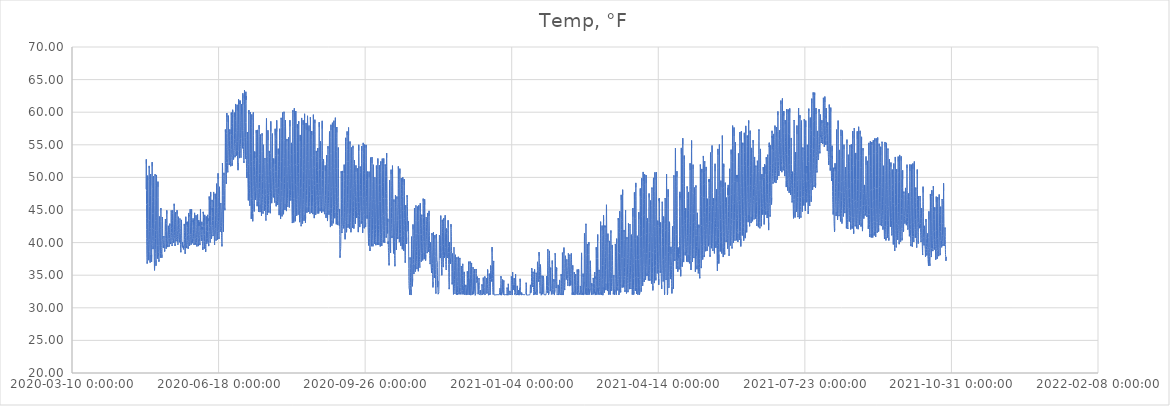
| Category | Temp, °F |
|---|---|
| 43950.56079861111 | 48.192 |
| 43950.602465277785 | 50.663 |
| 43950.64413194445 | 52.227 |
| 43950.68579861111 | 52.767 |
| 43950.727465277785 | 52.072 |
| 43950.76913194445 | 50.354 |
| 43950.81079861111 | 48.038 |
| 43950.852465277785 | 45.837 |
| 43950.89413194445 | 43.752 |
| 43950.93579861111 | 41.995 |
| 43950.977465277785 | 40.644 |
| 43951.01913194445 | 39.601 |
| 43951.06079861111 | 38.848 |
| 43951.102465277785 | 38.231 |
| 43951.14413194445 | 37.69 |
| 43951.18579861111 | 37.343 |
| 43951.227465277785 | 37.034 |
| 43951.26913194445 | 36.783 |
| 43951.31079861111 | 36.841 |
| 43951.352465277785 | 37.13 |
| 43951.39413194445 | 38.385 |
| 43951.43579861111 | 40.2 |
| 43951.477465277785 | 42.96 |
| 43951.51913194445 | 46.03 |
| 43951.56079861111 | 48.984 |
| 43951.602465277785 | 50.277 |
| 43951.64413194445 | 50.316 |
| 43951.68579861111 | 50.258 |
| 43951.727465277785 | 49.601 |
| 43951.76913194445 | 48.115 |
| 43951.81079861111 | 46.513 |
| 43951.852465277785 | 45.007 |
| 43951.89413194445 | 43.578 |
| 43951.93579861111 | 42.285 |
| 43951.977465277785 | 41.204 |
| 43952.01913194445 | 40.373 |
| 43952.06079861111 | 39.736 |
| 43952.102465277785 | 39.177 |
| 43952.14413194445 | 38.578 |
| 43952.18579861111 | 38.192 |
| 43952.227465277785 | 37.864 |
| 43952.26913194445 | 37.478 |
| 43952.31079861111 | 37.304 |
| 43952.352465277785 | 37.439 |
| 43952.39413194445 | 38.501 |
| 43952.43579861111 | 40.528 |
| 43952.477465277785 | 43.52 |
| 43952.51913194445 | 46.011 |
| 43952.56079861111 | 49.37 |
| 43952.602465277785 | 50.682 |
| 43952.64413194445 | 51.764 |
| 43952.68579861111 | 51.416 |
| 43952.727465277785 | 51.165 |
| 43952.76913194445 | 49.679 |
| 43952.81079861111 | 47.767 |
| 43952.852465277785 | 45.528 |
| 43952.89413194445 | 43.424 |
| 43952.93579861111 | 41.744 |
| 43952.977465277785 | 40.528 |
| 43953.01913194445 | 39.64 |
| 43953.06079861111 | 39.022 |
| 43953.102465277785 | 38.597 |
| 43953.14413194445 | 38.057 |
| 43953.18579861111 | 37.671 |
| 43953.227465277785 | 37.304 |
| 43953.26913194445 | 37.092 |
| 43953.31079861111 | 36.937 |
| 43953.352465277785 | 37.014 |
| 43953.39413194445 | 38.134 |
| 43953.43579861111 | 39.968 |
| 43953.477465277785 | 42.13 |
| 43953.51913194445 | 44.833 |
| 43953.56079861111 | 47.265 |
| 43953.602465277785 | 49.119 |
| 43953.64413194445 | 50.335 |
| 43953.68579861111 | 50.509 |
| 43953.727465277785 | 48.752 |
| 43953.76913194445 | 47.285 |
| 43953.81079861111 | 45.644 |
| 43953.852465277785 | 44.061 |
| 43953.89413194445 | 42.864 |
| 43953.93579861111 | 41.725 |
| 43953.977465277785 | 41.03 |
| 43954.01913194445 | 40.393 |
| 43954.06079861111 | 39.717 |
| 43954.102465277785 | 39.292 |
| 43954.14413194445 | 38.52 |
| 43954.18579861111 | 37.941 |
| 43954.227465277785 | 37.458 |
| 43954.26913194445 | 37.343 |
| 43954.31079861111 | 37.053 |
| 43954.352465277785 | 37.169 |
| 43954.39413194445 | 38.153 |
| 43954.43579861111 | 39.891 |
| 43954.477465277785 | 42.574 |
| 43954.51913194445 | 45.451 |
| 43954.56079861111 | 48.173 |
| 43954.602465277785 | 50.258 |
| 43954.64413194445 | 51.879 |
| 43954.68579861111 | 52.343 |
| 43954.727465277785 | 51.667 |
| 43954.76913194445 | 50.142 |
| 43954.81079861111 | 48.25 |
| 43954.852465277785 | 46.281 |
| 43954.89413194445 | 44.505 |
| 43954.93579861111 | 42.999 |
| 43954.977465277785 | 42.111 |
| 43955.01913194445 | 40.991 |
| 43955.06079861111 | 40.354 |
| 43955.102465277785 | 39.852 |
| 43955.14413194445 | 39.505 |
| 43955.18579861111 | 39.273 |
| 43955.227465277785 | 39.177 |
| 43955.26913194445 | 39.003 |
| 43955.31079861111 | 38.868 |
| 43955.352465277785 | 39.003 |
| 43955.39413194445 | 39.428 |
| 43955.43579861111 | 40.18 |
| 43955.477465277785 | 40.895 |
| 43955.51913194445 | 41.995 |
| 43955.56079861111 | 44.447 |
| 43955.602465277785 | 46.899 |
| 43955.64413194445 | 49.177 |
| 43955.68579861111 | 50.2 |
| 43955.727465277785 | 49.852 |
| 43955.76913194445 | 48.655 |
| 43955.81079861111 | 46.648 |
| 43955.852465277785 | 44.621 |
| 43955.89413194445 | 42.787 |
| 43955.93579861111 | 41.57 |
| 43955.977465277785 | 40.238 |
| 43956.01913194445 | 39.273 |
| 43956.06079861111 | 38.424 |
| 43956.102465277785 | 37.748 |
| 43956.14413194445 | 37.227 |
| 43956.18579861111 | 36.783 |
| 43956.227465277785 | 36.397 |
| 43956.26913194445 | 36.01 |
| 43956.31079861111 | 35.74 |
| 43956.352465277785 | 35.76 |
| 43956.39413194445 | 36.532 |
| 43956.43579861111 | 37.922 |
| 43956.477465277785 | 40.2 |
| 43956.51913194445 | 42.941 |
| 43956.56079861111 | 45.682 |
| 43956.602465277785 | 48.231 |
| 43956.64413194445 | 49.949 |
| 43956.68579861111 | 50.489 |
| 43956.727465277785 | 50.2 |
| 43956.76913194445 | 48.81 |
| 43956.81079861111 | 46.821 |
| 43956.852465277785 | 44.987 |
| 43956.89413194445 | 43.385 |
| 43956.93579861111 | 41.841 |
| 43956.977465277785 | 40.624 |
| 43957.01913194445 | 39.64 |
| 43957.06079861111 | 38.983 |
| 43957.102465277785 | 38.346 |
| 43957.14413194445 | 37.806 |
| 43957.18579861111 | 37.323 |
| 43957.227465277785 | 36.995 |
| 43957.26913194445 | 36.686 |
| 43957.31079861111 | 36.455 |
| 43957.352465277785 | 36.551 |
| 43957.39413194445 | 37.304 |
| 43957.43579861111 | 39.022 |
| 43957.477465277785 | 41.261 |
| 43957.51913194445 | 43.81 |
| 43957.56079861111 | 46.493 |
| 43957.602465277785 | 49.022 |
| 43957.64413194445 | 50.374 |
| 43957.68579861111 | 50.123 |
| 43957.727465277785 | 49.254 |
| 43957.76913194445 | 48.096 |
| 43957.81079861111 | 46.609 |
| 43957.852465277785 | 44.929 |
| 43957.89413194445 | 43.385 |
| 43957.93579861111 | 42.111 |
| 43957.977465277785 | 41.146 |
| 43958.01913194445 | 40.258 |
| 43958.06079861111 | 39.563 |
| 43958.102465277785 | 38.983 |
| 43958.14413194445 | 38.539 |
| 43958.18579861111 | 38.211 |
| 43958.227465277785 | 37.902 |
| 43958.26913194445 | 37.729 |
| 43958.31079861111 | 37.613 |
| 43958.352465277785 | 37.555 |
| 43958.39413194445 | 38.173 |
| 43958.43579861111 | 39.563 |
| 43958.477465277785 | 41.821 |
| 43958.51913194445 | 44.389 |
| 43958.56079861111 | 46.976 |
| 43958.602465277785 | 48.675 |
| 43958.64413194445 | 49.35 |
| 43958.68579861111 | 48.54 |
| 43958.727465277785 | 46.937 |
| 43958.76913194445 | 44.563 |
| 43958.81079861111 | 42.536 |
| 43958.852465277785 | 40.837 |
| 43958.89413194445 | 39.485 |
| 43958.93579861111 | 38.868 |
| 43958.977465277785 | 38.694 |
| 43959.01913194445 | 38.462 |
| 43959.06079861111 | 37.922 |
| 43959.102465277785 | 37.671 |
| 43959.14413194445 | 37.709 |
| 43959.18579861111 | 37.555 |
| 43959.227465277785 | 37.381 |
| 43959.26913194445 | 37.227 |
| 43959.31079861111 | 37.072 |
| 43959.352465277785 | 37.072 |
| 43959.39413194445 | 37.381 |
| 43959.43579861111 | 38.269 |
| 43959.477465277785 | 39.582 |
| 43959.51913194445 | 40.991 |
| 43959.56079861111 | 42.381 |
| 43959.602465277785 | 43.501 |
| 43959.64413194445 | 44.003 |
| 43959.68579861111 | 44.041 |
| 43959.727465277785 | 43.848 |
| 43959.76913194445 | 43.211 |
| 43959.81079861111 | 42.343 |
| 43959.852465277785 | 41.397 |
| 43959.89413194445 | 40.663 |
| 43959.93579861111 | 40.161 |
| 43959.977465277785 | 39.273 |
| 43960.01913194445 | 39.292 |
| 43960.06079861111 | 38.81 |
| 43960.102465277785 | 38.636 |
| 43960.14413194445 | 38.308 |
| 43960.18579861111 | 38.404 |
| 43960.227465277785 | 38.192 |
| 43960.26913194445 | 37.96 |
| 43960.31079861111 | 37.69 |
| 43960.352465277785 | 37.883 |
| 43960.39413194445 | 38.288 |
| 43960.43579861111 | 39.312 |
| 43960.477465277785 | 40.856 |
| 43960.51913194445 | 42.053 |
| 43960.56079861111 | 43.308 |
| 43960.602465277785 | 44.428 |
| 43960.64413194445 | 45.296 |
| 43960.68579861111 | 44.949 |
| 43960.727465277785 | 44.292 |
| 43960.76913194445 | 43.231 |
| 43960.81079861111 | 41.3 |
| 43960.852465277785 | 40.335 |
| 43960.89413194445 | 39.582 |
| 43960.93579861111 | 39.234 |
| 43960.977465277785 | 38.926 |
| 43961.01913194445 | 38.578 |
| 43961.06079861111 | 38.366 |
| 43961.102465277785 | 38.366 |
| 43961.14413194445 | 38.211 |
| 43961.18579861111 | 38.153 |
| 43961.227465277785 | 38.038 |
| 43961.26913194445 | 37.844 |
| 43961.31079861111 | 37.671 |
| 43961.352465277785 | 37.748 |
| 43961.39413194445 | 38.173 |
| 43961.43579861111 | 39.099 |
| 43961.477465277785 | 40.238 |
| 43961.51913194445 | 41.609 |
| 43961.56079861111 | 42.651 |
| 43961.602465277785 | 43.404 |
| 43961.64413194445 | 43.926 |
| 43961.68579861111 | 43.868 |
| 43961.727465277785 | 43.694 |
| 43961.76913194445 | 43.308 |
| 43961.81079861111 | 42.188 |
| 43961.852465277785 | 41.088 |
| 43961.89413194445 | 40.451 |
| 43961.93579861111 | 40.142 |
| 43961.977465277785 | 39.968 |
| 43962.01913194445 | 39.872 |
| 43962.06079861111 | 39.814 |
| 43962.102465277785 | 39.64 |
| 43962.14413194445 | 39.35 |
| 43962.18579861111 | 39.273 |
| 43962.227465277785 | 39.254 |
| 43962.26913194445 | 39.215 |
| 43962.31079861111 | 39.215 |
| 43962.352465277785 | 39.177 |
| 43962.39413194445 | 39.254 |
| 43962.43579861111 | 39.505 |
| 43962.477465277785 | 39.717 |
| 43962.51913194445 | 40.065 |
| 43962.56079861111 | 40.258 |
| 43962.602465277785 | 40.431 |
| 43962.64413194445 | 40.644 |
| 43962.68579861111 | 40.991 |
| 43962.727465277785 | 41.049 |
| 43962.76913194445 | 40.837 |
| 43962.81079861111 | 40.509 |
| 43962.852465277785 | 40.296 |
| 43962.89413194445 | 39.987 |
| 43962.93579861111 | 39.814 |
| 43962.977465277785 | 39.678 |
| 43963.01913194445 | 39.099 |
| 43963.06079861111 | 38.964 |
| 43963.102465277785 | 38.906 |
| 43963.14413194445 | 38.81 |
| 43963.18579861111 | 38.617 |
| 43963.227465277785 | 38.52 |
| 43963.26913194445 | 38.578 |
| 43963.31079861111 | 38.675 |
| 43963.352465277785 | 38.868 |
| 43963.39413194445 | 39.408 |
| 43963.43579861111 | 40.045 |
| 43963.477465277785 | 40.991 |
| 43963.51913194445 | 41.976 |
| 43963.56079861111 | 42.709 |
| 43963.602465277785 | 43.134 |
| 43963.64413194445 | 43.173 |
| 43963.68579861111 | 43.308 |
| 43963.727465277785 | 43.617 |
| 43963.76913194445 | 43.424 |
| 43963.81079861111 | 42.98 |
| 43963.852465277785 | 42.381 |
| 43963.89413194445 | 41.725 |
| 43963.93579861111 | 41.049 |
| 43963.977465277785 | 40.605 |
| 43964.01913194445 | 40.277 |
| 43964.06079861111 | 39.987 |
| 43964.102465277785 | 39.717 |
| 43964.14413194445 | 39.447 |
| 43964.18579861111 | 39.331 |
| 43964.227465277785 | 39.215 |
| 43964.26913194445 | 39.061 |
| 43964.31079861111 | 39.003 |
| 43964.352465277785 | 39.041 |
| 43964.39413194445 | 39.196 |
| 43964.43579861111 | 39.794 |
| 43964.477465277785 | 40.682 |
| 43964.51913194445 | 41.783 |
| 43964.56079861111 | 42.941 |
| 43964.602465277785 | 43.848 |
| 43964.64413194445 | 44.601 |
| 43964.68579861111 | 44.949 |
| 43964.727465277785 | 44.91 |
| 43964.76913194445 | 44.428 |
| 43964.81079861111 | 43.636 |
| 43964.852465277785 | 42.806 |
| 43964.89413194445 | 41.899 |
| 43964.93579861111 | 41.3 |
| 43964.977465277785 | 40.856 |
| 43965.01913194445 | 40.509 |
| 43965.06079861111 | 40.335 |
| 43965.102465277785 | 40.122 |
| 43965.14413194445 | 39.91 |
| 43965.18579861111 | 39.659 |
| 43965.227465277785 | 39.485 |
| 43965.26913194445 | 39.408 |
| 43965.31079861111 | 39.312 |
| 43965.352465277785 | 39.428 |
| 43965.39413194445 | 39.563 |
| 43965.43579861111 | 39.872 |
| 43965.477465277785 | 40.47 |
| 43965.51913194445 | 41.107 |
| 43965.56079861111 | 41.512 |
| 43965.602465277785 | 41.551 |
| 43965.64413194445 | 41.725 |
| 43965.68579861111 | 42.072 |
| 43965.727465277785 | 42.285 |
| 43965.76913194445 | 42.574 |
| 43965.81079861111 | 42.497 |
| 43965.852465277785 | 41.995 |
| 43965.89413194445 | 41.474 |
| 43965.93579861111 | 40.991 |
| 43965.977465277785 | 40.605 |
| 43966.01913194445 | 40.258 |
| 43966.06079861111 | 40.103 |
| 43966.102465277785 | 39.929 |
| 43966.14413194445 | 39.736 |
| 43966.18579861111 | 39.563 |
| 43966.227465277785 | 39.37 |
| 43966.26913194445 | 39.312 |
| 43966.31079861111 | 39.331 |
| 43966.352465277785 | 39.428 |
| 43966.39413194445 | 39.64 |
| 43966.43579861111 | 40.103 |
| 43966.477465277785 | 40.644 |
| 43966.51913194445 | 41.242 |
| 43966.56079861111 | 41.609 |
| 43966.602465277785 | 42.072 |
| 43966.64413194445 | 42.362 |
| 43966.68579861111 | 42.69 |
| 43966.727465277785 | 42.902 |
| 43966.76913194445 | 42.574 |
| 43966.81079861111 | 42.246 |
| 43966.852465277785 | 41.821 |
| 43966.89413194445 | 41.319 |
| 43966.93579861111 | 40.933 |
| 43966.977465277785 | 40.547 |
| 43967.01913194445 | 40.316 |
| 43967.06079861111 | 40.122 |
| 43967.102465277785 | 40.007 |
| 43967.14413194445 | 39.949 |
| 43967.18579861111 | 39.91 |
| 43967.227465277785 | 39.891 |
| 43967.26913194445 | 39.814 |
| 43967.31079861111 | 39.775 |
| 43967.352465277785 | 39.756 |
| 43967.39413194445 | 40.103 |
| 43967.43579861111 | 40.74 |
| 43967.477465277785 | 41.59 |
| 43967.51913194445 | 42.458 |
| 43967.56079861111 | 43.095 |
| 43967.602465277785 | 43.964 |
| 43967.64413194445 | 44.582 |
| 43967.68579861111 | 44.929 |
| 43967.727465277785 | 44.756 |
| 43967.76913194445 | 44.389 |
| 43967.81079861111 | 43.636 |
| 43967.852465277785 | 42.864 |
| 43967.89413194445 | 42.13 |
| 43967.93579861111 | 41.57 |
| 43967.977465277785 | 41.049 |
| 43968.01913194445 | 40.76 |
| 43968.06079861111 | 40.393 |
| 43968.102465277785 | 40.103 |
| 43968.14413194445 | 39.91 |
| 43968.18579861111 | 39.794 |
| 43968.227465277785 | 39.64 |
| 43968.26913194445 | 39.485 |
| 43968.31079861111 | 39.37 |
| 43968.352465277785 | 39.37 |
| 43968.39413194445 | 39.659 |
| 43968.43579861111 | 40.296 |
| 43968.477465277785 | 41.358 |
| 43968.51913194445 | 42.362 |
| 43968.56079861111 | 43.424 |
| 43968.602465277785 | 44.466 |
| 43968.64413194445 | 44.949 |
| 43968.68579861111 | 44.794 |
| 43968.727465277785 | 44.485 |
| 43968.76913194445 | 44.196 |
| 43968.81079861111 | 43.848 |
| 43968.852465277785 | 43.192 |
| 43968.89413194445 | 42.536 |
| 43968.93579861111 | 41.956 |
| 43968.977465277785 | 41.493 |
| 43969.01913194445 | 41.126 |
| 43969.06079861111 | 40.817 |
| 43969.102465277785 | 40.605 |
| 43969.14413194445 | 40.393 |
| 43969.18579861111 | 40.238 |
| 43969.227465277785 | 40.122 |
| 43969.26913194445 | 39.949 |
| 43969.31079861111 | 39.929 |
| 43969.352465277785 | 39.929 |
| 43969.39413194445 | 40.2 |
| 43969.43579861111 | 40.779 |
| 43969.477465277785 | 41.783 |
| 43969.51913194445 | 42.883 |
| 43969.56079861111 | 44.08 |
| 43969.602465277785 | 45.065 |
| 43969.64413194445 | 45.74 |
| 43969.68579861111 | 45.953 |
| 43969.727465277785 | 46.049 |
| 43969.76913194445 | 45.586 |
| 43969.81079861111 | 44.659 |
| 43969.852465277785 | 43.617 |
| 43969.89413194445 | 42.709 |
| 43969.93579861111 | 41.956 |
| 43969.977465277785 | 41.493 |
| 43970.01913194445 | 41.049 |
| 43970.06079861111 | 40.663 |
| 43970.102465277785 | 40.431 |
| 43970.14413194445 | 39.91 |
| 43970.18579861111 | 39.987 |
| 43970.227465277785 | 39.833 |
| 43970.26913194445 | 39.64 |
| 43970.31079861111 | 39.485 |
| 43970.352465277785 | 39.447 |
| 43970.39413194445 | 39.814 |
| 43970.43579861111 | 40.663 |
| 43970.477465277785 | 41.725 |
| 43970.51913194445 | 43.076 |
| 43970.56079861111 | 43.655 |
| 43970.602465277785 | 43.945 |
| 43970.64413194445 | 44.466 |
| 43970.68579861111 | 44.679 |
| 43970.727465277785 | 44.254 |
| 43970.76913194445 | 43.462 |
| 43970.81079861111 | 42.787 |
| 43970.852465277785 | 42.439 |
| 43970.89413194445 | 41.03 |
| 43970.93579861111 | 40.47 |
| 43970.977465277785 | 40.528 |
| 43971.01913194445 | 40.2 |
| 43971.06079861111 | 40.47 |
| 43971.102465277785 | 40.586 |
| 43971.14413194445 | 40.47 |
| 43971.18579861111 | 40.47 |
| 43971.227465277785 | 40.567 |
| 43971.26913194445 | 40.567 |
| 43971.31079861111 | 40.47 |
| 43971.352465277785 | 40.47 |
| 43971.39413194445 | 40.76 |
| 43971.43579861111 | 41.339 |
| 43971.477465277785 | 42.092 |
| 43971.51913194445 | 42.864 |
| 43971.56079861111 | 43.655 |
| 43971.602465277785 | 44.08 |
| 43971.64413194445 | 44.717 |
| 43971.68579861111 | 44.968 |
| 43971.727465277785 | 44.408 |
| 43971.76913194445 | 43.578 |
| 43971.81079861111 | 42.594 |
| 43971.852465277785 | 41.86 |
| 43971.89413194445 | 41.628 |
| 43971.93579861111 | 41.281 |
| 43971.977465277785 | 40.933 |
| 43972.01913194445 | 40.682 |
| 43972.06079861111 | 40.007 |
| 43972.102465277785 | 40.084 |
| 43972.14413194445 | 39.968 |
| 43972.18579861111 | 39.833 |
| 43972.227465277785 | 39.678 |
| 43972.26913194445 | 39.621 |
| 43972.31079861111 | 39.582 |
| 43972.352465277785 | 39.563 |
| 43972.39413194445 | 39.833 |
| 43972.43579861111 | 40.451 |
| 43972.477465277785 | 41.204 |
| 43972.51913194445 | 42.014 |
| 43972.56079861111 | 42.825 |
| 43972.602465277785 | 43.501 |
| 43972.64413194445 | 43.964 |
| 43972.68579861111 | 44.061 |
| 43972.727465277785 | 43.733 |
| 43972.76913194445 | 43.366 |
| 43972.81079861111 | 42.787 |
| 43972.852465277785 | 41.976 |
| 43972.89413194445 | 41.532 |
| 43972.93579861111 | 41.358 |
| 43972.977465277785 | 41.126 |
| 43973.01913194445 | 40.914 |
| 43973.06079861111 | 40.702 |
| 43973.102465277785 | 40.605 |
| 43973.14413194445 | 40.47 |
| 43973.18579861111 | 40.238 |
| 43973.227465277785 | 40.161 |
| 43973.26913194445 | 40.045 |
| 43973.31079861111 | 39.987 |
| 43973.352465277785 | 40.007 |
| 43973.39413194445 | 40.258 |
| 43973.43579861111 | 40.837 |
| 43973.477465277785 | 41.532 |
| 43973.51913194445 | 42.304 |
| 43973.56079861111 | 42.941 |
| 43973.602465277785 | 43.404 |
| 43973.64413194445 | 43.694 |
| 43973.68579861111 | 43.713 |
| 43973.727465277785 | 43.52 |
| 43973.76913194445 | 43.134 |
| 43973.81079861111 | 42.574 |
| 43973.852465277785 | 42.13 |
| 43973.89413194445 | 41.744 |
| 43973.93579861111 | 41.377 |
| 43973.977465277785 | 40.528 |
| 43974.01913194445 | 39.698 |
| 43974.06079861111 | 39.485 |
| 43974.102465277785 | 39.138 |
| 43974.14413194445 | 38.848 |
| 43974.18579861111 | 38.694 |
| 43974.227465277785 | 38.675 |
| 43974.26913194445 | 38.52 |
| 43974.31079861111 | 38.597 |
| 43974.352465277785 | 38.79 |
| 43974.39413194445 | 39.621 |
| 43974.43579861111 | 40.798 |
| 43974.477465277785 | 41.512 |
| 43974.51913194445 | 41.628 |
| 43974.56079861111 | 42.15 |
| 43974.602465277785 | 42.671 |
| 43974.64413194445 | 43.482 |
| 43974.68579861111 | 43.578 |
| 43974.727465277785 | 43.192 |
| 43974.76913194445 | 42.42 |
| 43974.81079861111 | 41.763 |
| 43974.852465277785 | 41.107 |
| 43974.89413194445 | 40.624 |
| 43974.93579861111 | 40.258 |
| 43974.977465277785 | 39.968 |
| 43975.01913194445 | 39.949 |
| 43975.06079861111 | 39.891 |
| 43975.102465277785 | 39.756 |
| 43975.14413194445 | 39.601 |
| 43975.18579861111 | 39.601 |
| 43975.227465277785 | 39.485 |
| 43975.26913194445 | 39.408 |
| 43975.31079861111 | 39.408 |
| 43975.352465277785 | 39.582 |
| 43975.39413194445 | 39.775 |
| 43975.43579861111 | 40.084 |
| 43975.477465277785 | 40.18 |
| 43975.51913194445 | 39.717 |
| 43975.56079861111 | 39.756 |
| 43975.602465277785 | 39.621 |
| 43975.64413194445 | 39.485 |
| 43975.68579861111 | 39.37 |
| 43975.727465277785 | 39.254 |
| 43975.76913194445 | 39.292 |
| 43975.81079861111 | 39.505 |
| 43975.852465277785 | 39.389 |
| 43975.89413194445 | 39.196 |
| 43975.93579861111 | 39.08 |
| 43975.977465277785 | 39.061 |
| 43976.01913194445 | 38.964 |
| 43976.06079861111 | 38.926 |
| 43976.102465277785 | 38.868 |
| 43976.14413194445 | 38.829 |
| 43976.18579861111 | 38.829 |
| 43976.227465277785 | 38.829 |
| 43976.26913194445 | 38.926 |
| 43976.31079861111 | 38.983 |
| 43976.352465277785 | 39.08 |
| 43976.39413194445 | 39.505 |
| 43976.43579861111 | 40.431 |
| 43976.477465277785 | 41.493 |
| 43976.51913194445 | 41.918 |
| 43976.56079861111 | 41.86 |
| 43976.602465277785 | 42.864 |
| 43976.64413194445 | 42.536 |
| 43976.68579861111 | 41.86 |
| 43976.727465277785 | 41.532 |
| 43976.76913194445 | 41.126 |
| 43976.81079861111 | 40.489 |
| 43976.852465277785 | 39.872 |
| 43976.89413194445 | 39.408 |
| 43976.93579861111 | 39.119 |
| 43976.977465277785 | 38.848 |
| 43977.01913194445 | 38.733 |
| 43977.06079861111 | 38.52 |
| 43977.102465277785 | 38.52 |
| 43977.14413194445 | 38.385 |
| 43977.18579861111 | 38.288 |
| 43977.227465277785 | 38.327 |
| 43977.26913194445 | 38.269 |
| 43977.31079861111 | 38.346 |
| 43977.352465277785 | 38.617 |
| 43977.39413194445 | 39.485 |
| 43977.43579861111 | 40.76 |
| 43977.477465277785 | 41.763 |
| 43977.51913194445 | 42.69 |
| 43977.56079861111 | 43.366 |
| 43977.602465277785 | 43.81 |
| 43977.64413194445 | 43.964 |
| 43977.68579861111 | 42.902 |
| 43977.727465277785 | 42.343 |
| 43977.76913194445 | 41.821 |
| 43977.81079861111 | 41.416 |
| 43977.852465277785 | 40.914 |
| 43977.89413194445 | 40.296 |
| 43977.93579861111 | 40.084 |
| 43977.977465277785 | 39.929 |
| 43978.01913194445 | 39.872 |
| 43978.06079861111 | 39.678 |
| 43978.102465277785 | 39.505 |
| 43978.14413194445 | 39.331 |
| 43978.18579861111 | 39.254 |
| 43978.227465277785 | 39.196 |
| 43978.26913194445 | 39.157 |
| 43978.31079861111 | 39.196 |
| 43978.352465277785 | 39.505 |
| 43978.39413194445 | 40.065 |
| 43978.43579861111 | 41.088 |
| 43978.477465277785 | 42.671 |
| 43978.51913194445 | 43.153 |
| 43978.56079861111 | 42.767 |
| 43978.602465277785 | 42.787 |
| 43978.64413194445 | 43.192 |
| 43978.68579861111 | 43.076 |
| 43978.727465277785 | 42.343 |
| 43978.76913194445 | 41.551 |
| 43978.81079861111 | 41.107 |
| 43978.852465277785 | 40.702 |
| 43978.89413194445 | 40.354 |
| 43978.93579861111 | 40.026 |
| 43978.977465277785 | 39.891 |
| 43979.01913194445 | 39.717 |
| 43979.06079861111 | 39.678 |
| 43979.102465277785 | 39.543 |
| 43979.14413194445 | 39.447 |
| 43979.18579861111 | 39.254 |
| 43979.227465277785 | 39.138 |
| 43979.26913194445 | 39.061 |
| 43979.31079861111 | 39.061 |
| 43979.352465277785 | 39.331 |
| 43979.39413194445 | 40.219 |
| 43979.43579861111 | 41.261 |
| 43979.477465277785 | 42.555 |
| 43979.51913194445 | 43.713 |
| 43979.56079861111 | 44.35 |
| 43979.602465277785 | 44.543 |
| 43979.64413194445 | 44.003 |
| 43979.68579861111 | 44.234 |
| 43979.727465277785 | 44.041 |
| 43979.76913194445 | 43.269 |
| 43979.81079861111 | 42.381 |
| 43979.852465277785 | 41.686 |
| 43979.89413194445 | 41.107 |
| 43979.93579861111 | 40.76 |
| 43979.977465277785 | 40.47 |
| 43980.01913194445 | 40.2 |
| 43980.06079861111 | 40.007 |
| 43980.102465277785 | 39.891 |
| 43980.14413194445 | 39.736 |
| 43980.18579861111 | 39.659 |
| 43980.227465277785 | 39.524 |
| 43980.26913194445 | 39.466 |
| 43980.31079861111 | 39.447 |
| 43980.352465277785 | 39.717 |
| 43980.39413194445 | 40.258 |
| 43980.43579861111 | 41.223 |
| 43980.477465277785 | 42.265 |
| 43980.51913194445 | 43.134 |
| 43980.56079861111 | 44.041 |
| 43980.602465277785 | 44.814 |
| 43980.64413194445 | 45.123 |
| 43980.68579861111 | 44.312 |
| 43980.727465277785 | 43.424 |
| 43980.76913194445 | 43.018 |
| 43980.81079861111 | 42.4 |
| 43980.852465277785 | 41.783 |
| 43980.89413194445 | 41.242 |
| 43980.93579861111 | 40.914 |
| 43980.977465277785 | 40.547 |
| 43981.01913194445 | 40.258 |
| 43981.06079861111 | 40.2 |
| 43981.102465277785 | 40.161 |
| 43981.14413194445 | 40.084 |
| 43981.18579861111 | 39.949 |
| 43981.227465277785 | 39.872 |
| 43981.26913194445 | 39.678 |
| 43981.31079861111 | 39.659 |
| 43981.352465277785 | 39.814 |
| 43981.39413194445 | 40.354 |
| 43981.43579861111 | 41.184 |
| 43981.477465277785 | 42.4 |
| 43981.51913194445 | 43.559 |
| 43981.56079861111 | 44.736 |
| 43981.602465277785 | 45.103 |
| 43981.64413194445 | 44.292 |
| 43981.68579861111 | 43.038 |
| 43981.727465277785 | 42.265 |
| 43981.76913194445 | 41.899 |
| 43981.81079861111 | 41.57 |
| 43981.852465277785 | 41.242 |
| 43981.89413194445 | 40.972 |
| 43981.93579861111 | 40.624 |
| 43981.977465277785 | 40.373 |
| 43982.01913194445 | 40.258 |
| 43982.06079861111 | 40.161 |
| 43982.102465277785 | 40.18 |
| 43982.14413194445 | 40.2 |
| 43982.18579861111 | 40.065 |
| 43982.227465277785 | 39.91 |
| 43982.26913194445 | 39.814 |
| 43982.31079861111 | 39.775 |
| 43982.352465277785 | 39.91 |
| 43982.39413194445 | 40.605 |
| 43982.43579861111 | 41.512 |
| 43982.477465277785 | 42.497 |
| 43982.51913194445 | 43.173 |
| 43982.56079861111 | 43.25 |
| 43982.602465277785 | 43.713 |
| 43982.64413194445 | 43.501 |
| 43982.68579861111 | 43.153 |
| 43982.727465277785 | 43.404 |
| 43982.76913194445 | 43.327 |
| 43982.81079861111 | 42.709 |
| 43982.852465277785 | 41.976 |
| 43982.89413194445 | 41.455 |
| 43982.93579861111 | 40.991 |
| 43982.977465277785 | 40.605 |
| 43983.01913194445 | 40.431 |
| 43983.06079861111 | 40.18 |
| 43983.102465277785 | 40.045 |
| 43983.14413194445 | 39.891 |
| 43983.18579861111 | 39.891 |
| 43983.227465277785 | 39.794 |
| 43983.26913194445 | 39.64 |
| 43983.31079861111 | 39.717 |
| 43983.352465277785 | 39.929 |
| 43983.39413194445 | 40.431 |
| 43983.43579861111 | 41.358 |
| 43983.477465277785 | 42.555 |
| 43983.51913194445 | 43.25 |
| 43983.56079861111 | 44.119 |
| 43983.602465277785 | 44.389 |
| 43983.64413194445 | 44.563 |
| 43983.68579861111 | 44.157 |
| 43983.727465277785 | 43.482 |
| 43983.76913194445 | 42.536 |
| 43983.81079861111 | 41.995 |
| 43983.852465277785 | 41.532 |
| 43983.89413194445 | 41.068 |
| 43983.93579861111 | 40.663 |
| 43983.977465277785 | 40.393 |
| 43984.01913194445 | 40.2 |
| 43984.06079861111 | 40.026 |
| 43984.102465277785 | 39.872 |
| 43984.14413194445 | 39.794 |
| 43984.18579861111 | 39.698 |
| 43984.227465277785 | 39.698 |
| 43984.26913194445 | 39.717 |
| 43984.31079861111 | 39.833 |
| 43984.352465277785 | 39.949 |
| 43984.39413194445 | 40.605 |
| 43984.43579861111 | 41.512 |
| 43984.477465277785 | 41.783 |
| 43984.51913194445 | 42.478 |
| 43984.56079861111 | 43.559 |
| 43984.602465277785 | 44.196 |
| 43984.64413194445 | 44.177 |
| 43984.68579861111 | 43.385 |
| 43984.727465277785 | 42.806 |
| 43984.76913194445 | 42.343 |
| 43984.81079861111 | 41.899 |
| 43984.852465277785 | 41.3 |
| 43984.89413194445 | 40.817 |
| 43984.93579861111 | 40.373 |
| 43984.977465277785 | 40.026 |
| 43985.01913194445 | 39.852 |
| 43985.06079861111 | 39.756 |
| 43985.102465277785 | 39.563 |
| 43985.14413194445 | 39.485 |
| 43985.18579861111 | 39.485 |
| 43985.227465277785 | 39.408 |
| 43985.26913194445 | 39.37 |
| 43985.31079861111 | 39.428 |
| 43985.352465277785 | 39.891 |
| 43985.39413194445 | 40.721 |
| 43985.43579861111 | 41.319 |
| 43985.477465277785 | 42.42 |
| 43985.51913194445 | 42.902 |
| 43985.56079861111 | 43.153 |
| 43985.602465277785 | 44.061 |
| 43985.64413194445 | 44.196 |
| 43985.68579861111 | 44.312 |
| 43985.727465277785 | 43.501 |
| 43985.76913194445 | 42.69 |
| 43985.81079861111 | 41.956 |
| 43985.852465277785 | 41.242 |
| 43985.89413194445 | 40.779 |
| 43985.93579861111 | 40.47 |
| 43985.977465277785 | 40.219 |
| 43986.01913194445 | 40.122 |
| 43986.06079861111 | 39.949 |
| 43986.102465277785 | 39.717 |
| 43986.14413194445 | 39.736 |
| 43986.18579861111 | 39.678 |
| 43986.227465277785 | 39.64 |
| 43986.26913194445 | 39.466 |
| 43986.31079861111 | 39.447 |
| 43986.352465277785 | 39.794 |
| 43986.39413194445 | 40.624 |
| 43986.43579861111 | 41.744 |
| 43986.477465277785 | 42.671 |
| 43986.51913194445 | 43.443 |
| 43986.56079861111 | 42.999 |
| 43986.602465277785 | 42.536 |
| 43986.64413194445 | 42.651 |
| 43986.68579861111 | 43.095 |
| 43986.727465277785 | 42.748 |
| 43986.76913194445 | 42.42 |
| 43986.81079861111 | 41.918 |
| 43986.852465277785 | 41.107 |
| 43986.89413194445 | 40.721 |
| 43986.93579861111 | 40.393 |
| 43986.977465277785 | 40.18 |
| 43987.01913194445 | 40.045 |
| 43987.06079861111 | 39.987 |
| 43987.102465277785 | 39.929 |
| 43987.14413194445 | 39.814 |
| 43987.18579861111 | 39.678 |
| 43987.227465277785 | 39.621 |
| 43987.26913194445 | 39.601 |
| 43987.31079861111 | 39.659 |
| 43987.352465277785 | 39.91 |
| 43987.39413194445 | 40.702 |
| 43987.43579861111 | 41.783 |
| 43987.477465277785 | 42.883 |
| 43987.51913194445 | 43.501 |
| 43987.56079861111 | 44.099 |
| 43987.602465277785 | 44.408 |
| 43987.64413194445 | 45.103 |
| 43987.68579861111 | 44.659 |
| 43987.727465277785 | 43.848 |
| 43987.76913194445 | 42.845 |
| 43987.81079861111 | 42.285 |
| 43987.852465277785 | 41.879 |
| 43987.89413194445 | 41.532 |
| 43987.93579861111 | 41.184 |
| 43987.977465277785 | 40.953 |
| 43988.01913194445 | 40.817 |
| 43988.06079861111 | 40.76 |
| 43988.102465277785 | 40.682 |
| 43988.14413194445 | 40.586 |
| 43988.18579861111 | 40.431 |
| 43988.227465277785 | 40.335 |
| 43988.26913194445 | 40.277 |
| 43988.31079861111 | 40.431 |
| 43988.352465277785 | 40.547 |
| 43988.39413194445 | 40.817 |
| 43988.43579861111 | 41.242 |
| 43988.477465277785 | 41.744 |
| 43988.51913194445 | 41.667 |
| 43988.56079861111 | 42.594 |
| 43988.602465277785 | 43.192 |
| 43988.64413194445 | 42.671 |
| 43988.68579861111 | 42.111 |
| 43988.727465277785 | 42.381 |
| 43988.76913194445 | 42.458 |
| 43988.81079861111 | 41.937 |
| 43988.852465277785 | 41.281 |
| 43988.89413194445 | 40.721 |
| 43988.93579861111 | 40.373 |
| 43988.977465277785 | 40.161 |
| 43989.01913194445 | 40.045 |
| 43989.06079861111 | 39.814 |
| 43989.102465277785 | 39.563 |
| 43989.14413194445 | 39.37 |
| 43989.18579861111 | 39.234 |
| 43989.227465277785 | 39.041 |
| 43989.26913194445 | 38.887 |
| 43989.31079861111 | 38.945 |
| 43989.352465277785 | 39.35 |
| 43989.39413194445 | 40.2 |
| 43989.43579861111 | 41.435 |
| 43989.477465277785 | 42.787 |
| 43989.51913194445 | 43.945 |
| 43989.56079861111 | 44.717 |
| 43989.602465277785 | 44.505 |
| 43989.64413194445 | 44.679 |
| 43989.68579861111 | 44.428 |
| 43989.727465277785 | 43.829 |
| 43989.76913194445 | 43.057 |
| 43989.81079861111 | 42.478 |
| 43989.852465277785 | 41.899 |
| 43989.89413194445 | 41.3 |
| 43989.93579861111 | 40.914 |
| 43989.977465277785 | 40.393 |
| 43990.01913194445 | 40.122 |
| 43990.06079861111 | 39.987 |
| 43990.102465277785 | 39.756 |
| 43990.14413194445 | 39.621 |
| 43990.18579861111 | 39.485 |
| 43990.227465277785 | 39.234 |
| 43990.26913194445 | 39.138 |
| 43990.31079861111 | 39.08 |
| 43990.352465277785 | 39.331 |
| 43990.39413194445 | 40.18 |
| 43990.43579861111 | 41.242 |
| 43990.477465277785 | 42.42 |
| 43990.51913194445 | 43.636 |
| 43990.56079861111 | 44.254 |
| 43990.602465277785 | 44.177 |
| 43990.64413194445 | 43.443 |
| 43990.68579861111 | 43.289 |
| 43990.727465277785 | 42.69 |
| 43990.76913194445 | 42.285 |
| 43990.81079861111 | 41.821 |
| 43990.852465277785 | 41.146 |
| 43990.89413194445 | 40.567 |
| 43990.93579861111 | 40.045 |
| 43990.977465277785 | 39.659 |
| 43991.01913194445 | 39.37 |
| 43991.06079861111 | 39.099 |
| 43991.102465277785 | 38.79 |
| 43991.14413194445 | 38.675 |
| 43991.18579861111 | 38.559 |
| 43991.227465277785 | 38.559 |
| 43991.26913194445 | 38.675 |
| 43991.31079861111 | 38.636 |
| 43991.352465277785 | 38.964 |
| 43991.39413194445 | 39.35 |
| 43991.43579861111 | 39.736 |
| 43991.477465277785 | 40.47 |
| 43991.51913194445 | 41.223 |
| 43991.56079861111 | 43.462 |
| 43991.602465277785 | 44.022 |
| 43991.64413194445 | 42.787 |
| 43991.68579861111 | 42.497 |
| 43991.727465277785 | 41.86 |
| 43991.76913194445 | 40.991 |
| 43991.81079861111 | 40.644 |
| 43991.852465277785 | 40.219 |
| 43991.89413194445 | 39.987 |
| 43991.93579861111 | 39.891 |
| 43991.977465277785 | 39.833 |
| 43992.01913194445 | 39.852 |
| 43992.06079861111 | 39.872 |
| 43992.102465277785 | 39.794 |
| 43992.14413194445 | 39.736 |
| 43992.18579861111 | 39.756 |
| 43992.227465277785 | 39.833 |
| 43992.26913194445 | 39.929 |
| 43992.31079861111 | 39.872 |
| 43992.352465277785 | 39.852 |
| 43992.39413194445 | 40.605 |
| 43992.43579861111 | 41.686 |
| 43992.477465277785 | 42.787 |
| 43992.51913194445 | 44.022 |
| 43992.56079861111 | 44.254 |
| 43992.602465277785 | 44.022 |
| 43992.64413194445 | 43.559 |
| 43992.68579861111 | 43.289 |
| 43992.727465277785 | 43.713 |
| 43992.76913194445 | 43.346 |
| 43992.81079861111 | 42.439 |
| 43992.852465277785 | 41.686 |
| 43992.89413194445 | 41.146 |
| 43992.93579861111 | 40.779 |
| 43992.977465277785 | 40.509 |
| 43993.01913194445 | 40.316 |
| 43993.06079861111 | 40.18 |
| 43993.102465277785 | 40.045 |
| 43993.14413194445 | 39.891 |
| 43993.18579861111 | 39.659 |
| 43993.227465277785 | 39.543 |
| 43993.26913194445 | 39.466 |
| 43993.31079861111 | 39.447 |
| 43993.352465277785 | 39.794 |
| 43993.39413194445 | 40.682 |
| 43993.43579861111 | 41.879 |
| 43993.477465277785 | 43.346 |
| 43993.51913194445 | 44.775 |
| 43993.56079861111 | 46.068 |
| 43993.602465277785 | 47.072 |
| 43993.64413194445 | 47.13 |
| 43993.68579861111 | 47.111 |
| 43993.727465277785 | 46.493 |
| 43993.76913194445 | 45.451 |
| 43993.81079861111 | 44.177 |
| 43993.852465277785 | 43.173 |
| 43993.89413194445 | 42.323 |
| 43993.93579861111 | 41.744 |
| 43993.977465277785 | 41.242 |
| 43994.01913194445 | 40.953 |
| 43994.06079861111 | 40.644 |
| 43994.102465277785 | 40.451 |
| 43994.14413194445 | 40.316 |
| 43994.18579861111 | 40.219 |
| 43994.227465277785 | 40.103 |
| 43994.26913194445 | 40.007 |
| 43994.31079861111 | 39.949 |
| 43994.352465277785 | 40.2 |
| 43994.39413194445 | 41.184 |
| 43994.43579861111 | 42.632 |
| 43994.477465277785 | 44.196 |
| 43994.51913194445 | 45.74 |
| 43994.56079861111 | 46.976 |
| 43994.602465277785 | 47.767 |
| 43994.64413194445 | 47.767 |
| 43994.68579861111 | 47.072 |
| 43994.727465277785 | 46.339 |
| 43994.76913194445 | 44.872 |
| 43994.81079861111 | 44.003 |
| 43994.852465277785 | 43.211 |
| 43994.89413194445 | 42.458 |
| 43994.93579861111 | 41.956 |
| 43994.977465277785 | 41.628 |
| 43995.01913194445 | 41.358 |
| 43995.06079861111 | 41.126 |
| 43995.102465277785 | 40.991 |
| 43995.14413194445 | 40.779 |
| 43995.18579861111 | 40.586 |
| 43995.227465277785 | 40.47 |
| 43995.26913194445 | 40.489 |
| 43995.31079861111 | 40.567 |
| 43995.352465277785 | 41.126 |
| 43995.39413194445 | 41.744 |
| 43995.43579861111 | 42.574 |
| 43995.477465277785 | 43.25 |
| 43995.51913194445 | 45.103 |
| 43995.56079861111 | 46.551 |
| 43995.602465277785 | 46.262 |
| 43995.64413194445 | 45.045 |
| 43995.68579861111 | 44.949 |
| 43995.727465277785 | 45.258 |
| 43995.76913194445 | 44.601 |
| 43995.81079861111 | 44.003 |
| 43995.852465277785 | 43.404 |
| 43995.89413194445 | 43.018 |
| 43995.93579861111 | 42.632 |
| 43995.977465277785 | 42.362 |
| 43996.01913194445 | 42.092 |
| 43996.06079861111 | 41.879 |
| 43996.102465277785 | 41.628 |
| 43996.14413194445 | 41.416 |
| 43996.18579861111 | 41.223 |
| 43996.227465277785 | 41.011 |
| 43996.26913194445 | 40.953 |
| 43996.31079861111 | 40.914 |
| 43996.352465277785 | 41.165 |
| 43996.39413194445 | 41.59 |
| 43996.43579861111 | 42.381 |
| 43996.477465277785 | 43.404 |
| 43996.51913194445 | 45.393 |
| 43996.56079861111 | 46.455 |
| 43996.602465277785 | 47.555 |
| 43996.64413194445 | 47.767 |
| 43996.68579861111 | 47.304 |
| 43996.727465277785 | 46.899 |
| 43996.76913194445 | 45.991 |
| 43996.81079861111 | 44.717 |
| 43996.852465277785 | 43.636 |
| 43996.89413194445 | 42.729 |
| 43996.93579861111 | 42.072 |
| 43996.977465277785 | 41.628 |
| 43997.01913194445 | 41.3 |
| 43997.06079861111 | 40.991 |
| 43997.102465277785 | 40.721 |
| 43997.14413194445 | 40.47 |
| 43997.18579861111 | 40.122 |
| 43997.227465277785 | 39.814 |
| 43997.26913194445 | 39.659 |
| 43997.31079861111 | 39.814 |
| 43997.352465277785 | 40.296 |
| 43997.39413194445 | 41.107 |
| 43997.43579861111 | 42.034 |
| 43997.477465277785 | 42.864 |
| 43997.51913194445 | 43.52 |
| 43997.56079861111 | 44.312 |
| 43997.602465277785 | 45.779 |
| 43997.64413194445 | 47.497 |
| 43997.68579861111 | 47.594 |
| 43997.727465277785 | 47.594 |
| 43997.76913194445 | 46.706 |
| 43997.81079861111 | 45.431 |
| 43997.852465277785 | 44.177 |
| 43997.89413194445 | 43.327 |
| 43997.93579861111 | 42.69 |
| 43997.977465277785 | 42.188 |
| 43998.01913194445 | 41.802 |
| 43998.06079861111 | 41.474 |
| 43998.102465277785 | 41.3 |
| 43998.14413194445 | 40.991 |
| 43998.18579861111 | 40.721 |
| 43998.227465277785 | 40.489 |
| 43998.26913194445 | 40.296 |
| 43998.31079861111 | 40.277 |
| 43998.352465277785 | 40.605 |
| 43998.39413194445 | 41.628 |
| 43998.43579861111 | 43.057 |
| 43998.477465277785 | 44.447 |
| 43998.51913194445 | 45.605 |
| 43998.56079861111 | 47.034 |
| 43998.602465277785 | 48.038 |
| 43998.64413194445 | 48.482 |
| 43998.68579861111 | 49.041 |
| 43998.727465277785 | 48.057 |
| 43998.76913194445 | 47.516 |
| 43998.81079861111 | 46.146 |
| 43998.852465277785 | 44.91 |
| 43998.89413194445 | 43.81 |
| 43998.93579861111 | 43.038 |
| 43998.977465277785 | 42.42 |
| 43999.01913194445 | 42.053 |
| 43999.06079861111 | 41.667 |
| 43999.102465277785 | 41.397 |
| 43999.14413194445 | 41.146 |
| 43999.18579861111 | 40.895 |
| 43999.227465277785 | 40.644 |
| 43999.26913194445 | 40.47 |
| 43999.31079861111 | 40.373 |
| 43999.352465277785 | 40.721 |
| 43999.39413194445 | 41.725 |
| 43999.43579861111 | 43.385 |
| 43999.477465277785 | 45.373 |
| 43999.51913194445 | 47.265 |
| 43999.56079861111 | 48.945 |
| 43999.602465277785 | 50.084 |
| 43999.64413194445 | 50.625 |
| 43999.68579861111 | 50.567 |
| 43999.727465277785 | 49.756 |
| 43999.76913194445 | 48.482 |
| 43999.81079861111 | 46.899 |
| 43999.852465277785 | 45.567 |
| 43999.89413194445 | 44.64 |
| 43999.93579861111 | 43.81 |
| 43999.977465277785 | 43.231 |
| 44000.01913194445 | 42.748 |
| 44000.06079861111 | 42.246 |
| 44000.102465277785 | 41.86 |
| 44000.14413194445 | 41.377 |
| 44000.18579861111 | 41.107 |
| 44000.227465277785 | 40.779 |
| 44000.26913194445 | 40.567 |
| 44000.31079861111 | 40.605 |
| 44000.352465277785 | 40.817 |
| 44000.39413194445 | 41.628 |
| 44000.43579861111 | 43.134 |
| 44000.477465277785 | 44.968 |
| 44000.51913194445 | 46.435 |
| 44000.56079861111 | 48.231 |
| 44000.602465277785 | 48.559 |
| 44000.64413194445 | 48.578 |
| 44000.68579861111 | 47.536 |
| 44000.727465277785 | 46.281 |
| 44000.76913194445 | 45.103 |
| 44000.81079861111 | 44.177 |
| 44000.852465277785 | 43.79 |
| 44000.89413194445 | 43.385 |
| 44000.93579861111 | 42.902 |
| 44000.977465277785 | 42.516 |
| 44001.01913194445 | 42.285 |
| 44001.06079861111 | 41.956 |
| 44001.102465277785 | 41.667 |
| 44001.14413194445 | 41.628 |
| 44001.18579861111 | 41.667 |
| 44001.227465277785 | 41.725 |
| 44001.26913194445 | 41.686 |
| 44001.31079861111 | 41.648 |
| 44001.352465277785 | 41.841 |
| 44001.39413194445 | 42.15 |
| 44001.43579861111 | 42.613 |
| 44001.477465277785 | 43.617 |
| 44001.51913194445 | 44.987 |
| 44001.56079861111 | 46.049 |
| 44001.602465277785 | 45.875 |
| 44001.64413194445 | 45.451 |
| 44001.68579861111 | 45.431 |
| 44001.727465277785 | 45.528 |
| 44001.76913194445 | 45.47 |
| 44001.81079861111 | 44.717 |
| 44001.852465277785 | 44.061 |
| 44001.89413194445 | 43.115 |
| 44001.93579861111 | 42.497 |
| 44001.977465277785 | 41.821 |
| 44002.01913194445 | 41.416 |
| 44002.06079861111 | 41.049 |
| 44002.102465277785 | 40.721 |
| 44002.14413194445 | 40.431 |
| 44002.18579861111 | 40.18 |
| 44002.227465277785 | 39.833 |
| 44002.26913194445 | 39.621 |
| 44002.31079861111 | 39.428 |
| 44002.352465277785 | 39.756 |
| 44002.39413194445 | 40.837 |
| 44002.43579861111 | 42.69 |
| 44002.477465277785 | 44.968 |
| 44002.51913194445 | 47.246 |
| 44002.56079861111 | 49.524 |
| 44002.602465277785 | 51.3 |
| 44002.64413194445 | 52.208 |
| 44002.68579861111 | 52.15 |
| 44002.727465277785 | 51.165 |
| 44002.76913194445 | 49.949 |
| 44002.81079861111 | 48.578 |
| 44002.852465277785 | 47.188 |
| 44002.89413194445 | 46.068 |
| 44002.93579861111 | 45.045 |
| 44002.977465277785 | 44.273 |
| 44003.01913194445 | 43.578 |
| 44003.06079861111 | 43.038 |
| 44003.102465277785 | 42.748 |
| 44003.14413194445 | 42.439 |
| 44003.18579861111 | 42.227 |
| 44003.227465277785 | 41.937 |
| 44003.26913194445 | 41.667 |
| 44003.31079861111 | 41.609 |
| 44003.352465277785 | 42.072 |
| 44003.39413194445 | 42.98 |
| 44003.43579861111 | 45.007 |
| 44003.477465277785 | 47.265 |
| 44003.51913194445 | 49.041 |
| 44003.56079861111 | 49.852 |
| 44003.602465277785 | 50.123 |
| 44003.64413194445 | 50.142 |
| 44003.68579861111 | 50.702 |
| 44003.727465277785 | 50.393 |
| 44003.76913194445 | 50.18 |
| 44003.81079861111 | 49.64 |
| 44003.852465277785 | 48.81 |
| 44003.89413194445 | 47.941 |
| 44003.93579861111 | 47.285 |
| 44003.977465277785 | 46.667 |
| 44004.01913194445 | 46.165 |
| 44004.06079861111 | 45.721 |
| 44004.102465277785 | 45.547 |
| 44004.14413194445 | 45.335 |
| 44004.18579861111 | 45.2 |
| 44004.227465277785 | 45.123 |
| 44004.26913194445 | 44.987 |
| 44004.31079861111 | 44.968 |
| 44004.352465277785 | 45.258 |
| 44004.39413194445 | 46.377 |
| 44004.43579861111 | 48.269 |
| 44004.477465277785 | 50.605 |
| 44004.51913194445 | 53.289 |
| 44004.56079861111 | 53.25 |
| 44004.602465277785 | 55.76 |
| 44004.64413194445 | 57.343 |
| 44004.68579861111 | 56.937 |
| 44004.727465277785 | 55.335 |
| 44004.76913194445 | 54.35 |
| 44004.81079861111 | 53.424 |
| 44004.852465277785 | 52.594 |
| 44004.89413194445 | 51.532 |
| 44004.93579861111 | 50.933 |
| 44004.977465277785 | 50.74 |
| 44005.01913194445 | 50.296 |
| 44005.06079861111 | 49.987 |
| 44005.102465277785 | 49.717 |
| 44005.14413194445 | 49.466 |
| 44005.18579861111 | 49.254 |
| 44005.227465277785 | 49.138 |
| 44005.26913194445 | 49.022 |
| 44005.31079861111 | 48.964 |
| 44005.352465277785 | 49.312 |
| 44005.39413194445 | 50.393 |
| 44005.43579861111 | 52.304 |
| 44005.477465277785 | 54.524 |
| 44005.51913194445 | 56.725 |
| 44005.56079861111 | 58.424 |
| 44005.602465277785 | 59.119 |
| 44005.64413194445 | 59.872 |
| 44005.68579861111 | 59.215 |
| 44005.727465277785 | 58.52 |
| 44005.76913194445 | 57.188 |
| 44005.81079861111 | 56.107 |
| 44005.852465277785 | 55.181 |
| 44005.89413194445 | 54.292 |
| 44005.93579861111 | 53.578 |
| 44005.977465277785 | 52.922 |
| 44006.01913194445 | 52.285 |
| 44006.06079861111 | 51.821 |
| 44006.102465277785 | 51.435 |
| 44006.14413194445 | 51.262 |
| 44006.18579861111 | 51.107 |
| 44006.227465277785 | 50.953 |
| 44006.26913194445 | 50.779 |
| 44006.31079861111 | 50.682 |
| 44006.352465277785 | 50.933 |
| 44006.39413194445 | 52.034 |
| 44006.43579861111 | 53.771 |
| 44006.477465277785 | 55.779 |
| 44006.51913194445 | 56.725 |
| 44006.56079861111 | 58.211 |
| 44006.602465277785 | 59.486 |
| 44006.64413194445 | 59.563 |
| 44006.68579861111 | 58.482 |
| 44006.727465277785 | 59.061 |
| 44006.76913194445 | 59.35 |
| 44006.81079861111 | 58.54 |
| 44006.852465277785 | 56.937 |
| 44006.89413194445 | 55.451 |
| 44006.93579861111 | 54.717 |
| 44006.977465277785 | 53.945 |
| 44007.01913194445 | 53.404 |
| 44007.06079861111 | 52.98 |
| 44007.102465277785 | 52.652 |
| 44007.14413194445 | 52.42 |
| 44007.18579861111 | 52.246 |
| 44007.227465277785 | 52.053 |
| 44007.26913194445 | 51.899 |
| 44007.31079861111 | 51.821 |
| 44007.352465277785 | 52.227 |
| 44007.39413194445 | 53.115 |
| 44007.43579861111 | 54.466 |
| 44007.477465277785 | 55.702 |
| 44007.51913194445 | 56.339 |
| 44007.56079861111 | 56.86 |
| 44007.602465277785 | 56.706 |
| 44007.64413194445 | 56.976 |
| 44007.68579861111 | 57.362 |
| 44007.727465277785 | 57.015 |
| 44007.76913194445 | 56.435 |
| 44007.81079861111 | 55.586 |
| 44007.852465277785 | 54.872 |
| 44007.89413194445 | 54.215 |
| 44007.93579861111 | 53.675 |
| 44007.977465277785 | 53.115 |
| 44008.01913194445 | 52.652 |
| 44008.06079861111 | 52.632 |
| 44008.102465277785 | 52.478 |
| 44008.14413194445 | 52.362 |
| 44008.18579861111 | 52.111 |
| 44008.227465277785 | 51.879 |
| 44008.26913194445 | 51.706 |
| 44008.31079861111 | 51.686 |
| 44008.352465277785 | 51.995 |
| 44008.39413194445 | 52.96 |
| 44008.43579861111 | 54.505 |
| 44008.477465277785 | 56.3 |
| 44008.51913194445 | 58.038 |
| 44008.56079861111 | 58.887 |
| 44008.602465277785 | 59.679 |
| 44008.64413194445 | 59.717 |
| 44008.68579861111 | 59.949 |
| 44008.727465277785 | 59.524 |
| 44008.76913194445 | 57.806 |
| 44008.81079861111 | 56.609 |
| 44008.852465277785 | 55.605 |
| 44008.89413194445 | 55.007 |
| 44008.93579861111 | 54.254 |
| 44008.977465277785 | 53.462 |
| 44009.01913194445 | 53.038 |
| 44009.06079861111 | 52.767 |
| 44009.102465277785 | 52.574 |
| 44009.14413194445 | 52.362 |
| 44009.18579861111 | 52.034 |
| 44009.227465277785 | 51.783 |
| 44009.26913194445 | 51.783 |
| 44009.31079861111 | 51.86 |
| 44009.352465277785 | 52.246 |
| 44009.39413194445 | 53.308 |
| 44009.43579861111 | 54.968 |
| 44009.477465277785 | 56.377 |
| 44009.51913194445 | 58.269 |
| 44009.56079861111 | 59.64 |
| 44009.602465277785 | 60.374 |
| 44009.64413194445 | 60.509 |
| 44009.68579861111 | 60.026 |
| 44009.727465277785 | 58.984 |
| 44009.76913194445 | 57.632 |
| 44009.81079861111 | 56.783 |
| 44009.852465277785 | 55.547 |
| 44009.89413194445 | 54.582 |
| 44009.93579861111 | 54.042 |
| 44009.977465277785 | 53.829 |
| 44010.01913194445 | 53.636 |
| 44010.06079861111 | 53.462 |
| 44010.102465277785 | 53.211 |
| 44010.14413194445 | 52.98 |
| 44010.18579861111 | 52.883 |
| 44010.227465277785 | 52.748 |
| 44010.26913194445 | 52.652 |
| 44010.31079861111 | 52.787 |
| 44010.352465277785 | 53.211 |
| 44010.39413194445 | 54.099 |
| 44010.43579861111 | 54.408 |
| 44010.477465277785 | 54.872 |
| 44010.51913194445 | 55.953 |
| 44010.56079861111 | 57.034 |
| 44010.602465277785 | 58.211 |
| 44010.64413194445 | 58.868 |
| 44010.68579861111 | 59.505 |
| 44010.727465277785 | 59.949 |
| 44010.76913194445 | 59.235 |
| 44010.81079861111 | 57.883 |
| 44010.852465277785 | 56.667 |
| 44010.89413194445 | 55.798 |
| 44010.93579861111 | 55.103 |
| 44010.977465277785 | 54.717 |
| 44011.01913194445 | 54.37 |
| 44011.06079861111 | 54.099 |
| 44011.102465277785 | 53.868 |
| 44011.14413194445 | 53.578 |
| 44011.18579861111 | 53.269 |
| 44011.227465277785 | 53.096 |
| 44011.26913194445 | 52.999 |
| 44011.31079861111 | 53.057 |
| 44011.352465277785 | 53.424 |
| 44011.39413194445 | 53.984 |
| 44011.43579861111 | 55.219 |
| 44011.477465277785 | 56.899 |
| 44011.51913194445 | 58.694 |
| 44011.56079861111 | 60.374 |
| 44011.602465277785 | 61.262 |
| 44011.64413194445 | 60.991 |
| 44011.68579861111 | 59.968 |
| 44011.727465277785 | 59.099 |
| 44011.76913194445 | 58.694 |
| 44011.81079861111 | 58.366 |
| 44011.852465277785 | 57.613 |
| 44011.89413194445 | 56.744 |
| 44011.93579861111 | 56.358 |
| 44011.977465277785 | 55.933 |
| 44012.01913194445 | 55.47 |
| 44012.06079861111 | 55.026 |
| 44012.102465277785 | 54.621 |
| 44012.14413194445 | 54.138 |
| 44012.18579861111 | 53.752 |
| 44012.227465277785 | 53.52 |
| 44012.26913194445 | 53.347 |
| 44012.31079861111 | 53.347 |
| 44012.352465277785 | 53.347 |
| 44012.39413194445 | 53.829 |
| 44012.43579861111 | 55.103 |
| 44012.477465277785 | 56.049 |
| 44012.51913194445 | 57.652 |
| 44012.56079861111 | 59.312 |
| 44012.602465277785 | 60.856 |
| 44012.64413194445 | 61.146 |
| 44012.68579861111 | 61.107 |
| 44012.727465277785 | 60.219 |
| 44012.76913194445 | 58.81 |
| 44012.81079861111 | 57.15 |
| 44012.852465277785 | 55.547 |
| 44012.89413194445 | 54.177 |
| 44012.93579861111 | 53.308 |
| 44012.977465277785 | 52.652 |
| 44013.01913194445 | 52.208 |
| 44013.06079861111 | 51.937 |
| 44013.102465277785 | 51.821 |
| 44013.14413194445 | 51.706 |
| 44013.18579861111 | 51.474 |
| 44013.227465277785 | 51.262 |
| 44013.26913194445 | 51.107 |
| 44013.31079861111 | 50.972 |
| 44013.352465277785 | 51.223 |
| 44013.39413194445 | 52.227 |
| 44013.43579861111 | 53.964 |
| 44013.477465277785 | 56.049 |
| 44013.51913194445 | 58.076 |
| 44013.56079861111 | 59.891 |
| 44013.602465277785 | 61.127 |
| 44013.64413194445 | 61.976 |
| 44013.68579861111 | 61.957 |
| 44013.727465277785 | 61.551 |
| 44013.76913194445 | 60.412 |
| 44013.81079861111 | 58.443 |
| 44013.852465277785 | 57.208 |
| 44013.89413194445 | 56.841 |
| 44013.93579861111 | 56.146 |
| 44013.977465277785 | 55.528 |
| 44014.01913194445 | 55.2 |
| 44014.06079861111 | 54.987 |
| 44014.102465277785 | 54.679 |
| 44014.14413194445 | 54.235 |
| 44014.18579861111 | 53.887 |
| 44014.227465277785 | 53.424 |
| 44014.26913194445 | 53.115 |
| 44014.31079861111 | 52.96 |
| 44014.352465277785 | 53.076 |
| 44014.39413194445 | 54.08 |
| 44014.43579861111 | 55.818 |
| 44014.477465277785 | 57.883 |
| 44014.51913194445 | 59.737 |
| 44014.56079861111 | 61.435 |
| 44014.602465277785 | 61.281 |
| 44014.64413194445 | 61.783 |
| 44014.68579861111 | 61.86 |
| 44014.727465277785 | 61.32 |
| 44014.76913194445 | 60.161 |
| 44014.81079861111 | 58.771 |
| 44014.852465277785 | 57.748 |
| 44014.89413194445 | 56.821 |
| 44014.93579861111 | 56.011 |
| 44014.977465277785 | 55.431 |
| 44015.01913194445 | 55.026 |
| 44015.06079861111 | 54.756 |
| 44015.102465277785 | 54.621 |
| 44015.14413194445 | 54.389 |
| 44015.18579861111 | 54.061 |
| 44015.227465277785 | 53.675 |
| 44015.26913194445 | 53.25 |
| 44015.31079861111 | 53.038 |
| 44015.352465277785 | 53.211 |
| 44015.39413194445 | 54.196 |
| 44015.43579861111 | 56.011 |
| 44015.477465277785 | 58.385 |
| 44015.51913194445 | 59.756 |
| 44015.56079861111 | 61.242 |
| 44015.602465277785 | 60.702 |
| 44015.64413194445 | 59.775 |
| 44015.68579861111 | 59.93 |
| 44015.727465277785 | 60.76 |
| 44015.76913194445 | 60.798 |
| 44015.81079861111 | 60.277 |
| 44015.852465277785 | 59.235 |
| 44015.89413194445 | 58.154 |
| 44015.93579861111 | 57.227 |
| 44015.977465277785 | 56.802 |
| 44016.01913194445 | 56.474 |
| 44016.06079861111 | 56.204 |
| 44016.102465277785 | 55.953 |
| 44016.14413194445 | 55.625 |
| 44016.18579861111 | 55.296 |
| 44016.227465277785 | 54.949 |
| 44016.26913194445 | 54.679 |
| 44016.31079861111 | 54.466 |
| 44016.352465277785 | 54.621 |
| 44016.39413194445 | 55.528 |
| 44016.43579861111 | 57.227 |
| 44016.477465277785 | 59.408 |
| 44016.51913194445 | 61.628 |
| 44016.56079861111 | 62.903 |
| 44016.602465277785 | 61.146 |
| 44016.64413194445 | 59.872 |
| 44016.68579861111 | 58.424 |
| 44016.727465277785 | 57.536 |
| 44016.76913194445 | 57.188 |
| 44016.81079861111 | 56.821 |
| 44016.852465277785 | 56.184 |
| 44016.89413194445 | 55.451 |
| 44016.93579861111 | 54.756 |
| 44016.977465277785 | 54.292 |
| 44017.01913194445 | 54.022 |
| 44017.06079861111 | 53.713 |
| 44017.102465277785 | 53.404 |
| 44017.14413194445 | 53.115 |
| 44017.18579861111 | 52.787 |
| 44017.227465277785 | 52.555 |
| 44017.26913194445 | 52.42 |
| 44017.31079861111 | 52.227 |
| 44017.352465277785 | 52.478 |
| 44017.39413194445 | 53.501 |
| 44017.43579861111 | 55.354 |
| 44017.477465277785 | 57.806 |
| 44017.51913194445 | 59.949 |
| 44017.56079861111 | 61.667 |
| 44017.602465277785 | 62.613 |
| 44017.64413194445 | 62.15 |
| 44017.68579861111 | 63.385 |
| 44017.727465277785 | 62.613 |
| 44017.76913194445 | 61.937 |
| 44017.81079861111 | 60.509 |
| 44017.852465277785 | 58.984 |
| 44017.89413194445 | 57.729 |
| 44017.93579861111 | 56.841 |
| 44017.977465277785 | 56.126 |
| 44018.01913194445 | 55.547 |
| 44018.06079861111 | 55.103 |
| 44018.102465277785 | 54.524 |
| 44018.14413194445 | 54.042 |
| 44018.18579861111 | 53.675 |
| 44018.227465277785 | 53.327 |
| 44018.26913194445 | 53.038 |
| 44018.31079861111 | 52.864 |
| 44018.352465277785 | 53.018 |
| 44018.39413194445 | 54.042 |
| 44018.43579861111 | 56.088 |
| 44018.477465277785 | 58.443 |
| 44018.51913194445 | 61.127 |
| 44018.56079861111 | 62.188 |
| 44018.602465277785 | 63.134 |
| 44018.64413194445 | 61.879 |
| 44018.68579861111 | 62.478 |
| 44018.727465277785 | 62.072 |
| 44018.76913194445 | 61.358 |
| 44018.81079861111 | 58.424 |
| 44018.852465277785 | 55.856 |
| 44018.89413194445 | 54.35 |
| 44018.93579861111 | 53.385 |
| 44018.977465277785 | 52.632 |
| 44019.01913194445 | 52.072 |
| 44019.06079861111 | 51.744 |
| 44019.102465277785 | 51.358 |
| 44019.14413194445 | 50.972 |
| 44019.18579861111 | 50.682 |
| 44019.227465277785 | 50.567 |
| 44019.26913194445 | 50.161 |
| 44019.31079861111 | 49.91 |
| 44019.352465277785 | 50.007 |
| 44019.39413194445 | 50.837 |
| 44019.43579861111 | 52.478 |
| 44019.477465277785 | 53.752 |
| 44019.51913194445 | 55.374 |
| 44019.56079861111 | 56.242 |
| 44019.602465277785 | 56.57 |
| 44019.64413194445 | 56.957 |
| 44019.68579861111 | 56.686 |
| 44019.727465277785 | 56.841 |
| 44019.76913194445 | 56.648 |
| 44019.81079861111 | 55.625 |
| 44019.852465277785 | 54.177 |
| 44019.89413194445 | 52.709 |
| 44019.93579861111 | 51.667 |
| 44019.977465277785 | 50.644 |
| 44020.01913194445 | 49.736 |
| 44020.06079861111 | 49.099 |
| 44020.102465277785 | 48.482 |
| 44020.14413194445 | 48.096 |
| 44020.18579861111 | 47.594 |
| 44020.227465277785 | 47.111 |
| 44020.26913194445 | 46.783 |
| 44020.31079861111 | 46.474 |
| 44020.352465277785 | 46.59 |
| 44020.39413194445 | 47.613 |
| 44020.43579861111 | 49.601 |
| 44020.477465277785 | 51.995 |
| 44020.51913194445 | 54.505 |
| 44020.56079861111 | 56.802 |
| 44020.602465277785 | 58.655 |
| 44020.64413194445 | 59.93 |
| 44020.68579861111 | 60.316 |
| 44020.727465277785 | 59.679 |
| 44020.76913194445 | 58.038 |
| 44020.81079861111 | 55.876 |
| 44020.852465277785 | 53.868 |
| 44020.89413194445 | 52.053 |
| 44020.93579861111 | 50.625 |
| 44020.977465277785 | 49.563 |
| 44021.01913194445 | 48.868 |
| 44021.06079861111 | 48.327 |
| 44021.102465277785 | 47.941 |
| 44021.14413194445 | 47.478 |
| 44021.18579861111 | 46.995 |
| 44021.227465277785 | 46.513 |
| 44021.26913194445 | 45.991 |
| 44021.31079861111 | 45.663 |
| 44021.352465277785 | 45.837 |
| 44021.39413194445 | 46.899 |
| 44021.43579861111 | 48.791 |
| 44021.477465277785 | 50.953 |
| 44021.51913194445 | 53.945 |
| 44021.56079861111 | 56.242 |
| 44021.602465277785 | 57.845 |
| 44021.64413194445 | 59.389 |
| 44021.68579861111 | 60.026 |
| 44021.727465277785 | 59.621 |
| 44021.76913194445 | 58.134 |
| 44021.81079861111 | 55.856 |
| 44021.852465277785 | 53.694 |
| 44021.89413194445 | 51.667 |
| 44021.93579861111 | 50.026 |
| 44021.977465277785 | 48.694 |
| 44022.01913194445 | 47.709 |
| 44022.06079861111 | 46.783 |
| 44022.102465277785 | 46.068 |
| 44022.14413194445 | 45.489 |
| 44022.18579861111 | 44.949 |
| 44022.227465277785 | 44.408 |
| 44022.26913194445 | 43.926 |
| 44022.31079861111 | 43.636 |
| 44022.352465277785 | 43.694 |
| 44022.39413194445 | 44.736 |
| 44022.43579861111 | 46.802 |
| 44022.477465277785 | 49.428 |
| 44022.51913194445 | 52.458 |
| 44022.56079861111 | 55.316 |
| 44022.602465277785 | 57.613 |
| 44022.64413194445 | 59.196 |
| 44022.68579861111 | 59.659 |
| 44022.727465277785 | 58.829 |
| 44022.76913194445 | 57.459 |
| 44022.81079861111 | 55.605 |
| 44022.852465277785 | 53.597 |
| 44022.89413194445 | 51.628 |
| 44022.93579861111 | 49.949 |
| 44022.977465277785 | 48.462 |
| 44023.01913194445 | 47.362 |
| 44023.06079861111 | 46.435 |
| 44023.102465277785 | 45.76 |
| 44023.14413194445 | 45.084 |
| 44023.18579861111 | 44.485 |
| 44023.227465277785 | 44.003 |
| 44023.26913194445 | 43.578 |
| 44023.31079861111 | 43.269 |
| 44023.352465277785 | 43.346 |
| 44023.39413194445 | 44.37 |
| 44023.43579861111 | 46.358 |
| 44023.477465277785 | 49.138 |
| 44023.51913194445 | 51.976 |
| 44023.56079861111 | 54.91 |
| 44023.602465277785 | 57.42 |
| 44023.64413194445 | 59.157 |
| 44023.68579861111 | 59.968 |
| 44023.727465277785 | 59.64 |
| 44023.76913194445 | 58.443 |
| 44023.81079861111 | 56.416 |
| 44023.852465277785 | 54.505 |
| 44023.89413194445 | 52.555 |
| 44023.93579861111 | 50.856 |
| 44023.977465277785 | 49.582 |
| 44024.01913194445 | 48.597 |
| 44024.06079861111 | 47.748 |
| 44024.102465277785 | 47.034 |
| 44024.14413194445 | 46.493 |
| 44024.18579861111 | 45.972 |
| 44024.227465277785 | 45.47 |
| 44024.26913194445 | 45.084 |
| 44024.31079861111 | 44.775 |
| 44024.352465277785 | 44.872 |
| 44024.39413194445 | 45.991 |
| 44024.43579861111 | 47.883 |
| 44024.477465277785 | 50.296 |
| 44024.51913194445 | 51.706 |
| 44024.56079861111 | 51.976 |
| 44024.602465277785 | 53.327 |
| 44024.64413194445 | 53.018 |
| 44024.68579861111 | 53.964 |
| 44024.727465277785 | 53.54 |
| 44024.76913194445 | 53.482 |
| 44024.81079861111 | 52.864 |
| 44024.852465277785 | 52.169 |
| 44024.89413194445 | 51.513 |
| 44024.93579861111 | 50.509 |
| 44024.977465277785 | 49.505 |
| 44025.01913194445 | 48.675 |
| 44025.06079861111 | 47.941 |
| 44025.102465277785 | 47.497 |
| 44025.14413194445 | 47.207 |
| 44025.18579861111 | 46.821 |
| 44025.227465277785 | 46.706 |
| 44025.26913194445 | 46.551 |
| 44025.31079861111 | 46.513 |
| 44025.352465277785 | 46.628 |
| 44025.39413194445 | 47.613 |
| 44025.43579861111 | 48.81 |
| 44025.477465277785 | 49.331 |
| 44025.51913194445 | 49.273 |
| 44025.56079861111 | 51.764 |
| 44025.602465277785 | 53.926 |
| 44025.64413194445 | 56.146 |
| 44025.68579861111 | 57.246 |
| 44025.727465277785 | 56.764 |
| 44025.76913194445 | 55.876 |
| 44025.81079861111 | 54.35 |
| 44025.852465277785 | 52.632 |
| 44025.89413194445 | 51.107 |
| 44025.93579861111 | 49.949 |
| 44025.977465277785 | 49.099 |
| 44026.01913194445 | 48.25 |
| 44026.06079861111 | 47.516 |
| 44026.102465277785 | 47.169 |
| 44026.14413194445 | 46.725 |
| 44026.18579861111 | 46.339 |
| 44026.227465277785 | 45.991 |
| 44026.26913194445 | 45.74 |
| 44026.31079861111 | 45.586 |
| 44026.352465277785 | 45.682 |
| 44026.39413194445 | 46.223 |
| 44026.43579861111 | 48.115 |
| 44026.477465277785 | 50.393 |
| 44026.51913194445 | 53.057 |
| 44026.56079861111 | 55.509 |
| 44026.602465277785 | 57.285 |
| 44026.64413194445 | 56.918 |
| 44026.68579861111 | 55.74 |
| 44026.727465277785 | 54.814 |
| 44026.76913194445 | 53.848 |
| 44026.81079861111 | 52.343 |
| 44026.852465277785 | 51.011 |
| 44026.89413194445 | 49.872 |
| 44026.93579861111 | 48.984 |
| 44026.977465277785 | 48.269 |
| 44027.01913194445 | 47.613 |
| 44027.06079861111 | 46.995 |
| 44027.102465277785 | 46.474 |
| 44027.14413194445 | 46.068 |
| 44027.18579861111 | 45.74 |
| 44027.227465277785 | 45.335 |
| 44027.26913194445 | 45.026 |
| 44027.31079861111 | 44.736 |
| 44027.352465277785 | 44.833 |
| 44027.39413194445 | 45.837 |
| 44027.43579861111 | 47.69 |
| 44027.477465277785 | 50.316 |
| 44027.51913194445 | 52.864 |
| 44027.56079861111 | 55.277 |
| 44027.602465277785 | 56.59 |
| 44027.64413194445 | 57.999 |
| 44027.68579861111 | 57.42 |
| 44027.727465277785 | 56.262 |
| 44027.76913194445 | 54.987 |
| 44027.81079861111 | 53.482 |
| 44027.852465277785 | 52.111 |
| 44027.89413194445 | 50.605 |
| 44027.93579861111 | 49.254 |
| 44027.977465277785 | 48.308 |
| 44028.01913194445 | 47.439 |
| 44028.06079861111 | 46.802 |
| 44028.102465277785 | 46.319 |
| 44028.14413194445 | 45.818 |
| 44028.18579861111 | 45.393 |
| 44028.227465277785 | 45.007 |
| 44028.26913194445 | 44.679 |
| 44028.31079861111 | 44.563 |
| 44028.352465277785 | 44.698 |
| 44028.39413194445 | 45.875 |
| 44028.43579861111 | 47.806 |
| 44028.477465277785 | 50.296 |
| 44028.51913194445 | 52.555 |
| 44028.56079861111 | 54.775 |
| 44028.602465277785 | 56.57 |
| 44028.64413194445 | 55.779 |
| 44028.68579861111 | 54.543 |
| 44028.727465277785 | 53.308 |
| 44028.76913194445 | 51.879 |
| 44028.81079861111 | 50.586 |
| 44028.852465277785 | 49.601 |
| 44028.89413194445 | 48.791 |
| 44028.93579861111 | 47.941 |
| 44028.977465277785 | 47.246 |
| 44029.01913194445 | 46.609 |
| 44029.06079861111 | 46.068 |
| 44029.102465277785 | 45.586 |
| 44029.14413194445 | 45.103 |
| 44029.18579861111 | 44.756 |
| 44029.227465277785 | 44.485 |
| 44029.26913194445 | 44.099 |
| 44029.31079861111 | 44.099 |
| 44029.352465277785 | 44.234 |
| 44029.39413194445 | 45.238 |
| 44029.43579861111 | 47.053 |
| 44029.477465277785 | 49.659 |
| 44029.51913194445 | 51.281 |
| 44029.56079861111 | 53.984 |
| 44029.602465277785 | 55.393 |
| 44029.64413194445 | 56.339 |
| 44029.68579861111 | 56.764 |
| 44029.727465277785 | 56.377 |
| 44029.76913194445 | 55.47 |
| 44029.81079861111 | 53.926 |
| 44029.852465277785 | 52.227 |
| 44029.89413194445 | 50.625 |
| 44029.93579861111 | 49.35 |
| 44029.977465277785 | 48.192 |
| 44030.01913194445 | 47.362 |
| 44030.06079861111 | 46.628 |
| 44030.102465277785 | 46.146 |
| 44030.14413194445 | 45.702 |
| 44030.18579861111 | 45.238 |
| 44030.227465277785 | 44.929 |
| 44030.26913194445 | 44.601 |
| 44030.31079861111 | 44.447 |
| 44030.352465277785 | 44.698 |
| 44030.39413194445 | 45.663 |
| 44030.43579861111 | 47.246 |
| 44030.477465277785 | 49.852 |
| 44030.51913194445 | 51.146 |
| 44030.56079861111 | 52.941 |
| 44030.602465277785 | 55.007 |
| 44030.64413194445 | 55.084 |
| 44030.68579861111 | 54.852 |
| 44030.727465277785 | 54.737 |
| 44030.76913194445 | 53.52 |
| 44030.81079861111 | 52.787 |
| 44030.852465277785 | 51.802 |
| 44030.89413194445 | 50.702 |
| 44030.93579861111 | 49.543 |
| 44030.977465277785 | 48.269 |
| 44031.01913194445 | 47.265 |
| 44031.06079861111 | 46.609 |
| 44031.102465277785 | 46.03 |
| 44031.14413194445 | 45.528 |
| 44031.18579861111 | 45.007 |
| 44031.227465277785 | 44.852 |
| 44031.26913194445 | 44.736 |
| 44031.31079861111 | 44.794 |
| 44031.352465277785 | 45.142 |
| 44031.39413194445 | 45.991 |
| 44031.43579861111 | 47.092 |
| 44031.477465277785 | 49.621 |
| 44031.51913194445 | 51.57 |
| 44031.56079861111 | 51.957 |
| 44031.602465277785 | 52.381 |
| 44031.64413194445 | 52.96 |
| 44031.68579861111 | 52.748 |
| 44031.727465277785 | 52.111 |
| 44031.76913194445 | 51.088 |
| 44031.81079861111 | 50.316 |
| 44031.852465277785 | 49.177 |
| 44031.89413194445 | 48.289 |
| 44031.93579861111 | 47.381 |
| 44031.977465277785 | 46.493 |
| 44032.01913194445 | 45.818 |
| 44032.06079861111 | 45.335 |
| 44032.102465277785 | 44.929 |
| 44032.14413194445 | 44.563 |
| 44032.18579861111 | 44.177 |
| 44032.227465277785 | 43.868 |
| 44032.26913194445 | 43.559 |
| 44032.31079861111 | 43.385 |
| 44032.352465277785 | 43.578 |
| 44032.39413194445 | 44.679 |
| 44032.43579861111 | 46.725 |
| 44032.477465277785 | 49.524 |
| 44032.51913194445 | 52.381 |
| 44032.56079861111 | 55.238 |
| 44032.602465277785 | 57.594 |
| 44032.64413194445 | 58.404 |
| 44032.68579861111 | 59.042 |
| 44032.727465277785 | 58.559 |
| 44032.76913194445 | 57.285 |
| 44032.81079861111 | 55.258 |
| 44032.852465277785 | 53.134 |
| 44032.89413194445 | 51.262 |
| 44032.93579861111 | 49.466 |
| 44032.977465277785 | 47.941 |
| 44033.01913194445 | 46.783 |
| 44033.06079861111 | 45.933 |
| 44033.102465277785 | 45.354 |
| 44033.14413194445 | 44.968 |
| 44033.18579861111 | 44.621 |
| 44033.227465277785 | 44.428 |
| 44033.26913194445 | 44.234 |
| 44033.31079861111 | 44.099 |
| 44033.352465277785 | 44.408 |
| 44033.39413194445 | 45.509 |
| 44033.43579861111 | 47.516 |
| 44033.477465277785 | 50.238 |
| 44033.51913194445 | 52.304 |
| 44033.56079861111 | 53.173 |
| 44033.602465277785 | 54.968 |
| 44033.64413194445 | 56.03 |
| 44033.68579861111 | 57.227 |
| 44033.727465277785 | 57.13 |
| 44033.76913194445 | 55.682 |
| 44033.81079861111 | 54.235 |
| 44033.852465277785 | 52.072 |
| 44033.89413194445 | 50.335 |
| 44033.93579861111 | 49.022 |
| 44033.977465277785 | 48.038 |
| 44034.01913194445 | 47.207 |
| 44034.06079861111 | 46.493 |
| 44034.102465277785 | 45.856 |
| 44034.14413194445 | 45.451 |
| 44034.18579861111 | 45.18 |
| 44034.227465277785 | 44.814 |
| 44034.26913194445 | 44.621 |
| 44034.31079861111 | 44.601 |
| 44034.352465277785 | 44.891 |
| 44034.39413194445 | 45.914 |
| 44034.43579861111 | 47.401 |
| 44034.477465277785 | 49.601 |
| 44034.51913194445 | 51.011 |
| 44034.56079861111 | 54.061 |
| 44034.602465277785 | 54.022 |
| 44034.64413194445 | 54.08 |
| 44034.68579861111 | 53.694 |
| 44034.727465277785 | 53.018 |
| 44034.76913194445 | 52.053 |
| 44034.81079861111 | 50.953 |
| 44034.852465277785 | 50.084 |
| 44034.89413194445 | 49.099 |
| 44034.93579861111 | 48.289 |
| 44034.977465277785 | 47.709 |
| 44035.01913194445 | 47.227 |
| 44035.06079861111 | 46.879 |
| 44035.102465277785 | 46.435 |
| 44035.14413194445 | 46.03 |
| 44035.18579861111 | 45.605 |
| 44035.227465277785 | 45.103 |
| 44035.26913194445 | 44.756 |
| 44035.31079861111 | 44.505 |
| 44035.352465277785 | 44.621 |
| 44035.39413194445 | 45.644 |
| 44035.43579861111 | 47.632 |
| 44035.477465277785 | 50.509 |
| 44035.51913194445 | 51.242 |
| 44035.56079861111 | 53.675 |
| 44035.602465277785 | 56.3 |
| 44035.64413194445 | 58.598 |
| 44035.68579861111 | 57.015 |
| 44035.727465277785 | 55.644 |
| 44035.76913194445 | 55.238 |
| 44035.81079861111 | 53.868 |
| 44035.852465277785 | 52.42 |
| 44035.89413194445 | 51.069 |
| 44035.93579861111 | 49.968 |
| 44035.977465277785 | 49.157 |
| 44036.01913194445 | 48.173 |
| 44036.06079861111 | 47.458 |
| 44036.102465277785 | 47.034 |
| 44036.14413194445 | 46.648 |
| 44036.18579861111 | 46.397 |
| 44036.227465277785 | 46.204 |
| 44036.26913194445 | 46.049 |
| 44036.31079861111 | 46.107 |
| 44036.352465277785 | 46.165 |
| 44036.39413194445 | 46.86 |
| 44036.43579861111 | 48.018 |
| 44036.477465277785 | 49.659 |
| 44036.51913194445 | 50.933 |
| 44036.56079861111 | 52.458 |
| 44036.602465277785 | 54.119 |
| 44036.64413194445 | 54.833 |
| 44036.68579861111 | 55.933 |
| 44036.727465277785 | 56.725 |
| 44036.76913194445 | 55.895 |
| 44036.81079861111 | 54.717 |
| 44036.852465277785 | 53.038 |
| 44036.89413194445 | 51.339 |
| 44036.93579861111 | 50.103 |
| 44036.977465277785 | 49.254 |
| 44037.01913194445 | 48.559 |
| 44037.06079861111 | 47.999 |
| 44037.102465277785 | 47.574 |
| 44037.14413194445 | 47.439 |
| 44037.18579861111 | 47.343 |
| 44037.227465277785 | 47.188 |
| 44037.26913194445 | 46.918 |
| 44037.31079861111 | 46.899 |
| 44037.352465277785 | 47.014 |
| 44037.39413194445 | 47.555 |
| 44037.43579861111 | 48.694 |
| 44037.477465277785 | 49.891 |
| 44037.51913194445 | 50.238 |
| 44037.56079861111 | 50.76 |
| 44037.602465277785 | 51.474 |
| 44037.64413194445 | 52.903 |
| 44037.68579861111 | 52.806 |
| 44037.727465277785 | 52.072 |
| 44037.76913194445 | 51.493 |
| 44037.81079861111 | 50.914 |
| 44037.852465277785 | 50.2 |
| 44037.89413194445 | 49.408 |
| 44037.93579861111 | 48.791 |
| 44037.977465277785 | 48.289 |
| 44038.01913194445 | 47.729 |
| 44038.06079861111 | 47.439 |
| 44038.102465277785 | 47.343 |
| 44038.14413194445 | 47.188 |
| 44038.18579861111 | 46.976 |
| 44038.227465277785 | 46.648 |
| 44038.26913194445 | 46.319 |
| 44038.31079861111 | 46.146 |
| 44038.352465277785 | 46.319 |
| 44038.39413194445 | 47.092 |
| 44038.43579861111 | 48.868 |
| 44038.477465277785 | 51.397 |
| 44038.51913194445 | 53.733 |
| 44038.56079861111 | 55.625 |
| 44038.602465277785 | 57.459 |
| 44038.64413194445 | 57.362 |
| 44038.68579861111 | 56.416 |
| 44038.727465277785 | 55.953 |
| 44038.76913194445 | 55.161 |
| 44038.81079861111 | 53.385 |
| 44038.852465277785 | 52.014 |
| 44038.89413194445 | 50.875 |
| 44038.93579861111 | 49.872 |
| 44038.977465277785 | 49.041 |
| 44039.01913194445 | 48.25 |
| 44039.06079861111 | 47.652 |
| 44039.102465277785 | 47.265 |
| 44039.14413194445 | 46.821 |
| 44039.18579861111 | 46.474 |
| 44039.227465277785 | 46.204 |
| 44039.26913194445 | 45.818 |
| 44039.31079861111 | 45.567 |
| 44039.352465277785 | 45.605 |
| 44039.39413194445 | 46.435 |
| 44039.43579861111 | 48.269 |
| 44039.477465277785 | 50.856 |
| 44039.51913194445 | 53.733 |
| 44039.56079861111 | 55.798 |
| 44039.602465277785 | 57.362 |
| 44039.64413194445 | 58.404 |
| 44039.68579861111 | 58.752 |
| 44039.727465277785 | 58.617 |
| 44039.76913194445 | 57.015 |
| 44039.81079861111 | 54.93 |
| 44039.852465277785 | 53.404 |
| 44039.89413194445 | 51.879 |
| 44039.93579861111 | 50.431 |
| 44039.977465277785 | 49.235 |
| 44040.01913194445 | 48.346 |
| 44040.06079861111 | 47.536 |
| 44040.102465277785 | 47.014 |
| 44040.14413194445 | 46.667 |
| 44040.18579861111 | 46.339 |
| 44040.227465277785 | 46.011 |
| 44040.26913194445 | 45.798 |
| 44040.31079861111 | 45.76 |
| 44040.352465277785 | 45.953 |
| 44040.39413194445 | 46.281 |
| 44040.43579861111 | 47.111 |
| 44040.477465277785 | 48.346 |
| 44040.51913194445 | 49.524 |
| 44040.56079861111 | 50.238 |
| 44040.602465277785 | 50.779 |
| 44040.64413194445 | 53.347 |
| 44040.68579861111 | 54.408 |
| 44040.727465277785 | 53.54 |
| 44040.76913194445 | 53.385 |
| 44040.81079861111 | 52.458 |
| 44040.852465277785 | 51.242 |
| 44040.89413194445 | 49.775 |
| 44040.93579861111 | 48.443 |
| 44040.977465277785 | 47.401 |
| 44041.01913194445 | 46.686 |
| 44041.06079861111 | 46.088 |
| 44041.102465277785 | 45.663 |
| 44041.14413194445 | 45.393 |
| 44041.18579861111 | 45.007 |
| 44041.227465277785 | 44.794 |
| 44041.26913194445 | 44.505 |
| 44041.31079861111 | 44.215 |
| 44041.352465277785 | 44.292 |
| 44041.39413194445 | 45.103 |
| 44041.43579861111 | 47.014 |
| 44041.477465277785 | 49.659 |
| 44041.51913194445 | 51.686 |
| 44041.56079861111 | 53.269 |
| 44041.602465277785 | 55.682 |
| 44041.64413194445 | 57.459 |
| 44041.68579861111 | 57.15 |
| 44041.727465277785 | 56.86 |
| 44041.76913194445 | 55.702 |
| 44041.81079861111 | 54.099 |
| 44041.852465277785 | 52.439 |
| 44041.89413194445 | 50.779 |
| 44041.93579861111 | 49.273 |
| 44041.977465277785 | 47.98 |
| 44042.01913194445 | 46.957 |
| 44042.06079861111 | 46.088 |
| 44042.102465277785 | 45.586 |
| 44042.14413194445 | 45.045 |
| 44042.18579861111 | 44.621 |
| 44042.227465277785 | 44.215 |
| 44042.26913194445 | 43.829 |
| 44042.31079861111 | 43.617 |
| 44042.352465277785 | 43.733 |
| 44042.39413194445 | 44.659 |
| 44042.43579861111 | 46.725 |
| 44042.477465277785 | 49.37 |
| 44042.51913194445 | 52.497 |
| 44042.56079861111 | 55.296 |
| 44042.602465277785 | 57.594 |
| 44042.64413194445 | 58.771 |
| 44042.68579861111 | 59.138 |
| 44042.727465277785 | 58.868 |
| 44042.76913194445 | 57.632 |
| 44042.81079861111 | 55.991 |
| 44042.852465277785 | 54.196 |
| 44042.89413194445 | 52.478 |
| 44042.93579861111 | 50.837 |
| 44042.977465277785 | 49.177 |
| 44043.01913194445 | 47.98 |
| 44043.06079861111 | 47.014 |
| 44043.102465277785 | 46.146 |
| 44043.14413194445 | 45.624 |
| 44043.18579861111 | 45.103 |
| 44043.227465277785 | 44.698 |
| 44043.26913194445 | 44.331 |
| 44043.31079861111 | 44.022 |
| 44043.352465277785 | 44.138 |
| 44043.39413194445 | 45.103 |
| 44043.43579861111 | 47.034 |
| 44043.477465277785 | 49.91 |
| 44043.51913194445 | 52.883 |
| 44043.56079861111 | 55.605 |
| 44043.602465277785 | 58.192 |
| 44043.64413194445 | 59.949 |
| 44043.68579861111 | 59.621 |
| 44043.727465277785 | 58.906 |
| 44043.76913194445 | 57.864 |
| 44043.81079861111 | 55.431 |
| 44043.852465277785 | 53.385 |
| 44043.89413194445 | 51.397 |
| 44043.93579861111 | 49.872 |
| 44043.977465277785 | 48.655 |
| 44044.01913194445 | 47.671 |
| 44044.06079861111 | 46.841 |
| 44044.102465277785 | 46.319 |
| 44044.14413194445 | 45.895 |
| 44044.18579861111 | 45.412 |
| 44044.227465277785 | 45.007 |
| 44044.26913194445 | 44.717 |
| 44044.31079861111 | 44.35 |
| 44044.352465277785 | 44.312 |
| 44044.39413194445 | 45.258 |
| 44044.43579861111 | 47.13 |
| 44044.477465277785 | 49.949 |
| 44044.51913194445 | 52.922 |
| 44044.56079861111 | 55.837 |
| 44044.602465277785 | 58.308 |
| 44044.64413194445 | 60.065 |
| 44044.68579861111 | 59.794 |
| 44044.727465277785 | 58.906 |
| 44044.76913194445 | 57.825 |
| 44044.81079861111 | 55.644 |
| 44044.852465277785 | 53.617 |
| 44044.89413194445 | 51.667 |
| 44044.93579861111 | 50.103 |
| 44044.977465277785 | 49.041 |
| 44045.01913194445 | 48.192 |
| 44045.06079861111 | 47.458 |
| 44045.102465277785 | 46.821 |
| 44045.14413194445 | 46.397 |
| 44045.18579861111 | 46.068 |
| 44045.227465277785 | 45.682 |
| 44045.26913194445 | 45.238 |
| 44045.31079861111 | 45.007 |
| 44045.352465277785 | 45.123 |
| 44045.39413194445 | 45.972 |
| 44045.43579861111 | 47.767 |
| 44045.477465277785 | 50.509 |
| 44045.51913194445 | 52.864 |
| 44045.56079861111 | 55.393 |
| 44045.602465277785 | 57.845 |
| 44045.64413194445 | 58.791 |
| 44045.68579861111 | 57.767 |
| 44045.727465277785 | 57.497 |
| 44045.76913194445 | 56.609 |
| 44045.81079861111 | 54.621 |
| 44045.852465277785 | 52.613 |
| 44045.89413194445 | 50.972 |
| 44045.93579861111 | 49.582 |
| 44045.977465277785 | 48.52 |
| 44046.01913194445 | 47.69 |
| 44046.06079861111 | 46.937 |
| 44046.102465277785 | 46.358 |
| 44046.14413194445 | 45.914 |
| 44046.18579861111 | 45.567 |
| 44046.227465277785 | 45.219 |
| 44046.26913194445 | 44.987 |
| 44046.31079861111 | 44.833 |
| 44046.352465277785 | 44.949 |
| 44046.39413194445 | 45.818 |
| 44046.43579861111 | 47.767 |
| 44046.477465277785 | 50.547 |
| 44046.51913194445 | 53.269 |
| 44046.56079861111 | 54.447 |
| 44046.602465277785 | 54.621 |
| 44046.64413194445 | 55.895 |
| 44046.68579861111 | 55.509 |
| 44046.727465277785 | 54.737 |
| 44046.76913194445 | 54.042 |
| 44046.81079861111 | 52.787 |
| 44046.852465277785 | 51.648 |
| 44046.89413194445 | 50.528 |
| 44046.93579861111 | 49.389 |
| 44046.977465277785 | 48.385 |
| 44047.01913194445 | 47.439 |
| 44047.06079861111 | 46.802 |
| 44047.102465277785 | 46.416 |
| 44047.14413194445 | 46.223 |
| 44047.18579861111 | 45.972 |
| 44047.227465277785 | 45.74 |
| 44047.26913194445 | 45.489 |
| 44047.31079861111 | 45.47 |
| 44047.352465277785 | 45.644 |
| 44047.39413194445 | 46.358 |
| 44047.43579861111 | 47.941 |
| 44047.477465277785 | 49.91 |
| 44047.51913194445 | 51.667 |
| 44047.56079861111 | 52.594 |
| 44047.602465277785 | 54.582 |
| 44047.64413194445 | 54.64 |
| 44047.68579861111 | 55.026 |
| 44047.727465277785 | 56.126 |
| 44047.76913194445 | 55.489 |
| 44047.81079861111 | 54.119 |
| 44047.852465277785 | 52.787 |
| 44047.89413194445 | 51.088 |
| 44047.93579861111 | 49.601 |
| 44047.977465277785 | 48.346 |
| 44048.01913194445 | 47.401 |
| 44048.06079861111 | 46.918 |
| 44048.102465277785 | 46.609 |
| 44048.14413194445 | 46.339 |
| 44048.18579861111 | 46.126 |
| 44048.227465277785 | 45.895 |
| 44048.26913194445 | 45.547 |
| 44048.31079861111 | 45.393 |
| 44048.352465277785 | 45.547 |
| 44048.39413194445 | 46.358 |
| 44048.43579861111 | 48.134 |
| 44048.477465277785 | 50.663 |
| 44048.51913194445 | 52.014 |
| 44048.56079861111 | 54.196 |
| 44048.602465277785 | 56.995 |
| 44048.64413194445 | 58.269 |
| 44048.68579861111 | 58.771 |
| 44048.727465277785 | 57.787 |
| 44048.76913194445 | 56.628 |
| 44048.81079861111 | 55.393 |
| 44048.852465277785 | 53.617 |
| 44048.89413194445 | 51.783 |
| 44048.93579861111 | 50.277 |
| 44048.977465277785 | 49.138 |
| 44049.01913194445 | 48.211 |
| 44049.06079861111 | 47.613 |
| 44049.102465277785 | 47.207 |
| 44049.14413194445 | 46.918 |
| 44049.18579861111 | 46.744 |
| 44049.227465277785 | 46.609 |
| 44049.26913194445 | 46.455 |
| 44049.31079861111 | 46.493 |
| 44049.352465277785 | 46.609 |
| 44049.39413194445 | 47.15 |
| 44049.43579861111 | 47.96 |
| 44049.477465277785 | 49.717 |
| 44049.51913194445 | 51.319 |
| 44049.56079861111 | 53.462 |
| 44049.602465277785 | 54.061 |
| 44049.64413194445 | 54.679 |
| 44049.68579861111 | 54.833 |
| 44049.727465277785 | 55.296 |
| 44049.76913194445 | 54.717 |
| 44049.81079861111 | 53.52 |
| 44049.852465277785 | 52.13 |
| 44049.89413194445 | 50.605 |
| 44049.93579861111 | 49.177 |
| 44049.977465277785 | 47.941 |
| 44050.01913194445 | 46.802 |
| 44050.06079861111 | 45.837 |
| 44050.102465277785 | 45.123 |
| 44050.14413194445 | 44.543 |
| 44050.18579861111 | 44.003 |
| 44050.227465277785 | 43.617 |
| 44050.26913194445 | 43.211 |
| 44050.31079861111 | 42.999 |
| 44050.352465277785 | 43.153 |
| 44050.39413194445 | 44.196 |
| 44050.43579861111 | 46.242 |
| 44050.477465277785 | 49.157 |
| 44050.51913194445 | 52.208 |
| 44050.56079861111 | 55.2 |
| 44050.602465277785 | 57.806 |
| 44050.64413194445 | 59.563 |
| 44050.68579861111 | 60.296 |
| 44050.727465277785 | 60.007 |
| 44050.76913194445 | 58.54 |
| 44050.81079861111 | 56.146 |
| 44050.852465277785 | 54.003 |
| 44050.89413194445 | 51.802 |
| 44050.93579861111 | 49.717 |
| 44050.977465277785 | 47.999 |
| 44051.01913194445 | 46.763 |
| 44051.06079861111 | 45.76 |
| 44051.102465277785 | 44.987 |
| 44051.14413194445 | 44.524 |
| 44051.18579861111 | 43.964 |
| 44051.227465277785 | 43.617 |
| 44051.26913194445 | 43.289 |
| 44051.31079861111 | 43.076 |
| 44051.352465277785 | 43.192 |
| 44051.39413194445 | 44.099 |
| 44051.43579861111 | 46.165 |
| 44051.477465277785 | 49.003 |
| 44051.51913194445 | 51.957 |
| 44051.56079861111 | 55.007 |
| 44051.602465277785 | 57.516 |
| 44051.64413194445 | 59.601 |
| 44051.68579861111 | 60.605 |
| 44051.727465277785 | 59.273 |
| 44051.76913194445 | 58.018 |
| 44051.81079861111 | 55.876 |
| 44051.852465277785 | 53.636 |
| 44051.89413194445 | 51.455 |
| 44051.93579861111 | 49.582 |
| 44051.977465277785 | 47.922 |
| 44052.01913194445 | 46.744 |
| 44052.06079861111 | 45.798 |
| 44052.102465277785 | 45.045 |
| 44052.14413194445 | 44.601 |
| 44052.18579861111 | 44.177 |
| 44052.227465277785 | 43.81 |
| 44052.26913194445 | 43.501 |
| 44052.31079861111 | 43.269 |
| 44052.352465277785 | 43.404 |
| 44052.39413194445 | 44.292 |
| 44052.43579861111 | 46.088 |
| 44052.477465277785 | 48.868 |
| 44052.51913194445 | 51.957 |
| 44052.56079861111 | 54.949 |
| 44052.602465277785 | 57.555 |
| 44052.64413194445 | 59.389 |
| 44052.68579861111 | 60.181 |
| 44052.727465277785 | 60.065 |
| 44052.76913194445 | 58.211 |
| 44052.81079861111 | 56.107 |
| 44052.852465277785 | 54.042 |
| 44052.89413194445 | 52.072 |
| 44052.93579861111 | 50.103 |
| 44052.977465277785 | 48.713 |
| 44053.01913194445 | 47.439 |
| 44053.06079861111 | 46.609 |
| 44053.102465277785 | 45.953 |
| 44053.14413194445 | 45.393 |
| 44053.18579861111 | 44.949 |
| 44053.227465277785 | 44.659 |
| 44053.26913194445 | 44.312 |
| 44053.31079861111 | 44.119 |
| 44053.352465277785 | 44.196 |
| 44053.39413194445 | 45.065 |
| 44053.43579861111 | 46.841 |
| 44053.477465277785 | 49.254 |
| 44053.51913194445 | 51.783 |
| 44053.56079861111 | 53.134 |
| 44053.602465277785 | 55.605 |
| 44053.64413194445 | 57.15 |
| 44053.68579861111 | 58.173 |
| 44053.727465277785 | 58.308 |
| 44053.76913194445 | 57.497 |
| 44053.81079861111 | 56.049 |
| 44053.852465277785 | 54.003 |
| 44053.89413194445 | 51.821 |
| 44053.93579861111 | 50.103 |
| 44053.977465277785 | 48.636 |
| 44054.01913194445 | 47.478 |
| 44054.06079861111 | 46.57 |
| 44054.102465277785 | 45.856 |
| 44054.14413194445 | 45.431 |
| 44054.18579861111 | 45.045 |
| 44054.227465277785 | 44.775 |
| 44054.26913194445 | 44.485 |
| 44054.31079861111 | 44.292 |
| 44054.352465277785 | 44.466 |
| 44054.39413194445 | 45.161 |
| 44054.43579861111 | 47.092 |
| 44054.477465277785 | 49.157 |
| 44054.51913194445 | 50.605 |
| 44054.56079861111 | 52.111 |
| 44054.602465277785 | 55.277 |
| 44054.64413194445 | 57.343 |
| 44054.68579861111 | 58.617 |
| 44054.727465277785 | 58.231 |
| 44054.76913194445 | 57.13 |
| 44054.81079861111 | 55.354 |
| 44054.852465277785 | 53.385 |
| 44054.89413194445 | 51.358 |
| 44054.93579861111 | 49.37 |
| 44054.977465277785 | 47.767 |
| 44055.01913194445 | 46.474 |
| 44055.06079861111 | 45.586 |
| 44055.102465277785 | 44.929 |
| 44055.14413194445 | 44.37 |
| 44055.18579861111 | 44.022 |
| 44055.227465277785 | 43.655 |
| 44055.26913194445 | 43.366 |
| 44055.31079861111 | 43.134 |
| 44055.352465277785 | 43.25 |
| 44055.39413194445 | 44.138 |
| 44055.43579861111 | 45.296 |
| 44055.477465277785 | 47.362 |
| 44055.51913194445 | 49.64 |
| 44055.56079861111 | 52.613 |
| 44055.602465277785 | 54.93 |
| 44055.64413194445 | 56.049 |
| 44055.68579861111 | 56.513 |
| 44055.727465277785 | 55.586 |
| 44055.76913194445 | 54.37 |
| 44055.81079861111 | 53.057 |
| 44055.852465277785 | 51.435 |
| 44055.89413194445 | 49.814 |
| 44055.93579861111 | 48.327 |
| 44055.977465277785 | 46.976 |
| 44056.01913194445 | 45.914 |
| 44056.06079861111 | 45.103 |
| 44056.102465277785 | 44.466 |
| 44056.14413194445 | 43.964 |
| 44056.18579861111 | 43.578 |
| 44056.227465277785 | 43.095 |
| 44056.26913194445 | 42.806 |
| 44056.31079861111 | 42.516 |
| 44056.352465277785 | 42.671 |
| 44056.39413194445 | 43.655 |
| 44056.43579861111 | 45.605 |
| 44056.477465277785 | 48.482 |
| 44056.51913194445 | 51.551 |
| 44056.56079861111 | 54.621 |
| 44056.602465277785 | 56.957 |
| 44056.64413194445 | 58.636 |
| 44056.68579861111 | 59.119 |
| 44056.727465277785 | 58.733 |
| 44056.76913194445 | 57.285 |
| 44056.81079861111 | 55.489 |
| 44056.852465277785 | 53.501 |
| 44056.89413194445 | 51.397 |
| 44056.93579861111 | 49.466 |
| 44056.977465277785 | 47.845 |
| 44057.01913194445 | 46.648 |
| 44057.06079861111 | 45.779 |
| 44057.102465277785 | 45.123 |
| 44057.14413194445 | 44.543 |
| 44057.18579861111 | 44.022 |
| 44057.227465277785 | 43.636 |
| 44057.26913194445 | 43.192 |
| 44057.31079861111 | 42.922 |
| 44057.352465277785 | 42.922 |
| 44057.39413194445 | 43.81 |
| 44057.43579861111 | 45.586 |
| 44057.477465277785 | 48.231 |
| 44057.51913194445 | 51.088 |
| 44057.56079861111 | 53.906 |
| 44057.602465277785 | 56.474 |
| 44057.64413194445 | 58.173 |
| 44057.68579861111 | 58.771 |
| 44057.727465277785 | 58.038 |
| 44057.76913194445 | 56.339 |
| 44057.81079861111 | 54.621 |
| 44057.852465277785 | 52.709 |
| 44057.89413194445 | 50.875 |
| 44057.93579861111 | 49.196 |
| 44057.977465277785 | 47.709 |
| 44058.01913194445 | 46.648 |
| 44058.06079861111 | 45.798 |
| 44058.102465277785 | 45.123 |
| 44058.14413194445 | 44.621 |
| 44058.18579861111 | 44.177 |
| 44058.227465277785 | 43.829 |
| 44058.26913194445 | 43.54 |
| 44058.31079861111 | 43.346 |
| 44058.352465277785 | 43.404 |
| 44058.39413194445 | 44.273 |
| 44058.43579861111 | 46.184 |
| 44058.477465277785 | 48.868 |
| 44058.51913194445 | 51.957 |
| 44058.56079861111 | 54.852 |
| 44058.602465277785 | 57.285 |
| 44058.64413194445 | 59.022 |
| 44058.68579861111 | 59.756 |
| 44058.727465277785 | 59.157 |
| 44058.76913194445 | 57.285 |
| 44058.81079861111 | 54.91 |
| 44058.852465277785 | 52.883 |
| 44058.89413194445 | 51.262 |
| 44058.93579861111 | 49.331 |
| 44058.977465277785 | 47.767 |
| 44059.01913194445 | 46.532 |
| 44059.06079861111 | 45.586 |
| 44059.102465277785 | 44.833 |
| 44059.14413194445 | 44.254 |
| 44059.18579861111 | 43.771 |
| 44059.227465277785 | 43.443 |
| 44059.26913194445 | 43.038 |
| 44059.31079861111 | 42.902 |
| 44059.352465277785 | 43.095 |
| 44059.39413194445 | 43.984 |
| 44059.43579861111 | 45.721 |
| 44059.477465277785 | 47.96 |
| 44059.51913194445 | 50.547 |
| 44059.56079861111 | 53.134 |
| 44059.602465277785 | 55.567 |
| 44059.64413194445 | 57.343 |
| 44059.68579861111 | 58.347 |
| 44059.727465277785 | 58.462 |
| 44059.76913194445 | 57.208 |
| 44059.81079861111 | 55.238 |
| 44059.852465277785 | 53.347 |
| 44059.89413194445 | 51.339 |
| 44059.93579861111 | 49.621 |
| 44059.977465277785 | 48.289 |
| 44060.01913194445 | 47.207 |
| 44060.06079861111 | 46.532 |
| 44060.102465277785 | 45.991 |
| 44060.14413194445 | 45.509 |
| 44060.18579861111 | 45.161 |
| 44060.227465277785 | 44.891 |
| 44060.26913194445 | 44.582 |
| 44060.31079861111 | 44.466 |
| 44060.352465277785 | 44.524 |
| 44060.39413194445 | 45.412 |
| 44060.43579861111 | 47.207 |
| 44060.477465277785 | 49.601 |
| 44060.51913194445 | 52.381 |
| 44060.56079861111 | 55.219 |
| 44060.602465277785 | 57.188 |
| 44060.64413194445 | 58.752 |
| 44060.68579861111 | 59.447 |
| 44060.727465277785 | 59.35 |
| 44060.76913194445 | 57.999 |
| 44060.81079861111 | 55.914 |
| 44060.852465277785 | 53.964 |
| 44060.89413194445 | 52.034 |
| 44060.93579861111 | 50.316 |
| 44060.977465277785 | 48.945 |
| 44061.01913194445 | 47.96 |
| 44061.06079861111 | 47.13 |
| 44061.102465277785 | 46.532 |
| 44061.14413194445 | 46.068 |
| 44061.18579861111 | 45.624 |
| 44061.227465277785 | 45.219 |
| 44061.26913194445 | 44.872 |
| 44061.31079861111 | 44.698 |
| 44061.352465277785 | 44.775 |
| 44061.39413194445 | 45.528 |
| 44061.43579861111 | 47.304 |
| 44061.477465277785 | 49.833 |
| 44061.51913194445 | 52.458 |
| 44061.56079861111 | 55.393 |
| 44061.602465277785 | 57.594 |
| 44061.64413194445 | 57.787 |
| 44061.68579861111 | 57.96 |
| 44061.727465277785 | 57.053 |
| 44061.76913194445 | 56.204 |
| 44061.81079861111 | 54.486 |
| 44061.852465277785 | 52.825 |
| 44061.89413194445 | 51.204 |
| 44061.93579861111 | 49.891 |
| 44061.977465277785 | 48.752 |
| 44062.01913194445 | 47.787 |
| 44062.06079861111 | 46.821 |
| 44062.102465277785 | 46.107 |
| 44062.14413194445 | 45.567 |
| 44062.18579861111 | 45.316 |
| 44062.227465277785 | 45.007 |
| 44062.26913194445 | 44.659 |
| 44062.31079861111 | 44.447 |
| 44062.352465277785 | 44.601 |
| 44062.39413194445 | 45.393 |
| 44062.43579861111 | 47.188 |
| 44062.477465277785 | 49.891 |
| 44062.51913194445 | 52.845 |
| 44062.56079861111 | 55.818 |
| 44062.602465277785 | 57.825 |
| 44062.64413194445 | 59.235 |
| 44062.68579861111 | 58.829 |
| 44062.727465277785 | 57.98 |
| 44062.76913194445 | 56.551 |
| 44062.81079861111 | 54.91 |
| 44062.852465277785 | 53.134 |
| 44062.89413194445 | 51.339 |
| 44062.93579861111 | 49.679 |
| 44062.977465277785 | 48.501 |
| 44063.01913194445 | 47.652 |
| 44063.06079861111 | 46.899 |
| 44063.102465277785 | 46.416 |
| 44063.14413194445 | 46.011 |
| 44063.18579861111 | 45.567 |
| 44063.227465277785 | 45.258 |
| 44063.26913194445 | 44.872 |
| 44063.31079861111 | 44.582 |
| 44063.352465277785 | 44.679 |
| 44063.39413194445 | 45.528 |
| 44063.43579861111 | 47.343 |
| 44063.477465277785 | 50.084 |
| 44063.51913194445 | 53.018 |
| 44063.56079861111 | 55.837 |
| 44063.602465277785 | 57.111 |
| 44063.64413194445 | 56.995 |
| 44063.68579861111 | 56.474 |
| 44063.727465277785 | 55.625 |
| 44063.76913194445 | 54.37 |
| 44063.81079861111 | 52.922 |
| 44063.852465277785 | 51.551 |
| 44063.89413194445 | 50.605 |
| 44063.93579861111 | 49.698 |
| 44063.977465277785 | 48.848 |
| 44064.01913194445 | 48.115 |
| 44064.06079861111 | 47.362 |
| 44064.102465277785 | 46.686 |
| 44064.14413194445 | 46.088 |
| 44064.18579861111 | 45.547 |
| 44064.227465277785 | 45.026 |
| 44064.26913194445 | 44.698 |
| 44064.31079861111 | 44.37 |
| 44064.352465277785 | 44.543 |
| 44064.39413194445 | 45.373 |
| 44064.43579861111 | 47.092 |
| 44064.477465277785 | 49.64 |
| 44064.51913194445 | 52.516 |
| 44064.56079861111 | 55.123 |
| 44064.602465277785 | 57.555 |
| 44064.64413194445 | 58.868 |
| 44064.68579861111 | 59.621 |
| 44064.727465277785 | 58.945 |
| 44064.76913194445 | 57.343 |
| 44064.81079861111 | 55.316 |
| 44064.852465277785 | 53.366 |
| 44064.89413194445 | 51.339 |
| 44064.93579861111 | 49.543 |
| 44064.977465277785 | 48.076 |
| 44065.01913194445 | 46.899 |
| 44065.06079861111 | 46.03 |
| 44065.102465277785 | 45.316 |
| 44065.14413194445 | 44.833 |
| 44065.18579861111 | 44.466 |
| 44065.227465277785 | 44.022 |
| 44065.26913194445 | 43.752 |
| 44065.31079861111 | 43.655 |
| 44065.352465277785 | 43.81 |
| 44065.39413194445 | 44.679 |
| 44065.43579861111 | 46.204 |
| 44065.477465277785 | 48.752 |
| 44065.51913194445 | 51.648 |
| 44065.56079861111 | 54.254 |
| 44065.602465277785 | 56.532 |
| 44065.64413194445 | 58.173 |
| 44065.68579861111 | 58.849 |
| 44065.727465277785 | 58.308 |
| 44065.76913194445 | 57.053 |
| 44065.81079861111 | 55.412 |
| 44065.852465277785 | 53.366 |
| 44065.89413194445 | 51.397 |
| 44065.93579861111 | 49.563 |
| 44065.977465277785 | 48.211 |
| 44066.01913194445 | 47.15 |
| 44066.06079861111 | 46.262 |
| 44066.102465277785 | 45.682 |
| 44066.14413194445 | 45.277 |
| 44066.18579861111 | 44.833 |
| 44066.227465277785 | 44.543 |
| 44066.26913194445 | 44.273 |
| 44066.31079861111 | 44.234 |
| 44066.352465277785 | 44.447 |
| 44066.39413194445 | 45.123 |
| 44066.43579861111 | 46.474 |
| 44066.477465277785 | 48.404 |
| 44066.51913194445 | 50.47 |
| 44066.56079861111 | 52.304 |
| 44066.602465277785 | 53.482 |
| 44066.64413194445 | 54.061 |
| 44066.68579861111 | 53.713 |
| 44066.727465277785 | 53.231 |
| 44066.76913194445 | 52.439 |
| 44066.81079861111 | 51.532 |
| 44066.852465277785 | 50.316 |
| 44066.89413194445 | 49.099 |
| 44066.93579861111 | 47.999 |
| 44066.977465277785 | 47.053 |
| 44067.01913194445 | 46.455 |
| 44067.06079861111 | 45.837 |
| 44067.102465277785 | 45.431 |
| 44067.14413194445 | 45.142 |
| 44067.18579861111 | 44.852 |
| 44067.227465277785 | 44.756 |
| 44067.26913194445 | 44.621 |
| 44067.31079861111 | 44.466 |
| 44067.352465277785 | 44.621 |
| 44067.39413194445 | 45.547 |
| 44067.43579861111 | 47.246 |
| 44067.477465277785 | 49.061 |
| 44067.51913194445 | 51.03 |
| 44067.56079861111 | 52.401 |
| 44067.602465277785 | 52.787 |
| 44067.64413194445 | 53.829 |
| 44067.68579861111 | 54.505 |
| 44067.727465277785 | 53.848 |
| 44067.76913194445 | 53.096 |
| 44067.81079861111 | 52.188 |
| 44067.852465277785 | 51.049 |
| 44067.89413194445 | 50.065 |
| 44067.93579861111 | 49.292 |
| 44067.977465277785 | 48.404 |
| 44068.01913194445 | 47.69 |
| 44068.06079861111 | 47.053 |
| 44068.102465277785 | 46.493 |
| 44068.14413194445 | 46.068 |
| 44068.18579861111 | 45.663 |
| 44068.227465277785 | 45.2 |
| 44068.26913194445 | 44.794 |
| 44068.31079861111 | 44.466 |
| 44068.352465277785 | 44.601 |
| 44068.39413194445 | 45.393 |
| 44068.43579861111 | 46.995 |
| 44068.477465277785 | 49.601 |
| 44068.51913194445 | 52.439 |
| 44068.56079861111 | 55.258 |
| 44068.602465277785 | 56.937 |
| 44068.64413194445 | 58.462 |
| 44068.68579861111 | 57.69 |
| 44068.727465277785 | 56.223 |
| 44068.76913194445 | 54.717 |
| 44068.81079861111 | 52.864 |
| 44068.852465277785 | 51.204 |
| 44068.89413194445 | 49.775 |
| 44068.93579861111 | 49.003 |
| 44068.977465277785 | 47.96 |
| 44069.01913194445 | 47.188 |
| 44069.06079861111 | 46.57 |
| 44069.102465277785 | 46.165 |
| 44069.14413194445 | 45.798 |
| 44069.18579861111 | 45.393 |
| 44069.227465277785 | 45.026 |
| 44069.26913194445 | 44.814 |
| 44069.31079861111 | 44.852 |
| 44069.352465277785 | 45.258 |
| 44069.39413194445 | 45.605 |
| 44069.43579861111 | 47.265 |
| 44069.477465277785 | 49.987 |
| 44069.51913194445 | 52.864 |
| 44069.56079861111 | 55.528 |
| 44069.602465277785 | 55.47 |
| 44069.64413194445 | 55.586 |
| 44069.68579861111 | 54.891 |
| 44069.727465277785 | 54.408 |
| 44069.76913194445 | 53.153 |
| 44069.81079861111 | 51.744 |
| 44069.852465277785 | 50.451 |
| 44069.89413194445 | 49.447 |
| 44069.93579861111 | 48.597 |
| 44069.977465277785 | 47.941 |
| 44070.01913194445 | 47.246 |
| 44070.06079861111 | 46.802 |
| 44070.102465277785 | 46.281 |
| 44070.14413194445 | 45.837 |
| 44070.18579861111 | 45.528 |
| 44070.227465277785 | 45.103 |
| 44070.26913194445 | 44.717 |
| 44070.31079861111 | 44.543 |
| 44070.352465277785 | 44.505 |
| 44070.39413194445 | 45.296 |
| 44070.43579861111 | 47.111 |
| 44070.477465277785 | 49.736 |
| 44070.51913194445 | 52.439 |
| 44070.56079861111 | 53.385 |
| 44070.602465277785 | 57.265 |
| 44070.64413194445 | 58.404 |
| 44070.68579861111 | 58.675 |
| 44070.727465277785 | 57.459 |
| 44070.76913194445 | 55.625 |
| 44070.81079861111 | 54.08 |
| 44070.852465277785 | 52.574 |
| 44070.89413194445 | 51.069 |
| 44070.93579861111 | 49.679 |
| 44070.977465277785 | 48.443 |
| 44071.01913194445 | 47.439 |
| 44071.06079861111 | 46.648 |
| 44071.102465277785 | 46.088 |
| 44071.14413194445 | 45.586 |
| 44071.18579861111 | 45.296 |
| 44071.227465277785 | 44.968 |
| 44071.26913194445 | 44.775 |
| 44071.31079861111 | 44.736 |
| 44071.352465277785 | 45.103 |
| 44071.39413194445 | 45.895 |
| 44071.43579861111 | 47.111 |
| 44071.477465277785 | 48.231 |
| 44071.51913194445 | 51.069 |
| 44071.56079861111 | 52.401 |
| 44071.602465277785 | 52.767 |
| 44071.64413194445 | 52.671 |
| 44071.68579861111 | 52.188 |
| 44071.727465277785 | 51.532 |
| 44071.76913194445 | 50.509 |
| 44071.81079861111 | 49.466 |
| 44071.852465277785 | 48.713 |
| 44071.89413194445 | 47.98 |
| 44071.93579861111 | 47.285 |
| 44071.977465277785 | 46.706 |
| 44072.01913194445 | 46.126 |
| 44072.06079861111 | 45.663 |
| 44072.102465277785 | 45.277 |
| 44072.14413194445 | 44.872 |
| 44072.18579861111 | 44.601 |
| 44072.227465277785 | 44.485 |
| 44072.26913194445 | 44.37 |
| 44072.31079861111 | 44.524 |
| 44072.352465277785 | 44.679 |
| 44072.39413194445 | 45.026 |
| 44072.43579861111 | 45.354 |
| 44072.477465277785 | 45.644 |
| 44072.51913194445 | 46.049 |
| 44072.56079861111 | 46.474 |
| 44072.602465277785 | 47.574 |
| 44072.64413194445 | 49.524 |
| 44072.68579861111 | 51.107 |
| 44072.727465277785 | 51.841 |
| 44072.76913194445 | 51.764 |
| 44072.81079861111 | 50.933 |
| 44072.852465277785 | 50.123 |
| 44072.89413194445 | 49.08 |
| 44072.93579861111 | 48.076 |
| 44072.977465277785 | 47.207 |
| 44073.01913194445 | 46.551 |
| 44073.06079861111 | 45.991 |
| 44073.102465277785 | 45.586 |
| 44073.14413194445 | 45.103 |
| 44073.18579861111 | 44.659 |
| 44073.227465277785 | 44.35 |
| 44073.26913194445 | 44.022 |
| 44073.31079861111 | 43.79 |
| 44073.352465277785 | 43.848 |
| 44073.39413194445 | 44.582 |
| 44073.43579861111 | 46.455 |
| 44073.477465277785 | 48.713 |
| 44073.51913194445 | 50.818 |
| 44073.56079861111 | 52.227 |
| 44073.602465277785 | 52.208 |
| 44073.64413194445 | 52.458 |
| 44073.68579861111 | 53.018 |
| 44073.727465277785 | 53.404 |
| 44073.76913194445 | 52.362 |
| 44073.81079861111 | 50.644 |
| 44073.852465277785 | 49.292 |
| 44073.89413194445 | 48.192 |
| 44073.93579861111 | 47.362 |
| 44073.977465277785 | 46.744 |
| 44074.01913194445 | 46.068 |
| 44074.06079861111 | 45.509 |
| 44074.102465277785 | 45.065 |
| 44074.14413194445 | 44.679 |
| 44074.18579861111 | 44.254 |
| 44074.227465277785 | 43.926 |
| 44074.26913194445 | 43.617 |
| 44074.31079861111 | 43.308 |
| 44074.352465277785 | 43.424 |
| 44074.39413194445 | 44.138 |
| 44074.43579861111 | 45.933 |
| 44074.477465277785 | 48.54 |
| 44074.51913194445 | 51.319 |
| 44074.56079861111 | 52.169 |
| 44074.602465277785 | 53.559 |
| 44074.64413194445 | 54.794 |
| 44074.68579861111 | 54.389 |
| 44074.727465277785 | 53.501 |
| 44074.76913194445 | 52.671 |
| 44074.81079861111 | 51.725 |
| 44074.852465277785 | 50.296 |
| 44074.89413194445 | 49.099 |
| 44074.93579861111 | 48.018 |
| 44074.977465277785 | 47.053 |
| 44075.01913194445 | 46.493 |
| 44075.06079861111 | 46.03 |
| 44075.102465277785 | 45.644 |
| 44075.14413194445 | 45.354 |
| 44075.18579861111 | 45.045 |
| 44075.227465277785 | 44.679 |
| 44075.26913194445 | 44.466 |
| 44075.31079861111 | 44.273 |
| 44075.352465277785 | 44.331 |
| 44075.39413194445 | 44.891 |
| 44075.43579861111 | 46.146 |
| 44075.477465277785 | 48.655 |
| 44075.51913194445 | 50.354 |
| 44075.56079861111 | 53.347 |
| 44075.602465277785 | 55.412 |
| 44075.64413194445 | 56.57 |
| 44075.68579861111 | 57.034 |
| 44075.727465277785 | 56.397 |
| 44075.76913194445 | 54.698 |
| 44075.81079861111 | 52.883 |
| 44075.852465277785 | 51.069 |
| 44075.89413194445 | 49.273 |
| 44075.93579861111 | 47.69 |
| 44075.977465277785 | 46.397 |
| 44076.01913194445 | 45.335 |
| 44076.06079861111 | 44.601 |
| 44076.102465277785 | 43.926 |
| 44076.14413194445 | 43.597 |
| 44076.18579861111 | 43.211 |
| 44076.227465277785 | 42.845 |
| 44076.26913194445 | 42.594 |
| 44076.31079861111 | 42.381 |
| 44076.352465277785 | 42.458 |
| 44076.39413194445 | 43.289 |
| 44076.43579861111 | 45.2 |
| 44076.477465277785 | 47.883 |
| 44076.51913194445 | 50.875 |
| 44076.56079861111 | 53.675 |
| 44076.602465277785 | 56.107 |
| 44076.64413194445 | 57.671 |
| 44076.68579861111 | 58.076 |
| 44076.727465277785 | 57.246 |
| 44076.76913194445 | 55.547 |
| 44076.81079861111 | 53.675 |
| 44076.852465277785 | 51.841 |
| 44076.89413194445 | 50.065 |
| 44076.93579861111 | 48.404 |
| 44076.977465277785 | 47.053 |
| 44077.01913194445 | 45.933 |
| 44077.06079861111 | 45.18 |
| 44077.102465277785 | 44.466 |
| 44077.14413194445 | 43.945 |
| 44077.18579861111 | 43.52 |
| 44077.227465277785 | 43.057 |
| 44077.26913194445 | 42.787 |
| 44077.31079861111 | 42.594 |
| 44077.352465277785 | 42.671 |
| 44077.39413194445 | 43.366 |
| 44077.43579861111 | 45.238 |
| 44077.477465277785 | 47.96 |
| 44077.51913194445 | 51.049 |
| 44077.56079861111 | 53.887 |
| 44077.602465277785 | 56.377 |
| 44077.64413194445 | 57.903 |
| 44077.68579861111 | 58.385 |
| 44077.727465277785 | 57.632 |
| 44077.76913194445 | 55.914 |
| 44077.81079861111 | 54.061 |
| 44077.852465277785 | 52.227 |
| 44077.89413194445 | 50.335 |
| 44077.93579861111 | 48.655 |
| 44077.977465277785 | 47.265 |
| 44078.01913194445 | 46.204 |
| 44078.06079861111 | 45.373 |
| 44078.102465277785 | 44.698 |
| 44078.14413194445 | 44.234 |
| 44078.18579861111 | 43.848 |
| 44078.227465277785 | 43.501 |
| 44078.26913194445 | 43.231 |
| 44078.31079861111 | 42.96 |
| 44078.352465277785 | 43.018 |
| 44078.39413194445 | 43.79 |
| 44078.43579861111 | 45.567 |
| 44078.477465277785 | 48.385 |
| 44078.51913194445 | 51.397 |
| 44078.56079861111 | 54.196 |
| 44078.602465277785 | 56.667 |
| 44078.64413194445 | 58.231 |
| 44078.68579861111 | 58.694 |
| 44078.727465277785 | 57.613 |
| 44078.76913194445 | 56.069 |
| 44078.81079861111 | 54.138 |
| 44078.852465277785 | 52.111 |
| 44078.89413194445 | 50.065 |
| 44078.93579861111 | 48.52 |
| 44078.977465277785 | 47.478 |
| 44079.01913194445 | 46.551 |
| 44079.06079861111 | 45.875 |
| 44079.102465277785 | 45.316 |
| 44079.14413194445 | 44.949 |
| 44079.18579861111 | 44.582 |
| 44079.227465277785 | 44.292 |
| 44079.26913194445 | 44.003 |
| 44079.31079861111 | 43.733 |
| 44079.352465277785 | 43.771 |
| 44079.39413194445 | 44.543 |
| 44079.43579861111 | 46.339 |
| 44079.477465277785 | 49.003 |
| 44079.51913194445 | 52.034 |
| 44079.56079861111 | 54.794 |
| 44079.602465277785 | 57.227 |
| 44079.64413194445 | 58.849 |
| 44079.68579861111 | 59.157 |
| 44079.727465277785 | 58.424 |
| 44079.76913194445 | 56.686 |
| 44079.81079861111 | 54.852 |
| 44079.852465277785 | 52.883 |
| 44079.89413194445 | 50.779 |
| 44079.93579861111 | 48.945 |
| 44079.977465277785 | 47.536 |
| 44080.01913194445 | 46.3 |
| 44080.06079861111 | 45.451 |
| 44080.102465277785 | 44.775 |
| 44080.14413194445 | 44.254 |
| 44080.18579861111 | 43.81 |
| 44080.227465277785 | 43.443 |
| 44080.26913194445 | 43.018 |
| 44080.31079861111 | 42.806 |
| 44080.352465277785 | 42.864 |
| 44080.39413194445 | 43.771 |
| 44080.43579861111 | 45.702 |
| 44080.477465277785 | 48.443 |
| 44080.51913194445 | 51.377 |
| 44080.56079861111 | 54.003 |
| 44080.602465277785 | 56.146 |
| 44080.64413194445 | 57.497 |
| 44080.68579861111 | 57.729 |
| 44080.727465277785 | 56.879 |
| 44080.76913194445 | 55.2 |
| 44080.81079861111 | 53.424 |
| 44080.852465277785 | 51.59 |
| 44080.89413194445 | 49.775 |
| 44080.93579861111 | 48.115 |
| 44080.977465277785 | 46.918 |
| 44081.01913194445 | 45.933 |
| 44081.06079861111 | 45.238 |
| 44081.102465277785 | 44.621 |
| 44081.14413194445 | 44.138 |
| 44081.18579861111 | 43.752 |
| 44081.227465277785 | 43.308 |
| 44081.26913194445 | 42.902 |
| 44081.31079861111 | 42.69 |
| 44081.352465277785 | 42.69 |
| 44081.39413194445 | 43.269 |
| 44081.43579861111 | 44.794 |
| 44081.477465277785 | 46.937 |
| 44081.51913194445 | 49.312 |
| 44081.56079861111 | 51.358 |
| 44081.602465277785 | 52.98 |
| 44081.64413194445 | 54.215 |
| 44081.68579861111 | 54.582 |
| 44081.727465277785 | 54.119 |
| 44081.76913194445 | 52.922 |
| 44081.81079861111 | 51.397 |
| 44081.852465277785 | 49.814 |
| 44081.89413194445 | 48.346 |
| 44081.93579861111 | 47.111 |
| 44081.977465277785 | 46.126 |
| 44082.01913194445 | 45.393 |
| 44082.06079861111 | 44.872 |
| 44082.102465277785 | 44.794 |
| 44082.14413194445 | 44.679 |
| 44082.18579861111 | 44.466 |
| 44082.227465277785 | 44.196 |
| 44082.26913194445 | 43.655 |
| 44082.31079861111 | 43.385 |
| 44082.352465277785 | 43.038 |
| 44082.39413194445 | 42.594 |
| 44082.43579861111 | 43.057 |
| 44082.477465277785 | 43.906 |
| 44082.51913194445 | 44.949 |
| 44082.56079861111 | 45.142 |
| 44082.602465277785 | 43.636 |
| 44082.64413194445 | 41.995 |
| 44082.68579861111 | 41.049 |
| 44082.727465277785 | 39.003 |
| 44082.76913194445 | 38.115 |
| 44082.81079861111 | 37.941 |
| 44082.852465277785 | 37.69 |
| 44082.89413194445 | 37.767 |
| 44082.93579861111 | 37.825 |
| 44082.977465277785 | 38.038 |
| 44083.01913194445 | 38.25 |
| 44083.06079861111 | 38.501 |
| 44083.102465277785 | 38.675 |
| 44083.14413194445 | 38.752 |
| 44083.18579861111 | 38.752 |
| 44083.227465277785 | 38.848 |
| 44083.26913194445 | 38.964 |
| 44083.31079861111 | 39.061 |
| 44083.352465277785 | 39.389 |
| 44083.39413194445 | 39.987 |
| 44083.43579861111 | 40.895 |
| 44083.477465277785 | 42.825 |
| 44083.51913194445 | 44.428 |
| 44083.56079861111 | 46.126 |
| 44083.602465277785 | 49.138 |
| 44083.64413194445 | 50.567 |
| 44083.68579861111 | 50.953 |
| 44083.727465277785 | 50.586 |
| 44083.76913194445 | 49.408 |
| 44083.81079861111 | 47.922 |
| 44083.852465277785 | 46.609 |
| 44083.89413194445 | 45.026 |
| 44083.93579861111 | 43.81 |
| 44083.977465277785 | 42.825 |
| 44084.01913194445 | 42.188 |
| 44084.06079861111 | 41.706 |
| 44084.102465277785 | 41.628 |
| 44084.14413194445 | 41.474 |
| 44084.18579861111 | 41.551 |
| 44084.227465277785 | 41.667 |
| 44084.26913194445 | 41.744 |
| 44084.31079861111 | 41.841 |
| 44084.352465277785 | 41.879 |
| 44084.39413194445 | 42.458 |
| 44084.43579861111 | 44.061 |
| 44084.477465277785 | 46.03 |
| 44084.51913194445 | 48.52 |
| 44084.56079861111 | 49.312 |
| 44084.602465277785 | 50.026 |
| 44084.64413194445 | 50.991 |
| 44084.68579861111 | 50.74 |
| 44084.727465277785 | 50.335 |
| 44084.76913194445 | 49.312 |
| 44084.81079861111 | 47.922 |
| 44084.852465277785 | 46.493 |
| 44084.89413194445 | 45.296 |
| 44084.93579861111 | 44.524 |
| 44084.977465277785 | 43.848 |
| 44085.01913194445 | 43.404 |
| 44085.06079861111 | 43.038 |
| 44085.102465277785 | 42.748 |
| 44085.14413194445 | 42.651 |
| 44085.18579861111 | 42.536 |
| 44085.227465277785 | 42.362 |
| 44085.26913194445 | 42.246 |
| 44085.31079861111 | 42.188 |
| 44085.352465277785 | 42.265 |
| 44085.39413194445 | 42.343 |
| 44085.43579861111 | 42.536 |
| 44085.477465277785 | 43.482 |
| 44085.51913194445 | 44.234 |
| 44085.56079861111 | 46.879 |
| 44085.602465277785 | 49.891 |
| 44085.64413194445 | 50.586 |
| 44085.68579861111 | 51.957 |
| 44085.727465277785 | 51.86 |
| 44085.76913194445 | 50.682 |
| 44085.81079861111 | 49.524 |
| 44085.852465277785 | 48.327 |
| 44085.89413194445 | 47.014 |
| 44085.93579861111 | 45.74 |
| 44085.977465277785 | 44.601 |
| 44086.01913194445 | 43.636 |
| 44086.06079861111 | 42.748 |
| 44086.102465277785 | 42.227 |
| 44086.14413194445 | 41.802 |
| 44086.18579861111 | 41.339 |
| 44086.227465277785 | 41.03 |
| 44086.26913194445 | 40.817 |
| 44086.31079861111 | 40.509 |
| 44086.352465277785 | 40.605 |
| 44086.39413194445 | 41.377 |
| 44086.43579861111 | 43.231 |
| 44086.477465277785 | 45.933 |
| 44086.51913194445 | 48.848 |
| 44086.56079861111 | 51.609 |
| 44086.602465277785 | 53.964 |
| 44086.64413194445 | 55.528 |
| 44086.68579861111 | 56.069 |
| 44086.727465277785 | 55.586 |
| 44086.76913194445 | 54.08 |
| 44086.81079861111 | 52.516 |
| 44086.852465277785 | 50.856 |
| 44086.89413194445 | 49.08 |
| 44086.93579861111 | 47.458 |
| 44086.977465277785 | 46.068 |
| 44087.01913194445 | 44.987 |
| 44087.06079861111 | 44.177 |
| 44087.102465277785 | 43.501 |
| 44087.14413194445 | 43.018 |
| 44087.18579861111 | 42.632 |
| 44087.227465277785 | 42.169 |
| 44087.26913194445 | 41.841 |
| 44087.31079861111 | 41.59 |
| 44087.352465277785 | 41.551 |
| 44087.39413194445 | 42.072 |
| 44087.43579861111 | 43.848 |
| 44087.477465277785 | 46.493 |
| 44087.51913194445 | 49.64 |
| 44087.56079861111 | 52.458 |
| 44087.602465277785 | 54.756 |
| 44087.64413194445 | 56.397 |
| 44087.68579861111 | 57.053 |
| 44087.727465277785 | 56.435 |
| 44087.76913194445 | 55.47 |
| 44087.81079861111 | 54.273 |
| 44087.852465277785 | 52.478 |
| 44087.89413194445 | 50.412 |
| 44087.93579861111 | 48.733 |
| 44087.977465277785 | 47.323 |
| 44088.01913194445 | 46.107 |
| 44088.06079861111 | 45.2 |
| 44088.102465277785 | 44.35 |
| 44088.14413194445 | 43.887 |
| 44088.18579861111 | 43.366 |
| 44088.227465277785 | 42.922 |
| 44088.26913194445 | 42.574 |
| 44088.31079861111 | 42.285 |
| 44088.352465277785 | 42.343 |
| 44088.39413194445 | 42.902 |
| 44088.43579861111 | 44.428 |
| 44088.477465277785 | 46.802 |
| 44088.51913194445 | 49.659 |
| 44088.56079861111 | 52.458 |
| 44088.602465277785 | 54.949 |
| 44088.64413194445 | 56.339 |
| 44088.68579861111 | 57.652 |
| 44088.727465277785 | 56.435 |
| 44088.76913194445 | 55.547 |
| 44088.81079861111 | 54.254 |
| 44088.852465277785 | 52.478 |
| 44088.89413194445 | 50.509 |
| 44088.93579861111 | 48.81 |
| 44088.977465277785 | 47.381 |
| 44089.01913194445 | 46.146 |
| 44089.06079861111 | 45.238 |
| 44089.102465277785 | 44.35 |
| 44089.14413194445 | 43.79 |
| 44089.18579861111 | 43.289 |
| 44089.227465277785 | 42.787 |
| 44089.26913194445 | 42.439 |
| 44089.31079861111 | 42.15 |
| 44089.352465277785 | 42.072 |
| 44089.39413194445 | 42.69 |
| 44089.43579861111 | 44.273 |
| 44089.477465277785 | 46.667 |
| 44089.51913194445 | 49.35 |
| 44089.56079861111 | 51.783 |
| 44089.602465277785 | 53.848 |
| 44089.64413194445 | 55.258 |
| 44089.68579861111 | 55.509 |
| 44089.727465277785 | 55.103 |
| 44089.76913194445 | 54.196 |
| 44089.81079861111 | 52.941 |
| 44089.852465277785 | 51.358 |
| 44089.89413194445 | 49.775 |
| 44089.93579861111 | 48.115 |
| 44089.977465277785 | 46.706 |
| 44090.01913194445 | 45.451 |
| 44090.06079861111 | 44.524 |
| 44090.102465277785 | 43.771 |
| 44090.14413194445 | 43.095 |
| 44090.18579861111 | 42.671 |
| 44090.227465277785 | 42.227 |
| 44090.26913194445 | 41.841 |
| 44090.31079861111 | 41.59 |
| 44090.352465277785 | 41.609 |
| 44090.39413194445 | 42.227 |
| 44090.43579861111 | 43.443 |
| 44090.477465277785 | 45.663 |
| 44090.51913194445 | 48.308 |
| 44090.56079861111 | 50.663 |
| 44090.602465277785 | 52.632 |
| 44090.64413194445 | 54.061 |
| 44090.68579861111 | 54.582 |
| 44090.727465277785 | 54.022 |
| 44090.76913194445 | 53.269 |
| 44090.81079861111 | 52.13 |
| 44090.852465277785 | 50.625 |
| 44090.89413194445 | 49.138 |
| 44090.93579861111 | 47.748 |
| 44090.977465277785 | 46.57 |
| 44091.01913194445 | 45.586 |
| 44091.06079861111 | 44.775 |
| 44091.102465277785 | 44.157 |
| 44091.14413194445 | 43.694 |
| 44091.18579861111 | 43.289 |
| 44091.227465277785 | 42.864 |
| 44091.26913194445 | 42.497 |
| 44091.31079861111 | 42.246 |
| 44091.352465277785 | 42.246 |
| 44091.39413194445 | 42.729 |
| 44091.43579861111 | 44.08 |
| 44091.477465277785 | 46.242 |
| 44091.51913194445 | 48.81 |
| 44091.56079861111 | 51.146 |
| 44091.602465277785 | 53.153 |
| 44091.64413194445 | 54.408 |
| 44091.68579861111 | 54.852 |
| 44091.727465277785 | 54.408 |
| 44091.76913194445 | 53.327 |
| 44091.81079861111 | 52.111 |
| 44091.852465277785 | 50.644 |
| 44091.89413194445 | 49.08 |
| 44091.93579861111 | 47.729 |
| 44091.977465277785 | 46.474 |
| 44092.01913194445 | 45.412 |
| 44092.06079861111 | 44.621 |
| 44092.102465277785 | 43.984 |
| 44092.14413194445 | 43.482 |
| 44092.18579861111 | 43.038 |
| 44092.227465277785 | 42.651 |
| 44092.26913194445 | 42.323 |
| 44092.31079861111 | 42.15 |
| 44092.352465277785 | 42.15 |
| 44092.39413194445 | 42.748 |
| 44092.43579861111 | 44.254 |
| 44092.477465277785 | 46.532 |
| 44092.51913194445 | 48.906 |
| 44092.56079861111 | 50.663 |
| 44092.602465277785 | 51.107 |
| 44092.64413194445 | 51.551 |
| 44092.68579861111 | 52.188 |
| 44092.727465277785 | 52.652 |
| 44092.76913194445 | 52.188 |
| 44092.81079861111 | 50.991 |
| 44092.852465277785 | 49.485 |
| 44092.89413194445 | 48.443 |
| 44092.93579861111 | 47.381 |
| 44092.977465277785 | 46.281 |
| 44093.01913194445 | 45.451 |
| 44093.06079861111 | 44.872 |
| 44093.102465277785 | 44.428 |
| 44093.14413194445 | 44.08 |
| 44093.18579861111 | 43.829 |
| 44093.227465277785 | 43.424 |
| 44093.26913194445 | 43.134 |
| 44093.31079861111 | 42.883 |
| 44093.352465277785 | 42.98 |
| 44093.39413194445 | 43.578 |
| 44093.43579861111 | 44.949 |
| 44093.477465277785 | 47.072 |
| 44093.51913194445 | 49.312 |
| 44093.56079861111 | 49.679 |
| 44093.602465277785 | 50.354 |
| 44093.64413194445 | 50.721 |
| 44093.68579861111 | 51.532 |
| 44093.727465277785 | 51.841 |
| 44093.76913194445 | 50.856 |
| 44093.81079861111 | 50.007 |
| 44093.852465277785 | 49.061 |
| 44093.89413194445 | 47.999 |
| 44093.93579861111 | 46.976 |
| 44093.977465277785 | 46.165 |
| 44094.01913194445 | 45.547 |
| 44094.06079861111 | 45.103 |
| 44094.102465277785 | 44.717 |
| 44094.14413194445 | 44.447 |
| 44094.18579861111 | 44.099 |
| 44094.227465277785 | 43.945 |
| 44094.26913194445 | 43.771 |
| 44094.31079861111 | 43.733 |
| 44094.352465277785 | 43.829 |
| 44094.39413194445 | 44.543 |
| 44094.43579861111 | 45.412 |
| 44094.477465277785 | 46.339 |
| 44094.51913194445 | 46.899 |
| 44094.56079861111 | 47.42 |
| 44094.602465277785 | 48.559 |
| 44094.64413194445 | 50.374 |
| 44094.68579861111 | 51.397 |
| 44094.727465277785 | 50.933 |
| 44094.76913194445 | 50.2 |
| 44094.81079861111 | 49.717 |
| 44094.852465277785 | 48.945 |
| 44094.89413194445 | 47.806 |
| 44094.93579861111 | 46.686 |
| 44094.977465277785 | 45.605 |
| 44095.01913194445 | 44.621 |
| 44095.06079861111 | 43.829 |
| 44095.102465277785 | 43.327 |
| 44095.14413194445 | 42.864 |
| 44095.18579861111 | 42.478 |
| 44095.227465277785 | 42.053 |
| 44095.26913194445 | 41.802 |
| 44095.31079861111 | 41.609 |
| 44095.352465277785 | 41.706 |
| 44095.39413194445 | 42.458 |
| 44095.43579861111 | 44.157 |
| 44095.477465277785 | 46.184 |
| 44095.51913194445 | 49.138 |
| 44095.56079861111 | 51.841 |
| 44095.602465277785 | 53.945 |
| 44095.64413194445 | 55.007 |
| 44095.68579861111 | 54.08 |
| 44095.727465277785 | 53.675 |
| 44095.76913194445 | 53.25 |
| 44095.81079861111 | 52.343 |
| 44095.852465277785 | 50.818 |
| 44095.89413194445 | 49.466 |
| 44095.93579861111 | 48.192 |
| 44095.977465277785 | 47.034 |
| 44096.01913194445 | 46.088 |
| 44096.06079861111 | 45.219 |
| 44096.102465277785 | 44.543 |
| 44096.14413194445 | 43.964 |
| 44096.18579861111 | 43.52 |
| 44096.227465277785 | 43.134 |
| 44096.26913194445 | 42.787 |
| 44096.31079861111 | 42.536 |
| 44096.352465277785 | 42.381 |
| 44096.39413194445 | 42.96 |
| 44096.43579861111 | 44.582 |
| 44096.477465277785 | 47.092 |
| 44096.51913194445 | 49.698 |
| 44096.56079861111 | 50.953 |
| 44096.602465277785 | 51.358 |
| 44096.64413194445 | 51.667 |
| 44096.68579861111 | 51.686 |
| 44096.727465277785 | 51.358 |
| 44096.76913194445 | 50.74 |
| 44096.81079861111 | 50.045 |
| 44096.852465277785 | 48.887 |
| 44096.89413194445 | 47.96 |
| 44096.93579861111 | 47.13 |
| 44096.977465277785 | 46.377 |
| 44097.01913194445 | 45.586 |
| 44097.06079861111 | 44.929 |
| 44097.102465277785 | 44.659 |
| 44097.14413194445 | 44.447 |
| 44097.18579861111 | 44.119 |
| 44097.227465277785 | 43.713 |
| 44097.26913194445 | 43.289 |
| 44097.31079861111 | 42.902 |
| 44097.352465277785 | 42.825 |
| 44097.39413194445 | 43.346 |
| 44097.43579861111 | 44.794 |
| 44097.477465277785 | 47.034 |
| 44097.51913194445 | 49.756 |
| 44097.56079861111 | 52.111 |
| 44097.602465277785 | 53.945 |
| 44097.64413194445 | 54.37 |
| 44097.68579861111 | 54.814 |
| 44097.727465277785 | 54.061 |
| 44097.76913194445 | 52.709 |
| 44097.81079861111 | 51.532 |
| 44097.852465277785 | 50.045 |
| 44097.89413194445 | 48.443 |
| 44097.93579861111 | 46.86 |
| 44097.977465277785 | 45.682 |
| 44098.01913194445 | 44.698 |
| 44098.06079861111 | 43.945 |
| 44098.102465277785 | 43.366 |
| 44098.14413194445 | 42.883 |
| 44098.18579861111 | 42.458 |
| 44098.227465277785 | 42.092 |
| 44098.26913194445 | 41.706 |
| 44098.31079861111 | 41.493 |
| 44098.352465277785 | 41.377 |
| 44098.39413194445 | 41.995 |
| 44098.43579861111 | 43.366 |
| 44098.477465277785 | 44.968 |
| 44098.51913194445 | 47.671 |
| 44098.56079861111 | 50.509 |
| 44098.602465277785 | 52.903 |
| 44098.64413194445 | 54.64 |
| 44098.68579861111 | 55.296 |
| 44098.727465277785 | 54.872 |
| 44098.76913194445 | 53.675 |
| 44098.81079861111 | 52.478 |
| 44098.852465277785 | 51.03 |
| 44098.89413194445 | 49.428 |
| 44098.93579861111 | 47.883 |
| 44098.977465277785 | 46.628 |
| 44099.01913194445 | 45.567 |
| 44099.06079861111 | 44.736 |
| 44099.102465277785 | 44.157 |
| 44099.14413194445 | 43.617 |
| 44099.18579861111 | 43.192 |
| 44099.227465277785 | 42.864 |
| 44099.26913194445 | 42.516 |
| 44099.31079861111 | 42.343 |
| 44099.352465277785 | 42.188 |
| 44099.39413194445 | 42.651 |
| 44099.43579861111 | 44.312 |
| 44099.477465277785 | 46.879 |
| 44099.51913194445 | 48.752 |
| 44099.56079861111 | 50.625 |
| 44099.602465277785 | 52.69 |
| 44099.64413194445 | 54.408 |
| 44099.68579861111 | 55.045 |
| 44099.727465277785 | 54.543 |
| 44099.76913194445 | 53.501 |
| 44099.81079861111 | 52.343 |
| 44099.852465277785 | 51.03 |
| 44099.89413194445 | 49.485 |
| 44099.93579861111 | 47.941 |
| 44099.977465277785 | 46.686 |
| 44100.01913194445 | 45.605 |
| 44100.06079861111 | 44.717 |
| 44100.102465277785 | 44.157 |
| 44100.14413194445 | 43.713 |
| 44100.18579861111 | 43.25 |
| 44100.227465277785 | 42.922 |
| 44100.26913194445 | 42.613 |
| 44100.31079861111 | 42.381 |
| 44100.352465277785 | 42.478 |
| 44100.39413194445 | 43.038 |
| 44100.43579861111 | 44.408 |
| 44100.477465277785 | 46.57 |
| 44100.51913194445 | 48.018 |
| 44100.56079861111 | 49.891 |
| 44100.602465277785 | 52.285 |
| 44100.64413194445 | 54.312 |
| 44100.68579861111 | 54.987 |
| 44100.727465277785 | 54.543 |
| 44100.76913194445 | 53.308 |
| 44100.81079861111 | 52.208 |
| 44100.852465277785 | 50.972 |
| 44100.89413194445 | 49.679 |
| 44100.93579861111 | 48.327 |
| 44100.977465277785 | 47.092 |
| 44101.01913194445 | 46.165 |
| 44101.06079861111 | 45.567 |
| 44101.102465277785 | 45.084 |
| 44101.14413194445 | 44.717 |
| 44101.18579861111 | 44.215 |
| 44101.227465277785 | 43.945 |
| 44101.26913194445 | 43.829 |
| 44101.31079861111 | 43.675 |
| 44101.352465277785 | 43.733 |
| 44101.39413194445 | 44.234 |
| 44101.43579861111 | 44.968 |
| 44101.477465277785 | 46.416 |
| 44101.51913194445 | 47.594 |
| 44101.56079861111 | 48.868 |
| 44101.602465277785 | 50.625 |
| 44101.64413194445 | 50.895 |
| 44101.68579861111 | 50.644 |
| 44101.727465277785 | 49.389 |
| 44101.76913194445 | 47.594 |
| 44101.81079861111 | 46.358 |
| 44101.852465277785 | 45.258 |
| 44101.89413194445 | 44.292 |
| 44101.93579861111 | 43.443 |
| 44101.977465277785 | 42.767 |
| 44102.01913194445 | 42.304 |
| 44102.06079861111 | 41.899 |
| 44102.102465277785 | 41.493 |
| 44102.14413194445 | 41.397 |
| 44102.18579861111 | 40.972 |
| 44102.227465277785 | 40.605 |
| 44102.26913194445 | 40.2 |
| 44102.31079861111 | 39.794 |
| 44102.352465277785 | 39.563 |
| 44102.39413194445 | 39.891 |
| 44102.43579861111 | 41.068 |
| 44102.477465277785 | 43.153 |
| 44102.51913194445 | 45.586 |
| 44102.56079861111 | 47.902 |
| 44102.602465277785 | 49.621 |
| 44102.64413194445 | 50.644 |
| 44102.68579861111 | 50.895 |
| 44102.727465277785 | 50.007 |
| 44102.76913194445 | 48.404 |
| 44102.81079861111 | 47.285 |
| 44102.852465277785 | 46.088 |
| 44102.89413194445 | 44.794 |
| 44102.93579861111 | 43.482 |
| 44102.977465277785 | 42.362 |
| 44103.01913194445 | 41.377 |
| 44103.06079861111 | 40.644 |
| 44103.102465277785 | 40.065 |
| 44103.14413194445 | 39.64 |
| 44103.18579861111 | 39.331 |
| 44103.227465277785 | 39.061 |
| 44103.26913194445 | 38.887 |
| 44103.31079861111 | 38.713 |
| 44103.352465277785 | 38.617 |
| 44103.39413194445 | 39.215 |
| 44103.43579861111 | 40.991 |
| 44103.477465277785 | 43.501 |
| 44103.51913194445 | 46.339 |
| 44103.56079861111 | 48.964 |
| 44103.602465277785 | 51.223 |
| 44103.64413194445 | 52.652 |
| 44103.68579861111 | 53.038 |
| 44103.727465277785 | 52.285 |
| 44103.76913194445 | 50.856 |
| 44103.81079861111 | 49.775 |
| 44103.852465277785 | 48.443 |
| 44103.89413194445 | 46.841 |
| 44103.93579861111 | 45.316 |
| 44103.977465277785 | 44.061 |
| 44104.01913194445 | 42.96 |
| 44104.06079861111 | 42.15 |
| 44104.102465277785 | 41.493 |
| 44104.14413194445 | 41.03 |
| 44104.18579861111 | 40.605 |
| 44104.227465277785 | 40.18 |
| 44104.26913194445 | 39.91 |
| 44104.31079861111 | 39.64 |
| 44104.352465277785 | 39.447 |
| 44104.39413194445 | 39.891 |
| 44104.43579861111 | 41.628 |
| 44104.477465277785 | 44.177 |
| 44104.51913194445 | 47.092 |
| 44104.56079861111 | 49.756 |
| 44104.602465277785 | 51.628 |
| 44104.64413194445 | 52.787 |
| 44104.68579861111 | 53.115 |
| 44104.727465277785 | 52.208 |
| 44104.76913194445 | 50.663 |
| 44104.81079861111 | 49.37 |
| 44104.852465277785 | 48.115 |
| 44104.89413194445 | 46.648 |
| 44104.93579861111 | 45.065 |
| 44104.977465277785 | 43.829 |
| 44105.01913194445 | 42.709 |
| 44105.06079861111 | 41.841 |
| 44105.102465277785 | 41.261 |
| 44105.14413194445 | 40.702 |
| 44105.18579861111 | 40.277 |
| 44105.227465277785 | 39.949 |
| 44105.26913194445 | 39.582 |
| 44105.31079861111 | 39.428 |
| 44105.352465277785 | 39.35 |
| 44105.39413194445 | 39.814 |
| 44105.43579861111 | 41.416 |
| 44105.477465277785 | 43.559 |
| 44105.51913194445 | 46.204 |
| 44105.56079861111 | 48.54 |
| 44105.602465277785 | 50.354 |
| 44105.64413194445 | 51.551 |
| 44105.68579861111 | 51.937 |
| 44105.727465277785 | 51.03 |
| 44105.76913194445 | 49.679 |
| 44105.81079861111 | 48.675 |
| 44105.852465277785 | 47.594 |
| 44105.89413194445 | 46.184 |
| 44105.93579861111 | 44.891 |
| 44105.977465277785 | 43.771 |
| 44106.01913194445 | 42.748 |
| 44106.06079861111 | 42.034 |
| 44106.102465277785 | 41.57 |
| 44106.14413194445 | 41.165 |
| 44106.18579861111 | 40.779 |
| 44106.227465277785 | 40.354 |
| 44106.26913194445 | 40.084 |
| 44106.31079861111 | 39.833 |
| 44106.352465277785 | 39.698 |
| 44106.39413194445 | 40.296 |
| 44106.43579861111 | 41.802 |
| 44106.477465277785 | 44.234 |
| 44106.51913194445 | 46.57 |
| 44106.56079861111 | 48.385 |
| 44106.602465277785 | 49.157 |
| 44106.64413194445 | 50.007 |
| 44106.68579861111 | 50.142 |
| 44106.727465277785 | 49.852 |
| 44106.76913194445 | 49.138 |
| 44106.81079861111 | 48.134 |
| 44106.852465277785 | 47.13 |
| 44106.89413194445 | 45.953 |
| 44106.93579861111 | 44.814 |
| 44106.977465277785 | 43.771 |
| 44107.01913194445 | 42.748 |
| 44107.06079861111 | 42.034 |
| 44107.102465277785 | 41.358 |
| 44107.14413194445 | 40.817 |
| 44107.18579861111 | 40.47 |
| 44107.227465277785 | 40.122 |
| 44107.26913194445 | 39.794 |
| 44107.31079861111 | 39.601 |
| 44107.352465277785 | 39.485 |
| 44107.39413194445 | 40.065 |
| 44107.43579861111 | 41.512 |
| 44107.477465277785 | 43.636 |
| 44107.51913194445 | 46.146 |
| 44107.56079861111 | 48.597 |
| 44107.602465277785 | 50.47 |
| 44107.64413194445 | 51.628 |
| 44107.68579861111 | 51.821 |
| 44107.727465277785 | 51.184 |
| 44107.76913194445 | 49.987 |
| 44107.81079861111 | 48.945 |
| 44107.852465277785 | 47.767 |
| 44107.89413194445 | 46.377 |
| 44107.93579861111 | 45.084 |
| 44107.977465277785 | 43.848 |
| 44108.01913194445 | 42.883 |
| 44108.06079861111 | 42.111 |
| 44108.102465277785 | 41.493 |
| 44108.14413194445 | 41.011 |
| 44108.18579861111 | 40.586 |
| 44108.227465277785 | 40.2 |
| 44108.26913194445 | 39.968 |
| 44108.31079861111 | 39.659 |
| 44108.352465277785 | 39.582 |
| 44108.39413194445 | 40.103 |
| 44108.43579861111 | 41.628 |
| 44108.477465277785 | 44.08 |
| 44108.51913194445 | 46.841 |
| 44108.56079861111 | 49.292 |
| 44108.602465277785 | 51.204 |
| 44108.64413194445 | 52.458 |
| 44108.68579861111 | 52.903 |
| 44108.727465277785 | 52.13 |
| 44108.76913194445 | 51.146 |
| 44108.81079861111 | 50.123 |
| 44108.852465277785 | 48.733 |
| 44108.89413194445 | 47.285 |
| 44108.93579861111 | 45.856 |
| 44108.977465277785 | 44.543 |
| 44109.01913194445 | 43.52 |
| 44109.06079861111 | 42.651 |
| 44109.102465277785 | 42.014 |
| 44109.14413194445 | 41.455 |
| 44109.18579861111 | 40.991 |
| 44109.227465277785 | 40.547 |
| 44109.26913194445 | 40.2 |
| 44109.31079861111 | 39.852 |
| 44109.352465277785 | 39.64 |
| 44109.39413194445 | 40.065 |
| 44109.43579861111 | 41.57 |
| 44109.477465277785 | 43.984 |
| 44109.51913194445 | 46.59 |
| 44109.56079861111 | 48.926 |
| 44109.602465277785 | 50.625 |
| 44109.64413194445 | 51.706 |
| 44109.68579861111 | 51.879 |
| 44109.727465277785 | 51.049 |
| 44109.76913194445 | 49.872 |
| 44109.81079861111 | 48.868 |
| 44109.852465277785 | 47.729 |
| 44109.89413194445 | 46.3 |
| 44109.93579861111 | 44.852 |
| 44109.977465277785 | 43.655 |
| 44110.01913194445 | 42.651 |
| 44110.06079861111 | 41.918 |
| 44110.102465277785 | 41.339 |
| 44110.14413194445 | 40.76 |
| 44110.18579861111 | 40.354 |
| 44110.227465277785 | 40.026 |
| 44110.26913194445 | 39.698 |
| 44110.31079861111 | 39.408 |
| 44110.352465277785 | 39.312 |
| 44110.39413194445 | 39.756 |
| 44110.43579861111 | 41.261 |
| 44110.477465277785 | 43.617 |
| 44110.51913194445 | 46.339 |
| 44110.56079861111 | 48.868 |
| 44110.602465277785 | 50.798 |
| 44110.64413194445 | 52.13 |
| 44110.68579861111 | 52.458 |
| 44110.727465277785 | 51.802 |
| 44110.76913194445 | 50.798 |
| 44110.81079861111 | 49.756 |
| 44110.852465277785 | 48.308 |
| 44110.89413194445 | 46.725 |
| 44110.93579861111 | 45.258 |
| 44110.977465277785 | 43.964 |
| 44111.01913194445 | 42.922 |
| 44111.06079861111 | 42.227 |
| 44111.102465277785 | 41.551 |
| 44111.14413194445 | 40.991 |
| 44111.18579861111 | 40.644 |
| 44111.227465277785 | 40.296 |
| 44111.26913194445 | 39.987 |
| 44111.31079861111 | 39.717 |
| 44111.352465277785 | 39.505 |
| 44111.39413194445 | 40.007 |
| 44111.43579861111 | 41.667 |
| 44111.477465277785 | 43.984 |
| 44111.51913194445 | 46.744 |
| 44111.56079861111 | 49.273 |
| 44111.602465277785 | 51.242 |
| 44111.64413194445 | 52.516 |
| 44111.68579861111 | 52.883 |
| 44111.727465277785 | 52.13 |
| 44111.76913194445 | 51.107 |
| 44111.81079861111 | 50.045 |
| 44111.852465277785 | 48.636 |
| 44111.89413194445 | 47.053 |
| 44111.93579861111 | 45.586 |
| 44111.977465277785 | 44.428 |
| 44112.01913194445 | 43.404 |
| 44112.06079861111 | 42.651 |
| 44112.102465277785 | 42.034 |
| 44112.14413194445 | 41.59 |
| 44112.18579861111 | 41.146 |
| 44112.227465277785 | 40.837 |
| 44112.26913194445 | 40.528 |
| 44112.31079861111 | 40.258 |
| 44112.352465277785 | 40.007 |
| 44112.39413194445 | 40.431 |
| 44112.43579861111 | 41.841 |
| 44112.477465277785 | 44.138 |
| 44112.51913194445 | 46.783 |
| 44112.56079861111 | 49.196 |
| 44112.602465277785 | 51.146 |
| 44112.64413194445 | 52.478 |
| 44112.68579861111 | 52.903 |
| 44112.727465277785 | 52.188 |
| 44112.76913194445 | 51.204 |
| 44112.81079861111 | 50.258 |
| 44112.852465277785 | 49.292 |
| 44112.89413194445 | 48.018 |
| 44112.93579861111 | 46.725 |
| 44112.977465277785 | 45.431 |
| 44113.01913194445 | 44.273 |
| 44113.06079861111 | 43.269 |
| 44113.102465277785 | 42.516 |
| 44113.14413194445 | 41.821 |
| 44113.18579861111 | 41.339 |
| 44113.227465277785 | 40.991 |
| 44113.26913194445 | 40.605 |
| 44113.31079861111 | 40.219 |
| 44113.352465277785 | 39.949 |
| 44113.39413194445 | 40.18 |
| 44113.43579861111 | 41.706 |
| 44113.477465277785 | 44.041 |
| 44113.51913194445 | 46.86 |
| 44113.56079861111 | 49.563 |
| 44113.602465277785 | 51.667 |
| 44113.64413194445 | 51.995 |
| 44113.68579861111 | 52.111 |
| 44113.727465277785 | 51.957 |
| 44113.76913194445 | 51.648 |
| 44113.81079861111 | 50.991 |
| 44113.852465277785 | 50.18 |
| 44113.89413194445 | 49.138 |
| 44113.93579861111 | 47.883 |
| 44113.977465277785 | 46.783 |
| 44114.01913194445 | 45.76 |
| 44114.06079861111 | 44.891 |
| 44114.102465277785 | 43.964 |
| 44114.14413194445 | 43.173 |
| 44114.18579861111 | 42.497 |
| 44114.227465277785 | 41.937 |
| 44114.26913194445 | 41.435 |
| 44114.31079861111 | 41.03 |
| 44114.352465277785 | 40.76 |
| 44114.39413194445 | 41.011 |
| 44114.43579861111 | 42.439 |
| 44114.477465277785 | 44.717 |
| 44114.51913194445 | 47.516 |
| 44114.56079861111 | 50.161 |
| 44114.602465277785 | 51.706 |
| 44114.64413194445 | 53.269 |
| 44114.68579861111 | 53.733 |
| 44114.727465277785 | 53.018 |
| 44114.76913194445 | 52.304 |
| 44114.81079861111 | 51.435 |
| 44114.852465277785 | 50.451 |
| 44114.89413194445 | 49.331 |
| 44114.93579861111 | 48.038 |
| 44114.977465277785 | 46.763 |
| 44115.01913194445 | 45.702 |
| 44115.06079861111 | 44.601 |
| 44115.102465277785 | 43.79 |
| 44115.14413194445 | 43.076 |
| 44115.18579861111 | 42.497 |
| 44115.227465277785 | 42.072 |
| 44115.26913194445 | 41.744 |
| 44115.31079861111 | 41.416 |
| 44115.352465277785 | 41.3 |
| 44115.39413194445 | 41.86 |
| 44115.43579861111 | 42.69 |
| 44115.477465277785 | 43.25 |
| 44115.51913194445 | 43.655 |
| 44115.56079861111 | 43.153 |
| 44115.602465277785 | 41.493 |
| 44115.64413194445 | 40.026 |
| 44115.68579861111 | 39.833 |
| 44115.727465277785 | 40.142 |
| 44115.76913194445 | 40.122 |
| 44115.81079861111 | 39.756 |
| 44115.852465277785 | 39.234 |
| 44115.89413194445 | 38.752 |
| 44115.93579861111 | 38.482 |
| 44115.977465277785 | 38.269 |
| 44116.01913194445 | 38.076 |
| 44116.06079861111 | 37.767 |
| 44116.102465277785 | 37.458 |
| 44116.14413194445 | 37.169 |
| 44116.18579861111 | 36.937 |
| 44116.227465277785 | 36.725 |
| 44116.26913194445 | 36.609 |
| 44116.31079861111 | 36.512 |
| 44116.352465277785 | 36.435 |
| 44116.39413194445 | 36.918 |
| 44116.43579861111 | 38.597 |
| 44116.477465277785 | 40.991 |
| 44116.51913194445 | 43.733 |
| 44116.56079861111 | 46.3 |
| 44116.602465277785 | 48.327 |
| 44116.64413194445 | 49.563 |
| 44116.68579861111 | 49.659 |
| 44116.727465277785 | 48.752 |
| 44116.76913194445 | 47.767 |
| 44116.81079861111 | 46.995 |
| 44116.852465277785 | 46.126 |
| 44116.89413194445 | 45.103 |
| 44116.93579861111 | 43.945 |
| 44116.977465277785 | 42.845 |
| 44117.01913194445 | 42.034 |
| 44117.06079861111 | 41.184 |
| 44117.102465277785 | 40.528 |
| 44117.14413194445 | 39.891 |
| 44117.18579861111 | 39.466 |
| 44117.227465277785 | 39.157 |
| 44117.26913194445 | 38.848 |
| 44117.31079861111 | 38.578 |
| 44117.352465277785 | 38.424 |
| 44117.39413194445 | 38.829 |
| 44117.43579861111 | 40.335 |
| 44117.477465277785 | 42.69 |
| 44117.51913194445 | 45.412 |
| 44117.56079861111 | 47.922 |
| 44117.602465277785 | 49.814 |
| 44117.64413194445 | 50.933 |
| 44117.68579861111 | 51.184 |
| 44117.727465277785 | 50.47 |
| 44117.76913194445 | 49.485 |
| 44117.81079861111 | 48.733 |
| 44117.852465277785 | 47.787 |
| 44117.89413194445 | 46.725 |
| 44117.93579861111 | 45.567 |
| 44117.977465277785 | 44.582 |
| 44118.01913194445 | 43.675 |
| 44118.06079861111 | 42.787 |
| 44118.102465277785 | 42.111 |
| 44118.14413194445 | 41.667 |
| 44118.18579861111 | 41.455 |
| 44118.227465277785 | 41.184 |
| 44118.26913194445 | 40.991 |
| 44118.31079861111 | 40.702 |
| 44118.352465277785 | 40.663 |
| 44118.39413194445 | 41.088 |
| 44118.43579861111 | 42.323 |
| 44118.477465277785 | 44.466 |
| 44118.51913194445 | 46.821 |
| 44118.56079861111 | 49.061 |
| 44118.602465277785 | 50.856 |
| 44118.64413194445 | 51.802 |
| 44118.68579861111 | 51.802 |
| 44118.727465277785 | 50.875 |
| 44118.76913194445 | 50.142 |
| 44118.81079861111 | 49.312 |
| 44118.852465277785 | 48.404 |
| 44118.89413194445 | 47.42 |
| 44118.93579861111 | 46.262 |
| 44118.977465277785 | 45.123 |
| 44119.01913194445 | 44.099 |
| 44119.06079861111 | 43.095 |
| 44119.102465277785 | 42.246 |
| 44119.14413194445 | 41.551 |
| 44119.18579861111 | 40.798 |
| 44119.227465277785 | 40.103 |
| 44119.26913194445 | 39.485 |
| 44119.31079861111 | 38.906 |
| 44119.352465277785 | 38.346 |
| 44119.39413194445 | 38.346 |
| 44119.43579861111 | 39.292 |
| 44119.477465277785 | 40.856 |
| 44119.51913194445 | 42.864 |
| 44119.56079861111 | 44.814 |
| 44119.602465277785 | 46.165 |
| 44119.64413194445 | 46.609 |
| 44119.68579861111 | 46.223 |
| 44119.727465277785 | 45.123 |
| 44119.76913194445 | 44.061 |
| 44119.81079861111 | 43.366 |
| 44119.852465277785 | 42.883 |
| 44119.89413194445 | 42.092 |
| 44119.93579861111 | 41.146 |
| 44119.977465277785 | 40.2 |
| 44120.01913194445 | 39.331 |
| 44120.06079861111 | 38.578 |
| 44120.102465277785 | 38.018 |
| 44120.14413194445 | 37.574 |
| 44120.18579861111 | 37.285 |
| 44120.227465277785 | 37.014 |
| 44120.26913194445 | 36.609 |
| 44120.31079861111 | 36.377 |
| 44120.352465277785 | 36.319 |
| 44120.39413194445 | 36.686 |
| 44120.43579861111 | 37.98 |
| 44120.477465277785 | 40.045 |
| 44120.51913194445 | 42.536 |
| 44120.56079861111 | 44.659 |
| 44120.602465277785 | 46.146 |
| 44120.64413194445 | 46.937 |
| 44120.68579861111 | 47.265 |
| 44120.727465277785 | 46.474 |
| 44120.76913194445 | 45.837 |
| 44120.81079861111 | 45.393 |
| 44120.852465277785 | 44.794 |
| 44120.89413194445 | 43.945 |
| 44120.93579861111 | 43.115 |
| 44120.977465277785 | 42.4 |
| 44121.01913194445 | 41.725 |
| 44121.06079861111 | 41.03 |
| 44121.102465277785 | 40.547 |
| 44121.14413194445 | 40.103 |
| 44121.18579861111 | 39.698 |
| 44121.227465277785 | 39.37 |
| 44121.26913194445 | 39.138 |
| 44121.31079861111 | 38.868 |
| 44121.352465277785 | 39.003 |
| 44121.39413194445 | 39.601 |
| 44121.43579861111 | 40.875 |
| 44121.477465277785 | 41.59 |
| 44121.51913194445 | 42.555 |
| 44121.56079861111 | 43.327 |
| 44121.602465277785 | 45.547 |
| 44121.64413194445 | 46.744 |
| 44121.68579861111 | 47.072 |
| 44121.727465277785 | 46.667 |
| 44121.76913194445 | 46.068 |
| 44121.81079861111 | 45.818 |
| 44121.852465277785 | 45.373 |
| 44121.89413194445 | 44.929 |
| 44121.93579861111 | 44.177 |
| 44121.977465277785 | 43.424 |
| 44122.01913194445 | 42.69 |
| 44122.06079861111 | 42.227 |
| 44122.102465277785 | 41.783 |
| 44122.14413194445 | 41.319 |
| 44122.18579861111 | 40.933 |
| 44122.227465277785 | 40.721 |
| 44122.26913194445 | 40.547 |
| 44122.31079861111 | 40.47 |
| 44122.352465277785 | 40.412 |
| 44122.39413194445 | 40.953 |
| 44122.43579861111 | 42.188 |
| 44122.477465277785 | 44.061 |
| 44122.51913194445 | 45.123 |
| 44122.56079861111 | 48.346 |
| 44122.602465277785 | 50.682 |
| 44122.64413194445 | 51.686 |
| 44122.68579861111 | 51.319 |
| 44122.727465277785 | 50.354 |
| 44122.76913194445 | 49.679 |
| 44122.81079861111 | 48.964 |
| 44122.852465277785 | 48.25 |
| 44122.89413194445 | 47.265 |
| 44122.93579861111 | 46.146 |
| 44122.977465277785 | 45.084 |
| 44123.01913194445 | 44.138 |
| 44123.06079861111 | 43.385 |
| 44123.102465277785 | 42.574 |
| 44123.14413194445 | 41.899 |
| 44123.18579861111 | 41.242 |
| 44123.227465277785 | 40.875 |
| 44123.26913194445 | 40.567 |
| 44123.31079861111 | 40.335 |
| 44123.352465277785 | 40.065 |
| 44123.39413194445 | 40.393 |
| 44123.43579861111 | 41.435 |
| 44123.477465277785 | 43.482 |
| 44123.51913194445 | 45.914 |
| 44123.56079861111 | 47.285 |
| 44123.602465277785 | 49.37 |
| 44123.64413194445 | 50.76 |
| 44123.68579861111 | 51.339 |
| 44123.727465277785 | 50.567 |
| 44123.76913194445 | 49.485 |
| 44123.81079861111 | 48.443 |
| 44123.852465277785 | 47.439 |
| 44123.89413194445 | 46.532 |
| 44123.93579861111 | 45.567 |
| 44123.977465277785 | 44.466 |
| 44124.01913194445 | 43.501 |
| 44124.06079861111 | 42.729 |
| 44124.102465277785 | 41.976 |
| 44124.14413194445 | 41.416 |
| 44124.18579861111 | 40.933 |
| 44124.227465277785 | 40.528 |
| 44124.26913194445 | 40.161 |
| 44124.31079861111 | 39.736 |
| 44124.352465277785 | 39.505 |
| 44124.39413194445 | 39.621 |
| 44124.43579861111 | 40.856 |
| 44124.477465277785 | 43.018 |
| 44124.51913194445 | 45.258 |
| 44124.56079861111 | 47.458 |
| 44124.602465277785 | 49.003 |
| 44124.64413194445 | 49.621 |
| 44124.68579861111 | 49.91 |
| 44124.727465277785 | 49.331 |
| 44124.76913194445 | 48.829 |
| 44124.81079861111 | 48.153 |
| 44124.852465277785 | 47.516 |
| 44124.89413194445 | 46.59 |
| 44124.93579861111 | 45.489 |
| 44124.977465277785 | 44.389 |
| 44125.01913194445 | 43.501 |
| 44125.06079861111 | 42.516 |
| 44125.102465277785 | 41.763 |
| 44125.14413194445 | 41.146 |
| 44125.18579861111 | 40.605 |
| 44125.227465277785 | 40.045 |
| 44125.26913194445 | 39.582 |
| 44125.31079861111 | 39.254 |
| 44125.352465277785 | 38.983 |
| 44125.39413194445 | 38.848 |
| 44125.43579861111 | 40.161 |
| 44125.477465277785 | 42.4 |
| 44125.51913194445 | 44.929 |
| 44125.56079861111 | 47.053 |
| 44125.602465277785 | 48.752 |
| 44125.64413194445 | 49.775 |
| 44125.68579861111 | 50.026 |
| 44125.727465277785 | 49.312 |
| 44125.76913194445 | 48.559 |
| 44125.81079861111 | 47.922 |
| 44125.852465277785 | 47.072 |
| 44125.89413194445 | 45.972 |
| 44125.93579861111 | 44.852 |
| 44125.977465277785 | 43.733 |
| 44126.01913194445 | 42.806 |
| 44126.06079861111 | 41.821 |
| 44126.102465277785 | 41.088 |
| 44126.14413194445 | 40.509 |
| 44126.18579861111 | 40.026 |
| 44126.227465277785 | 39.659 |
| 44126.26913194445 | 39.37 |
| 44126.31079861111 | 38.906 |
| 44126.352465277785 | 38.752 |
| 44126.39413194445 | 38.79 |
| 44126.43579861111 | 40.026 |
| 44126.477465277785 | 41.821 |
| 44126.51913194445 | 44.582 |
| 44126.56079861111 | 46.976 |
| 44126.602465277785 | 48.81 |
| 44126.64413194445 | 49.736 |
| 44126.68579861111 | 49.64 |
| 44126.727465277785 | 48.733 |
| 44126.76913194445 | 47.941 |
| 44126.81079861111 | 47.265 |
| 44126.852465277785 | 46.223 |
| 44126.89413194445 | 44.891 |
| 44126.93579861111 | 43.675 |
| 44126.977465277785 | 42.613 |
| 44127.01913194445 | 41.667 |
| 44127.06079861111 | 40.74 |
| 44127.102465277785 | 39.794 |
| 44127.14413194445 | 39.08 |
| 44127.18579861111 | 38.482 |
| 44127.227465277785 | 37.941 |
| 44127.26913194445 | 37.458 |
| 44127.31079861111 | 37.072 |
| 44127.352465277785 | 36.918 |
| 44127.39413194445 | 37.265 |
| 44127.43579861111 | 38.038 |
| 44127.477465277785 | 39.678 |
| 44127.51913194445 | 41.609 |
| 44127.56079861111 | 43.424 |
| 44127.602465277785 | 44.679 |
| 44127.64413194445 | 45.354 |
| 44127.68579861111 | 45.586 |
| 44127.727465277785 | 45.74 |
| 44127.76913194445 | 45.258 |
| 44127.81079861111 | 44.794 |
| 44127.852465277785 | 44.37 |
| 44127.89413194445 | 43.926 |
| 44127.93579861111 | 43.289 |
| 44127.977465277785 | 42.709 |
| 44128.01913194445 | 41.995 |
| 44128.06079861111 | 41.377 |
| 44128.102465277785 | 40.856 |
| 44128.14413194445 | 40.644 |
| 44128.18579861111 | 40.451 |
| 44128.227465277785 | 40.277 |
| 44128.26913194445 | 40.065 |
| 44128.31079861111 | 39.814 |
| 44128.352465277785 | 39.698 |
| 44128.39413194445 | 39.852 |
| 44128.43579861111 | 40.779 |
| 44128.477465277785 | 42.709 |
| 44128.51913194445 | 44.987 |
| 44128.56079861111 | 46.513 |
| 44128.602465277785 | 47.265 |
| 44128.64413194445 | 47.285 |
| 44128.68579861111 | 47.13 |
| 44128.727465277785 | 46.957 |
| 44128.76913194445 | 46.628 |
| 44128.81079861111 | 46.184 |
| 44128.852465277785 | 45.567 |
| 44128.89413194445 | 44.698 |
| 44128.93579861111 | 44.022 |
| 44128.977465277785 | 43.308 |
| 44129.01913194445 | 42.864 |
| 44129.06079861111 | 42.613 |
| 44129.102465277785 | 42.381 |
| 44129.14413194445 | 42.227 |
| 44129.18579861111 | 42.053 |
| 44129.227465277785 | 41.879 |
| 44129.26913194445 | 41.783 |
| 44129.31079861111 | 41.763 |
| 44129.352465277785 | 41.725 |
| 44129.39413194445 | 41.86 |
| 44129.43579861111 | 42.227 |
| 44129.477465277785 | 42.98 |
| 44129.51913194445 | 43.269 |
| 44129.56079861111 | 42.188 |
| 44129.602465277785 | 41.706 |
| 44129.64413194445 | 41.3 |
| 44129.68579861111 | 39.485 |
| 44129.727465277785 | 37.922 |
| 44129.76913194445 | 36.03 |
| 44129.81079861111 | 34.814 |
| 44129.852465277785 | 34.196 |
| 44129.89413194445 | 33.713 |
| 44129.93579861111 | 33.424 |
| 44129.977465277785 | 33.018 |
| 44130.01913194445 | 32.96 |
| 44130.06079861111 | 32.922 |
| 44130.102465277785 | 33.037 |
| 44130.14413194445 | 32.864 |
| 44130.18579861111 | 32.825 |
| 44130.227465277785 | 32.709 |
| 44130.26913194445 | 32.574 |
| 44130.31079861111 | 32.381 |
| 44130.352465277785 | 32.014 |
| 44130.39413194445 | 32.014 |
| 44130.43579861111 | 32.4 |
| 44130.477465277785 | 33.115 |
| 44130.51913194445 | 34.061 |
| 44130.56079861111 | 35.798 |
| 44130.602465277785 | 37.014 |
| 44130.64413194445 | 37.729 |
| 44130.68579861111 | 37.381 |
| 44130.727465277785 | 37.207 |
| 44130.76913194445 | 36.995 |
| 44130.81079861111 | 36.763 |
| 44130.852465277785 | 36.01 |
| 44130.89413194445 | 35.373 |
| 44130.93579861111 | 34.678 |
| 44130.977465277785 | 33.926 |
| 44131.01913194445 | 33.404 |
| 44131.06079861111 | 32.902 |
| 44131.102465277785 | 32.536 |
| 44131.14413194445 | 32.362 |
| 44131.18579861111 | 32.304 |
| 44131.227465277785 | 32.13 |
| 44131.26913194445 | 32.034 |
| 44131.31079861111 | 31.995 |
| 44131.352465277785 | 31.956 |
| 44131.39413194445 | 31.995 |
| 44131.43579861111 | 32.825 |
| 44131.477465277785 | 34.736 |
| 44131.51913194445 | 36.705 |
| 44131.56079861111 | 38.675 |
| 44131.602465277785 | 40.2 |
| 44131.64413194445 | 40.914 |
| 44131.68579861111 | 40.605 |
| 44131.727465277785 | 39.717 |
| 44131.76913194445 | 38.926 |
| 44131.81079861111 | 38.288 |
| 44131.852465277785 | 37.922 |
| 44131.89413194445 | 37.092 |
| 44131.93579861111 | 36.146 |
| 44131.977465277785 | 35.431 |
| 44132.01913194445 | 34.814 |
| 44132.06079861111 | 34.292 |
| 44132.102465277785 | 33.829 |
| 44132.14413194445 | 33.655 |
| 44132.18579861111 | 33.482 |
| 44132.227465277785 | 33.288 |
| 44132.26913194445 | 33.288 |
| 44132.31079861111 | 33.231 |
| 44132.352465277785 | 33.346 |
| 44132.39413194445 | 33.327 |
| 44132.43579861111 | 34.485 |
| 44132.477465277785 | 36.667 |
| 44132.51913194445 | 38.906 |
| 44132.56079861111 | 40.682 |
| 44132.602465277785 | 42.053 |
| 44132.64413194445 | 42.787 |
| 44132.68579861111 | 42.69 |
| 44132.727465277785 | 41.976 |
| 44132.76913194445 | 41.628 |
| 44132.81079861111 | 41.088 |
| 44132.852465277785 | 40.509 |
| 44132.89413194445 | 39.775 |
| 44132.93579861111 | 38.868 |
| 44132.977465277785 | 38.095 |
| 44133.01913194445 | 37.381 |
| 44133.06079861111 | 36.783 |
| 44133.102465277785 | 36.377 |
| 44133.14413194445 | 35.972 |
| 44133.18579861111 | 35.644 |
| 44133.227465277785 | 35.412 |
| 44133.26913194445 | 35.18 |
| 44133.31079861111 | 35.045 |
| 44133.352465277785 | 35.045 |
| 44133.39413194445 | 35.258 |
| 44133.43579861111 | 36.57 |
| 44133.477465277785 | 38.539 |
| 44133.51913194445 | 40.624 |
| 44133.56079861111 | 42.806 |
| 44133.602465277785 | 44.466 |
| 44133.64413194445 | 45.296 |
| 44133.68579861111 | 45.142 |
| 44133.727465277785 | 44.312 |
| 44133.76913194445 | 43.655 |
| 44133.81079861111 | 43.057 |
| 44133.852465277785 | 42.188 |
| 44133.89413194445 | 41.165 |
| 44133.93579861111 | 40.18 |
| 44133.977465277785 | 39.254 |
| 44134.01913194445 | 38.404 |
| 44134.06079861111 | 37.69 |
| 44134.102465277785 | 37.207 |
| 44134.14413194445 | 36.841 |
| 44134.18579861111 | 36.455 |
| 44134.227465277785 | 36.126 |
| 44134.26913194445 | 35.914 |
| 44134.31079861111 | 35.74 |
| 44134.352465277785 | 35.566 |
| 44134.39413194445 | 35.721 |
| 44134.43579861111 | 36.918 |
| 44134.477465277785 | 38.926 |
| 44134.51913194445 | 41.358 |
| 44134.56079861111 | 43.404 |
| 44134.602465277785 | 44.852 |
| 44134.64413194445 | 45.702 |
| 44134.68579861111 | 45.528 |
| 44134.727465277785 | 44.64 |
| 44134.76913194445 | 44.08 |
| 44134.81079861111 | 43.346 |
| 44134.852465277785 | 42.4 |
| 44134.89413194445 | 41.377 |
| 44134.93579861111 | 40.335 |
| 44134.977465277785 | 39.447 |
| 44135.01913194445 | 38.675 |
| 44135.06079861111 | 38.038 |
| 44135.102465277785 | 37.478 |
| 44135.14413194445 | 37.072 |
| 44135.18579861111 | 36.783 |
| 44135.227465277785 | 36.512 |
| 44135.26913194445 | 36.261 |
| 44135.31079861111 | 36.126 |
| 44135.352465277785 | 35.933 |
| 44135.39413194445 | 36.184 |
| 44135.43579861111 | 37.381 |
| 44135.477465277785 | 39.37 |
| 44135.51913194445 | 41.3 |
| 44135.56079861111 | 43.289 |
| 44135.602465277785 | 44.814 |
| 44135.64413194445 | 45.528 |
| 44135.68579861111 | 45.296 |
| 44135.727465277785 | 44.505 |
| 44135.76913194445 | 43.926 |
| 44135.81079861111 | 43.289 |
| 44135.852465277785 | 42.4 |
| 44135.89413194445 | 41.397 |
| 44135.93579861111 | 40.431 |
| 44135.977465277785 | 39.505 |
| 44136.01913194445 | 38.694 |
| 44136.06079861111 | 38.018 |
| 44136.06079861111 | 37.536 |
| 44136.102465277785 | 37.034 |
| 44136.14413194445 | 36.648 |
| 44136.18579861111 | 36.339 |
| 44136.227465277785 | 36.01 |
| 44136.26913194445 | 35.779 |
| 44136.31079861111 | 35.605 |
| 44136.352465277785 | 35.74 |
| 44136.39413194445 | 36.899 |
| 44136.43579861111 | 38.887 |
| 44136.477465277785 | 41.281 |
| 44136.51913194445 | 43.404 |
| 44136.56079861111 | 44.91 |
| 44136.602465277785 | 45.721 |
| 44136.64413194445 | 45.586 |
| 44136.68579861111 | 44.872 |
| 44136.727465277785 | 44.331 |
| 44136.76913194445 | 43.655 |
| 44136.81079861111 | 42.709 |
| 44136.852465277785 | 41.667 |
| 44136.89413194445 | 40.702 |
| 44136.93579861111 | 39.794 |
| 44136.977465277785 | 39.099 |
| 44137.01913194445 | 38.404 |
| 44137.06079861111 | 37.864 |
| 44137.102465277785 | 37.439 |
| 44137.14413194445 | 37.111 |
| 44137.18579861111 | 36.725 |
| 44137.227465277785 | 36.551 |
| 44137.26913194445 | 36.339 |
| 44137.31079861111 | 36.165 |
| 44137.352465277785 | 36.319 |
| 44137.39413194445 | 37.381 |
| 44137.43579861111 | 39.428 |
| 44137.477465277785 | 41.744 |
| 44137.51913194445 | 43.733 |
| 44137.56079861111 | 45.296 |
| 44137.602465277785 | 46.03 |
| 44137.64413194445 | 45.895 |
| 44137.68579861111 | 45.219 |
| 44137.727465277785 | 44.64 |
| 44137.76913194445 | 44.041 |
| 44137.81079861111 | 43.153 |
| 44137.852465277785 | 42.13 |
| 44137.89413194445 | 41.223 |
| 44137.93579861111 | 40.258 |
| 44137.977465277785 | 39.485 |
| 44138.01913194445 | 38.848 |
| 44138.06079861111 | 38.462 |
| 44138.102465277785 | 38.018 |
| 44138.14413194445 | 37.748 |
| 44138.18579861111 | 37.458 |
| 44138.227465277785 | 37.246 |
| 44138.26913194445 | 37.13 |
| 44138.31079861111 | 37.072 |
| 44138.352465277785 | 37.285 |
| 44138.39413194445 | 38.346 |
| 44138.43579861111 | 40.142 |
| 44138.477465277785 | 41.261 |
| 44138.51913194445 | 42.671 |
| 44138.56079861111 | 43.868 |
| 44138.602465277785 | 44.003 |
| 44138.64413194445 | 44.273 |
| 44138.68579861111 | 44.292 |
| 44138.727465277785 | 44.08 |
| 44138.76913194445 | 43.733 |
| 44138.81079861111 | 43.057 |
| 44138.852465277785 | 42.265 |
| 44138.89413194445 | 41.435 |
| 44138.93579861111 | 40.644 |
| 44138.977465277785 | 39.891 |
| 44139.01913194445 | 39.292 |
| 44139.06079861111 | 38.733 |
| 44139.102465277785 | 38.327 |
| 44139.14413194445 | 37.98 |
| 44139.18579861111 | 37.729 |
| 44139.227465277785 | 37.478 |
| 44139.26913194445 | 37.265 |
| 44139.31079861111 | 37.13 |
| 44139.352465277785 | 37.246 |
| 44139.39413194445 | 38.424 |
| 44139.43579861111 | 40.238 |
| 44139.477465277785 | 42.439 |
| 44139.51913194445 | 44.466 |
| 44139.56079861111 | 46.165 |
| 44139.602465277785 | 46.744 |
| 44139.64413194445 | 46.397 |
| 44139.68579861111 | 45.721 |
| 44139.727465277785 | 45.258 |
| 44139.76913194445 | 44.679 |
| 44139.81079861111 | 43.848 |
| 44139.852465277785 | 42.806 |
| 44139.89413194445 | 41.821 |
| 44139.93579861111 | 40.953 |
| 44139.977465277785 | 40.2 |
| 44140.01913194445 | 39.621 |
| 44140.06079861111 | 39.177 |
| 44140.102465277785 | 38.713 |
| 44140.14413194445 | 38.327 |
| 44140.18579861111 | 38.115 |
| 44140.227465277785 | 37.825 |
| 44140.26913194445 | 37.632 |
| 44140.31079861111 | 37.458 |
| 44140.352465277785 | 37.536 |
| 44140.39413194445 | 38.424 |
| 44140.43579861111 | 40.2 |
| 44140.477465277785 | 42.42 |
| 44140.51913194445 | 44.428 |
| 44140.56079861111 | 45.914 |
| 44140.602465277785 | 46.648 |
| 44140.64413194445 | 46.551 |
| 44140.68579861111 | 45.798 |
| 44140.727465277785 | 45.335 |
| 44140.76913194445 | 44.621 |
| 44140.81079861111 | 43.771 |
| 44140.852465277785 | 42.729 |
| 44140.89413194445 | 41.725 |
| 44140.93579861111 | 40.837 |
| 44140.977465277785 | 40.045 |
| 44141.01913194445 | 39.428 |
| 44141.06079861111 | 38.906 |
| 44141.102465277785 | 38.385 |
| 44141.14413194445 | 38.134 |
| 44141.18579861111 | 37.806 |
| 44141.227465277785 | 37.458 |
| 44141.26913194445 | 37.246 |
| 44141.31079861111 | 37.169 |
| 44141.352465277785 | 37.285 |
| 44141.39413194445 | 38.115 |
| 44141.43579861111 | 39.621 |
| 44141.477465277785 | 41.339 |
| 44141.51913194445 | 42.536 |
| 44141.56079861111 | 43.153 |
| 44141.602465277785 | 43.694 |
| 44141.64413194445 | 43.887 |
| 44141.68579861111 | 43.964 |
| 44141.727465277785 | 43.733 |
| 44141.76913194445 | 43.404 |
| 44141.81079861111 | 42.787 |
| 44141.852465277785 | 42.265 |
| 44141.89413194445 | 41.686 |
| 44141.93579861111 | 41.049 |
| 44141.977465277785 | 40.489 |
| 44142.01913194445 | 40.161 |
| 44142.06079861111 | 39.794 |
| 44142.102465277785 | 39.485 |
| 44142.14413194445 | 39.215 |
| 44142.18579861111 | 39.003 |
| 44142.227465277785 | 38.713 |
| 44142.26913194445 | 38.578 |
| 44142.31079861111 | 38.385 |
| 44142.352465277785 | 38.559 |
| 44142.39413194445 | 39.505 |
| 44142.43579861111 | 41.493 |
| 44142.477465277785 | 42.69 |
| 44142.51913194445 | 43.269 |
| 44142.56079861111 | 43.501 |
| 44142.602465277785 | 43.868 |
| 44142.64413194445 | 44.543 |
| 44142.68579861111 | 44.428 |
| 44142.727465277785 | 44.138 |
| 44142.76913194445 | 43.713 |
| 44142.81079861111 | 43.308 |
| 44142.852465277785 | 42.922 |
| 44142.89413194445 | 42.42 |
| 44142.93579861111 | 42.111 |
| 44142.977465277785 | 41.821 |
| 44143.01913194445 | 41.474 |
| 44143.06079861111 | 41.319 |
| 44143.102465277785 | 40.914 |
| 44143.14413194445 | 39.987 |
| 44143.18579861111 | 39.505 |
| 44143.227465277785 | 39.35 |
| 44143.26913194445 | 38.887 |
| 44143.31079861111 | 38.578 |
| 44143.352465277785 | 38.675 |
| 44143.39413194445 | 38.964 |
| 44143.43579861111 | 39.756 |
| 44143.477465277785 | 41.416 |
| 44143.51913194445 | 43.269 |
| 44143.56079861111 | 44.582 |
| 44143.602465277785 | 44.872 |
| 44143.64413194445 | 44.061 |
| 44143.68579861111 | 43.385 |
| 44143.727465277785 | 42.999 |
| 44143.76913194445 | 42.555 |
| 44143.81079861111 | 41.744 |
| 44143.852465277785 | 41.049 |
| 44143.89413194445 | 40.277 |
| 44143.93579861111 | 39.814 |
| 44143.977465277785 | 39.08 |
| 44144.01913194445 | 38.288 |
| 44144.06079861111 | 38.018 |
| 44144.102465277785 | 37.536 |
| 44144.14413194445 | 37.381 |
| 44144.18579861111 | 37.169 |
| 44144.227465277785 | 36.956 |
| 44144.26913194445 | 36.841 |
| 44144.31079861111 | 36.705 |
| 44144.352465277785 | 36.879 |
| 44144.39413194445 | 37.149 |
| 44144.43579861111 | 37.594 |
| 44144.477465277785 | 38.694 |
| 44144.51913194445 | 40.045 |
| 44144.56079861111 | 39.987 |
| 44144.602465277785 | 39.987 |
| 44144.64413194445 | 39.601 |
| 44144.68579861111 | 39.485 |
| 44144.727465277785 | 39.177 |
| 44144.76913194445 | 38.675 |
| 44144.81079861111 | 38.173 |
| 44144.852465277785 | 37.767 |
| 44144.89413194445 | 37.188 |
| 44144.93579861111 | 36.763 |
| 44144.977465277785 | 36.59 |
| 44145.01913194445 | 36.397 |
| 44145.06079861111 | 36.204 |
| 44145.102465277785 | 36.165 |
| 44145.14413194445 | 36.01 |
| 44145.18579861111 | 35.914 |
| 44145.227465277785 | 35.721 |
| 44145.26913194445 | 35.605 |
| 44145.31079861111 | 35.354 |
| 44145.352465277785 | 35.47 |
| 44145.39413194445 | 36.088 |
| 44145.43579861111 | 36.879 |
| 44145.477465277785 | 38.829 |
| 44145.51913194445 | 40.258 |
| 44145.56079861111 | 41.088 |
| 44145.602465277785 | 41.455 |
| 44145.64413194445 | 41.049 |
| 44145.68579861111 | 40.084 |
| 44145.727465277785 | 39.485 |
| 44145.76913194445 | 39.003 |
| 44145.81079861111 | 38.424 |
| 44145.852465277785 | 37.632 |
| 44145.89413194445 | 36.783 |
| 44145.93579861111 | 36.204 |
| 44145.977465277785 | 35.682 |
| 44146.01913194445 | 35.103 |
| 44146.06079861111 | 34.601 |
| 44146.102465277785 | 34.234 |
| 44146.14413194445 | 33.926 |
| 44146.18579861111 | 33.597 |
| 44146.227465277785 | 33.288 |
| 44146.26913194445 | 33.134 |
| 44146.31079861111 | 33.057 |
| 44146.352465277785 | 33.115 |
| 44146.39413194445 | 33.964 |
| 44146.43579861111 | 35.644 |
| 44146.477465277785 | 37.825 |
| 44146.51913194445 | 39.794 |
| 44146.56079861111 | 41.088 |
| 44146.602465277785 | 41.59 |
| 44146.64413194445 | 41.184 |
| 44146.68579861111 | 40.258 |
| 44146.727465277785 | 39.756 |
| 44146.76913194445 | 39.254 |
| 44146.81079861111 | 38.675 |
| 44146.852465277785 | 37.941 |
| 44146.89413194445 | 37.227 |
| 44146.93579861111 | 36.744 |
| 44146.977465277785 | 36.242 |
| 44147.01913194445 | 36.01 |
| 44147.06079861111 | 35.798 |
| 44147.102465277785 | 35.682 |
| 44147.14413194445 | 35.547 |
| 44147.18579861111 | 35.373 |
| 44147.227465277785 | 34.582 |
| 44147.26913194445 | 34.601 |
| 44147.31079861111 | 34.447 |
| 44147.352465277785 | 34.678 |
| 44147.39413194445 | 35.161 |
| 44147.43579861111 | 36.57 |
| 44147.477465277785 | 38.018 |
| 44147.51913194445 | 39.331 |
| 44147.56079861111 | 40.76 |
| 44147.602465277785 | 41.146 |
| 44147.64413194445 | 40.605 |
| 44147.68579861111 | 39.756 |
| 44147.727465277785 | 39.273 |
| 44147.76913194445 | 38.655 |
| 44147.81079861111 | 37.864 |
| 44147.852465277785 | 36.841 |
| 44147.89413194445 | 35.875 |
| 44147.93579861111 | 35.103 |
| 44147.977465277785 | 34.35 |
| 44148.01913194445 | 33.79 |
| 44148.06079861111 | 33.366 |
| 44148.102465277785 | 33.018 |
| 44148.14413194445 | 32.729 |
| 44148.18579861111 | 32.574 |
| 44148.227465277785 | 32.4 |
| 44148.26913194445 | 32.188 |
| 44148.31079861111 | 32.188 |
| 44148.352465277785 | 32.4 |
| 44148.39413194445 | 33.366 |
| 44148.43579861111 | 35.065 |
| 44148.477465277785 | 36.956 |
| 44148.51913194445 | 39.003 |
| 44148.56079861111 | 40.161 |
| 44148.602465277785 | 41.3 |
| 44148.64413194445 | 41.339 |
| 44148.68579861111 | 40.663 |
| 44148.727465277785 | 40.489 |
| 44148.76913194445 | 40.316 |
| 44148.81079861111 | 39.814 |
| 44148.852465277785 | 39.157 |
| 44148.89413194445 | 38.404 |
| 44148.93579861111 | 37.864 |
| 44148.977465277785 | 37.651 |
| 44149.01913194445 | 37.343 |
| 44149.06079861111 | 37.188 |
| 44149.102465277785 | 37.188 |
| 44149.14413194445 | 37.285 |
| 44149.18579861111 | 37.323 |
| 44149.227465277785 | 37.246 |
| 44149.26913194445 | 37.014 |
| 44149.31079861111 | 36.204 |
| 44149.352465277785 | 34.987 |
| 44149.39413194445 | 33.694 |
| 44149.43579861111 | 33.732 |
| 44149.477465277785 | 33.173 |
| 44149.51913194445 | 33.443 |
| 44149.56079861111 | 33.906 |
| 44149.602465277785 | 34.119 |
| 44149.64413194445 | 33.52 |
| 44149.68579861111 | 32.593 |
| 44149.727465277785 | 32.323 |
| 44149.76913194445 | 32.246 |
| 44149.81079861111 | 32.092 |
| 44149.852465277785 | 31.956 |
| 44149.89413194445 | 31.976 |
| 44149.93579861111 | 31.995 |
| 44149.977465277785 | 31.956 |
| 44150.01913194445 | 31.956 |
| 44150.06079861111 | 31.995 |
| 44150.102465277785 | 31.976 |
| 44150.14413194445 | 31.995 |
| 44150.18579861111 | 32.034 |
| 44150.227465277785 | 32.304 |
| 44150.26913194445 | 32.497 |
| 44150.31079861111 | 32.767 |
| 44150.352465277785 | 33.211 |
| 44150.39413194445 | 34.061 |
| 44150.43579861111 | 35.026 |
| 44150.477465277785 | 36.107 |
| 44150.51913194445 | 37.227 |
| 44150.56079861111 | 38.501 |
| 44150.602465277785 | 39.949 |
| 44150.64413194445 | 40.721 |
| 44150.68579861111 | 41.126 |
| 44150.727465277785 | 40.914 |
| 44150.76913194445 | 40.914 |
| 44150.81079861111 | 40.721 |
| 44150.852465277785 | 40.354 |
| 44150.89413194445 | 39.833 |
| 44150.93579861111 | 39.312 |
| 44150.977465277785 | 38.829 |
| 44151.01913194445 | 38.52 |
| 44151.06079861111 | 38.153 |
| 44151.102465277785 | 37.999 |
| 44151.14413194445 | 37.806 |
| 44151.18579861111 | 37.709 |
| 44151.227465277785 | 37.671 |
| 44151.26913194445 | 37.632 |
| 44151.31079861111 | 37.651 |
| 44151.352465277785 | 37.709 |
| 44151.39413194445 | 38.25 |
| 44151.43579861111 | 39.505 |
| 44151.477465277785 | 41.146 |
| 44151.51913194445 | 42.709 |
| 44151.56079861111 | 43.829 |
| 44151.602465277785 | 44.138 |
| 44151.64413194445 | 43.655 |
| 44151.68579861111 | 42.96 |
| 44151.727465277785 | 42.536 |
| 44151.76913194445 | 41.976 |
| 44151.81079861111 | 41.146 |
| 44151.852465277785 | 40.238 |
| 44151.89413194445 | 39.312 |
| 44151.93579861111 | 38.462 |
| 44151.977465277785 | 37.69 |
| 44152.01913194445 | 37.13 |
| 44152.06079861111 | 36.628 |
| 44152.102465277785 | 36.204 |
| 44152.14413194445 | 35.837 |
| 44152.18579861111 | 35.489 |
| 44152.227465277785 | 35.277 |
| 44152.26913194445 | 35.161 |
| 44152.31079861111 | 34.987 |
| 44152.352465277785 | 35.122 |
| 44152.39413194445 | 35.895 |
| 44152.43579861111 | 37.478 |
| 44152.477465277785 | 39.582 |
| 44152.51913194445 | 41.435 |
| 44152.56079861111 | 42.902 |
| 44152.602465277785 | 43.501 |
| 44152.64413194445 | 43.173 |
| 44152.68579861111 | 42.478 |
| 44152.727465277785 | 42.111 |
| 44152.76913194445 | 41.532 |
| 44152.81079861111 | 40.875 |
| 44152.852465277785 | 40.103 |
| 44152.89413194445 | 39.389 |
| 44152.93579861111 | 38.617 |
| 44152.977465277785 | 37.98 |
| 44153.01913194445 | 37.42 |
| 44153.06079861111 | 37.053 |
| 44153.102465277785 | 36.763 |
| 44153.14413194445 | 36.59 |
| 44153.18579861111 | 36.455 |
| 44153.227465277785 | 36.435 |
| 44153.26913194445 | 36.3 |
| 44153.31079861111 | 36.242 |
| 44153.352465277785 | 36.532 |
| 44153.39413194445 | 36.956 |
| 44153.43579861111 | 38.076 |
| 44153.477465277785 | 39.736 |
| 44153.51913194445 | 41.802 |
| 44153.56079861111 | 43.231 |
| 44153.602465277785 | 43.733 |
| 44153.64413194445 | 43.269 |
| 44153.68579861111 | 42.922 |
| 44153.727465277785 | 42.478 |
| 44153.76913194445 | 42.053 |
| 44153.81079861111 | 41.455 |
| 44153.852465277785 | 40.817 |
| 44153.89413194445 | 39.987 |
| 44153.93579861111 | 39.312 |
| 44153.977465277785 | 38.675 |
| 44154.01913194445 | 38.192 |
| 44154.06079861111 | 37.941 |
| 44154.102465277785 | 37.651 |
| 44154.14413194445 | 37.555 |
| 44154.18579861111 | 37.555 |
| 44154.227465277785 | 37.555 |
| 44154.26913194445 | 37.555 |
| 44154.31079861111 | 37.632 |
| 44154.352465277785 | 37.748 |
| 44154.39413194445 | 38.52 |
| 44154.43579861111 | 39.794 |
| 44154.477465277785 | 41.551 |
| 44154.51913194445 | 42.98 |
| 44154.56079861111 | 43.984 |
| 44154.602465277785 | 44.196 |
| 44154.64413194445 | 43.501 |
| 44154.68579861111 | 42.536 |
| 44154.727465277785 | 42.15 |
| 44154.76913194445 | 41.667 |
| 44154.81079861111 | 41.011 |
| 44154.852465277785 | 40.103 |
| 44154.89413194445 | 39.215 |
| 44154.93579861111 | 38.424 |
| 44154.977465277785 | 37.69 |
| 44155.01913194445 | 37.111 |
| 44155.06079861111 | 36.628 |
| 44155.102465277785 | 36.184 |
| 44155.14413194445 | 36.01 |
| 44155.18579861111 | 35.914 |
| 44155.227465277785 | 35.914 |
| 44155.26913194445 | 35.953 |
| 44155.31079861111 | 35.817 |
| 44155.352465277785 | 35.991 |
| 44155.39413194445 | 36.686 |
| 44155.43579861111 | 37.941 |
| 44155.477465277785 | 39.794 |
| 44155.51913194445 | 41.416 |
| 44155.56079861111 | 42.169 |
| 44155.602465277785 | 42.15 |
| 44155.64413194445 | 42.207 |
| 44155.68579861111 | 42.207 |
| 44155.727465277785 | 42.072 |
| 44155.76913194445 | 41.628 |
| 44155.81079861111 | 41.088 |
| 44155.852465277785 | 40.431 |
| 44155.89413194445 | 39.717 |
| 44155.93579861111 | 39.08 |
| 44155.977465277785 | 38.52 |
| 44156.01913194445 | 38.153 |
| 44156.06079861111 | 37.864 |
| 44156.102465277785 | 37.748 |
| 44156.14413194445 | 37.651 |
| 44156.18579861111 | 37.594 |
| 44156.227465277785 | 37.651 |
| 44156.26913194445 | 37.729 |
| 44156.31079861111 | 37.844 |
| 44156.352465277785 | 37.96 |
| 44156.39413194445 | 38.366 |
| 44156.43579861111 | 38.81 |
| 44156.477465277785 | 39.254 |
| 44156.51913194445 | 40.721 |
| 44156.56079861111 | 41.937 |
| 44156.602465277785 | 43.424 |
| 44156.64413194445 | 43.289 |
| 44156.68579861111 | 42.285 |
| 44156.727465277785 | 41.821 |
| 44156.76913194445 | 41.184 |
| 44156.81079861111 | 40.373 |
| 44156.852465277785 | 39.428 |
| 44156.89413194445 | 38.443 |
| 44156.93579861111 | 37.42 |
| 44156.977465277785 | 36.648 |
| 44157.01913194445 | 35.953 |
| 44157.06079861111 | 35.412 |
| 44157.102465277785 | 34.852 |
| 44157.14413194445 | 34.273 |
| 44157.18579861111 | 33.887 |
| 44157.227465277785 | 33.578 |
| 44157.26913194445 | 33.211 |
| 44157.31079861111 | 32.864 |
| 44157.352465277785 | 32.748 |
| 44157.39413194445 | 33.134 |
| 44157.43579861111 | 34.621 |
| 44157.477465277785 | 36.725 |
| 44157.51913194445 | 38.52 |
| 44157.56079861111 | 39.717 |
| 44157.602465277785 | 40.084 |
| 44157.64413194445 | 39.678 |
| 44157.68579861111 | 39.447 |
| 44157.727465277785 | 39.196 |
| 44157.76913194445 | 39.003 |
| 44157.81079861111 | 38.655 |
| 44157.852465277785 | 38.25 |
| 44157.89413194445 | 37.902 |
| 44157.93579861111 | 37.709 |
| 44157.977465277785 | 37.632 |
| 44158.01913194445 | 37.439 |
| 44158.06079861111 | 37.111 |
| 44158.102465277785 | 36.937 |
| 44158.14413194445 | 36.821 |
| 44158.18579861111 | 36.841 |
| 44158.227465277785 | 36.744 |
| 44158.26913194445 | 36.744 |
| 44158.31079861111 | 36.763 |
| 44158.352465277785 | 36.879 |
| 44158.39413194445 | 37.478 |
| 44158.43579861111 | 38.655 |
| 44158.477465277785 | 40.277 |
| 44158.51913194445 | 41.995 |
| 44158.56079861111 | 42.825 |
| 44158.602465277785 | 42.902 |
| 44158.64413194445 | 42.4 |
| 44158.68579861111 | 42.014 |
| 44158.727465277785 | 41.706 |
| 44158.76913194445 | 41.339 |
| 44158.81079861111 | 40.953 |
| 44158.852465277785 | 40.219 |
| 44158.89413194445 | 39.447 |
| 44158.93579861111 | 38.829 |
| 44158.977465277785 | 38.346 |
| 44159.01913194445 | 38.115 |
| 44159.06079861111 | 37.941 |
| 44159.102465277785 | 37.439 |
| 44159.14413194445 | 36.59 |
| 44159.18579861111 | 35.547 |
| 44159.227465277785 | 34.582 |
| 44159.26913194445 | 34.08 |
| 44159.31079861111 | 33.945 |
| 44159.352465277785 | 33.597 |
| 44159.39413194445 | 33.539 |
| 44159.43579861111 | 33.926 |
| 44159.477465277785 | 35.528 |
| 44159.51913194445 | 36.956 |
| 44159.56079861111 | 38.327 |
| 44159.602465277785 | 38.424 |
| 44159.64413194445 | 38.192 |
| 44159.68579861111 | 37.864 |
| 44159.727465277785 | 37.497 |
| 44159.76913194445 | 37.343 |
| 44159.81079861111 | 36.918 |
| 44159.852465277785 | 36.493 |
| 44159.89413194445 | 36.03 |
| 44159.93579861111 | 35.566 |
| 44159.977465277785 | 35.045 |
| 44160.01913194445 | 34.563 |
| 44160.06079861111 | 34.061 |
| 44160.102465277785 | 33.52 |
| 44160.14413194445 | 33.095 |
| 44160.18579861111 | 32.651 |
| 44160.227465277785 | 32.285 |
| 44160.26913194445 | 32.053 |
| 44160.31079861111 | 31.956 |
| 44160.352465277785 | 31.976 |
| 44160.39413194445 | 32.034 |
| 44160.43579861111 | 33.52 |
| 44160.477465277785 | 35.354 |
| 44160.51913194445 | 37.207 |
| 44160.56079861111 | 38.539 |
| 44160.602465277785 | 39.273 |
| 44160.64413194445 | 39.119 |
| 44160.68579861111 | 38.694 |
| 44160.727465277785 | 38.404 |
| 44160.76913194445 | 38.018 |
| 44160.81079861111 | 37.4 |
| 44160.852465277785 | 36.57 |
| 44160.89413194445 | 35.74 |
| 44160.93579861111 | 35.007 |
| 44160.977465277785 | 34.312 |
| 44161.01913194445 | 33.771 |
| 44161.06079861111 | 33.288 |
| 44161.102465277785 | 32.96 |
| 44161.14413194445 | 32.69 |
| 44161.18579861111 | 32.497 |
| 44161.227465277785 | 32.323 |
| 44161.26913194445 | 32.149 |
| 44161.31079861111 | 32.072 |
| 44161.352465277785 | 32.323 |
| 44161.39413194445 | 33.018 |
| 44161.43579861111 | 33.983 |
| 44161.477465277785 | 35.624 |
| 44161.51913194445 | 36.899 |
| 44161.56079861111 | 37.767 |
| 44161.602465277785 | 38.134 |
| 44161.64413194445 | 37.709 |
| 44161.68579861111 | 37.536 |
| 44161.727465277785 | 37.304 |
| 44161.76913194445 | 36.956 |
| 44161.81079861111 | 36.455 |
| 44161.852465277785 | 35.779 |
| 44161.89413194445 | 35.335 |
| 44161.93579861111 | 34.736 |
| 44161.977465277785 | 34.234 |
| 44162.01913194445 | 33.732 |
| 44162.06079861111 | 33.404 |
| 44162.102465277785 | 32.999 |
| 44162.14413194445 | 32.709 |
| 44162.18579861111 | 32.458 |
| 44162.227465277785 | 32.227 |
| 44162.26913194445 | 32.014 |
| 44162.31079861111 | 31.937 |
| 44162.352465277785 | 31.976 |
| 44162.39413194445 | 31.976 |
| 44162.43579861111 | 32.729 |
| 44162.477465277785 | 34.64 |
| 44162.51913194445 | 36.126 |
| 44162.56079861111 | 37.188 |
| 44162.602465277785 | 37.748 |
| 44162.64413194445 | 37.439 |
| 44162.68579861111 | 36.976 |
| 44162.727465277785 | 36.744 |
| 44162.76913194445 | 36.358 |
| 44162.81079861111 | 35.624 |
| 44162.852465277785 | 34.794 |
| 44162.89413194445 | 34.022 |
| 44162.93579861111 | 33.404 |
| 44162.977465277785 | 32.883 |
| 44163.01913194445 | 32.323 |
| 44163.06079861111 | 31.995 |
| 44163.102465277785 | 31.937 |
| 44163.14413194445 | 31.976 |
| 44163.18579861111 | 31.976 |
| 44163.227465277785 | 32.014 |
| 44163.26913194445 | 31.976 |
| 44163.31079861111 | 31.976 |
| 44163.352465277785 | 31.976 |
| 44163.39413194445 | 32.014 |
| 44163.43579861111 | 31.995 |
| 44163.477465277785 | 32.285 |
| 44163.51913194445 | 35.315 |
| 44163.56079861111 | 36.956 |
| 44163.602465277785 | 37.825 |
| 44163.64413194445 | 37.594 |
| 44163.68579861111 | 37.207 |
| 44163.727465277785 | 37.072 |
| 44163.76913194445 | 36.725 |
| 44163.81079861111 | 36.165 |
| 44163.852465277785 | 35.489 |
| 44163.89413194445 | 34.698 |
| 44163.93579861111 | 33.983 |
| 44163.977465277785 | 33.385 |
| 44164.01913194445 | 32.806 |
| 44164.06079861111 | 32.362 |
| 44164.102465277785 | 32.072 |
| 44164.14413194445 | 31.956 |
| 44164.18579861111 | 31.976 |
| 44164.227465277785 | 31.995 |
| 44164.26913194445 | 31.956 |
| 44164.31079861111 | 31.976 |
| 44164.352465277785 | 31.976 |
| 44164.39413194445 | 32.014 |
| 44164.43579861111 | 32.014 |
| 44164.477465277785 | 33.037 |
| 44164.51913194445 | 35.528 |
| 44164.56079861111 | 37.053 |
| 44164.602465277785 | 37.651 |
| 44164.64413194445 | 37.42 |
| 44164.68579861111 | 36.937 |
| 44164.727465277785 | 36.705 |
| 44164.76913194445 | 36.204 |
| 44164.81079861111 | 35.47 |
| 44164.852465277785 | 34.621 |
| 44164.89413194445 | 33.771 |
| 44164.93579861111 | 33.095 |
| 44164.977465277785 | 32.478 |
| 44165.01913194445 | 32.072 |
| 44165.06079861111 | 31.956 |
| 44165.102465277785 | 31.956 |
| 44165.14413194445 | 31.956 |
| 44165.18579861111 | 32.014 |
| 44165.227465277785 | 31.995 |
| 44165.26913194445 | 31.956 |
| 44165.31079861111 | 31.976 |
| 44165.352465277785 | 31.976 |
| 44165.39413194445 | 31.976 |
| 44165.43579861111 | 32.014 |
| 44165.477465277785 | 32.014 |
| 44165.51913194445 | 32.323 |
| 44165.56079861111 | 34.814 |
| 44165.602465277785 | 36.088 |
| 44165.64413194445 | 36.397 |
| 44165.68579861111 | 36.184 |
| 44165.727465277785 | 36.184 |
| 44165.76913194445 | 35.856 |
| 44165.81079861111 | 35.258 |
| 44165.852465277785 | 34.543 |
| 44165.89413194445 | 33.81 |
| 44165.93579861111 | 33.153 |
| 44165.977465277785 | 32.671 |
| 44166.01913194445 | 32.362 |
| 44166.06079861111 | 32.207 |
| 44166.102465277785 | 32.111 |
| 44166.14413194445 | 32.053 |
| 44166.18579861111 | 32.034 |
| 44166.227465277785 | 32.13 |
| 44166.26913194445 | 32.188 |
| 44166.31079861111 | 32.169 |
| 44166.352465277785 | 32.246 |
| 44166.39413194445 | 32.632 |
| 44166.43579861111 | 33.617 |
| 44166.477465277785 | 34.987 |
| 44166.51913194445 | 35.972 |
| 44166.56079861111 | 36.744 |
| 44166.602465277785 | 36.744 |
| 44166.64413194445 | 36.493 |
| 44166.68579861111 | 36.01 |
| 44166.727465277785 | 35.682 |
| 44166.76913194445 | 35.373 |
| 44166.81079861111 | 34.949 |
| 44166.852465277785 | 34.389 |
| 44166.89413194445 | 33.906 |
| 44166.93579861111 | 33.482 |
| 44166.977465277785 | 33.211 |
| 44167.01913194445 | 32.941 |
| 44167.06079861111 | 32.806 |
| 44167.102465277785 | 32.632 |
| 44167.14413194445 | 32.497 |
| 44167.18579861111 | 32.381 |
| 44167.227465277785 | 32.227 |
| 44167.26913194445 | 32.072 |
| 44167.31079861111 | 31.956 |
| 44167.352465277785 | 32.014 |
| 44167.39413194445 | 31.995 |
| 44167.43579861111 | 32.188 |
| 44167.477465277785 | 33.346 |
| 44167.51913194445 | 34.543 |
| 44167.56079861111 | 35.335 |
| 44167.602465277785 | 35.509 |
| 44167.64413194445 | 35.103 |
| 44167.68579861111 | 34.524 |
| 44167.727465277785 | 34.176 |
| 44167.76913194445 | 33.732 |
| 44167.81079861111 | 33.153 |
| 44167.852465277785 | 32.42 |
| 44167.89413194445 | 31.976 |
| 44167.93579861111 | 31.995 |
| 44167.977465277785 | 31.976 |
| 44168.01913194445 | 31.976 |
| 44168.06079861111 | 31.995 |
| 44168.102465277785 | 31.956 |
| 44168.14413194445 | 31.976 |
| 44168.18579861111 | 31.976 |
| 44168.227465277785 | 31.995 |
| 44168.26913194445 | 31.976 |
| 44168.31079861111 | 31.976 |
| 44168.352465277785 | 31.995 |
| 44168.39413194445 | 31.976 |
| 44168.43579861111 | 31.995 |
| 44168.477465277785 | 32.034 |
| 44168.51913194445 | 32.053 |
| 44168.56079861111 | 32.111 |
| 44168.602465277785 | 32.227 |
| 44168.64413194445 | 32.593 |
| 44168.68579861111 | 33.173 |
| 44168.727465277785 | 33.52 |
| 44168.76913194445 | 33.597 |
| 44168.81079861111 | 33.482 |
| 44168.852465277785 | 33.076 |
| 44168.89413194445 | 32.574 |
| 44168.93579861111 | 32.111 |
| 44168.977465277785 | 31.956 |
| 44169.01913194445 | 31.995 |
| 44169.06079861111 | 31.976 |
| 44169.102465277785 | 31.976 |
| 44169.14413194445 | 31.995 |
| 44169.18579861111 | 31.976 |
| 44169.227465277785 | 31.956 |
| 44169.26913194445 | 31.995 |
| 44169.31079861111 | 31.976 |
| 44169.352465277785 | 32.014 |
| 44169.39413194445 | 31.976 |
| 44169.43579861111 | 32.014 |
| 44169.477465277785 | 31.995 |
| 44169.51913194445 | 32.053 |
| 44169.56079861111 | 33.037 |
| 44169.602465277785 | 34.968 |
| 44169.64413194445 | 35.412 |
| 44169.68579861111 | 35.431 |
| 44169.727465277785 | 35.605 |
| 44169.76913194445 | 35.547 |
| 44169.81079861111 | 35.161 |
| 44169.852465277785 | 34.524 |
| 44169.89413194445 | 33.906 |
| 44169.93579861111 | 33.424 |
| 44169.977465277785 | 32.941 |
| 44170.01913194445 | 32.555 |
| 44170.06079861111 | 32.227 |
| 44170.102465277785 | 31.995 |
| 44170.14413194445 | 31.956 |
| 44170.18579861111 | 31.995 |
| 44170.227465277785 | 32.014 |
| 44170.26913194445 | 31.976 |
| 44170.31079861111 | 31.976 |
| 44170.352465277785 | 31.995 |
| 44170.39413194445 | 32.014 |
| 44170.43579861111 | 31.995 |
| 44170.477465277785 | 32.092 |
| 44170.51913194445 | 34.64 |
| 44170.56079861111 | 36.435 |
| 44170.602465277785 | 37.072 |
| 44170.64413194445 | 36.918 |
| 44170.68579861111 | 36.551 |
| 44170.727465277785 | 36.512 |
| 44170.76913194445 | 36.339 |
| 44170.81079861111 | 35.817 |
| 44170.852465277785 | 35.045 |
| 44170.89413194445 | 34.292 |
| 44170.93579861111 | 33.655 |
| 44170.977465277785 | 33.037 |
| 44171.01913194445 | 32.613 |
| 44171.06079861111 | 32.343 |
| 44171.102465277785 | 31.995 |
| 44171.14413194445 | 31.976 |
| 44171.18579861111 | 31.976 |
| 44171.227465277785 | 31.956 |
| 44171.26913194445 | 31.937 |
| 44171.31079861111 | 31.956 |
| 44171.352465277785 | 31.976 |
| 44171.39413194445 | 31.995 |
| 44171.43579861111 | 31.995 |
| 44171.477465277785 | 32.053 |
| 44171.51913194445 | 34.485 |
| 44171.56079861111 | 36.204 |
| 44171.602465277785 | 37.111 |
| 44171.64413194445 | 37.092 |
| 44171.68579861111 | 36.705 |
| 44171.727465277785 | 36.59 |
| 44171.76913194445 | 36.358 |
| 44171.81079861111 | 35.798 |
| 44171.852465277785 | 35.065 |
| 44171.89413194445 | 34.292 |
| 44171.93579861111 | 33.694 |
| 44171.977465277785 | 33.076 |
| 44172.01913194445 | 32.574 |
| 44172.06079861111 | 32.246 |
| 44172.102465277785 | 31.937 |
| 44172.14413194445 | 31.956 |
| 44172.18579861111 | 31.976 |
| 44172.227465277785 | 31.995 |
| 44172.26913194445 | 31.976 |
| 44172.31079861111 | 31.995 |
| 44172.352465277785 | 31.956 |
| 44172.39413194445 | 31.956 |
| 44172.43579861111 | 31.995 |
| 44172.477465277785 | 32.034 |
| 44172.51913194445 | 34.485 |
| 44172.56079861111 | 36.049 |
| 44172.602465277785 | 36.879 |
| 44172.64413194445 | 36.725 |
| 44172.68579861111 | 36.319 |
| 44172.727465277785 | 36.088 |
| 44172.76913194445 | 35.895 |
| 44172.81079861111 | 35.412 |
| 44172.852465277785 | 34.756 |
| 44172.89413194445 | 34.061 |
| 44172.93579861111 | 33.385 |
| 44172.977465277785 | 32.709 |
| 44173.01913194445 | 32.304 |
| 44173.06079861111 | 32.014 |
| 44173.102465277785 | 31.956 |
| 44173.14413194445 | 31.956 |
| 44173.18579861111 | 31.995 |
| 44173.227465277785 | 31.995 |
| 44173.26913194445 | 32.014 |
| 44173.31079861111 | 31.995 |
| 44173.352465277785 | 31.956 |
| 44173.39413194445 | 31.976 |
| 44173.43579861111 | 31.995 |
| 44173.477465277785 | 31.995 |
| 44173.51913194445 | 32.536 |
| 44173.56079861111 | 35.103 |
| 44173.602465277785 | 36.223 |
| 44173.64413194445 | 36.358 |
| 44173.68579861111 | 36.01 |
| 44173.727465277785 | 35.875 |
| 44173.76913194445 | 35.74 |
| 44173.81079861111 | 35.258 |
| 44173.852465277785 | 34.582 |
| 44173.89413194445 | 33.81 |
| 44173.93579861111 | 33.192 |
| 44173.977465277785 | 32.593 |
| 44174.01913194445 | 32.092 |
| 44174.06079861111 | 31.976 |
| 44174.102465277785 | 31.956 |
| 44174.14413194445 | 31.956 |
| 44174.18579861111 | 31.956 |
| 44174.227465277785 | 31.995 |
| 44174.26913194445 | 31.956 |
| 44174.31079861111 | 31.995 |
| 44174.352465277785 | 31.976 |
| 44174.39413194445 | 32.014 |
| 44174.43579861111 | 32.034 |
| 44174.477465277785 | 32.014 |
| 44174.51913194445 | 32.092 |
| 44174.56079861111 | 33.288 |
| 44174.602465277785 | 35.238 |
| 44174.64413194445 | 35.933 |
| 44174.68579861111 | 36.03 |
| 44174.727465277785 | 36.068 |
| 44174.76913194445 | 35.837 |
| 44174.81079861111 | 35.451 |
| 44174.852465277785 | 34.794 |
| 44174.89413194445 | 34.157 |
| 44174.93579861111 | 33.559 |
| 44174.977465277785 | 32.98 |
| 44175.01913194445 | 32.478 |
| 44175.06079861111 | 32.188 |
| 44175.102465277785 | 31.918 |
| 44175.14413194445 | 31.956 |
| 44175.18579861111 | 31.956 |
| 44175.227465277785 | 31.937 |
| 44175.26913194445 | 31.937 |
| 44175.31079861111 | 31.976 |
| 44175.352465277785 | 32.014 |
| 44175.39413194445 | 32.014 |
| 44175.43579861111 | 32.169 |
| 44175.477465277785 | 33.366 |
| 44175.51913194445 | 34.582 |
| 44175.56079861111 | 35.238 |
| 44175.602465277785 | 35.547 |
| 44175.64413194445 | 35.76 |
| 44175.68579861111 | 35.953 |
| 44175.727465277785 | 35.933 |
| 44175.76913194445 | 35.856 |
| 44175.81079861111 | 35.702 |
| 44175.852465277785 | 35.489 |
| 44175.89413194445 | 35.258 |
| 44175.93579861111 | 34.756 |
| 44175.977465277785 | 34.35 |
| 44176.01913194445 | 34.196 |
| 44176.06079861111 | 34.138 |
| 44176.102465277785 | 34.041 |
| 44176.14413194445 | 33.983 |
| 44176.18579861111 | 33.983 |
| 44176.227465277785 | 33.868 |
| 44176.26913194445 | 33.771 |
| 44176.31079861111 | 33.81 |
| 44176.352465277785 | 33.771 |
| 44176.39413194445 | 33.79 |
| 44176.43579861111 | 34.119 |
| 44176.477465277785 | 34.794 |
| 44176.51913194445 | 34.833 |
| 44176.56079861111 | 34.678 |
| 44176.602465277785 | 34.543 |
| 44176.64413194445 | 34.408 |
| 44176.68579861111 | 34.254 |
| 44176.727465277785 | 34.08 |
| 44176.76913194445 | 33.848 |
| 44176.81079861111 | 33.501 |
| 44176.852465277785 | 33.192 |
| 44176.89413194445 | 32.883 |
| 44176.93579861111 | 32.767 |
| 44176.977465277785 | 32.671 |
| 44177.01913194445 | 32.593 |
| 44177.06079861111 | 32.478 |
| 44177.102465277785 | 32.092 |
| 44177.14413194445 | 31.995 |
| 44177.18579861111 | 31.995 |
| 44177.227465277785 | 31.956 |
| 44177.26913194445 | 31.976 |
| 44177.31079861111 | 31.995 |
| 44177.352465277785 | 31.995 |
| 44177.39413194445 | 31.976 |
| 44177.43579861111 | 32.034 |
| 44177.477465277785 | 32.014 |
| 44177.51913194445 | 32.188 |
| 44177.56079861111 | 33.81 |
| 44177.602465277785 | 34.176 |
| 44177.64413194445 | 34.563 |
| 44177.68579861111 | 34.543 |
| 44177.727465277785 | 34.331 |
| 44177.76913194445 | 34.003 |
| 44177.81079861111 | 33.424 |
| 44177.852465277785 | 32.806 |
| 44177.89413194445 | 32.227 |
| 44177.93579861111 | 31.995 |
| 44177.977465277785 | 31.976 |
| 44178.01913194445 | 31.995 |
| 44178.06079861111 | 32.014 |
| 44178.102465277785 | 31.995 |
| 44178.14413194445 | 32.014 |
| 44178.18579861111 | 31.995 |
| 44178.227465277785 | 31.995 |
| 44178.26913194445 | 31.976 |
| 44178.31079861111 | 31.976 |
| 44178.352465277785 | 31.976 |
| 44178.39413194445 | 31.976 |
| 44178.43579861111 | 31.956 |
| 44178.477465277785 | 31.995 |
| 44178.51913194445 | 32.072 |
| 44178.56079861111 | 32.169 |
| 44178.602465277785 | 32.246 |
| 44178.64413194445 | 32.362 |
| 44178.68579861111 | 32.555 |
| 44178.727465277785 | 32.729 |
| 44178.76913194445 | 32.613 |
| 44178.81079861111 | 32.304 |
| 44178.852465277785 | 31.976 |
| 44178.89413194445 | 31.995 |
| 44178.93579861111 | 31.995 |
| 44178.977465277785 | 31.956 |
| 44179.01913194445 | 31.956 |
| 44179.06079861111 | 31.995 |
| 44179.102465277785 | 31.976 |
| 44179.14413194445 | 31.976 |
| 44179.18579861111 | 31.995 |
| 44179.227465277785 | 32.014 |
| 44179.26913194445 | 31.995 |
| 44179.31079861111 | 31.956 |
| 44179.352465277785 | 31.976 |
| 44179.39413194445 | 31.995 |
| 44179.43579861111 | 32.014 |
| 44179.477465277785 | 32.014 |
| 44179.51913194445 | 32.014 |
| 44179.56079861111 | 32.034 |
| 44179.602465277785 | 32.169 |
| 44179.64413194445 | 33.018 |
| 44179.68579861111 | 33.308 |
| 44179.727465277785 | 33.597 |
| 44179.76913194445 | 33.655 |
| 44179.81079861111 | 33.52 |
| 44179.852465277785 | 33.269 |
| 44179.89413194445 | 32.98 |
| 44179.93579861111 | 32.574 |
| 44179.977465277785 | 32.4 |
| 44180.01913194445 | 32.207 |
| 44180.06079861111 | 32.014 |
| 44180.102465277785 | 31.995 |
| 44180.14413194445 | 31.995 |
| 44180.18579861111 | 31.956 |
| 44180.227465277785 | 32.014 |
| 44180.26913194445 | 31.937 |
| 44180.31079861111 | 31.995 |
| 44180.352465277785 | 32.014 |
| 44180.39413194445 | 31.976 |
| 44180.43579861111 | 32.014 |
| 44180.477465277785 | 31.995 |
| 44180.51913194445 | 32.246 |
| 44180.56079861111 | 33.366 |
| 44180.602465277785 | 34.621 |
| 44180.64413194445 | 34.041 |
| 44180.68579861111 | 33.327 |
| 44180.727465277785 | 32.902 |
| 44180.76913194445 | 32.593 |
| 44180.81079861111 | 32.092 |
| 44180.852465277785 | 31.956 |
| 44180.89413194445 | 31.976 |
| 44180.93579861111 | 31.995 |
| 44180.977465277785 | 31.995 |
| 44181.01913194445 | 31.995 |
| 44181.06079861111 | 31.995 |
| 44181.102465277785 | 31.956 |
| 44181.14413194445 | 31.976 |
| 44181.18579861111 | 31.956 |
| 44181.227465277785 | 31.956 |
| 44181.26913194445 | 32.034 |
| 44181.31079861111 | 31.976 |
| 44181.352465277785 | 31.976 |
| 44181.39413194445 | 31.956 |
| 44181.43579861111 | 31.995 |
| 44181.477465277785 | 31.995 |
| 44181.51913194445 | 32.014 |
| 44181.56079861111 | 33.095 |
| 44181.602465277785 | 34.408 |
| 44181.64413194445 | 34.814 |
| 44181.68579861111 | 34.929 |
| 44181.727465277785 | 34.871 |
| 44181.76913194445 | 34.736 |
| 44181.81079861111 | 34.524 |
| 44181.852465277785 | 34.119 |
| 44181.89413194445 | 33.52 |
| 44181.93579861111 | 32.883 |
| 44181.977465277785 | 32.227 |
| 44182.01913194445 | 32.014 |
| 44182.06079861111 | 31.976 |
| 44182.102465277785 | 31.976 |
| 44182.14413194445 | 31.976 |
| 44182.18579861111 | 31.976 |
| 44182.227465277785 | 31.995 |
| 44182.26913194445 | 31.976 |
| 44182.31079861111 | 31.976 |
| 44182.352465277785 | 31.976 |
| 44182.39413194445 | 31.956 |
| 44182.43579861111 | 31.956 |
| 44182.477465277785 | 31.995 |
| 44182.51913194445 | 32.034 |
| 44182.56079861111 | 32.169 |
| 44182.602465277785 | 32.323 |
| 44182.64413194445 | 33.443 |
| 44182.68579861111 | 34.157 |
| 44182.727465277785 | 34.543 |
| 44182.76913194445 | 34.582 |
| 44182.81079861111 | 34.331 |
| 44182.852465277785 | 33.906 |
| 44182.89413194445 | 33.617 |
| 44182.93579861111 | 33.153 |
| 44182.977465277785 | 32.651 |
| 44183.01913194445 | 32.4 |
| 44183.06079861111 | 32.4 |
| 44183.102465277785 | 32.304 |
| 44183.14413194445 | 32.207 |
| 44183.18579861111 | 32.169 |
| 44183.227465277785 | 32.188 |
| 44183.26913194445 | 32.304 |
| 44183.31079861111 | 32.478 |
| 44183.352465277785 | 32.458 |
| 44183.39413194445 | 32.4 |
| 44183.43579861111 | 32.999 |
| 44183.477465277785 | 33.559 |
| 44183.51913194445 | 34.814 |
| 44183.56079861111 | 35.875 |
| 44183.602465277785 | 35.953 |
| 44183.64413194445 | 35.972 |
| 44183.68579861111 | 35.509 |
| 44183.727465277785 | 35.2 |
| 44183.76913194445 | 34.814 |
| 44183.81079861111 | 34.447 |
| 44183.852465277785 | 34.157 |
| 44183.89413194445 | 33.694 |
| 44183.93579861111 | 33.288 |
| 44183.977465277785 | 33.018 |
| 44184.01913194445 | 32.593 |
| 44184.06079861111 | 32.111 |
| 44184.102465277785 | 31.976 |
| 44184.14413194445 | 31.995 |
| 44184.18579861111 | 31.995 |
| 44184.227465277785 | 31.937 |
| 44184.26913194445 | 31.995 |
| 44184.31079861111 | 31.976 |
| 44184.352465277785 | 32.014 |
| 44184.39413194445 | 31.976 |
| 44184.43579861111 | 31.976 |
| 44184.477465277785 | 32.072 |
| 44184.51913194445 | 32.246 |
| 44184.56079861111 | 32.883 |
| 44184.602465277785 | 33.964 |
| 44184.64413194445 | 34.833 |
| 44184.68579861111 | 35.238 |
| 44184.727465277785 | 35.122 |
| 44184.76913194445 | 34.91 |
| 44184.81079861111 | 34.64 |
| 44184.852465277785 | 34.37 |
| 44184.89413194445 | 34.041 |
| 44184.93579861111 | 33.675 |
| 44184.977465277785 | 33.269 |
| 44185.01913194445 | 32.999 |
| 44185.06079861111 | 32.709 |
| 44185.102465277785 | 32.323 |
| 44185.14413194445 | 31.976 |
| 44185.18579861111 | 31.976 |
| 44185.227465277785 | 31.976 |
| 44185.26913194445 | 31.995 |
| 44185.31079861111 | 31.956 |
| 44185.352465277785 | 32.014 |
| 44185.39413194445 | 31.995 |
| 44185.43579861111 | 32.034 |
| 44185.477465277785 | 32.323 |
| 44185.51913194445 | 34.292 |
| 44185.56079861111 | 35.74 |
| 44185.602465277785 | 36.474 |
| 44185.64413194445 | 36.512 |
| 44185.68579861111 | 36.59 |
| 44185.727465277785 | 36.358 |
| 44185.76913194445 | 36.204 |
| 44185.81079861111 | 36.261 |
| 44185.852465277785 | 36.126 |
| 44185.89413194445 | 35.933 |
| 44185.93579861111 | 35.76 |
| 44185.977465277785 | 35.451 |
| 44186.01913194445 | 35.373 |
| 44186.06079861111 | 35.315 |
| 44186.102465277785 | 35.2 |
| 44186.14413194445 | 35.045 |
| 44186.18579861111 | 34.852 |
| 44186.227465277785 | 34.485 |
| 44186.26913194445 | 34.292 |
| 44186.31079861111 | 34.041 |
| 44186.352465277785 | 34.022 |
| 44186.39413194445 | 34.408 |
| 44186.43579861111 | 35.238 |
| 44186.477465277785 | 36.435 |
| 44186.51913194445 | 37.96 |
| 44186.56079861111 | 39.138 |
| 44186.602465277785 | 39.312 |
| 44186.64413194445 | 38.597 |
| 44186.68579861111 | 38.269 |
| 44186.727465277785 | 37.98 |
| 44186.76913194445 | 37.42 |
| 44186.81079861111 | 36.705 |
| 44186.852465277785 | 35.933 |
| 44186.89413194445 | 35.161 |
| 44186.93579861111 | 34.485 |
| 44186.977465277785 | 33.926 |
| 44187.01913194445 | 33.501 |
| 44187.06079861111 | 33.095 |
| 44187.102465277785 | 32.787 |
| 44187.14413194445 | 32.555 |
| 44187.18579861111 | 32.4 |
| 44187.227465277785 | 32.227 |
| 44187.26913194445 | 32.13 |
| 44187.31079861111 | 32.053 |
| 44187.352465277785 | 31.976 |
| 44187.39413194445 | 32.227 |
| 44187.43579861111 | 33.288 |
| 44187.477465277785 | 34.968 |
| 44187.51913194445 | 35.528 |
| 44187.56079861111 | 36.261 |
| 44187.602465277785 | 36.705 |
| 44187.64413194445 | 36.937 |
| 44187.68579861111 | 37.188 |
| 44187.727465277785 | 36.956 |
| 44187.76913194445 | 36.705 |
| 44187.81079861111 | 34.987 |
| 44187.852465277785 | 33.945 |
| 44187.89413194445 | 32.362 |
| 44187.93579861111 | 31.976 |
| 44187.977465277785 | 31.995 |
| 44188.01913194445 | 31.937 |
| 44188.06079861111 | 31.956 |
| 44188.102465277785 | 31.976 |
| 44188.14413194445 | 31.976 |
| 44188.18579861111 | 31.976 |
| 44188.227465277785 | 31.937 |
| 44188.26913194445 | 31.976 |
| 44188.31079861111 | 31.995 |
| 44188.352465277785 | 31.976 |
| 44188.39413194445 | 31.995 |
| 44188.43579861111 | 31.937 |
| 44188.477465277785 | 31.995 |
| 44188.51913194445 | 32.014 |
| 44188.56079861111 | 32.014 |
| 44188.602465277785 | 32.053 |
| 44188.64413194445 | 31.976 |
| 44188.68579861111 | 31.976 |
| 44188.727465277785 | 31.995 |
| 44188.76913194445 | 31.995 |
| 44188.81079861111 | 31.995 |
| 44188.852465277785 | 31.995 |
| 44188.89413194445 | 31.995 |
| 44188.93579861111 | 31.995 |
| 44188.977465277785 | 31.956 |
| 44189.01913194445 | 31.976 |
| 44189.06079861111 | 32.014 |
| 44189.102465277785 | 31.995 |
| 44189.14413194445 | 31.995 |
| 44189.18579861111 | 31.976 |
| 44189.227465277785 | 31.956 |
| 44189.26913194445 | 32.014 |
| 44189.31079861111 | 31.995 |
| 44189.352465277785 | 31.995 |
| 44189.39413194445 | 31.995 |
| 44189.43579861111 | 31.976 |
| 44189.477465277785 | 32.014 |
| 44189.51913194445 | 32.034 |
| 44189.56079861111 | 31.995 |
| 44189.602465277785 | 32.034 |
| 44189.64413194445 | 31.956 |
| 44189.68579861111 | 32.014 |
| 44189.727465277785 | 31.956 |
| 44189.76913194445 | 31.956 |
| 44189.81079861111 | 31.956 |
| 44189.852465277785 | 31.976 |
| 44189.89413194445 | 31.976 |
| 44189.93579861111 | 32.034 |
| 44189.977465277785 | 31.995 |
| 44190.01913194445 | 31.995 |
| 44190.06079861111 | 32.014 |
| 44190.102465277785 | 31.995 |
| 44190.14413194445 | 32.014 |
| 44190.18579861111 | 31.956 |
| 44190.227465277785 | 31.976 |
| 44190.26913194445 | 32.014 |
| 44190.31079861111 | 31.976 |
| 44190.352465277785 | 31.956 |
| 44190.39413194445 | 31.976 |
| 44190.43579861111 | 32.014 |
| 44190.477465277785 | 31.995 |
| 44190.51913194445 | 31.995 |
| 44190.56079861111 | 31.976 |
| 44190.602465277785 | 32.014 |
| 44190.64413194445 | 31.995 |
| 44190.68579861111 | 31.976 |
| 44190.727465277785 | 31.976 |
| 44190.76913194445 | 32.014 |
| 44190.81079861111 | 31.995 |
| 44190.852465277785 | 31.976 |
| 44190.89413194445 | 32.014 |
| 44190.93579861111 | 31.995 |
| 44190.977465277785 | 32.014 |
| 44191.01913194445 | 31.956 |
| 44191.06079861111 | 31.937 |
| 44191.102465277785 | 31.937 |
| 44191.14413194445 | 31.995 |
| 44191.18579861111 | 32.014 |
| 44191.227465277785 | 31.937 |
| 44191.26913194445 | 31.956 |
| 44191.31079861111 | 31.976 |
| 44191.352465277785 | 32.014 |
| 44191.39413194445 | 31.956 |
| 44191.43579861111 | 31.956 |
| 44191.477465277785 | 31.995 |
| 44191.51913194445 | 31.976 |
| 44191.56079861111 | 31.976 |
| 44191.602465277785 | 32.034 |
| 44191.64413194445 | 32.092 |
| 44191.68579861111 | 32.053 |
| 44191.727465277785 | 32.13 |
| 44191.76913194445 | 32.304 |
| 44191.81079861111 | 32.593 |
| 44191.852465277785 | 32.806 |
| 44191.89413194445 | 32.96 |
| 44191.93579861111 | 32.98 |
| 44191.977465277785 | 32.883 |
| 44192.01913194445 | 32.902 |
| 44192.06079861111 | 32.883 |
| 44192.102465277785 | 32.825 |
| 44192.14413194445 | 32.806 |
| 44192.18579861111 | 32.458 |
| 44192.227465277785 | 32.265 |
| 44192.26913194445 | 32.149 |
| 44192.31079861111 | 31.956 |
| 44192.352465277785 | 32.072 |
| 44192.39413194445 | 32.323 |
| 44192.43579861111 | 32.806 |
| 44192.477465277785 | 33.037 |
| 44192.51913194445 | 33.153 |
| 44192.56079861111 | 33.694 |
| 44192.602465277785 | 34.234 |
| 44192.64413194445 | 34.852 |
| 44192.68579861111 | 34.929 |
| 44192.727465277785 | 34.814 |
| 44192.76913194445 | 34.582 |
| 44192.81079861111 | 34.176 |
| 44192.852465277785 | 33.617 |
| 44192.89413194445 | 33.057 |
| 44192.93579861111 | 32.478 |
| 44192.977465277785 | 31.937 |
| 44193.01913194445 | 31.937 |
| 44193.06079861111 | 31.976 |
| 44193.102465277785 | 31.976 |
| 44193.14413194445 | 31.995 |
| 44193.18579861111 | 31.995 |
| 44193.227465277785 | 31.995 |
| 44193.26913194445 | 31.956 |
| 44193.31079861111 | 31.976 |
| 44193.352465277785 | 31.956 |
| 44193.39413194445 | 31.995 |
| 44193.43579861111 | 31.995 |
| 44193.477465277785 | 31.995 |
| 44193.51913194445 | 31.995 |
| 44193.56079861111 | 31.995 |
| 44193.602465277785 | 31.995 |
| 44193.64413194445 | 31.976 |
| 44193.68579861111 | 32.69 |
| 44193.727465277785 | 33.945 |
| 44193.76913194445 | 34.331 |
| 44193.81079861111 | 34.427 |
| 44193.852465277785 | 34.119 |
| 44193.89413194445 | 33.578 |
| 44193.93579861111 | 33.211 |
| 44193.977465277785 | 33.018 |
| 44194.01913194445 | 32.729 |
| 44194.06079861111 | 32.497 |
| 44194.102465277785 | 32.265 |
| 44194.14413194445 | 32.343 |
| 44194.18579861111 | 32.381 |
| 44194.227465277785 | 32.149 |
| 44194.26913194445 | 32.014 |
| 44194.31079861111 | 31.976 |
| 44194.352465277785 | 31.995 |
| 44194.39413194445 | 32.169 |
| 44194.43579861111 | 32.806 |
| 44194.477465277785 | 33.288 |
| 44194.51913194445 | 33.404 |
| 44194.56079861111 | 33.81 |
| 44194.602465277785 | 34.196 |
| 44194.64413194445 | 34.003 |
| 44194.68579861111 | 33.462 |
| 44194.727465277785 | 33.095 |
| 44194.76913194445 | 32.671 |
| 44194.81079861111 | 32.13 |
| 44194.852465277785 | 31.995 |
| 44194.89413194445 | 31.956 |
| 44194.93579861111 | 31.956 |
| 44194.977465277785 | 31.976 |
| 44195.01913194445 | 32.014 |
| 44195.06079861111 | 32.014 |
| 44195.102465277785 | 32.034 |
| 44195.14413194445 | 32.014 |
| 44195.18579861111 | 31.956 |
| 44195.227465277785 | 31.995 |
| 44195.26913194445 | 31.995 |
| 44195.31079861111 | 31.976 |
| 44195.352465277785 | 31.976 |
| 44195.39413194445 | 32.014 |
| 44195.43579861111 | 32.014 |
| 44195.477465277785 | 31.976 |
| 44195.51913194445 | 31.995 |
| 44195.56079861111 | 32.053 |
| 44195.602465277785 | 32.034 |
| 44195.64413194445 | 31.995 |
| 44195.68579861111 | 31.976 |
| 44195.727465277785 | 31.976 |
| 44195.76913194445 | 31.956 |
| 44195.81079861111 | 31.956 |
| 44195.852465277785 | 31.976 |
| 44195.89413194445 | 31.937 |
| 44195.93579861111 | 31.976 |
| 44195.977465277785 | 31.995 |
| 44196.01913194445 | 31.956 |
| 44196.06079861111 | 32.034 |
| 44196.102465277785 | 32.014 |
| 44196.14413194445 | 31.995 |
| 44196.18579861111 | 31.995 |
| 44196.227465277785 | 31.956 |
| 44196.26913194445 | 31.956 |
| 44196.31079861111 | 31.976 |
| 44196.352465277785 | 31.995 |
| 44196.39413194445 | 31.995 |
| 44196.43579861111 | 31.995 |
| 44196.477465277785 | 31.976 |
| 44196.51913194445 | 31.976 |
| 44196.56079861111 | 32.034 |
| 44196.602465277785 | 32.014 |
| 44196.64413194445 | 32.034 |
| 44196.68579861111 | 32.072 |
| 44196.727465277785 | 32.188 |
| 44196.76913194445 | 32.4 |
| 44196.81079861111 | 32.825 |
| 44196.852465277785 | 33.095 |
| 44196.89413194445 | 33.057 |
| 44196.93579861111 | 32.883 |
| 44196.977465277785 | 32.497 |
| 44197.01913194445 | 32.169 |
| 44197.06079861111 | 31.937 |
| 44197.102465277785 | 31.956 |
| 44197.14413194445 | 31.995 |
| 44197.18579861111 | 31.956 |
| 44197.227465277785 | 31.976 |
| 44197.26913194445 | 31.937 |
| 44197.31079861111 | 31.956 |
| 44197.352465277785 | 32.014 |
| 44197.39413194445 | 31.976 |
| 44197.43579861111 | 31.976 |
| 44197.477465277785 | 31.995 |
| 44197.51913194445 | 32.034 |
| 44197.56079861111 | 32.169 |
| 44197.602465277785 | 32.883 |
| 44197.64413194445 | 33.675 |
| 44197.68579861111 | 33.655 |
| 44197.727465277785 | 33.636 |
| 44197.76913194445 | 33.559 |
| 44197.81079861111 | 33.308 |
| 44197.852465277785 | 32.883 |
| 44197.89413194445 | 32.4 |
| 44197.93579861111 | 31.937 |
| 44197.977465277785 | 31.956 |
| 44198.01913194445 | 31.976 |
| 44198.06079861111 | 31.995 |
| 44198.102465277785 | 31.995 |
| 44198.14413194445 | 31.976 |
| 44198.18579861111 | 31.995 |
| 44198.227465277785 | 31.976 |
| 44198.26913194445 | 31.995 |
| 44198.31079861111 | 31.956 |
| 44198.352465277785 | 32.014 |
| 44198.39413194445 | 32.014 |
| 44198.43579861111 | 31.976 |
| 44198.477465277785 | 32.034 |
| 44198.51913194445 | 32.034 |
| 44198.56079861111 | 32.053 |
| 44198.602465277785 | 32.092 |
| 44198.64413194445 | 32.072 |
| 44198.68579861111 | 32.053 |
| 44198.727465277785 | 32.323 |
| 44198.76913194445 | 32.593 |
| 44198.81079861111 | 32.69 |
| 44198.852465277785 | 32.516 |
| 44198.89413194445 | 32.265 |
| 44198.93579861111 | 31.976 |
| 44198.977465277785 | 31.918 |
| 44199.01913194445 | 31.976 |
| 44199.06079861111 | 31.995 |
| 44199.102465277785 | 31.937 |
| 44199.14413194445 | 31.976 |
| 44199.18579861111 | 31.976 |
| 44199.227465277785 | 31.976 |
| 44199.26913194445 | 31.995 |
| 44199.31079861111 | 31.995 |
| 44199.352465277785 | 31.976 |
| 44199.39413194445 | 32.014 |
| 44199.43579861111 | 32.014 |
| 44199.477465277785 | 32.014 |
| 44199.51913194445 | 32.072 |
| 44199.56079861111 | 32.13 |
| 44199.602465277785 | 33.211 |
| 44199.64413194445 | 34.196 |
| 44199.68579861111 | 34.601 |
| 44199.727465277785 | 34.814 |
| 44199.76913194445 | 34.736 |
| 44199.81079861111 | 34.756 |
| 44199.852465277785 | 34.543 |
| 44199.89413194445 | 34.408 |
| 44199.93579861111 | 34.157 |
| 44199.977465277785 | 33.868 |
| 44200.01913194445 | 33.771 |
| 44200.06079861111 | 33.52 |
| 44200.102465277785 | 33.288 |
| 44200.14413194445 | 32.941 |
| 44200.18579861111 | 32.632 |
| 44200.227465277785 | 32.265 |
| 44200.26913194445 | 31.956 |
| 44200.31079861111 | 31.956 |
| 44200.352465277785 | 31.976 |
| 44200.39413194445 | 31.976 |
| 44200.43579861111 | 31.995 |
| 44200.477465277785 | 32.207 |
| 44200.51913194445 | 33.539 |
| 44200.56079861111 | 34.871 |
| 44200.602465277785 | 35.489 |
| 44200.64413194445 | 35.451 |
| 44200.68579861111 | 35.18 |
| 44200.727465277785 | 35.045 |
| 44200.76913194445 | 34.871 |
| 44200.81079861111 | 34.582 |
| 44200.852465277785 | 34.35 |
| 44200.89413194445 | 34.08 |
| 44200.93579861111 | 33.926 |
| 44200.977465277785 | 33.79 |
| 44201.01913194445 | 33.597 |
| 44201.06079861111 | 33.501 |
| 44201.102465277785 | 33.559 |
| 44201.14413194445 | 33.424 |
| 44201.18579861111 | 33.288 |
| 44201.227465277785 | 33.018 |
| 44201.26913194445 | 32.767 |
| 44201.31079861111 | 32.748 |
| 44201.352465277785 | 32.922 |
| 44201.39413194445 | 33.037 |
| 44201.43579861111 | 33.404 |
| 44201.477465277785 | 33.057 |
| 44201.51913194445 | 33.192 |
| 44201.56079861111 | 33.134 |
| 44201.602465277785 | 33.52 |
| 44201.64413194445 | 34.234 |
| 44201.68579861111 | 34.543 |
| 44201.727465277785 | 34.273 |
| 44201.76913194445 | 33.964 |
| 44201.81079861111 | 33.559 |
| 44201.852465277785 | 33.057 |
| 44201.89413194445 | 32.729 |
| 44201.93579861111 | 32.613 |
| 44201.977465277785 | 32.555 |
| 44202.01913194445 | 32.343 |
| 44202.06079861111 | 32.034 |
| 44202.102465277785 | 31.976 |
| 44202.14413194445 | 31.956 |
| 44202.18579861111 | 31.995 |
| 44202.227465277785 | 31.976 |
| 44202.26913194445 | 31.976 |
| 44202.31079861111 | 31.976 |
| 44202.352465277785 | 31.995 |
| 44202.39413194445 | 31.956 |
| 44202.43579861111 | 31.995 |
| 44202.477465277785 | 31.995 |
| 44202.51913194445 | 32.304 |
| 44202.56079861111 | 33.945 |
| 44202.602465277785 | 35.007 |
| 44202.64413194445 | 35.161 |
| 44202.68579861111 | 34.717 |
| 44202.727465277785 | 34.447 |
| 44202.76913194445 | 34.292 |
| 44202.81079861111 | 33.868 |
| 44202.852465277785 | 33.288 |
| 44202.89413194445 | 32.593 |
| 44202.93579861111 | 31.937 |
| 44202.977465277785 | 31.976 |
| 44203.01913194445 | 31.976 |
| 44203.06079861111 | 31.995 |
| 44203.102465277785 | 31.937 |
| 44203.14413194445 | 31.995 |
| 44203.18579861111 | 31.995 |
| 44203.227465277785 | 31.956 |
| 44203.26913194445 | 31.976 |
| 44203.31079861111 | 31.976 |
| 44203.352465277785 | 31.937 |
| 44203.39413194445 | 32.014 |
| 44203.43579861111 | 31.976 |
| 44203.477465277785 | 31.995 |
| 44203.51913194445 | 31.976 |
| 44203.56079861111 | 32.053 |
| 44203.602465277785 | 32.149 |
| 44203.64413194445 | 32.111 |
| 44203.68579861111 | 32.207 |
| 44203.727465277785 | 32.941 |
| 44203.76913194445 | 33.366 |
| 44203.81079861111 | 33.482 |
| 44203.852465277785 | 33.231 |
| 44203.89413194445 | 32.632 |
| 44203.93579861111 | 31.995 |
| 44203.977465277785 | 31.995 |
| 44204.01913194445 | 31.956 |
| 44204.06079861111 | 32.014 |
| 44204.102465277785 | 31.976 |
| 44204.14413194445 | 31.995 |
| 44204.18579861111 | 31.995 |
| 44204.227465277785 | 31.976 |
| 44204.26913194445 | 31.995 |
| 44204.31079861111 | 32.014 |
| 44204.352465277785 | 31.976 |
| 44204.39413194445 | 31.976 |
| 44204.43579861111 | 31.995 |
| 44204.477465277785 | 31.995 |
| 44204.51913194445 | 32.014 |
| 44204.56079861111 | 32.13 |
| 44204.602465277785 | 32.304 |
| 44204.64413194445 | 32.207 |
| 44204.68579861111 | 31.995 |
| 44204.727465277785 | 32.323 |
| 44204.76913194445 | 32.709 |
| 44204.81079861111 | 32.806 |
| 44204.852465277785 | 32.671 |
| 44204.89413194445 | 32.4 |
| 44204.93579861111 | 32.092 |
| 44204.977465277785 | 32.034 |
| 44205.01913194445 | 31.937 |
| 44205.06079861111 | 31.976 |
| 44205.102465277785 | 31.976 |
| 44205.14413194445 | 31.976 |
| 44205.18579861111 | 31.937 |
| 44205.227465277785 | 31.976 |
| 44205.26913194445 | 31.956 |
| 44205.31079861111 | 31.995 |
| 44205.352465277785 | 31.995 |
| 44205.39413194445 | 32.014 |
| 44205.43579861111 | 32.014 |
| 44205.477465277785 | 31.956 |
| 44205.51913194445 | 32.014 |
| 44205.56079861111 | 32.072 |
| 44205.602465277785 | 33.115 |
| 44205.64413194445 | 33.868 |
| 44205.68579861111 | 34.215 |
| 44205.727465277785 | 34.447 |
| 44205.76913194445 | 34.563 |
| 44205.81079861111 | 34.37 |
| 44205.852465277785 | 33.964 |
| 44205.89413194445 | 33.25 |
| 44205.93579861111 | 32.69 |
| 44205.977465277785 | 32.034 |
| 44206.01913194445 | 31.956 |
| 44206.06079861111 | 31.956 |
| 44206.102465277785 | 31.937 |
| 44206.14413194445 | 31.995 |
| 44206.18579861111 | 31.995 |
| 44206.227465277785 | 31.976 |
| 44206.26913194445 | 31.995 |
| 44206.31079861111 | 31.937 |
| 44206.352465277785 | 31.995 |
| 44206.39413194445 | 31.995 |
| 44206.43579861111 | 32.014 |
| 44206.477465277785 | 31.995 |
| 44206.51913194445 | 32.034 |
| 44206.56079861111 | 32.053 |
| 44206.602465277785 | 32.188 |
| 44206.64413194445 | 32.149 |
| 44206.68579861111 | 32.034 |
| 44206.727465277785 | 32.149 |
| 44206.76913194445 | 32.323 |
| 44206.81079861111 | 32.265 |
| 44206.852465277785 | 31.956 |
| 44206.89413194445 | 31.976 |
| 44206.93579861111 | 31.956 |
| 44206.977465277785 | 31.976 |
| 44207.01913194445 | 31.995 |
| 44207.06079861111 | 31.976 |
| 44207.102465277785 | 31.976 |
| 44207.14413194445 | 31.976 |
| 44207.18579861111 | 31.976 |
| 44207.227465277785 | 31.995 |
| 44207.26913194445 | 31.976 |
| 44207.31079861111 | 32.014 |
| 44207.352465277785 | 31.995 |
| 44207.39413194445 | 31.956 |
| 44207.43579861111 | 31.976 |
| 44207.477465277785 | 32.034 |
| 44207.51913194445 | 32.034 |
| 44207.56079861111 | 32.092 |
| 44207.602465277785 | 32.149 |
| 44207.64413194445 | 32.072 |
| 44207.68579861111 | 31.956 |
| 44207.727465277785 | 31.995 |
| 44207.76913194445 | 31.995 |
| 44207.81079861111 | 31.995 |
| 44207.852465277785 | 31.976 |
| 44207.89413194445 | 31.995 |
| 44207.93579861111 | 32.014 |
| 44207.977465277785 | 31.995 |
| 44208.01913194445 | 31.976 |
| 44208.06079861111 | 31.976 |
| 44208.102465277785 | 31.995 |
| 44208.14413194445 | 31.995 |
| 44208.18579861111 | 31.976 |
| 44208.227465277785 | 31.956 |
| 44208.26913194445 | 31.995 |
| 44208.31079861111 | 31.995 |
| 44208.352465277785 | 31.937 |
| 44208.39413194445 | 32.014 |
| 44208.43579861111 | 32.014 |
| 44208.477465277785 | 32.014 |
| 44208.51913194445 | 32.034 |
| 44208.56079861111 | 32.034 |
| 44208.602465277785 | 31.995 |
| 44208.64413194445 | 31.995 |
| 44208.68579861111 | 31.976 |
| 44208.727465277785 | 31.956 |
| 44208.76913194445 | 31.976 |
| 44208.81079861111 | 31.956 |
| 44208.852465277785 | 32.014 |
| 44208.89413194445 | 31.956 |
| 44208.93579861111 | 31.995 |
| 44208.977465277785 | 32.014 |
| 44209.01913194445 | 31.976 |
| 44209.06079861111 | 31.995 |
| 44209.102465277785 | 31.937 |
| 44209.14413194445 | 31.956 |
| 44209.18579861111 | 31.995 |
| 44209.227465277785 | 31.995 |
| 44209.26913194445 | 31.995 |
| 44209.31079861111 | 31.976 |
| 44209.352465277785 | 31.956 |
| 44209.39413194445 | 32.014 |
| 44209.43579861111 | 31.956 |
| 44209.477465277785 | 31.995 |
| 44209.51913194445 | 32.014 |
| 44209.56079861111 | 32.072 |
| 44209.602465277785 | 32.188 |
| 44209.64413194445 | 32.304 |
| 44209.68579861111 | 32.439 |
| 44209.727465277785 | 32.709 |
| 44209.76913194445 | 32.999 |
| 44209.81079861111 | 33.501 |
| 44209.852465277785 | 33.848 |
| 44209.89413194445 | 33.983 |
| 44209.93579861111 | 33.848 |
| 44209.977465277785 | 33.597 |
| 44210.01913194445 | 33.153 |
| 44210.06079861111 | 32.304 |
| 44210.102465277785 | 31.956 |
| 44210.14413194445 | 31.976 |
| 44210.18579861111 | 31.956 |
| 44210.227465277785 | 31.956 |
| 44210.26913194445 | 31.956 |
| 44210.31079861111 | 31.956 |
| 44210.352465277785 | 31.976 |
| 44210.39413194445 | 31.976 |
| 44210.43579861111 | 31.956 |
| 44210.477465277785 | 32.014 |
| 44210.51913194445 | 32.014 |
| 44210.56079861111 | 32.014 |
| 44210.602465277785 | 32.034 |
| 44210.64413194445 | 32.053 |
| 44210.68579861111 | 31.976 |
| 44210.727465277785 | 31.976 |
| 44210.76913194445 | 31.995 |
| 44210.81079861111 | 31.956 |
| 44210.852465277785 | 31.937 |
| 44210.89413194445 | 31.995 |
| 44210.93579861111 | 31.995 |
| 44210.977465277785 | 31.956 |
| 44211.01913194445 | 31.976 |
| 44211.06079861111 | 31.995 |
| 44211.102465277785 | 31.976 |
| 44211.14413194445 | 31.956 |
| 44211.18579861111 | 31.956 |
| 44211.227465277785 | 31.995 |
| 44211.26913194445 | 31.995 |
| 44211.31079861111 | 31.976 |
| 44211.352465277785 | 31.956 |
| 44211.39413194445 | 31.976 |
| 44211.43579861111 | 31.995 |
| 44211.477465277785 | 32.014 |
| 44211.51913194445 | 31.976 |
| 44211.56079861111 | 32.034 |
| 44211.602465277785 | 32.053 |
| 44211.64413194445 | 32.092 |
| 44211.68579861111 | 31.995 |
| 44211.727465277785 | 31.956 |
| 44211.76913194445 | 31.976 |
| 44211.81079861111 | 31.995 |
| 44211.852465277785 | 31.976 |
| 44211.89413194445 | 31.976 |
| 44211.93579861111 | 31.976 |
| 44211.977465277785 | 31.956 |
| 44212.01913194445 | 31.976 |
| 44212.06079861111 | 31.956 |
| 44212.102465277785 | 31.976 |
| 44212.14413194445 | 31.995 |
| 44212.18579861111 | 31.976 |
| 44212.227465277785 | 31.976 |
| 44212.26913194445 | 31.937 |
| 44212.31079861111 | 31.976 |
| 44212.352465277785 | 31.976 |
| 44212.39413194445 | 31.995 |
| 44212.43579861111 | 31.995 |
| 44212.477465277785 | 31.976 |
| 44212.51913194445 | 31.956 |
| 44212.56079861111 | 32.169 |
| 44212.602465277785 | 32.574 |
| 44212.64413194445 | 32.748 |
| 44212.68579861111 | 33.173 |
| 44212.727465277785 | 33.366 |
| 44212.76913194445 | 33.52 |
| 44212.81079861111 | 33.655 |
| 44212.852465277785 | 33.52 |
| 44212.89413194445 | 33.192 |
| 44212.93579861111 | 32.844 |
| 44212.977465277785 | 32.613 |
| 44213.01913194445 | 32.285 |
| 44213.06079861111 | 32.265 |
| 44213.102465277785 | 32.362 |
| 44213.14413194445 | 32.227 |
| 44213.18579861111 | 32.362 |
| 44213.227465277785 | 32.343 |
| 44213.26913194445 | 32.246 |
| 44213.31079861111 | 32.323 |
| 44213.352465277785 | 32.362 |
| 44213.39413194445 | 32.671 |
| 44213.43579861111 | 33.211 |
| 44213.477465277785 | 33.983 |
| 44213.51913194445 | 34.621 |
| 44213.56079861111 | 35.258 |
| 44213.602465277785 | 35.76 |
| 44213.64413194445 | 36.088 |
| 44213.68579861111 | 36.165 |
| 44213.727465277785 | 36.204 |
| 44213.76913194445 | 36.165 |
| 44213.81079861111 | 36.146 |
| 44213.852465277785 | 35.837 |
| 44213.89413194445 | 35.586 |
| 44213.93579861111 | 35.258 |
| 44213.977465277785 | 34.968 |
| 44214.01913194445 | 34.543 |
| 44214.06079861111 | 34.35 |
| 44214.102465277785 | 34.022 |
| 44214.14413194445 | 33.868 |
| 44214.18579861111 | 33.617 |
| 44214.227465277785 | 33.462 |
| 44214.26913194445 | 33.366 |
| 44214.31079861111 | 33.192 |
| 44214.352465277785 | 33.057 |
| 44214.39413194445 | 33.366 |
| 44214.43579861111 | 33.829 |
| 44214.477465277785 | 34.852 |
| 44214.51913194445 | 35.528 |
| 44214.56079861111 | 35.566 |
| 44214.602465277785 | 35.296 |
| 44214.64413194445 | 35.084 |
| 44214.68579861111 | 34.794 |
| 44214.727465277785 | 34.35 |
| 44214.76913194445 | 33.926 |
| 44214.81079861111 | 33.559 |
| 44214.852465277785 | 33.134 |
| 44214.89413194445 | 32.806 |
| 44214.93579861111 | 32.516 |
| 44214.977465277785 | 32.246 |
| 44215.01913194445 | 31.956 |
| 44215.06079861111 | 31.956 |
| 44215.102465277785 | 31.956 |
| 44215.14413194445 | 31.937 |
| 44215.18579861111 | 31.956 |
| 44215.227465277785 | 31.956 |
| 44215.26913194445 | 31.976 |
| 44215.31079861111 | 31.956 |
| 44215.352465277785 | 31.995 |
| 44215.39413194445 | 31.976 |
| 44215.43579861111 | 31.995 |
| 44215.477465277785 | 31.976 |
| 44215.51913194445 | 32.304 |
| 44215.56079861111 | 35.084 |
| 44215.602465277785 | 35.895 |
| 44215.64413194445 | 35.798 |
| 44215.68579861111 | 35.18 |
| 44215.727465277785 | 34.736 |
| 44215.76913194445 | 34.389 |
| 44215.81079861111 | 34.08 |
| 44215.852465277785 | 33.424 |
| 44215.89413194445 | 32.69 |
| 44215.93579861111 | 32.034 |
| 44215.977465277785 | 31.995 |
| 44216.01913194445 | 31.976 |
| 44216.06079861111 | 31.995 |
| 44216.102465277785 | 31.976 |
| 44216.14413194445 | 31.995 |
| 44216.18579861111 | 31.976 |
| 44216.227465277785 | 31.976 |
| 44216.26913194445 | 31.976 |
| 44216.31079861111 | 32.014 |
| 44216.352465277785 | 31.976 |
| 44216.39413194445 | 31.976 |
| 44216.43579861111 | 32.014 |
| 44216.477465277785 | 32.014 |
| 44216.51913194445 | 32.149 |
| 44216.56079861111 | 32.497 |
| 44216.602465277785 | 33.559 |
| 44216.64413194445 | 35.084 |
| 44216.68579861111 | 35.373 |
| 44216.727465277785 | 35.2 |
| 44216.76913194445 | 35.065 |
| 44216.81079861111 | 34.968 |
| 44216.852465277785 | 34.621 |
| 44216.89413194445 | 34.292 |
| 44216.93579861111 | 33.945 |
| 44216.977465277785 | 33.675 |
| 44217.01913194445 | 33.308 |
| 44217.06079861111 | 32.902 |
| 44217.102465277785 | 32.574 |
| 44217.14413194445 | 32.4 |
| 44217.18579861111 | 32.149 |
| 44217.227465277785 | 31.976 |
| 44217.26913194445 | 31.976 |
| 44217.31079861111 | 31.976 |
| 44217.352465277785 | 31.995 |
| 44217.39413194445 | 31.995 |
| 44217.43579861111 | 32.014 |
| 44217.477465277785 | 32.844 |
| 44217.51913194445 | 35.721 |
| 44217.56079861111 | 36.899 |
| 44217.602465277785 | 36.937 |
| 44217.64413194445 | 37.053 |
| 44217.68579861111 | 36.763 |
| 44217.727465277785 | 36.725 |
| 44217.76913194445 | 36.455 |
| 44217.81079861111 | 36.339 |
| 44217.852465277785 | 36.281 |
| 44217.89413194445 | 36.01 |
| 44217.93579861111 | 35.702 |
| 44217.977465277785 | 35.354 |
| 44218.01913194445 | 34.987 |
| 44218.06079861111 | 34.736 |
| 44218.102465277785 | 34.524 |
| 44218.14413194445 | 34.292 |
| 44218.18579861111 | 34.176 |
| 44218.227465277785 | 34.022 |
| 44218.26913194445 | 34.003 |
| 44218.31079861111 | 33.906 |
| 44218.352465277785 | 33.926 |
| 44218.39413194445 | 34.234 |
| 44218.43579861111 | 34.987 |
| 44218.477465277785 | 35.933 |
| 44218.51913194445 | 36.358 |
| 44218.56079861111 | 36.377 |
| 44218.602465277785 | 36.937 |
| 44218.64413194445 | 38.539 |
| 44218.68579861111 | 38.52 |
| 44218.727465277785 | 37.96 |
| 44218.76913194445 | 37.555 |
| 44218.81079861111 | 37.246 |
| 44218.852465277785 | 36.86 |
| 44218.89413194445 | 36.281 |
| 44218.93579861111 | 35.605 |
| 44218.977465277785 | 34.891 |
| 44219.01913194445 | 34.35 |
| 44219.06079861111 | 33.868 |
| 44219.102465277785 | 33.385 |
| 44219.14413194445 | 33.153 |
| 44219.18579861111 | 32.98 |
| 44219.227465277785 | 32.825 |
| 44219.26913194445 | 32.613 |
| 44219.31079861111 | 32.4 |
| 44219.352465277785 | 32.207 |
| 44219.39413194445 | 32.458 |
| 44219.43579861111 | 33.269 |
| 44219.477465277785 | 34.331 |
| 44219.51913194445 | 35.393 |
| 44219.56079861111 | 35.856 |
| 44219.602465277785 | 36.628 |
| 44219.64413194445 | 36.435 |
| 44219.68579861111 | 36.242 |
| 44219.727465277785 | 36.068 |
| 44219.76913194445 | 35.74 |
| 44219.81079861111 | 35.47 |
| 44219.852465277785 | 35.103 |
| 44219.89413194445 | 34.64 |
| 44219.93579861111 | 34.234 |
| 44219.977465277785 | 33.829 |
| 44220.01913194445 | 33.288 |
| 44220.06079861111 | 32.709 |
| 44220.102465277785 | 32.149 |
| 44220.14413194445 | 31.937 |
| 44220.18579861111 | 31.976 |
| 44220.227465277785 | 31.995 |
| 44220.26913194445 | 31.956 |
| 44220.31079861111 | 31.995 |
| 44220.352465277785 | 31.956 |
| 44220.39413194445 | 31.976 |
| 44220.43579861111 | 31.995 |
| 44220.477465277785 | 31.976 |
| 44220.51913194445 | 32.072 |
| 44220.56079861111 | 32.362 |
| 44220.602465277785 | 33.52 |
| 44220.64413194445 | 34.408 |
| 44220.68579861111 | 34.929 |
| 44220.727465277785 | 35.045 |
| 44220.76913194445 | 35.065 |
| 44220.81079861111 | 34.891 |
| 44220.852465277785 | 34.485 |
| 44220.89413194445 | 34.08 |
| 44220.93579861111 | 33.694 |
| 44220.977465277785 | 33.192 |
| 44221.01913194445 | 32.729 |
| 44221.06079861111 | 32.362 |
| 44221.102465277785 | 32.092 |
| 44221.14413194445 | 31.976 |
| 44221.18579861111 | 32.014 |
| 44221.227465277785 | 31.976 |
| 44221.26913194445 | 31.995 |
| 44221.31079861111 | 31.995 |
| 44221.352465277785 | 31.976 |
| 44221.39413194445 | 32.034 |
| 44221.43579861111 | 32.034 |
| 44221.477465277785 | 32.69 |
| 44221.51913194445 | 34.273 |
| 44221.56079861111 | 34.891 |
| 44221.602465277785 | 34.891 |
| 44221.64413194445 | 34.871 |
| 44221.68579861111 | 34.929 |
| 44221.727465277785 | 34.64 |
| 44221.76913194445 | 34.601 |
| 44221.81079861111 | 34.408 |
| 44221.852465277785 | 33.868 |
| 44221.89413194445 | 33.366 |
| 44221.93579861111 | 32.69 |
| 44221.977465277785 | 32.034 |
| 44222.01913194445 | 31.956 |
| 44222.06079861111 | 31.956 |
| 44222.102465277785 | 31.976 |
| 44222.14413194445 | 31.956 |
| 44222.18579861111 | 31.956 |
| 44222.227465277785 | 31.976 |
| 44222.26913194445 | 31.956 |
| 44222.31079861111 | 31.976 |
| 44222.352465277785 | 32.014 |
| 44222.39413194445 | 31.976 |
| 44222.43579861111 | 31.976 |
| 44222.477465277785 | 31.995 |
| 44222.51913194445 | 32.014 |
| 44222.56079861111 | 32.014 |
| 44222.602465277785 | 32.053 |
| 44222.64413194445 | 31.995 |
| 44222.68579861111 | 31.995 |
| 44222.727465277785 | 31.976 |
| 44222.76913194445 | 32.092 |
| 44222.81079861111 | 32.053 |
| 44222.852465277785 | 32.13 |
| 44222.89413194445 | 32.053 |
| 44222.93579861111 | 31.976 |
| 44222.977465277785 | 31.976 |
| 44223.01913194445 | 31.976 |
| 44223.06079861111 | 31.976 |
| 44223.102465277785 | 31.956 |
| 44223.14413194445 | 32.014 |
| 44223.18579861111 | 31.976 |
| 44223.227465277785 | 31.976 |
| 44223.26913194445 | 31.956 |
| 44223.31079861111 | 31.976 |
| 44223.352465277785 | 31.976 |
| 44223.39413194445 | 31.995 |
| 44223.43579861111 | 32.014 |
| 44223.477465277785 | 31.995 |
| 44223.51913194445 | 32.092 |
| 44223.56079861111 | 32.381 |
| 44223.602465277785 | 32.632 |
| 44223.64413194445 | 32.767 |
| 44223.68579861111 | 32.883 |
| 44223.727465277785 | 33.366 |
| 44223.76913194445 | 34.119 |
| 44223.81079861111 | 34.698 |
| 44223.852465277785 | 34.871 |
| 44223.89413194445 | 34.756 |
| 44223.93579861111 | 34.389 |
| 44223.977465277785 | 34.119 |
| 44224.01913194445 | 33.829 |
| 44224.06079861111 | 33.559 |
| 44224.102465277785 | 33.288 |
| 44224.14413194445 | 33.095 |
| 44224.18579861111 | 32.883 |
| 44224.227465277785 | 32.69 |
| 44224.26913194445 | 32.536 |
| 44224.31079861111 | 32.265 |
| 44224.352465277785 | 32.265 |
| 44224.39413194445 | 32.632 |
| 44224.43579861111 | 33.443 |
| 44224.477465277785 | 35.161 |
| 44224.51913194445 | 36.242 |
| 44224.56079861111 | 37.304 |
| 44224.602465277785 | 38.675 |
| 44224.64413194445 | 38.983 |
| 44224.68579861111 | 38.655 |
| 44224.727465277785 | 38.134 |
| 44224.76913194445 | 37.709 |
| 44224.81079861111 | 37.207 |
| 44224.852465277785 | 36.512 |
| 44224.89413194445 | 35.702 |
| 44224.93579861111 | 34.794 |
| 44224.977465277785 | 33.983 |
| 44225.01913194445 | 33.269 |
| 44225.06079861111 | 32.671 |
| 44225.102465277785 | 32.169 |
| 44225.14413194445 | 31.995 |
| 44225.18579861111 | 31.976 |
| 44225.227465277785 | 31.956 |
| 44225.26913194445 | 31.995 |
| 44225.31079861111 | 31.976 |
| 44225.352465277785 | 32.014 |
| 44225.39413194445 | 31.937 |
| 44225.43579861111 | 32.014 |
| 44225.477465277785 | 32.458 |
| 44225.51913194445 | 35.2 |
| 44225.56079861111 | 37.42 |
| 44225.602465277785 | 38.327 |
| 44225.64413194445 | 38.539 |
| 44225.68579861111 | 38.733 |
| 44225.727465277785 | 38.597 |
| 44225.76913194445 | 38.346 |
| 44225.81079861111 | 37.999 |
| 44225.852465277785 | 37.478 |
| 44225.89413194445 | 36.802 |
| 44225.93579861111 | 35.972 |
| 44225.977465277785 | 35.258 |
| 44226.01913194445 | 34.698 |
| 44226.06079861111 | 34.119 |
| 44226.102465277785 | 33.694 |
| 44226.14413194445 | 33.482 |
| 44226.18579861111 | 33.269 |
| 44226.227465277785 | 33.115 |
| 44226.26913194445 | 32.806 |
| 44226.31079861111 | 32.555 |
| 44226.352465277785 | 32.458 |
| 44226.39413194445 | 32.864 |
| 44226.43579861111 | 33.636 |
| 44226.477465277785 | 34.891 |
| 44226.51913194445 | 35.74 |
| 44226.56079861111 | 35.933 |
| 44226.602465277785 | 36.165 |
| 44226.64413194445 | 35.837 |
| 44226.68579861111 | 35.47 |
| 44226.727465277785 | 34.871 |
| 44226.76913194445 | 34.312 |
| 44226.81079861111 | 33.945 |
| 44226.852465277785 | 33.694 |
| 44226.89413194445 | 33.366 |
| 44226.93579861111 | 32.96 |
| 44226.977465277785 | 32.632 |
| 44227.01913194445 | 32.516 |
| 44227.06079861111 | 32.053 |
| 44227.102465277785 | 31.995 |
| 44227.14413194445 | 31.976 |
| 44227.18579861111 | 31.976 |
| 44227.227465277785 | 31.995 |
| 44227.26913194445 | 32.034 |
| 44227.31079861111 | 31.976 |
| 44227.352465277785 | 31.976 |
| 44227.39413194445 | 31.995 |
| 44227.43579861111 | 31.995 |
| 44227.477465277785 | 32.014 |
| 44227.51913194445 | 32.671 |
| 44227.56079861111 | 34.621 |
| 44227.602465277785 | 36.628 |
| 44227.64413194445 | 37.246 |
| 44227.68579861111 | 36.705 |
| 44227.727465277785 | 36.126 |
| 44227.76913194445 | 35.837 |
| 44227.81079861111 | 35.373 |
| 44227.852465277785 | 34.582 |
| 44227.89413194445 | 33.655 |
| 44227.93579861111 | 32.806 |
| 44227.977465277785 | 32.072 |
| 44228.01913194445 | 31.956 |
| 44228.06079861111 | 31.956 |
| 44228.102465277785 | 31.956 |
| 44228.14413194445 | 31.976 |
| 44228.18579861111 | 32.014 |
| 44228.227465277785 | 31.995 |
| 44228.26913194445 | 31.995 |
| 44228.31079861111 | 31.956 |
| 44228.352465277785 | 31.976 |
| 44228.39413194445 | 31.956 |
| 44228.43579861111 | 31.995 |
| 44228.477465277785 | 32.014 |
| 44228.51913194445 | 31.976 |
| 44228.56079861111 | 32.034 |
| 44228.602465277785 | 32.111 |
| 44228.64413194445 | 32.246 |
| 44228.68579861111 | 32.806 |
| 44228.727465277785 | 33.868 |
| 44228.76913194445 | 34.389 |
| 44228.81079861111 | 34.505 |
| 44228.852465277785 | 34.331 |
| 44228.89413194445 | 34.003 |
| 44228.93579861111 | 33.578 |
| 44228.977465277785 | 33.076 |
| 44229.01913194445 | 32.593 |
| 44229.06079861111 | 32.149 |
| 44229.102465277785 | 31.956 |
| 44229.14413194445 | 31.976 |
| 44229.18579861111 | 31.956 |
| 44229.227465277785 | 31.976 |
| 44229.26913194445 | 31.956 |
| 44229.31079861111 | 31.976 |
| 44229.352465277785 | 32.014 |
| 44229.39413194445 | 31.995 |
| 44229.43579861111 | 32.014 |
| 44229.477465277785 | 32.053 |
| 44229.51913194445 | 32.787 |
| 44229.56079861111 | 36.512 |
| 44229.602465277785 | 38.366 |
| 44229.64413194445 | 38.269 |
| 44229.68579861111 | 38.269 |
| 44229.727465277785 | 38.134 |
| 44229.76913194445 | 37.767 |
| 44229.81079861111 | 37.304 |
| 44229.852465277785 | 36.86 |
| 44229.89413194445 | 36.049 |
| 44229.93579861111 | 35.18 |
| 44229.977465277785 | 34.505 |
| 44230.01913194445 | 34.138 |
| 44230.06079861111 | 33.926 |
| 44230.102465277785 | 33.771 |
| 44230.14413194445 | 33.559 |
| 44230.18579861111 | 33.366 |
| 44230.227465277785 | 33.211 |
| 44230.26913194445 | 33.115 |
| 44230.31079861111 | 33.018 |
| 44230.352465277785 | 33.25 |
| 44230.39413194445 | 34.041 |
| 44230.43579861111 | 35.026 |
| 44230.477465277785 | 35.779 |
| 44230.51913194445 | 36.165 |
| 44230.56079861111 | 35.856 |
| 44230.602465277785 | 35.624 |
| 44230.64413194445 | 36.126 |
| 44230.68579861111 | 35.953 |
| 44230.727465277785 | 35.721 |
| 44230.76913194445 | 35.084 |
| 44230.81079861111 | 34.003 |
| 44230.852465277785 | 32.941 |
| 44230.89413194445 | 32.246 |
| 44230.93579861111 | 31.976 |
| 44230.977465277785 | 31.956 |
| 44231.01913194445 | 31.956 |
| 44231.06079861111 | 31.956 |
| 44231.102465277785 | 31.995 |
| 44231.14413194445 | 31.976 |
| 44231.18579861111 | 31.976 |
| 44231.227465277785 | 31.956 |
| 44231.26913194445 | 31.995 |
| 44231.31079861111 | 31.937 |
| 44231.352465277785 | 31.976 |
| 44231.39413194445 | 32.014 |
| 44231.43579861111 | 31.995 |
| 44231.477465277785 | 32.053 |
| 44231.51913194445 | 32.053 |
| 44231.56079861111 | 32.169 |
| 44231.602465277785 | 32.188 |
| 44231.64413194445 | 32.806 |
| 44231.68579861111 | 33.52 |
| 44231.727465277785 | 33.617 |
| 44231.76913194445 | 33.424 |
| 44231.81079861111 | 32.922 |
| 44231.852465277785 | 32.4 |
| 44231.89413194445 | 32.13 |
| 44231.93579861111 | 31.956 |
| 44231.977465277785 | 31.976 |
| 44232.01913194445 | 31.976 |
| 44232.06079861111 | 31.976 |
| 44232.102465277785 | 31.976 |
| 44232.14413194445 | 31.937 |
| 44232.18579861111 | 31.995 |
| 44232.227465277785 | 31.976 |
| 44232.26913194445 | 31.956 |
| 44232.31079861111 | 31.976 |
| 44232.352465277785 | 31.976 |
| 44232.39413194445 | 31.976 |
| 44232.43579861111 | 31.976 |
| 44232.477465277785 | 31.976 |
| 44232.51913194445 | 32.034 |
| 44232.56079861111 | 32.381 |
| 44232.602465277785 | 33.443 |
| 44232.64413194445 | 34.273 |
| 44232.68579861111 | 34.408 |
| 44232.727465277785 | 34.37 |
| 44232.76913194445 | 34.254 |
| 44232.81079861111 | 33.964 |
| 44232.852465277785 | 33.52 |
| 44232.89413194445 | 32.902 |
| 44232.93579861111 | 32.227 |
| 44232.977465277785 | 31.976 |
| 44233.01913194445 | 31.995 |
| 44233.06079861111 | 31.956 |
| 44233.102465277785 | 31.976 |
| 44233.14413194445 | 31.937 |
| 44233.18579861111 | 31.976 |
| 44233.227465277785 | 31.995 |
| 44233.26913194445 | 31.995 |
| 44233.31079861111 | 31.976 |
| 44233.352465277785 | 31.995 |
| 44233.39413194445 | 31.976 |
| 44233.43579861111 | 31.995 |
| 44233.477465277785 | 32.014 |
| 44233.51913194445 | 32.207 |
| 44233.56079861111 | 32.536 |
| 44233.602465277785 | 33.288 |
| 44233.64413194445 | 34.119 |
| 44233.68579861111 | 34.814 |
| 44233.727465277785 | 35.161 |
| 44233.76913194445 | 35.026 |
| 44233.81079861111 | 34.833 |
| 44233.852465277785 | 34.659 |
| 44233.89413194445 | 34.254 |
| 44233.93579861111 | 33.713 |
| 44233.977465277785 | 33.231 |
| 44234.01913194445 | 32.767 |
| 44234.06079861111 | 32.42 |
| 44234.102465277785 | 32.111 |
| 44234.14413194445 | 31.956 |
| 44234.18579861111 | 31.956 |
| 44234.227465277785 | 31.956 |
| 44234.26913194445 | 31.956 |
| 44234.31079861111 | 31.956 |
| 44234.352465277785 | 31.976 |
| 44234.39413194445 | 31.937 |
| 44234.43579861111 | 32.13 |
| 44234.477465277785 | 33.559 |
| 44234.51913194445 | 35.76 |
| 44234.56079861111 | 37.439 |
| 44234.602465277785 | 38.462 |
| 44234.64413194445 | 38.578 |
| 44234.68579861111 | 37.69 |
| 44234.727465277785 | 36.686 |
| 44234.76913194445 | 35.991 |
| 44234.81079861111 | 35.47 |
| 44234.852465277785 | 34.833 |
| 44234.89413194445 | 34.003 |
| 44234.93579861111 | 33.308 |
| 44234.977465277785 | 32.767 |
| 44235.01913194445 | 32.265 |
| 44235.06079861111 | 31.956 |
| 44235.102465277785 | 31.976 |
| 44235.14413194445 | 31.956 |
| 44235.18579861111 | 31.995 |
| 44235.227465277785 | 31.976 |
| 44235.26913194445 | 31.976 |
| 44235.31079861111 | 31.995 |
| 44235.352465277785 | 31.976 |
| 44235.39413194445 | 32.014 |
| 44235.43579861111 | 32.014 |
| 44235.477465277785 | 32.671 |
| 44235.51913194445 | 35.953 |
| 44235.56079861111 | 37.941 |
| 44235.602465277785 | 39.061 |
| 44235.64413194445 | 39.234 |
| 44235.68579861111 | 38.346 |
| 44235.727465277785 | 37.536 |
| 44235.76913194445 | 36.802 |
| 44235.81079861111 | 36.03 |
| 44235.852465277785 | 35.315 |
| 44235.89413194445 | 34.621 |
| 44235.93579861111 | 33.887 |
| 44235.977465277785 | 33.424 |
| 44236.01913194445 | 33.115 |
| 44236.06079861111 | 32.883 |
| 44236.102465277785 | 32.729 |
| 44236.14413194445 | 32.787 |
| 44236.18579861111 | 32.825 |
| 44236.227465277785 | 32.883 |
| 44236.26913194445 | 33.095 |
| 44236.31079861111 | 33.25 |
| 44236.352465277785 | 33.52 |
| 44236.39413194445 | 34.08 |
| 44236.43579861111 | 34.891 |
| 44236.477465277785 | 35.509 |
| 44236.51913194445 | 36.165 |
| 44236.56079861111 | 36.841 |
| 44236.602465277785 | 37.729 |
| 44236.64413194445 | 37.98 |
| 44236.68579861111 | 37.941 |
| 44236.727465277785 | 37.825 |
| 44236.76913194445 | 37.632 |
| 44236.81079861111 | 37.362 |
| 44236.852465277785 | 36.995 |
| 44236.89413194445 | 36.435 |
| 44236.93579861111 | 36.01 |
| 44236.977465277785 | 35.586 |
| 44237.01913194445 | 35.18 |
| 44237.06079861111 | 34.775 |
| 44237.102465277785 | 34.543 |
| 44237.14413194445 | 34.447 |
| 44237.18579861111 | 34.331 |
| 44237.227465277785 | 34.331 |
| 44237.26913194445 | 34.273 |
| 44237.31079861111 | 34.196 |
| 44237.352465277785 | 34.292 |
| 44237.39413194445 | 34.524 |
| 44237.43579861111 | 35.045 |
| 44237.477465277785 | 35.663 |
| 44237.51913194445 | 36.319 |
| 44237.56079861111 | 37.014 |
| 44237.602465277785 | 37.42 |
| 44237.64413194445 | 37.323 |
| 44237.68579861111 | 37.246 |
| 44237.727465277785 | 36.918 |
| 44237.76913194445 | 36.455 |
| 44237.81079861111 | 36.242 |
| 44237.852465277785 | 36.319 |
| 44237.89413194445 | 36.204 |
| 44237.93579861111 | 35.76 |
| 44237.977465277785 | 35.103 |
| 44238.01913194445 | 34.485 |
| 44238.06079861111 | 34.061 |
| 44238.102465277785 | 33.771 |
| 44238.14413194445 | 33.559 |
| 44238.18579861111 | 33.52 |
| 44238.227465277785 | 33.443 |
| 44238.26913194445 | 33.385 |
| 44238.31079861111 | 33.327 |
| 44238.352465277785 | 33.269 |
| 44238.39413194445 | 33.578 |
| 44238.43579861111 | 33.983 |
| 44238.477465277785 | 34.505 |
| 44238.51913194445 | 35.161 |
| 44238.56079861111 | 36.435 |
| 44238.602465277785 | 37.883 |
| 44238.64413194445 | 38.346 |
| 44238.68579861111 | 38.192 |
| 44238.727465277785 | 37.806 |
| 44238.76913194445 | 37.536 |
| 44238.81079861111 | 37.478 |
| 44238.852465277785 | 37.285 |
| 44238.89413194445 | 36.956 |
| 44238.93579861111 | 36.397 |
| 44238.977465277785 | 35.895 |
| 44239.01913194445 | 35.412 |
| 44239.06079861111 | 35.065 |
| 44239.102465277785 | 34.814 |
| 44239.14413194445 | 34.621 |
| 44239.18579861111 | 34.582 |
| 44239.227465277785 | 34.505 |
| 44239.26913194445 | 34.119 |
| 44239.31079861111 | 33.636 |
| 44239.352465277785 | 33.327 |
| 44239.39413194445 | 33.617 |
| 44239.43579861111 | 34.003 |
| 44239.477465277785 | 34.756 |
| 44239.51913194445 | 35.644 |
| 44239.56079861111 | 36.397 |
| 44239.602465277785 | 37.014 |
| 44239.64413194445 | 37.844 |
| 44239.68579861111 | 38.153 |
| 44239.727465277785 | 37.98 |
| 44239.76913194445 | 37.632 |
| 44239.81079861111 | 37.246 |
| 44239.852465277785 | 36.86 |
| 44239.89413194445 | 36.397 |
| 44239.93579861111 | 35.953 |
| 44239.977465277785 | 35.277 |
| 44240.01913194445 | 34.678 |
| 44240.06079861111 | 34.35 |
| 44240.102465277785 | 34.119 |
| 44240.14413194445 | 33.926 |
| 44240.18579861111 | 33.848 |
| 44240.227465277785 | 33.655 |
| 44240.26913194445 | 33.424 |
| 44240.31079861111 | 33.366 |
| 44240.352465277785 | 33.52 |
| 44240.39413194445 | 34.138 |
| 44240.43579861111 | 34.794 |
| 44240.477465277785 | 35.547 |
| 44240.51913194445 | 36.86 |
| 44240.56079861111 | 37.478 |
| 44240.602465277785 | 37.883 |
| 44240.64413194445 | 38.346 |
| 44240.68579861111 | 38.327 |
| 44240.727465277785 | 38.115 |
| 44240.76913194445 | 37.787 |
| 44240.81079861111 | 37.381 |
| 44240.852465277785 | 36.899 |
| 44240.89413194445 | 36.435 |
| 44240.93579861111 | 35.875 |
| 44240.977465277785 | 35.296 |
| 44241.01913194445 | 34.582 |
| 44241.06079861111 | 33.964 |
| 44241.102465277785 | 33.404 |
| 44241.14413194445 | 33.057 |
| 44241.18579861111 | 32.478 |
| 44241.227465277785 | 32.014 |
| 44241.26913194445 | 31.956 |
| 44241.31079861111 | 31.956 |
| 44241.352465277785 | 32.014 |
| 44241.39413194445 | 32.014 |
| 44241.43579861111 | 32.053 |
| 44241.477465277785 | 32.42 |
| 44241.51913194445 | 33.269 |
| 44241.56079861111 | 34.968 |
| 44241.602465277785 | 36.184 |
| 44241.64413194445 | 36.512 |
| 44241.68579861111 | 35.817 |
| 44241.727465277785 | 34.466 |
| 44241.76913194445 | 33.771 |
| 44241.81079861111 | 33.173 |
| 44241.852465277785 | 32.42 |
| 44241.89413194445 | 31.976 |
| 44241.93579861111 | 31.937 |
| 44241.977465277785 | 31.956 |
| 44242.01913194445 | 31.976 |
| 44242.06079861111 | 31.995 |
| 44242.102465277785 | 32.014 |
| 44242.14413194445 | 31.976 |
| 44242.18579861111 | 31.976 |
| 44242.227465277785 | 31.956 |
| 44242.26913194445 | 31.976 |
| 44242.31079861111 | 31.956 |
| 44242.352465277785 | 32.034 |
| 44242.39413194445 | 31.956 |
| 44242.43579861111 | 32.053 |
| 44242.477465277785 | 32.092 |
| 44242.51913194445 | 32.478 |
| 44242.56079861111 | 33.443 |
| 44242.602465277785 | 34.196 |
| 44242.64413194445 | 35.103 |
| 44242.68579861111 | 35.47 |
| 44242.727465277785 | 35.354 |
| 44242.76913194445 | 35.142 |
| 44242.81079861111 | 34.891 |
| 44242.852465277785 | 34.524 |
| 44242.89413194445 | 33.983 |
| 44242.93579861111 | 33.52 |
| 44242.977465277785 | 33.211 |
| 44243.01913194445 | 32.902 |
| 44243.06079861111 | 32.362 |
| 44243.102465277785 | 31.956 |
| 44243.14413194445 | 31.976 |
| 44243.18579861111 | 31.956 |
| 44243.227465277785 | 31.976 |
| 44243.26913194445 | 31.976 |
| 44243.31079861111 | 32.014 |
| 44243.352465277785 | 31.937 |
| 44243.39413194445 | 32.014 |
| 44243.43579861111 | 32.014 |
| 44243.477465277785 | 32.053 |
| 44243.51913194445 | 32.729 |
| 44243.56079861111 | 33.443 |
| 44243.602465277785 | 34.717 |
| 44243.64413194445 | 35.161 |
| 44243.68579861111 | 35.277 |
| 44243.727465277785 | 34.91 |
| 44243.76913194445 | 34.331 |
| 44243.81079861111 | 33.906 |
| 44243.852465277785 | 33.617 |
| 44243.89413194445 | 33.153 |
| 44243.93579861111 | 32.478 |
| 44243.977465277785 | 32.053 |
| 44244.01913194445 | 31.956 |
| 44244.06079861111 | 31.976 |
| 44244.102465277785 | 31.956 |
| 44244.14413194445 | 31.956 |
| 44244.18579861111 | 31.956 |
| 44244.227465277785 | 31.956 |
| 44244.26913194445 | 31.956 |
| 44244.31079861111 | 31.995 |
| 44244.352465277785 | 31.976 |
| 44244.39413194445 | 31.995 |
| 44244.43579861111 | 32.053 |
| 44244.477465277785 | 32.207 |
| 44244.51913194445 | 32.883 |
| 44244.56079861111 | 33.926 |
| 44244.602465277785 | 34.833 |
| 44244.64413194445 | 35.528 |
| 44244.68579861111 | 35.875 |
| 44244.727465277785 | 35.451 |
| 44244.76913194445 | 34.717 |
| 44244.81079861111 | 34.215 |
| 44244.852465277785 | 33.462 |
| 44244.89413194445 | 32.671 |
| 44244.93579861111 | 32.034 |
| 44244.977465277785 | 31.976 |
| 44245.01913194445 | 31.956 |
| 44245.06079861111 | 31.956 |
| 44245.102465277785 | 31.995 |
| 44245.14413194445 | 31.976 |
| 44245.18579861111 | 31.976 |
| 44245.227465277785 | 31.956 |
| 44245.26913194445 | 31.976 |
| 44245.31079861111 | 31.995 |
| 44245.352465277785 | 31.995 |
| 44245.39413194445 | 31.995 |
| 44245.43579861111 | 31.976 |
| 44245.477465277785 | 32.149 |
| 44245.51913194445 | 32.767 |
| 44245.56079861111 | 33.771 |
| 44245.602465277785 | 34.949 |
| 44245.64413194445 | 35.895 |
| 44245.68579861111 | 35.991 |
| 44245.727465277785 | 35.412 |
| 44245.76913194445 | 34.717 |
| 44245.81079861111 | 33.597 |
| 44245.852465277785 | 32.4 |
| 44245.89413194445 | 31.995 |
| 44245.93579861111 | 31.995 |
| 44245.977465277785 | 31.956 |
| 44246.01913194445 | 31.956 |
| 44246.06079861111 | 31.995 |
| 44246.102465277785 | 32.014 |
| 44246.14413194445 | 31.976 |
| 44246.18579861111 | 31.956 |
| 44246.227465277785 | 31.956 |
| 44246.26913194445 | 32.014 |
| 44246.31079861111 | 32.014 |
| 44246.352465277785 | 32.014 |
| 44246.39413194445 | 31.976 |
| 44246.43579861111 | 32.034 |
| 44246.477465277785 | 31.995 |
| 44246.51913194445 | 32.034 |
| 44246.56079861111 | 32.092 |
| 44246.602465277785 | 32.304 |
| 44246.64413194445 | 32.4 |
| 44246.68579861111 | 32.246 |
| 44246.727465277785 | 32.651 |
| 44246.76913194445 | 33.057 |
| 44246.81079861111 | 33.346 |
| 44246.852465277785 | 33.462 |
| 44246.89413194445 | 33.462 |
| 44246.93579861111 | 33.443 |
| 44246.977465277785 | 33.346 |
| 44247.01913194445 | 33.231 |
| 44247.06079861111 | 33.095 |
| 44247.102465277785 | 32.864 |
| 44247.14413194445 | 32.593 |
| 44247.18579861111 | 32.362 |
| 44247.227465277785 | 32.014 |
| 44247.26913194445 | 31.976 |
| 44247.31079861111 | 31.956 |
| 44247.352465277785 | 32.149 |
| 44247.39413194445 | 32.748 |
| 44247.43579861111 | 33.81 |
| 44247.477465277785 | 35.122 |
| 44247.51913194445 | 35.895 |
| 44247.56079861111 | 37.034 |
| 44247.602465277785 | 37.883 |
| 44247.64413194445 | 38.424 |
| 44247.68579861111 | 38.346 |
| 44247.727465277785 | 37.381 |
| 44247.76913194445 | 36.184 |
| 44247.81079861111 | 35.277 |
| 44247.852465277785 | 34.389 |
| 44247.89413194445 | 33.713 |
| 44247.93579861111 | 32.999 |
| 44247.977465277785 | 32.246 |
| 44248.01913194445 | 31.976 |
| 44248.06079861111 | 31.976 |
| 44248.102465277785 | 31.956 |
| 44248.14413194445 | 31.995 |
| 44248.18579861111 | 31.976 |
| 44248.227465277785 | 31.995 |
| 44248.26913194445 | 31.976 |
| 44248.31079861111 | 31.995 |
| 44248.352465277785 | 31.995 |
| 44248.39413194445 | 31.976 |
| 44248.43579861111 | 32.014 |
| 44248.477465277785 | 32.072 |
| 44248.51913194445 | 32.362 |
| 44248.56079861111 | 32.613 |
| 44248.602465277785 | 33.559 |
| 44248.64413194445 | 34.64 |
| 44248.68579861111 | 35.238 |
| 44248.727465277785 | 35.258 |
| 44248.76913194445 | 35.161 |
| 44248.81079861111 | 34.717 |
| 44248.852465277785 | 33.81 |
| 44248.89413194445 | 33.057 |
| 44248.93579861111 | 32.323 |
| 44248.977465277785 | 31.956 |
| 44249.01913194445 | 31.976 |
| 44249.06079861111 | 31.956 |
| 44249.102465277785 | 31.956 |
| 44249.14413194445 | 31.918 |
| 44249.18579861111 | 31.976 |
| 44249.227465277785 | 31.976 |
| 44249.26913194445 | 31.995 |
| 44249.31079861111 | 31.956 |
| 44249.352465277785 | 31.937 |
| 44249.39413194445 | 31.995 |
| 44249.43579861111 | 31.995 |
| 44249.477465277785 | 34.041 |
| 44249.51913194445 | 37.516 |
| 44249.56079861111 | 39.582 |
| 44249.602465277785 | 40.972 |
| 44249.64413194445 | 41.416 |
| 44249.68579861111 | 40.953 |
| 44249.727465277785 | 39.794 |
| 44249.76913194445 | 38.983 |
| 44249.81079861111 | 38.211 |
| 44249.852465277785 | 37.188 |
| 44249.89413194445 | 35.953 |
| 44249.93579861111 | 34.698 |
| 44249.977465277785 | 33.597 |
| 44250.01913194445 | 32.729 |
| 44250.06079861111 | 32.034 |
| 44250.102465277785 | 31.995 |
| 44250.14413194445 | 31.956 |
| 44250.18579861111 | 31.976 |
| 44250.227465277785 | 31.937 |
| 44250.26913194445 | 31.995 |
| 44250.31079861111 | 31.976 |
| 44250.352465277785 | 32.034 |
| 44250.39413194445 | 31.976 |
| 44250.43579861111 | 32.072 |
| 44250.477465277785 | 32.999 |
| 44250.51913194445 | 35.026 |
| 44250.56079861111 | 38.327 |
| 44250.602465277785 | 41.339 |
| 44250.64413194445 | 42.883 |
| 44250.68579861111 | 42.671 |
| 44250.727465277785 | 41.281 |
| 44250.76913194445 | 40.2 |
| 44250.81079861111 | 39.157 |
| 44250.852465277785 | 38.018 |
| 44250.89413194445 | 36.744 |
| 44250.93579861111 | 35.47 |
| 44250.977465277785 | 34.408 |
| 44251.01913194445 | 33.655 |
| 44251.06079861111 | 33.115 |
| 44251.102465277785 | 32.516 |
| 44251.14413194445 | 31.995 |
| 44251.18579861111 | 31.976 |
| 44251.227465277785 | 31.956 |
| 44251.26913194445 | 31.937 |
| 44251.31079861111 | 31.995 |
| 44251.352465277785 | 31.976 |
| 44251.39413194445 | 32.014 |
| 44251.43579861111 | 32.053 |
| 44251.477465277785 | 32.96 |
| 44251.51913194445 | 34.891 |
| 44251.56079861111 | 37.478 |
| 44251.602465277785 | 39.119 |
| 44251.64413194445 | 39.794 |
| 44251.68579861111 | 39.408 |
| 44251.727465277785 | 38.173 |
| 44251.76913194445 | 37.188 |
| 44251.81079861111 | 36.532 |
| 44251.852465277785 | 35.875 |
| 44251.89413194445 | 34.91 |
| 44251.93579861111 | 33.308 |
| 44251.977465277785 | 32.227 |
| 44252.01913194445 | 31.976 |
| 44252.06079861111 | 31.956 |
| 44252.102465277785 | 31.956 |
| 44252.14413194445 | 32.034 |
| 44252.18579861111 | 31.956 |
| 44252.227465277785 | 31.976 |
| 44252.26913194445 | 31.976 |
| 44252.31079861111 | 31.956 |
| 44252.352465277785 | 32.014 |
| 44252.39413194445 | 31.976 |
| 44252.43579861111 | 32.092 |
| 44252.477465277785 | 33.095 |
| 44252.51913194445 | 35.663 |
| 44252.56079861111 | 38.173 |
| 44252.602465277785 | 39.582 |
| 44252.64413194445 | 40.084 |
| 44252.68579861111 | 39.524 |
| 44252.727465277785 | 38.173 |
| 44252.76913194445 | 37.285 |
| 44252.81079861111 | 36.474 |
| 44252.852465277785 | 35.451 |
| 44252.89413194445 | 34.119 |
| 44252.93579861111 | 32.941 |
| 44252.977465277785 | 32.034 |
| 44253.01913194445 | 31.976 |
| 44253.06079861111 | 31.995 |
| 44253.102465277785 | 31.976 |
| 44253.14413194445 | 31.995 |
| 44253.18579861111 | 31.976 |
| 44253.227465277785 | 31.976 |
| 44253.26913194445 | 31.956 |
| 44253.31079861111 | 31.995 |
| 44253.352465277785 | 31.956 |
| 44253.39413194445 | 31.995 |
| 44253.43579861111 | 32.053 |
| 44253.477465277785 | 32.149 |
| 44253.51913194445 | 32.96 |
| 44253.56079861111 | 34.254 |
| 44253.602465277785 | 36.068 |
| 44253.64413194445 | 37.207 |
| 44253.68579861111 | 36.802 |
| 44253.727465277785 | 36.628 |
| 44253.76913194445 | 36.339 |
| 44253.81079861111 | 36.03 |
| 44253.852465277785 | 35.393 |
| 44253.89413194445 | 34.891 |
| 44253.93579861111 | 34.254 |
| 44253.977465277785 | 33.81 |
| 44254.01913194445 | 33.385 |
| 44254.06079861111 | 33.076 |
| 44254.102465277785 | 32.632 |
| 44254.14413194445 | 32.458 |
| 44254.18579861111 | 32.4 |
| 44254.227465277785 | 32.285 |
| 44254.26913194445 | 32.207 |
| 44254.31079861111 | 32.207 |
| 44254.352465277785 | 32.014 |
| 44254.39413194445 | 31.995 |
| 44254.43579861111 | 32.014 |
| 44254.477465277785 | 32.014 |
| 44254.51913194445 | 32.072 |
| 44254.56079861111 | 32.265 |
| 44254.602465277785 | 32.883 |
| 44254.64413194445 | 33.771 |
| 44254.68579861111 | 33.906 |
| 44254.727465277785 | 33.694 |
| 44254.76913194445 | 33.308 |
| 44254.81079861111 | 33.115 |
| 44254.852465277785 | 32.632 |
| 44254.89413194445 | 32.014 |
| 44254.93579861111 | 31.976 |
| 44254.977465277785 | 31.956 |
| 44255.01913194445 | 31.995 |
| 44255.06079861111 | 31.937 |
| 44255.102465277785 | 31.976 |
| 44255.14413194445 | 31.995 |
| 44255.18579861111 | 31.976 |
| 44255.227465277785 | 31.995 |
| 44255.26913194445 | 31.956 |
| 44255.31079861111 | 31.937 |
| 44255.352465277785 | 31.956 |
| 44255.39413194445 | 31.976 |
| 44255.43579861111 | 32.034 |
| 44255.477465277785 | 32.246 |
| 44255.51913194445 | 32.98 |
| 44255.56079861111 | 33.887 |
| 44255.602465277785 | 34.582 |
| 44255.64413194445 | 34.543 |
| 44255.68579861111 | 34.64 |
| 44255.727465277785 | 34.312 |
| 44255.76913194445 | 34.196 |
| 44255.81079861111 | 33.732 |
| 44255.852465277785 | 33.057 |
| 44255.89413194445 | 32.053 |
| 44255.93579861111 | 31.956 |
| 44255.977465277785 | 31.956 |
| 44256.01913194445 | 31.976 |
| 44256.06079861111 | 31.976 |
| 44256.102465277785 | 32.014 |
| 44256.14413194445 | 31.976 |
| 44256.18579861111 | 31.976 |
| 44256.227465277785 | 31.995 |
| 44256.26913194445 | 31.995 |
| 44256.31079861111 | 31.956 |
| 44256.352465277785 | 31.995 |
| 44256.39413194445 | 31.976 |
| 44256.43579861111 | 32.014 |
| 44256.477465277785 | 32.265 |
| 44256.51913194445 | 32.999 |
| 44256.56079861111 | 33.694 |
| 44256.602465277785 | 34.717 |
| 44256.64413194445 | 35.47 |
| 44256.68579861111 | 35.238 |
| 44256.727465277785 | 34.543 |
| 44256.76913194445 | 34.659 |
| 44256.81079861111 | 34.794 |
| 44256.852465277785 | 34.389 |
| 44256.89413194445 | 33.52 |
| 44256.93579861111 | 32.613 |
| 44256.977465277785 | 31.956 |
| 44257.01913194445 | 31.918 |
| 44257.06079861111 | 31.956 |
| 44257.102465277785 | 31.976 |
| 44257.14413194445 | 31.976 |
| 44257.18579861111 | 31.956 |
| 44257.227465277785 | 31.995 |
| 44257.26913194445 | 31.976 |
| 44257.31079861111 | 31.976 |
| 44257.352465277785 | 31.956 |
| 44257.39413194445 | 31.956 |
| 44257.43579861111 | 32.053 |
| 44257.477465277785 | 32.439 |
| 44257.51913194445 | 33.52 |
| 44257.56079861111 | 35.142 |
| 44257.602465277785 | 37.516 |
| 44257.64413194445 | 38.868 |
| 44257.68579861111 | 39.292 |
| 44257.727465277785 | 38.868 |
| 44257.76913194445 | 38.269 |
| 44257.81079861111 | 37.574 |
| 44257.852465277785 | 36.551 |
| 44257.89413194445 | 35.451 |
| 44257.93579861111 | 34.215 |
| 44257.977465277785 | 33.25 |
| 44258.01913194445 | 32.362 |
| 44258.06079861111 | 31.995 |
| 44258.102465277785 | 31.976 |
| 44258.14413194445 | 31.976 |
| 44258.18579861111 | 31.976 |
| 44258.227465277785 | 32.014 |
| 44258.26913194445 | 31.976 |
| 44258.31079861111 | 31.976 |
| 44258.352465277785 | 31.995 |
| 44258.39413194445 | 31.976 |
| 44258.43579861111 | 32.111 |
| 44258.477465277785 | 33.057 |
| 44258.51913194445 | 34.736 |
| 44258.56079861111 | 37.555 |
| 44258.602465277785 | 39.852 |
| 44258.64413194445 | 41.049 |
| 44258.68579861111 | 41.242 |
| 44258.727465277785 | 40.277 |
| 44258.76913194445 | 39.466 |
| 44258.81079861111 | 38.655 |
| 44258.852465277785 | 37.555 |
| 44258.89413194445 | 36.377 |
| 44258.93579861111 | 35.2 |
| 44258.977465277785 | 34.08 |
| 44259.01913194445 | 33.211 |
| 44259.06079861111 | 32.555 |
| 44259.102465277785 | 32.034 |
| 44259.14413194445 | 31.976 |
| 44259.18579861111 | 31.976 |
| 44259.227465277785 | 32.014 |
| 44259.26913194445 | 31.995 |
| 44259.31079861111 | 31.995 |
| 44259.352465277785 | 31.976 |
| 44259.39413194445 | 32.014 |
| 44259.43579861111 | 32.072 |
| 44259.477465277785 | 33.095 |
| 44259.51913194445 | 34.273 |
| 44259.56079861111 | 35.277 |
| 44259.602465277785 | 35.817 |
| 44259.64413194445 | 35.779 |
| 44259.68579861111 | 35.605 |
| 44259.727465277785 | 35.238 |
| 44259.76913194445 | 34.987 |
| 44259.81079861111 | 34.756 |
| 44259.852465277785 | 34.505 |
| 44259.89413194445 | 34.215 |
| 44259.93579861111 | 33.906 |
| 44259.977465277785 | 33.655 |
| 44260.01913194445 | 33.288 |
| 44260.06079861111 | 32.844 |
| 44260.102465277785 | 32.458 |
| 44260.14413194445 | 31.995 |
| 44260.18579861111 | 31.995 |
| 44260.227465277785 | 31.976 |
| 44260.26913194445 | 31.937 |
| 44260.31079861111 | 31.976 |
| 44260.352465277785 | 32.014 |
| 44260.39413194445 | 31.995 |
| 44260.43579861111 | 32.4 |
| 44260.477465277785 | 34.601 |
| 44260.51913194445 | 37.651 |
| 44260.56079861111 | 40.644 |
| 44260.602465277785 | 42.516 |
| 44260.64413194445 | 43.211 |
| 44260.68579861111 | 42.883 |
| 44260.727465277785 | 41.725 |
| 44260.76913194445 | 40.702 |
| 44260.81079861111 | 39.698 |
| 44260.852465277785 | 38.501 |
| 44260.89413194445 | 37.188 |
| 44260.93579861111 | 35.856 |
| 44260.977465277785 | 34.736 |
| 44261.01913194445 | 33.771 |
| 44261.06079861111 | 32.864 |
| 44261.102465277785 | 32.149 |
| 44261.14413194445 | 31.976 |
| 44261.18579861111 | 31.976 |
| 44261.227465277785 | 31.995 |
| 44261.26913194445 | 31.956 |
| 44261.31079861111 | 31.995 |
| 44261.352465277785 | 31.956 |
| 44261.39413194445 | 31.976 |
| 44261.43579861111 | 32.381 |
| 44261.477465277785 | 34.215 |
| 44261.51913194445 | 37.188 |
| 44261.56079861111 | 40.122 |
| 44261.602465277785 | 42.111 |
| 44261.64413194445 | 42.613 |
| 44261.68579861111 | 42.516 |
| 44261.727465277785 | 41.841 |
| 44261.76913194445 | 41.107 |
| 44261.81079861111 | 40.2 |
| 44261.852465277785 | 38.926 |
| 44261.89413194445 | 37.651 |
| 44261.93579861111 | 36.493 |
| 44261.977465277785 | 35.315 |
| 44262.01913194445 | 34.35 |
| 44262.06079861111 | 33.52 |
| 44262.102465277785 | 32.806 |
| 44262.14413194445 | 32.246 |
| 44262.18579861111 | 31.937 |
| 44262.227465277785 | 32.014 |
| 44262.26913194445 | 31.956 |
| 44262.31079861111 | 31.956 |
| 44262.352465277785 | 31.995 |
| 44262.39413194445 | 32.034 |
| 44262.43579861111 | 33.173 |
| 44262.477465277785 | 36.455 |
| 44262.51913194445 | 39.428 |
| 44262.56079861111 | 41.281 |
| 44262.602465277785 | 43.134 |
| 44262.64413194445 | 44.196 |
| 44262.68579861111 | 44.061 |
| 44262.727465277785 | 43.308 |
| 44262.76913194445 | 42.265 |
| 44262.81079861111 | 41.261 |
| 44262.852465277785 | 40.007 |
| 44262.89413194445 | 38.675 |
| 44262.93579861111 | 37.439 |
| 44262.977465277785 | 36.281 |
| 44263.01913194445 | 35.296 |
| 44263.06079861111 | 34.447 |
| 44263.102465277785 | 33.771 |
| 44263.14413194445 | 33.25 |
| 44263.18579861111 | 32.844 |
| 44263.227465277785 | 32.536 |
| 44263.26913194445 | 32.323 |
| 44263.31079861111 | 32.227 |
| 44263.352465277785 | 32.4 |
| 44263.39413194445 | 33.134 |
| 44263.43579861111 | 34.833 |
| 44263.477465277785 | 37.092 |
| 44263.51913194445 | 38.327 |
| 44263.56079861111 | 40.509 |
| 44263.602465277785 | 42.632 |
| 44263.64413194445 | 42.362 |
| 44263.68579861111 | 42.536 |
| 44263.727465277785 | 42.362 |
| 44263.76913194445 | 41.493 |
| 44263.81079861111 | 40.74 |
| 44263.852465277785 | 39.833 |
| 44263.89413194445 | 38.79 |
| 44263.93579861111 | 37.709 |
| 44263.977465277785 | 36.744 |
| 44264.01913194445 | 35.76 |
| 44264.06079861111 | 35.026 |
| 44264.102465277785 | 34.408 |
| 44264.14413194445 | 33.848 |
| 44264.18579861111 | 33.424 |
| 44264.227465277785 | 33.057 |
| 44264.26913194445 | 32.709 |
| 44264.31079861111 | 32.632 |
| 44264.352465277785 | 32.671 |
| 44264.39413194445 | 33.732 |
| 44264.43579861111 | 35.875 |
| 44264.477465277785 | 38.578 |
| 44264.51913194445 | 41.319 |
| 44264.56079861111 | 43.559 |
| 44264.602465277785 | 45.123 |
| 44264.64413194445 | 45.798 |
| 44264.68579861111 | 45.605 |
| 44264.727465277785 | 44.408 |
| 44264.76913194445 | 43.346 |
| 44264.81079861111 | 42.111 |
| 44264.852465277785 | 40.74 |
| 44264.89413194445 | 39.428 |
| 44264.93579861111 | 38.057 |
| 44264.977465277785 | 37.053 |
| 44265.01913194445 | 36.358 |
| 44265.06079861111 | 35.817 |
| 44265.102465277785 | 35.122 |
| 44265.14413194445 | 34.736 |
| 44265.18579861111 | 34.273 |
| 44265.227465277785 | 33.906 |
| 44265.26913194445 | 33.597 |
| 44265.31079861111 | 32.825 |
| 44265.352465277785 | 32.574 |
| 44265.39413194445 | 32.709 |
| 44265.43579861111 | 33.964 |
| 44265.477465277785 | 36.126 |
| 44265.51913194445 | 37.883 |
| 44265.56079861111 | 39.814 |
| 44265.602465277785 | 40.489 |
| 44265.64413194445 | 41.377 |
| 44265.68579861111 | 40.103 |
| 44265.727465277785 | 39.428 |
| 44265.76913194445 | 38.308 |
| 44265.81079861111 | 37.188 |
| 44265.852465277785 | 35.991 |
| 44265.89413194445 | 35.026 |
| 44265.93579861111 | 33.926 |
| 44265.977465277785 | 32.844 |
| 44266.01913194445 | 32.034 |
| 44266.06079861111 | 31.995 |
| 44266.102465277785 | 31.956 |
| 44266.14413194445 | 31.956 |
| 44266.18579861111 | 31.995 |
| 44266.227465277785 | 31.956 |
| 44266.26913194445 | 31.956 |
| 44266.31079861111 | 31.995 |
| 44266.352465277785 | 31.995 |
| 44266.39413194445 | 32.014 |
| 44266.43579861111 | 32.227 |
| 44266.477465277785 | 33.192 |
| 44266.51913194445 | 34.061 |
| 44266.56079861111 | 36.667 |
| 44266.602465277785 | 39.138 |
| 44266.64413194445 | 39.717 |
| 44266.68579861111 | 40.258 |
| 44266.727465277785 | 39.563 |
| 44266.76913194445 | 38.346 |
| 44266.81079861111 | 37.246 |
| 44266.852465277785 | 36.223 |
| 44266.89413194445 | 35.315 |
| 44266.93579861111 | 34.505 |
| 44266.977465277785 | 33.887 |
| 44267.01913194445 | 33.231 |
| 44267.06079861111 | 32.671 |
| 44267.102465277785 | 32.304 |
| 44267.14413194445 | 31.995 |
| 44267.18579861111 | 31.976 |
| 44267.227465277785 | 31.937 |
| 44267.26913194445 | 31.937 |
| 44267.31079861111 | 31.976 |
| 44267.352465277785 | 31.937 |
| 44267.39413194445 | 32.014 |
| 44267.43579861111 | 32.98 |
| 44267.477465277785 | 35.605 |
| 44267.51913194445 | 38.829 |
| 44267.56079861111 | 40.373 |
| 44267.602465277785 | 41.261 |
| 44267.64413194445 | 41.57 |
| 44267.68579861111 | 41.86 |
| 44267.727465277785 | 41.493 |
| 44267.76913194445 | 40.682 |
| 44267.81079861111 | 39.505 |
| 44267.852465277785 | 38.404 |
| 44267.89413194445 | 37.304 |
| 44267.93579861111 | 36.319 |
| 44267.977465277785 | 35.412 |
| 44268.01913194445 | 34.505 |
| 44268.06079861111 | 33.848 |
| 44268.102465277785 | 33.231 |
| 44268.14413194445 | 32.767 |
| 44268.18579861111 | 32.613 |
| 44268.227465277785 | 32.555 |
| 44268.26913194445 | 32.555 |
| 44268.31079861111 | 32.844 |
| 44268.352465277785 | 33.308 |
| 44268.39413194445 | 34.176 |
| 44268.43579861111 | 35.566 |
| 44268.477465277785 | 37.072 |
| 44268.51913194445 | 38.076 |
| 44268.56079861111 | 39.64 |
| 44268.602465277785 | 39.08 |
| 44268.64413194445 | 39.157 |
| 44268.68579861111 | 39.061 |
| 44268.727465277785 | 38.848 |
| 44268.76913194445 | 38.211 |
| 44268.81079861111 | 37.246 |
| 44268.852465277785 | 36.474 |
| 44268.89413194445 | 35.837 |
| 44268.93579861111 | 35.161 |
| 44268.977465277785 | 34.543 |
| 44269.01913194445 | 34.061 |
| 44269.06079861111 | 33.559 |
| 44269.14413194445 | 33.231 |
| 44269.18579861111 | 33.037 |
| 44269.227465277785 | 32.748 |
| 44269.26913194445 | 32.458 |
| 44269.31079861111 | 32.072 |
| 44269.352465277785 | 31.976 |
| 44269.39413194445 | 31.976 |
| 44269.43579861111 | 32.034 |
| 44269.477465277785 | 32.169 |
| 44269.51913194445 | 32.555 |
| 44269.56079861111 | 33.037 |
| 44269.602465277785 | 33.675 |
| 44269.64413194445 | 34.563 |
| 44269.68579861111 | 35.007 |
| 44269.727465277785 | 34.794 |
| 44269.76913194445 | 34.447 |
| 44269.81079861111 | 33.983 |
| 44269.852465277785 | 33.636 |
| 44269.89413194445 | 33.211 |
| 44269.93579861111 | 32.96 |
| 44269.977465277785 | 32.613 |
| 44270.01913194445 | 32.323 |
| 44270.06079861111 | 31.995 |
| 44270.102465277785 | 31.976 |
| 44270.14413194445 | 31.976 |
| 44270.18579861111 | 31.976 |
| 44270.227465277785 | 31.976 |
| 44270.26913194445 | 31.956 |
| 44270.31079861111 | 31.976 |
| 44270.352465277785 | 31.956 |
| 44270.39413194445 | 31.956 |
| 44270.43579861111 | 32.034 |
| 44270.477465277785 | 32.034 |
| 44270.51913194445 | 32.729 |
| 44270.56079861111 | 34.427 |
| 44270.602465277785 | 37.188 |
| 44270.64413194445 | 39.138 |
| 44270.68579861111 | 39.794 |
| 44270.727465277785 | 39.64 |
| 44270.76913194445 | 39.35 |
| 44270.81079861111 | 38.675 |
| 44270.852465277785 | 37.864 |
| 44270.89413194445 | 36.995 |
| 44270.93579861111 | 36.165 |
| 44270.977465277785 | 35.489 |
| 44271.01913194445 | 35.007 |
| 44271.06079861111 | 34.485 |
| 44271.102465277785 | 33.964 |
| 44271.14413194445 | 33.559 |
| 44271.18579861111 | 33.018 |
| 44271.227465277785 | 32.767 |
| 44271.26913194445 | 32.362 |
| 44271.31079861111 | 31.995 |
| 44271.352465277785 | 31.956 |
| 44271.39413194445 | 31.995 |
| 44271.43579861111 | 33.231 |
| 44271.477465277785 | 35.161 |
| 44271.51913194445 | 37.497 |
| 44271.56079861111 | 39.717 |
| 44271.602465277785 | 40.605 |
| 44271.64413194445 | 39.852 |
| 44271.68579861111 | 39.196 |
| 44271.727465277785 | 38.018 |
| 44271.76913194445 | 37.902 |
| 44271.81079861111 | 37.536 |
| 44271.852465277785 | 36.918 |
| 44271.89413194445 | 35.972 |
| 44271.93579861111 | 35.335 |
| 44271.977465277785 | 34.736 |
| 44272.01913194445 | 34.331 |
| 44272.06079861111 | 34.041 |
| 44272.102465277785 | 33.771 |
| 44272.14413194445 | 33.675 |
| 44272.18579861111 | 33.501 |
| 44272.227465277785 | 33.269 |
| 44272.26913194445 | 33.076 |
| 44272.31079861111 | 32.883 |
| 44272.352465277785 | 32.671 |
| 44272.39413194445 | 32.844 |
| 44272.43579861111 | 33.037 |
| 44272.477465277785 | 34.119 |
| 44272.51913194445 | 36.261 |
| 44272.56079861111 | 39.119 |
| 44272.602465277785 | 41.706 |
| 44272.64413194445 | 43.134 |
| 44272.68579861111 | 43.771 |
| 44272.727465277785 | 43.404 |
| 44272.76913194445 | 42.15 |
| 44272.81079861111 | 40.875 |
| 44272.852465277785 | 39.794 |
| 44272.89413194445 | 38.501 |
| 44272.93579861111 | 37.034 |
| 44272.977465277785 | 35.605 |
| 44273.01913194445 | 34.35 |
| 44273.06079861111 | 33.288 |
| 44273.102465277785 | 32.362 |
| 44273.14413194445 | 31.976 |
| 44273.18579861111 | 31.995 |
| 44273.227465277785 | 31.976 |
| 44273.26913194445 | 31.976 |
| 44273.31079861111 | 31.995 |
| 44273.352465277785 | 31.995 |
| 44273.39413194445 | 31.976 |
| 44273.43579861111 | 32.034 |
| 44273.477465277785 | 32.883 |
| 44273.51913194445 | 34.794 |
| 44273.56079861111 | 38.308 |
| 44273.602465277785 | 41.57 |
| 44273.64413194445 | 43.675 |
| 44273.68579861111 | 44.814 |
| 44273.727465277785 | 44.872 |
| 44273.76913194445 | 43.887 |
| 44273.81079861111 | 42.825 |
| 44273.852465277785 | 41.956 |
| 44273.89413194445 | 40.895 |
| 44273.93579861111 | 39.582 |
| 44273.977465277785 | 38.288 |
| 44274.01913194445 | 37.149 |
| 44274.06079861111 | 36.068 |
| 44274.102465277785 | 35.2 |
| 44274.14413194445 | 34.408 |
| 44274.18579861111 | 33.694 |
| 44274.227465277785 | 33.231 |
| 44274.26913194445 | 32.729 |
| 44274.31079861111 | 32.362 |
| 44274.352465277785 | 32.227 |
| 44274.39413194445 | 32.555 |
| 44274.43579861111 | 33.906 |
| 44274.477465277785 | 36.416 |
| 44274.51913194445 | 39.543 |
| 44274.56079861111 | 42.4 |
| 44274.602465277785 | 45.103 |
| 44274.64413194445 | 46.899 |
| 44274.68579861111 | 47.323 |
| 44274.727465277785 | 47.401 |
| 44274.76913194445 | 46.493 |
| 44274.81079861111 | 44.794 |
| 44274.852465277785 | 43.52 |
| 44274.89413194445 | 41.976 |
| 44274.93579861111 | 40.354 |
| 44274.977465277785 | 38.848 |
| 44275.01913194445 | 37.594 |
| 44275.06079861111 | 36.416 |
| 44275.102465277785 | 35.528 |
| 44275.14413194445 | 34.833 |
| 44275.18579861111 | 34.312 |
| 44275.227465277785 | 33.81 |
| 44275.26913194445 | 33.597 |
| 44275.31079861111 | 33.308 |
| 44275.352465277785 | 33.095 |
| 44275.39413194445 | 33.597 |
| 44275.43579861111 | 34.891 |
| 44275.477465277785 | 37.574 |
| 44275.51913194445 | 40.393 |
| 44275.56079861111 | 43.25 |
| 44275.602465277785 | 45.624 |
| 44275.64413194445 | 47.343 |
| 44275.68579861111 | 48.115 |
| 44275.727465277785 | 47.285 |
| 44275.76913194445 | 46.011 |
| 44275.81079861111 | 44.447 |
| 44275.852465277785 | 42.96 |
| 44275.89413194445 | 41.512 |
| 44275.93579861111 | 40.258 |
| 44275.977465277785 | 39.138 |
| 44276.01913194445 | 38.153 |
| 44276.06079861111 | 37.323 |
| 44276.102465277785 | 34.833 |
| 44276.14413194445 | 33.771 |
| 44276.18579861111 | 33.597 |
| 44276.227465277785 | 33.617 |
| 44276.26913194445 | 33.404 |
| 44276.31079861111 | 33.346 |
| 44276.352465277785 | 33.153 |
| 44276.39413194445 | 33.076 |
| 44276.43579861111 | 34.312 |
| 44276.477465277785 | 35.798 |
| 44276.51913194445 | 37.864 |
| 44276.56079861111 | 41.435 |
| 44276.602465277785 | 41.493 |
| 44276.64413194445 | 41.937 |
| 44276.68579861111 | 41.628 |
| 44276.727465277785 | 41.474 |
| 44276.76913194445 | 40.489 |
| 44276.81079861111 | 39.929 |
| 44276.852465277785 | 39.003 |
| 44276.89413194445 | 37.709 |
| 44276.93579861111 | 36.184 |
| 44276.977465277785 | 35.373 |
| 44277.01913194445 | 34.794 |
| 44277.06079861111 | 34.35 |
| 44277.102465277785 | 33.617 |
| 44277.14413194445 | 33.037 |
| 44277.18579861111 | 32.941 |
| 44277.227465277785 | 32.787 |
| 44277.26913194445 | 32.439 |
| 44277.31079861111 | 32.362 |
| 44277.352465277785 | 32.767 |
| 44277.39413194445 | 33.52 |
| 44277.43579861111 | 34.814 |
| 44277.477465277785 | 36.879 |
| 44277.51913194445 | 39.621 |
| 44277.56079861111 | 42.671 |
| 44277.602465277785 | 44.234 |
| 44277.64413194445 | 44.466 |
| 44277.68579861111 | 44.968 |
| 44277.727465277785 | 44.794 |
| 44277.76913194445 | 43.578 |
| 44277.81079861111 | 42.362 |
| 44277.852465277785 | 41.068 |
| 44277.89413194445 | 39.601 |
| 44277.93579861111 | 38.675 |
| 44277.977465277785 | 37.613 |
| 44278.01913194445 | 36.455 |
| 44278.06079861111 | 35.547 |
| 44278.102465277785 | 34.678 |
| 44278.14413194445 | 33.81 |
| 44278.18579861111 | 33.095 |
| 44278.227465277785 | 32.593 |
| 44278.26913194445 | 32.362 |
| 44278.31079861111 | 32.207 |
| 44278.352465277785 | 32.207 |
| 44278.39413194445 | 32.362 |
| 44278.43579861111 | 33.578 |
| 44278.477465277785 | 34.968 |
| 44278.51913194445 | 36.3 |
| 44278.56079861111 | 37.941 |
| 44278.602465277785 | 40.219 |
| 44278.64413194445 | 40.837 |
| 44278.68579861111 | 40.547 |
| 44278.727465277785 | 40.644 |
| 44278.76913194445 | 40.142 |
| 44278.81079861111 | 39.196 |
| 44278.852465277785 | 38.211 |
| 44278.89413194445 | 37.574 |
| 44278.93579861111 | 36.802 |
| 44278.977465277785 | 35.953 |
| 44279.01913194445 | 35.161 |
| 44279.06079861111 | 34.621 |
| 44279.102465277785 | 34.157 |
| 44279.14413194445 | 33.752 |
| 44279.18579861111 | 33.327 |
| 44279.227465277785 | 32.902 |
| 44279.26913194445 | 32.613 |
| 44279.31079861111 | 32.4 |
| 44279.352465277785 | 32.362 |
| 44279.39413194445 | 32.69 |
| 44279.43579861111 | 33.732 |
| 44279.477465277785 | 35.875 |
| 44279.51913194445 | 38.482 |
| 44279.56079861111 | 41.049 |
| 44279.602465277785 | 41.59 |
| 44279.64413194445 | 42.941 |
| 44279.68579861111 | 42.69 |
| 44279.727465277785 | 42.169 |
| 44279.76913194445 | 41.532 |
| 44279.81079861111 | 40.682 |
| 44279.852465277785 | 39.698 |
| 44279.89413194445 | 38.713 |
| 44279.93579861111 | 37.555 |
| 44279.977465277785 | 36.512 |
| 44280.01913194445 | 35.74 |
| 44280.06079861111 | 34.91 |
| 44280.102465277785 | 34.273 |
| 44280.14413194445 | 33.771 |
| 44280.18579861111 | 33.385 |
| 44280.227465277785 | 33.211 |
| 44280.26913194445 | 33.076 |
| 44280.31079861111 | 32.864 |
| 44280.352465277785 | 32.902 |
| 44280.39413194445 | 33.211 |
| 44280.43579861111 | 33.906 |
| 44280.477465277785 | 35.393 |
| 44280.51913194445 | 36.242 |
| 44280.56079861111 | 37.883 |
| 44280.602465277785 | 39.91 |
| 44280.64413194445 | 41.667 |
| 44280.68579861111 | 42.825 |
| 44280.727465277785 | 42.671 |
| 44280.76913194445 | 42.188 |
| 44280.81079861111 | 41.261 |
| 44280.852465277785 | 40.122 |
| 44280.89413194445 | 39.273 |
| 44280.93579861111 | 38.404 |
| 44280.977465277785 | 37.458 |
| 44281.01913194445 | 36.474 |
| 44281.06079861111 | 35.644 |
| 44281.102465277785 | 34.987 |
| 44281.14413194445 | 34.312 |
| 44281.18579861111 | 33.848 |
| 44281.227465277785 | 33.482 |
| 44281.26913194445 | 33.173 |
| 44281.31079861111 | 32.883 |
| 44281.352465277785 | 32.787 |
| 44281.39413194445 | 33.037 |
| 44281.43579861111 | 33.926 |
| 44281.477465277785 | 35.431 |
| 44281.51913194445 | 37.227 |
| 44281.56079861111 | 39.254 |
| 44281.602465277785 | 40.74 |
| 44281.64413194445 | 41.223 |
| 44281.68579861111 | 41.165 |
| 44281.727465277785 | 40.875 |
| 44281.76913194445 | 40.335 |
| 44281.81079861111 | 39.292 |
| 44281.852465277785 | 38.462 |
| 44281.89413194445 | 37.632 |
| 44281.93579861111 | 36.918 |
| 44281.977465277785 | 36.03 |
| 44282.01913194445 | 35.277 |
| 44282.06079861111 | 34.447 |
| 44282.102465277785 | 33.829 |
| 44282.14413194445 | 33.057 |
| 44282.18579861111 | 32.497 |
| 44282.227465277785 | 32.169 |
| 44282.26913194445 | 32.014 |
| 44282.31079861111 | 31.995 |
| 44282.352465277785 | 31.976 |
| 44282.39413194445 | 32.13 |
| 44282.43579861111 | 33.153 |
| 44282.477465277785 | 35.2 |
| 44282.51913194445 | 38.269 |
| 44282.56079861111 | 41.107 |
| 44282.602465277785 | 43.424 |
| 44282.64413194445 | 44.891 |
| 44282.68579861111 | 45.296 |
| 44282.727465277785 | 43.964 |
| 44282.76913194445 | 42.922 |
| 44282.81079861111 | 41.763 |
| 44282.852465277785 | 40.567 |
| 44282.89413194445 | 39.331 |
| 44282.93579861111 | 38.076 |
| 44282.977465277785 | 36.783 |
| 44283.01913194445 | 35.528 |
| 44283.06079861111 | 34.466 |
| 44283.102465277785 | 33.482 |
| 44283.14413194445 | 32.787 |
| 44283.18579861111 | 32.169 |
| 44283.227465277785 | 32.014 |
| 44283.26913194445 | 31.995 |
| 44283.31079861111 | 31.976 |
| 44283.352465277785 | 31.995 |
| 44283.39413194445 | 31.995 |
| 44283.43579861111 | 32.458 |
| 44283.477465277785 | 34.447 |
| 44283.51913194445 | 37.709 |
| 44283.56079861111 | 41.628 |
| 44283.602465277785 | 44.408 |
| 44283.64413194445 | 46.377 |
| 44283.68579861111 | 47.536 |
| 44283.727465277785 | 47.709 |
| 44283.76913194445 | 46.609 |
| 44283.81079861111 | 45.045 |
| 44283.852465277785 | 43.655 |
| 44283.89413194445 | 42.265 |
| 44283.93579861111 | 40.682 |
| 44283.977465277785 | 39.138 |
| 44284.01913194445 | 37.748 |
| 44284.06079861111 | 36.416 |
| 44284.102465277785 | 35.47 |
| 44284.14413194445 | 34.563 |
| 44284.18579861111 | 33.926 |
| 44284.227465277785 | 33.385 |
| 44284.26913194445 | 32.98 |
| 44284.31079861111 | 32.593 |
| 44284.352465277785 | 32.497 |
| 44284.39413194445 | 33.057 |
| 44284.43579861111 | 34.678 |
| 44284.477465277785 | 37.439 |
| 44284.51913194445 | 40.586 |
| 44284.56079861111 | 43.675 |
| 44284.602465277785 | 46.416 |
| 44284.64413194445 | 48.308 |
| 44284.68579861111 | 49.157 |
| 44284.727465277785 | 48.501 |
| 44284.76913194445 | 47.072 |
| 44284.81079861111 | 45.74 |
| 44284.852465277785 | 43.906 |
| 44284.89413194445 | 41.841 |
| 44284.93579861111 | 39.736 |
| 44284.977465277785 | 37.439 |
| 44285.01913194445 | 36.242 |
| 44285.06079861111 | 34.756 |
| 44285.102465277785 | 33.095 |
| 44285.14413194445 | 32.13 |
| 44285.18579861111 | 32.034 |
| 44285.227465277785 | 31.995 |
| 44285.26913194445 | 32.053 |
| 44285.31079861111 | 32.053 |
| 44285.352465277785 | 32.053 |
| 44285.39413194445 | 32.053 |
| 44285.43579861111 | 32.323 |
| 44285.477465277785 | 33.597 |
| 44285.51913194445 | 35.566 |
| 44285.56079861111 | 38.115 |
| 44285.602465277785 | 39.196 |
| 44285.64413194445 | 40.528 |
| 44285.68579861111 | 41.049 |
| 44285.727465277785 | 41.146 |
| 44285.76913194445 | 40.702 |
| 44285.81079861111 | 39.485 |
| 44285.852465277785 | 37.98 |
| 44285.89413194445 | 36.86 |
| 44285.93579861111 | 35.798 |
| 44285.977465277785 | 34.678 |
| 44286.01913194445 | 33.636 |
| 44286.06079861111 | 32.613 |
| 44286.102465277785 | 31.995 |
| 44286.14413194445 | 31.976 |
| 44286.18579861111 | 32.014 |
| 44286.227465277785 | 32.014 |
| 44286.26913194445 | 31.976 |
| 44286.31079861111 | 31.995 |
| 44286.352465277785 | 31.995 |
| 44286.39413194445 | 32.014 |
| 44286.43579861111 | 32.111 |
| 44286.477465277785 | 33.153 |
| 44286.51913194445 | 34.659 |
| 44286.56079861111 | 37.4 |
| 44286.602465277785 | 40.933 |
| 44286.64413194445 | 42.787 |
| 44286.68579861111 | 44.177 |
| 44286.727465277785 | 44.679 |
| 44286.76913194445 | 43.559 |
| 44286.81079861111 | 42.15 |
| 44286.852465277785 | 40.895 |
| 44286.89413194445 | 39.621 |
| 44286.93579861111 | 38.192 |
| 44286.977465277785 | 36.744 |
| 44287.01913194445 | 35.528 |
| 44287.06079861111 | 34.37 |
| 44287.102465277785 | 33.366 |
| 44287.14413194445 | 32.536 |
| 44287.18579861111 | 32.014 |
| 44287.227465277785 | 31.995 |
| 44287.26913194445 | 32.014 |
| 44287.31079861111 | 31.995 |
| 44287.352465277785 | 31.976 |
| 44287.39413194445 | 32.034 |
| 44287.43579861111 | 32.497 |
| 44287.477465277785 | 34.389 |
| 44287.51913194445 | 37.632 |
| 44287.56079861111 | 41.648 |
| 44287.602465277785 | 44.601 |
| 44287.64413194445 | 46.821 |
| 44287.68579861111 | 48.096 |
| 44287.727465277785 | 48.308 |
| 44287.76913194445 | 47.13 |
| 44287.81079861111 | 45.702 |
| 44287.852465277785 | 44.234 |
| 44287.89413194445 | 42.594 |
| 44287.93579861111 | 40.817 |
| 44287.977465277785 | 39.138 |
| 44288.01913194445 | 37.574 |
| 44288.06079861111 | 36.3 |
| 44288.102465277785 | 35.219 |
| 44288.14413194445 | 34.312 |
| 44288.18579861111 | 33.597 |
| 44288.227465277785 | 33.192 |
| 44288.26913194445 | 32.825 |
| 44288.31079861111 | 32.478 |
| 44288.352465277785 | 32.439 |
| 44288.39413194445 | 33.037 |
| 44288.43579861111 | 34.891 |
| 44288.477465277785 | 37.651 |
| 44288.51913194445 | 40.914 |
| 44288.56079861111 | 44.041 |
| 44288.602465277785 | 46.763 |
| 44288.64413194445 | 48.771 |
| 44288.68579861111 | 49.872 |
| 44288.727465277785 | 49.949 |
| 44288.76913194445 | 48.694 |
| 44288.81079861111 | 47.072 |
| 44288.852465277785 | 45.586 |
| 44288.89413194445 | 43.868 |
| 44288.93579861111 | 42.014 |
| 44288.977465277785 | 40.296 |
| 44289.01913194445 | 38.79 |
| 44289.06079861111 | 37.458 |
| 44289.102465277785 | 36.435 |
| 44289.14413194445 | 35.586 |
| 44289.18579861111 | 34.871 |
| 44289.227465277785 | 34.35 |
| 44289.26913194445 | 33.887 |
| 44289.31079861111 | 33.559 |
| 44289.352465277785 | 33.366 |
| 44289.39413194445 | 33.926 |
| 44289.43579861111 | 35.798 |
| 44289.477465277785 | 38.559 |
| 44289.51913194445 | 41.841 |
| 44289.56079861111 | 45.123 |
| 44289.602465277785 | 47.825 |
| 44289.64413194445 | 49.756 |
| 44289.68579861111 | 50.837 |
| 44289.727465277785 | 50.798 |
| 44289.76913194445 | 49.389 |
| 44289.81079861111 | 47.709 |
| 44289.852465277785 | 45.953 |
| 44289.89413194445 | 44.099 |
| 44289.93579861111 | 42.169 |
| 44289.977465277785 | 40.393 |
| 44290.01913194445 | 38.964 |
| 44290.06079861111 | 37.651 |
| 44290.102465277785 | 36.59 |
| 44290.14413194445 | 35.76 |
| 44290.18579861111 | 35.161 |
| 44290.227465277785 | 34.678 |
| 44290.26913194445 | 34.273 |
| 44290.31079861111 | 33.964 |
| 44290.352465277785 | 33.848 |
| 44290.39413194445 | 34.524 |
| 44290.43579861111 | 36.3 |
| 44290.477465277785 | 38.346 |
| 44290.51913194445 | 41.204 |
| 44290.56079861111 | 44.331 |
| 44290.602465277785 | 46.59 |
| 44290.64413194445 | 48.906 |
| 44290.68579861111 | 50.47 |
| 44290.727465277785 | 50.277 |
| 44290.76913194445 | 49.621 |
| 44290.81079861111 | 47.941 |
| 44290.852465277785 | 46.3 |
| 44290.89413194445 | 44.099 |
| 44290.93579861111 | 42.053 |
| 44290.977465277785 | 40.373 |
| 44291.01913194445 | 39.041 |
| 44291.06079861111 | 37.806 |
| 44291.102465277785 | 36.841 |
| 44291.14413194445 | 36.146 |
| 44291.18579861111 | 35.509 |
| 44291.227465277785 | 35.026 |
| 44291.26913194445 | 34.64 |
| 44291.31079861111 | 34.292 |
| 44291.352465277785 | 34.331 |
| 44291.39413194445 | 34.949 |
| 44291.43579861111 | 36.628 |
| 44291.477465277785 | 39.447 |
| 44291.51913194445 | 41.049 |
| 44291.56079861111 | 44.543 |
| 44291.602465277785 | 47.439 |
| 44291.64413194445 | 49.273 |
| 44291.68579861111 | 50.354 |
| 44291.727465277785 | 50.393 |
| 44291.76913194445 | 49.061 |
| 44291.81079861111 | 47.323 |
| 44291.852465277785 | 45.451 |
| 44291.89413194445 | 43.385 |
| 44291.93579861111 | 41.416 |
| 44291.977465277785 | 39.794 |
| 44292.01913194445 | 38.346 |
| 44292.06079861111 | 37.188 |
| 44292.102465277785 | 36.57 |
| 44292.14413194445 | 36.126 |
| 44292.18579861111 | 35.682 |
| 44292.227465277785 | 35.2 |
| 44292.26913194445 | 34.891 |
| 44292.31079861111 | 34.775 |
| 44292.352465277785 | 34.775 |
| 44292.39413194445 | 35.315 |
| 44292.43579861111 | 37.188 |
| 44292.477465277785 | 39.157 |
| 44292.51913194445 | 40.817 |
| 44292.56079861111 | 43.424 |
| 44292.602465277785 | 43.713 |
| 44292.64413194445 | 43.636 |
| 44292.68579861111 | 43.308 |
| 44292.727465277785 | 42.381 |
| 44292.76913194445 | 41.455 |
| 44292.81079861111 | 40.18 |
| 44292.852465277785 | 39.234 |
| 44292.89413194445 | 38.366 |
| 44292.93579861111 | 37.42 |
| 44292.977465277785 | 36.532 |
| 44293.01913194445 | 35.682 |
| 44293.06079861111 | 35.161 |
| 44293.102465277785 | 34.756 |
| 44293.14413194445 | 34.408 |
| 44293.18579861111 | 34.292 |
| 44293.227465277785 | 34.196 |
| 44293.26913194445 | 34.138 |
| 44293.31079861111 | 34.119 |
| 44293.352465277785 | 34.389 |
| 44293.39413194445 | 35.238 |
| 44293.43579861111 | 36.261 |
| 44293.477465277785 | 37.632 |
| 44293.51913194445 | 39.852 |
| 44293.56079861111 | 43.115 |
| 44293.602465277785 | 45.316 |
| 44293.64413194445 | 45.567 |
| 44293.68579861111 | 46.088 |
| 44293.727465277785 | 47.536 |
| 44293.76913194445 | 46.899 |
| 44293.81079861111 | 44.814 |
| 44293.852465277785 | 43.038 |
| 44293.89413194445 | 41.512 |
| 44293.93579861111 | 40.007 |
| 44293.977465277785 | 38.655 |
| 44294.01913194445 | 37.555 |
| 44294.06079861111 | 36.512 |
| 44294.102465277785 | 35.663 |
| 44294.14413194445 | 35.045 |
| 44294.18579861111 | 34.601 |
| 44294.227465277785 | 34.138 |
| 44294.26913194445 | 34.022 |
| 44294.31079861111 | 34.099 |
| 44294.352465277785 | 34.408 |
| 44294.39413194445 | 35.373 |
| 44294.43579861111 | 36.165 |
| 44294.477465277785 | 38.655 |
| 44294.51913194445 | 41.146 |
| 44294.56079861111 | 42.98 |
| 44294.602465277785 | 44.543 |
| 44294.64413194445 | 45.123 |
| 44294.68579861111 | 46.455 |
| 44294.727465277785 | 46.513 |
| 44294.76913194445 | 45.895 |
| 44294.81079861111 | 44.929 |
| 44294.852465277785 | 43.771 |
| 44294.89413194445 | 42.613 |
| 44294.93579861111 | 41.281 |
| 44294.977465277785 | 39.968 |
| 44295.01913194445 | 38.733 |
| 44295.06079861111 | 37.516 |
| 44295.102465277785 | 36.57 |
| 44295.14413194445 | 35.895 |
| 44295.18579861111 | 35.509 |
| 44295.227465277785 | 34.987 |
| 44295.26913194445 | 34.466 |
| 44295.31079861111 | 33.964 |
| 44295.352465277785 | 33.713 |
| 44295.39413194445 | 34.176 |
| 44295.43579861111 | 35.296 |
| 44295.477465277785 | 37.748 |
| 44295.51913194445 | 40.914 |
| 44295.56079861111 | 43.501 |
| 44295.602465277785 | 45.702 |
| 44295.64413194445 | 47.516 |
| 44295.68579861111 | 48.443 |
| 44295.727465277785 | 48.231 |
| 44295.76913194445 | 46.455 |
| 44295.81079861111 | 44.428 |
| 44295.852465277785 | 42.883 |
| 44295.89413194445 | 41.512 |
| 44295.93579861111 | 39.987 |
| 44295.977465277785 | 38.462 |
| 44296.01913194445 | 37.13 |
| 44296.06079861111 | 36.146 |
| 44296.102465277785 | 35.219 |
| 44296.14413194445 | 34.389 |
| 44296.18579861111 | 33.868 |
| 44296.227465277785 | 33.366 |
| 44296.26913194445 | 32.941 |
| 44296.31079861111 | 32.671 |
| 44296.352465277785 | 32.651 |
| 44296.39413194445 | 33.327 |
| 44296.43579861111 | 35.47 |
| 44296.477465277785 | 38.346 |
| 44296.51913194445 | 41.416 |
| 44296.56079861111 | 44.524 |
| 44296.602465277785 | 47.092 |
| 44296.64413194445 | 48.887 |
| 44296.68579861111 | 49.756 |
| 44296.727465277785 | 49.93 |
| 44296.76913194445 | 48.926 |
| 44296.81079861111 | 47.111 |
| 44296.852465277785 | 45.296 |
| 44296.89413194445 | 43.578 |
| 44296.93579861111 | 41.821 |
| 44296.977465277785 | 40.007 |
| 44297.01913194445 | 38.501 |
| 44297.06079861111 | 37.362 |
| 44297.102465277785 | 36.358 |
| 44297.14413194445 | 35.586 |
| 44297.18579861111 | 35.007 |
| 44297.227465277785 | 34.427 |
| 44297.26913194445 | 34.061 |
| 44297.31079861111 | 33.79 |
| 44297.352465277785 | 33.694 |
| 44297.39413194445 | 34.543 |
| 44297.43579861111 | 36.377 |
| 44297.477465277785 | 38.926 |
| 44297.51913194445 | 42.497 |
| 44297.56079861111 | 45.412 |
| 44297.602465277785 | 47.825 |
| 44297.64413194445 | 49.736 |
| 44297.68579861111 | 50.779 |
| 44297.727465277785 | 50.837 |
| 44297.76913194445 | 49.621 |
| 44297.81079861111 | 48.018 |
| 44297.852465277785 | 46.204 |
| 44297.89413194445 | 44.312 |
| 44297.93579861111 | 42.536 |
| 44297.977465277785 | 40.914 |
| 44298.01913194445 | 39.505 |
| 44298.06079861111 | 38.346 |
| 44298.102465277785 | 37.285 |
| 44298.14413194445 | 36.512 |
| 44298.18579861111 | 35.798 |
| 44298.227465277785 | 35.219 |
| 44298.26913194445 | 34.659 |
| 44298.31079861111 | 34.215 |
| 44298.352465277785 | 34.08 |
| 44298.39413194445 | 34.678 |
| 44298.43579861111 | 36.377 |
| 44298.477465277785 | 38.964 |
| 44298.51913194445 | 41.879 |
| 44298.56079861111 | 44.91 |
| 44298.602465277785 | 47.439 |
| 44298.64413194445 | 49.485 |
| 44298.68579861111 | 50.798 |
| 44298.727465277785 | 50.567 |
| 44298.76913194445 | 48.733 |
| 44298.81079861111 | 47.034 |
| 44298.852465277785 | 45.431 |
| 44298.89413194445 | 44.061 |
| 44298.93579861111 | 42.362 |
| 44298.977465277785 | 40.567 |
| 44299.01913194445 | 39.099 |
| 44299.06079861111 | 37.941 |
| 44299.102465277785 | 37.13 |
| 44299.14413194445 | 36.339 |
| 44299.18579861111 | 35.663 |
| 44299.227465277785 | 35.489 |
| 44299.26913194445 | 35.277 |
| 44299.31079861111 | 35.142 |
| 44299.352465277785 | 35.431 |
| 44299.39413194445 | 35.837 |
| 44299.43579861111 | 36.918 |
| 44299.477465277785 | 38.578 |
| 44299.51913194445 | 41.184 |
| 44299.56079861111 | 42.594 |
| 44299.602465277785 | 43.095 |
| 44299.64413194445 | 43.366 |
| 44299.68579861111 | 43.346 |
| 44299.727465277785 | 43.346 |
| 44299.76913194445 | 42.709 |
| 44299.81079861111 | 42.034 |
| 44299.852465277785 | 40.991 |
| 44299.89413194445 | 39.891 |
| 44299.93579861111 | 38.752 |
| 44299.977465277785 | 37.594 |
| 44300.01913194445 | 36.648 |
| 44300.06079861111 | 35.875 |
| 44300.102465277785 | 35.412 |
| 44300.14413194445 | 34.949 |
| 44300.18579861111 | 34.524 |
| 44300.227465277785 | 34.08 |
| 44300.26913194445 | 33.771 |
| 44300.31079861111 | 33.52 |
| 44300.352465277785 | 33.655 |
| 44300.39413194445 | 34.408 |
| 44300.43579861111 | 36.397 |
| 44300.477465277785 | 39.138 |
| 44300.51913194445 | 42.285 |
| 44300.56079861111 | 45.393 |
| 44300.602465277785 | 46.686 |
| 44300.64413194445 | 46.435 |
| 44300.68579861111 | 46.821 |
| 44300.727465277785 | 46.088 |
| 44300.76913194445 | 45.296 |
| 44300.81079861111 | 43.984 |
| 44300.852465277785 | 42.285 |
| 44300.89413194445 | 40.875 |
| 44300.93579861111 | 39.736 |
| 44300.977465277785 | 38.713 |
| 44301.01913194445 | 37.902 |
| 44301.06079861111 | 37.304 |
| 44301.102465277785 | 36.802 |
| 44301.14413194445 | 36.397 |
| 44301.18579861111 | 36.126 |
| 44301.227465277785 | 35.914 |
| 44301.26913194445 | 35.547 |
| 44301.31079861111 | 35.373 |
| 44301.352465277785 | 35.663 |
| 44301.39413194445 | 36.049 |
| 44301.43579861111 | 37.478 |
| 44301.477465277785 | 39.447 |
| 44301.51913194445 | 41.223 |
| 44301.56079861111 | 42.536 |
| 44301.602465277785 | 43.095 |
| 44301.64413194445 | 41.358 |
| 44301.68579861111 | 40.277 |
| 44301.727465277785 | 40.142 |
| 44301.76913194445 | 39.254 |
| 44301.81079861111 | 38.269 |
| 44301.852465277785 | 37.304 |
| 44301.89413194445 | 36.686 |
| 44301.93579861111 | 36.126 |
| 44301.977465277785 | 35.238 |
| 44302.01913194445 | 34.852 |
| 44302.06079861111 | 34.273 |
| 44302.102465277785 | 33.983 |
| 44302.14413194445 | 33.848 |
| 44302.18579861111 | 33.636 |
| 44302.227465277785 | 33.346 |
| 44302.26913194445 | 33.076 |
| 44302.31079861111 | 32.883 |
| 44302.352465277785 | 32.98 |
| 44302.39413194445 | 33.462 |
| 44302.43579861111 | 35.238 |
| 44302.477465277785 | 36.802 |
| 44302.51913194445 | 39.621 |
| 44302.56079861111 | 42.053 |
| 44302.602465277785 | 43.79 |
| 44302.64413194445 | 45.779 |
| 44302.68579861111 | 46.262 |
| 44302.727465277785 | 46.011 |
| 44302.76913194445 | 44.736 |
| 44302.81079861111 | 43.366 |
| 44302.852465277785 | 42.15 |
| 44302.89413194445 | 40.779 |
| 44302.93579861111 | 39.37 |
| 44302.977465277785 | 38.25 |
| 44303.01913194445 | 37.227 |
| 44303.06079861111 | 36.435 |
| 44303.102465277785 | 35.74 |
| 44303.14413194445 | 35.277 |
| 44303.18579861111 | 34.852 |
| 44303.227465277785 | 34.601 |
| 44303.26913194445 | 34.389 |
| 44303.31079861111 | 34.041 |
| 44303.352465277785 | 33.906 |
| 44303.39413194445 | 34.215 |
| 44303.43579861111 | 35.142 |
| 44303.477465277785 | 35.953 |
| 44303.51913194445 | 37.381 |
| 44303.56079861111 | 39.659 |
| 44303.602465277785 | 41.512 |
| 44303.64413194445 | 44.003 |
| 44303.68579861111 | 44.099 |
| 44303.727465277785 | 43.926 |
| 44303.76913194445 | 43.964 |
| 44303.81079861111 | 42.98 |
| 44303.852465277785 | 41.918 |
| 44303.89413194445 | 40.74 |
| 44303.93579861111 | 39.35 |
| 44303.977465277785 | 37.902 |
| 44304.01913194445 | 36.609 |
| 44304.06079861111 | 35.354 |
| 44304.102465277785 | 34.312 |
| 44304.14413194445 | 33.424 |
| 44304.18579861111 | 32.748 |
| 44304.227465277785 | 32.188 |
| 44304.26913194445 | 31.995 |
| 44304.31079861111 | 31.956 |
| 44304.352465277785 | 32.014 |
| 44304.39413194445 | 32.362 |
| 44304.43579861111 | 33.752 |
| 44304.477465277785 | 36.416 |
| 44304.51913194445 | 39.891 |
| 44304.56079861111 | 42.265 |
| 44304.602465277785 | 44.447 |
| 44304.64413194445 | 45.547 |
| 44304.68579861111 | 46.821 |
| 44304.727465277785 | 46.648 |
| 44304.76913194445 | 45.238 |
| 44304.81079861111 | 43.945 |
| 44304.852465277785 | 42.98 |
| 44304.89413194445 | 41.86 |
| 44304.93579861111 | 40.567 |
| 44304.977465277785 | 39.177 |
| 44305.01913194445 | 37.864 |
| 44305.06079861111 | 36.821 |
| 44305.102465277785 | 36.01 |
| 44305.14413194445 | 35.47 |
| 44305.18579861111 | 35.122 |
| 44305.227465277785 | 34.814 |
| 44305.26913194445 | 34.485 |
| 44305.31079861111 | 34.273 |
| 44305.352465277785 | 34.505 |
| 44305.39413194445 | 35.2 |
| 44305.43579861111 | 37.092 |
| 44305.477465277785 | 39.582 |
| 44305.51913194445 | 41.956 |
| 44305.56079861111 | 45.296 |
| 44305.602465277785 | 48.752 |
| 44305.64413194445 | 50.509 |
| 44305.68579861111 | 49.833 |
| 44305.727465277785 | 48.636 |
| 44305.76913194445 | 47.42 |
| 44305.81079861111 | 46.165 |
| 44305.852465277785 | 43.906 |
| 44305.89413194445 | 41.937 |
| 44305.93579861111 | 39.621 |
| 44305.977465277785 | 37.651 |
| 44306.01913194445 | 36.068 |
| 44306.06079861111 | 34.678 |
| 44306.102465277785 | 33.694 |
| 44306.14413194445 | 32.864 |
| 44306.18579861111 | 32.169 |
| 44306.227465277785 | 31.976 |
| 44306.26913194445 | 31.956 |
| 44306.31079861111 | 31.976 |
| 44306.352465277785 | 31.995 |
| 44306.39413194445 | 32.323 |
| 44306.43579861111 | 33.385 |
| 44306.477465277785 | 35.624 |
| 44306.51913194445 | 39.428 |
| 44306.56079861111 | 42.458 |
| 44306.602465277785 | 45.277 |
| 44306.64413194445 | 47.111 |
| 44306.68579861111 | 48.173 |
| 44306.727465277785 | 48.153 |
| 44306.76913194445 | 46.976 |
| 44306.81079861111 | 45.084 |
| 44306.852465277785 | 43.424 |
| 44306.89413194445 | 41.667 |
| 44306.93579861111 | 40.045 |
| 44306.977465277785 | 38.462 |
| 44307.01913194445 | 37.034 |
| 44307.06079861111 | 35.779 |
| 44307.102465277785 | 34.794 |
| 44307.14413194445 | 33.926 |
| 44307.18579861111 | 33.462 |
| 44307.227465277785 | 33.076 |
| 44307.26913194445 | 32.98 |
| 44307.31079861111 | 33.076 |
| 44307.352465277785 | 33.231 |
| 44307.39413194445 | 33.945 |
| 44307.43579861111 | 35.412 |
| 44307.477465277785 | 36.512 |
| 44307.51913194445 | 37.902 |
| 44307.56079861111 | 39.563 |
| 44307.602465277785 | 42.169 |
| 44307.64413194445 | 43.192 |
| 44307.68579861111 | 43.289 |
| 44307.727465277785 | 42.69 |
| 44307.76913194445 | 42.072 |
| 44307.81079861111 | 41.223 |
| 44307.852465277785 | 40.431 |
| 44307.89413194445 | 39.524 |
| 44307.93579861111 | 38.829 |
| 44307.977465277785 | 38.173 |
| 44308.01913194445 | 37.536 |
| 44308.06079861111 | 36.899 |
| 44308.102465277785 | 36.435 |
| 44308.14413194445 | 35.914 |
| 44308.18579861111 | 35.451 |
| 44308.227465277785 | 35.007 |
| 44308.26913194445 | 34.601 |
| 44308.31079861111 | 34.408 |
| 44308.352465277785 | 34.775 |
| 44308.39413194445 | 35.605 |
| 44308.43579861111 | 35.74 |
| 44308.477465277785 | 36.512 |
| 44308.51913194445 | 37.883 |
| 44308.56079861111 | 38.308 |
| 44308.602465277785 | 38.617 |
| 44308.64413194445 | 39.35 |
| 44308.68579861111 | 39.292 |
| 44308.727465277785 | 38.231 |
| 44308.76913194445 | 37.941 |
| 44308.81079861111 | 37.323 |
| 44308.852465277785 | 37.362 |
| 44308.89413194445 | 37.149 |
| 44308.93579861111 | 36.512 |
| 44308.977465277785 | 35.875 |
| 44309.01913194445 | 35.161 |
| 44309.06079861111 | 34.601 |
| 44309.102465277785 | 34.176 |
| 44309.14413194445 | 33.732 |
| 44309.18579861111 | 33.288 |
| 44309.227465277785 | 32.922 |
| 44309.26913194445 | 32.536 |
| 44309.31079861111 | 32.207 |
| 44309.352465277785 | 32.207 |
| 44309.39413194445 | 33.153 |
| 44309.43579861111 | 35.373 |
| 44309.477465277785 | 36.995 |
| 44309.51913194445 | 39.099 |
| 44309.56079861111 | 39.312 |
| 44309.602465277785 | 40.451 |
| 44309.64413194445 | 40.914 |
| 44309.68579861111 | 42.13 |
| 44309.727465277785 | 42.497 |
| 44309.76913194445 | 41.319 |
| 44309.81079861111 | 40.721 |
| 44309.852465277785 | 39.929 |
| 44309.89413194445 | 39.119 |
| 44309.93579861111 | 38.462 |
| 44309.977465277785 | 37.748 |
| 44310.01913194445 | 36.995 |
| 44310.06079861111 | 36.261 |
| 44310.102465277785 | 35.489 |
| 44310.14413194445 | 34.891 |
| 44310.18579861111 | 34.254 |
| 44310.227465277785 | 33.732 |
| 44310.26913194445 | 33.269 |
| 44310.31079861111 | 32.922 |
| 44310.352465277785 | 32.999 |
| 44310.39413194445 | 34.041 |
| 44310.43579861111 | 36.377 |
| 44310.477465277785 | 39.312 |
| 44310.51913194445 | 42.767 |
| 44310.56079861111 | 45.47 |
| 44310.602465277785 | 48.192 |
| 44310.64413194445 | 50.316 |
| 44310.68579861111 | 50.354 |
| 44310.727465277785 | 50.084 |
| 44310.76913194445 | 48.964 |
| 44310.81079861111 | 47.652 |
| 44310.852465277785 | 46.223 |
| 44310.89413194445 | 44.814 |
| 44310.93579861111 | 43.404 |
| 44310.977465277785 | 42.034 |
| 44311.01913194445 | 40.991 |
| 44311.06079861111 | 40.122 |
| 44311.102465277785 | 39.389 |
| 44311.14413194445 | 38.887 |
| 44311.18579861111 | 38.501 |
| 44311.227465277785 | 38.095 |
| 44311.26913194445 | 37.555 |
| 44311.31079861111 | 37.188 |
| 44311.352465277785 | 37.516 |
| 44311.39413194445 | 38.482 |
| 44311.43579861111 | 40.084 |
| 44311.477465277785 | 42.651 |
| 44311.51913194445 | 46.011 |
| 44311.56079861111 | 49.254 |
| 44311.602465277785 | 52.227 |
| 44311.64413194445 | 53.887 |
| 44311.68579861111 | 54.466 |
| 44311.727465277785 | 54.273 |
| 44311.76913194445 | 52.845 |
| 44311.81079861111 | 51.319 |
| 44311.852465277785 | 49.389 |
| 44311.89413194445 | 47.15 |
| 44311.93579861111 | 44.929 |
| 44311.977465277785 | 42.883 |
| 44312.01913194445 | 41.223 |
| 44312.06079861111 | 39.814 |
| 44312.102465277785 | 38.771 |
| 44312.14413194445 | 37.883 |
| 44312.18579861111 | 37.227 |
| 44312.227465277785 | 36.686 |
| 44312.26913194445 | 36.223 |
| 44312.31079861111 | 35.991 |
| 44312.352465277785 | 36.184 |
| 44312.39413194445 | 37.246 |
| 44312.43579861111 | 38.887 |
| 44312.477465277785 | 41.223 |
| 44312.51913194445 | 44.157 |
| 44312.56079861111 | 46.513 |
| 44312.602465277785 | 48.578 |
| 44312.64413194445 | 49.833 |
| 44312.68579861111 | 50.393 |
| 44312.727465277785 | 50.953 |
| 44312.76913194445 | 50.084 |
| 44312.81079861111 | 48.791 |
| 44312.852465277785 | 47.188 |
| 44312.89413194445 | 45.412 |
| 44312.93579861111 | 43.655 |
| 44312.977465277785 | 42.072 |
| 44313.01913194445 | 40.702 |
| 44313.06079861111 | 39.37 |
| 44313.102465277785 | 38.482 |
| 44313.14413194445 | 37.748 |
| 44313.18579861111 | 37.072 |
| 44313.227465277785 | 36.512 |
| 44313.26913194445 | 36.03 |
| 44313.31079861111 | 35.528 |
| 44313.352465277785 | 35.624 |
| 44313.39413194445 | 36.435 |
| 44313.43579861111 | 37.13 |
| 44313.477465277785 | 37.999 |
| 44313.51913194445 | 39.254 |
| 44313.56079861111 | 39.157 |
| 44313.602465277785 | 38.346 |
| 44313.64413194445 | 38.906 |
| 44313.68579861111 | 37.787 |
| 44313.727465277785 | 37.632 |
| 44313.76913194445 | 38.424 |
| 44313.81079861111 | 38.269 |
| 44313.852465277785 | 37.883 |
| 44313.89413194445 | 37.594 |
| 44313.93579861111 | 37.381 |
| 44313.977465277785 | 37.227 |
| 44314.01913194445 | 37.072 |
| 44314.06079861111 | 36.59 |
| 44314.102465277785 | 36.319 |
| 44314.14413194445 | 36.049 |
| 44314.18579861111 | 35.895 |
| 44314.227465277785 | 35.875 |
| 44314.26913194445 | 35.837 |
| 44314.31079861111 | 35.76 |
| 44314.352465277785 | 36.204 |
| 44314.39413194445 | 37.169 |
| 44314.43579861111 | 38.173 |
| 44314.477465277785 | 39.582 |
| 44314.51913194445 | 40.991 |
| 44314.56079861111 | 44.022 |
| 44314.602465277785 | 45.567 |
| 44314.64413194445 | 47.111 |
| 44314.68579861111 | 46.899 |
| 44314.727465277785 | 47.478 |
| 44314.76913194445 | 47.787 |
| 44314.81079861111 | 46.493 |
| 44314.852465277785 | 45.277 |
| 44314.89413194445 | 44.099 |
| 44314.93579861111 | 42.69 |
| 44314.977465277785 | 41.281 |
| 44315.01913194445 | 39.891 |
| 44315.06079861111 | 38.713 |
| 44315.102465277785 | 37.709 |
| 44315.14413194445 | 36.879 |
| 44315.18579861111 | 36.204 |
| 44315.227465277785 | 35.566 |
| 44315.26913194445 | 35.161 |
| 44315.31079861111 | 34.833 |
| 44315.352465277785 | 34.833 |
| 44315.39413194445 | 35.837 |
| 44315.43579861111 | 38.134 |
| 44315.477465277785 | 41.107 |
| 44315.51913194445 | 44.408 |
| 44315.56079861111 | 47.787 |
| 44315.602465277785 | 50.682 |
| 44315.64413194445 | 53.076 |
| 44315.68579861111 | 54.37 |
| 44315.727465277785 | 54.524 |
| 44315.76913194445 | 53.597 |
| 44315.81079861111 | 51.744 |
| 44315.852465277785 | 49.93 |
| 44315.89413194445 | 48.057 |
| 44315.93579861111 | 45.933 |
| 44315.977465277785 | 43.964 |
| 44316.01913194445 | 42.207 |
| 44316.06079861111 | 40.644 |
| 44316.102465277785 | 39.543 |
| 44316.14413194445 | 38.617 |
| 44316.18579861111 | 37.806 |
| 44316.227465277785 | 37.207 |
| 44316.26913194445 | 36.648 |
| 44316.31079861111 | 36.3 |
| 44316.352465277785 | 36.397 |
| 44316.39413194445 | 37.458 |
| 44316.43579861111 | 39.64 |
| 44316.477465277785 | 42.574 |
| 44316.51913194445 | 45.914 |
| 44316.56079861111 | 49.099 |
| 44316.602465277785 | 52.014 |
| 44316.64413194445 | 54.447 |
| 44316.68579861111 | 55.818 |
| 44316.727465277785 | 56.011 |
| 44316.76913194445 | 55.045 |
| 44316.81079861111 | 53.192 |
| 44316.852465277785 | 51.262 |
| 44316.89413194445 | 49.041 |
| 44316.93579861111 | 46.706 |
| 44316.977465277785 | 44.543 |
| 44317.01913194445 | 42.671 |
| 44317.06079861111 | 41.184 |
| 44317.102465277785 | 40.065 |
| 44317.14413194445 | 39.119 |
| 44317.18579861111 | 38.404 |
| 44317.227465277785 | 37.825 |
| 44317.26913194445 | 37.246 |
| 44317.31079861111 | 37.014 |
| 44317.352465277785 | 37.014 |
| 44317.39413194445 | 37.922 |
| 44317.43579861111 | 39.891 |
| 44317.477465277785 | 42.748 |
| 44317.51913194445 | 45.779 |
| 44317.56079861111 | 48.289 |
| 44317.602465277785 | 50.393 |
| 44317.64413194445 | 52.439 |
| 44317.68579861111 | 53.347 |
| 44317.727465277785 | 52.787 |
| 44317.76913194445 | 51.57 |
| 44317.81079861111 | 50.316 |
| 44317.852465277785 | 48.597 |
| 44317.89413194445 | 46.648 |
| 44317.93579861111 | 44.949 |
| 44317.977465277785 | 43.424 |
| 44318.01913194445 | 42.227 |
| 44318.06079861111 | 41.319 |
| 44318.102465277785 | 40.451 |
| 44318.14413194445 | 39.872 |
| 44318.18579861111 | 39.447 |
| 44318.227465277785 | 38.926 |
| 44318.26913194445 | 38.385 |
| 44318.31079861111 | 38.038 |
| 44318.352465277785 | 38.153 |
| 44318.39413194445 | 38.578 |
| 44318.43579861111 | 39.196 |
| 44318.477465277785 | 40.875 |
| 44318.51913194445 | 41.763 |
| 44318.56079861111 | 42.941 |
| 44318.602465277785 | 44.041 |
| 44318.64413194445 | 43.887 |
| 44318.68579861111 | 45.065 |
| 44318.727465277785 | 45.277 |
| 44318.76913194445 | 44.949 |
| 44318.81079861111 | 44.292 |
| 44318.852465277785 | 43.501 |
| 44318.89413194445 | 42.536 |
| 44318.93579861111 | 41.512 |
| 44318.977465277785 | 40.837 |
| 44319.01913194445 | 40.238 |
| 44319.06079861111 | 39.659 |
| 44319.102465277785 | 39.196 |
| 44319.14413194445 | 38.906 |
| 44319.18579861111 | 38.346 |
| 44319.227465277785 | 38.192 |
| 44319.26913194445 | 37.999 |
| 44319.31079861111 | 37.767 |
| 44319.352465277785 | 37.092 |
| 44319.39413194445 | 37.207 |
| 44319.43579861111 | 37.96 |
| 44319.477465277785 | 39.234 |
| 44319.51913194445 | 40.779 |
| 44319.56079861111 | 42.671 |
| 44319.602465277785 | 44.968 |
| 44319.64413194445 | 46.821 |
| 44319.68579861111 | 48.617 |
| 44319.727465277785 | 48.269 |
| 44319.76913194445 | 47.671 |
| 44319.81079861111 | 46.744 |
| 44319.852465277785 | 45.277 |
| 44319.89413194445 | 43.655 |
| 44319.93579861111 | 42.207 |
| 44319.977465277785 | 41.068 |
| 44320.01913194445 | 40.161 |
| 44320.06079861111 | 39.408 |
| 44320.102465277785 | 38.733 |
| 44320.14413194445 | 38.288 |
| 44320.18579861111 | 37.844 |
| 44320.227465277785 | 37.516 |
| 44320.26913194445 | 37.207 |
| 44320.31079861111 | 37.014 |
| 44320.352465277785 | 37.072 |
| 44320.39413194445 | 38.095 |
| 44320.43579861111 | 39.466 |
| 44320.477465277785 | 40.837 |
| 44320.51913194445 | 42.864 |
| 44320.56079861111 | 44.891 |
| 44320.602465277785 | 46.03 |
| 44320.64413194445 | 47.767 |
| 44320.68579861111 | 47.401 |
| 44320.727465277785 | 46.667 |
| 44320.76913194445 | 45.663 |
| 44320.81079861111 | 44.91 |
| 44320.852465277785 | 43.926 |
| 44320.89413194445 | 42.902 |
| 44320.93579861111 | 41.841 |
| 44320.977465277785 | 40.837 |
| 44321.01913194445 | 40.007 |
| 44321.06079861111 | 39.331 |
| 44321.102465277785 | 38.038 |
| 44321.14413194445 | 37.516 |
| 44321.18579861111 | 37.227 |
| 44321.227465277785 | 36.995 |
| 44321.26913194445 | 36.821 |
| 44321.31079861111 | 36.763 |
| 44321.352465277785 | 37.188 |
| 44321.39413194445 | 38.211 |
| 44321.43579861111 | 39.505 |
| 44321.477465277785 | 41.416 |
| 44321.51913194445 | 43.269 |
| 44321.56079861111 | 45.586 |
| 44321.602465277785 | 48.597 |
| 44321.64413194445 | 50.933 |
| 44321.68579861111 | 52.169 |
| 44321.727465277785 | 52.111 |
| 44321.76913194445 | 51.126 |
| 44321.81079861111 | 49.756 |
| 44321.852465277785 | 48.115 |
| 44321.89413194445 | 46.377 |
| 44321.93579861111 | 44.505 |
| 44321.977465277785 | 42.671 |
| 44322.01913194445 | 41.03 |
| 44322.06079861111 | 39.736 |
| 44322.102465277785 | 38.733 |
| 44322.14413194445 | 37.864 |
| 44322.18579861111 | 37.265 |
| 44322.227465277785 | 36.686 |
| 44322.26913194445 | 36.184 |
| 44322.31079861111 | 35.798 |
| 44322.352465277785 | 35.895 |
| 44322.39413194445 | 37.053 |
| 44322.43579861111 | 39.37 |
| 44322.477465277785 | 42.4 |
| 44322.51913194445 | 45.721 |
| 44322.56079861111 | 49.003 |
| 44322.602465277785 | 51.879 |
| 44322.64413194445 | 54.003 |
| 44322.68579861111 | 55.509 |
| 44322.727465277785 | 55.663 |
| 44322.76913194445 | 54.486 |
| 44322.81079861111 | 52.632 |
| 44322.852465277785 | 50.702 |
| 44322.89413194445 | 48.617 |
| 44322.93579861111 | 46.609 |
| 44322.977465277785 | 44.64 |
| 44323.01913194445 | 42.941 |
| 44323.06079861111 | 41.551 |
| 44323.102465277785 | 40.316 |
| 44323.14413194445 | 39.389 |
| 44323.18579861111 | 38.694 |
| 44323.227465277785 | 38.057 |
| 44323.26913194445 | 37.439 |
| 44323.31079861111 | 37.053 |
| 44323.352465277785 | 37.207 |
| 44323.39413194445 | 38.153 |
| 44323.43579861111 | 39.794 |
| 44323.477465277785 | 43.153 |
| 44323.51913194445 | 46.358 |
| 44323.56079861111 | 47.69 |
| 44323.602465277785 | 49.852 |
| 44323.64413194445 | 50.663 |
| 44323.68579861111 | 51.455 |
| 44323.727465277785 | 51.957 |
| 44323.76913194445 | 51.3 |
| 44323.81079861111 | 50.258 |
| 44323.852465277785 | 48.887 |
| 44323.89413194445 | 47.555 |
| 44323.93579861111 | 46.049 |
| 44323.977465277785 | 44.466 |
| 44324.01913194445 | 43.038 |
| 44324.06079861111 | 41.744 |
| 44324.102465277785 | 40.663 |
| 44324.14413194445 | 39.794 |
| 44324.18579861111 | 38.964 |
| 44324.227465277785 | 38.269 |
| 44324.26913194445 | 37.825 |
| 44324.31079861111 | 37.632 |
| 44324.352465277785 | 37.864 |
| 44324.39413194445 | 38.945 |
| 44324.43579861111 | 40.837 |
| 44324.477465277785 | 43.211 |
| 44324.51913194445 | 45.798 |
| 44324.56079861111 | 46.358 |
| 44324.602465277785 | 46.937 |
| 44324.64413194445 | 47.729 |
| 44324.68579861111 | 48.443 |
| 44324.727465277785 | 48.115 |
| 44324.76913194445 | 47.034 |
| 44324.81079861111 | 45.76 |
| 44324.852465277785 | 44.447 |
| 44324.89413194445 | 43.289 |
| 44324.93579861111 | 42.13 |
| 44324.977465277785 | 41.03 |
| 44325.01913194445 | 40.007 |
| 44325.06079861111 | 39.061 |
| 44325.102465277785 | 38.366 |
| 44325.14413194445 | 37.69 |
| 44325.18579861111 | 37.014 |
| 44325.227465277785 | 36.435 |
| 44325.26913194445 | 35.953 |
| 44325.31079861111 | 35.528 |
| 44325.352465277785 | 35.586 |
| 44325.39413194445 | 36.686 |
| 44325.43579861111 | 38.733 |
| 44325.477465277785 | 41.126 |
| 44325.51913194445 | 42.632 |
| 44325.56079861111 | 45.161 |
| 44325.602465277785 | 47.246 |
| 44325.64413194445 | 48.308 |
| 44325.68579861111 | 48.771 |
| 44325.727465277785 | 48.424 |
| 44325.76913194445 | 47.458 |
| 44325.81079861111 | 46.088 |
| 44325.852465277785 | 44.794 |
| 44325.89413194445 | 43.501 |
| 44325.93579861111 | 42.188 |
| 44325.977465277785 | 41.126 |
| 44326.01913194445 | 40.219 |
| 44326.06079861111 | 39.428 |
| 44326.102465277785 | 38.848 |
| 44326.14413194445 | 38.385 |
| 44326.18579861111 | 37.883 |
| 44326.227465277785 | 37.671 |
| 44326.26913194445 | 37.594 |
| 44326.31079861111 | 37.42 |
| 44326.352465277785 | 36.821 |
| 44326.39413194445 | 35.914 |
| 44326.43579861111 | 36.493 |
| 44326.477465277785 | 37.555 |
| 44326.51913194445 | 38.578 |
| 44326.56079861111 | 39.91 |
| 44326.602465277785 | 41.339 |
| 44326.64413194445 | 42.42 |
| 44326.68579861111 | 43.733 |
| 44326.727465277785 | 44.563 |
| 44326.76913194445 | 43.404 |
| 44326.81079861111 | 41.493 |
| 44326.852465277785 | 41.107 |
| 44326.89413194445 | 40.161 |
| 44326.93579861111 | 39.408 |
| 44326.977465277785 | 38.675 |
| 44327.01913194445 | 38.018 |
| 44327.06079861111 | 37.304 |
| 44327.102465277785 | 36.763 |
| 44327.14413194445 | 36.3 |
| 44327.18579861111 | 35.875 |
| 44327.227465277785 | 35.547 |
| 44327.26913194445 | 35.277 |
| 44327.31079861111 | 35.238 |
| 44327.352465277785 | 35.451 |
| 44327.39413194445 | 36.609 |
| 44327.43579861111 | 38.192 |
| 44327.477465277785 | 38.231 |
| 44327.51913194445 | 37.98 |
| 44327.56079861111 | 39.003 |
| 44327.602465277785 | 39.949 |
| 44327.64413194445 | 42.323 |
| 44327.68579861111 | 42.555 |
| 44327.727465277785 | 42.748 |
| 44327.76913194445 | 42.864 |
| 44327.81079861111 | 42.227 |
| 44327.852465277785 | 41.532 |
| 44327.89413194445 | 41.088 |
| 44327.93579861111 | 40.258 |
| 44327.977465277785 | 39.312 |
| 44328.01913194445 | 38.385 |
| 44328.06079861111 | 37.555 |
| 44328.102465277785 | 36.841 |
| 44328.14413194445 | 36.204 |
| 44328.18579861111 | 35.586 |
| 44328.227465277785 | 35.103 |
| 44328.26913194445 | 34.678 |
| 44328.31079861111 | 34.524 |
| 44328.352465277785 | 34.736 |
| 44328.39413194445 | 35.875 |
| 44328.43579861111 | 38.018 |
| 44328.477465277785 | 41.377 |
| 44328.51913194445 | 44.312 |
| 44328.56079861111 | 46.513 |
| 44328.602465277785 | 48.597 |
| 44328.64413194445 | 51.223 |
| 44328.68579861111 | 51.976 |
| 44328.727465277785 | 51.667 |
| 44328.76913194445 | 50.818 |
| 44328.81079861111 | 49.177 |
| 44328.852465277785 | 47.343 |
| 44328.89413194445 | 45.547 |
| 44328.93579861111 | 43.887 |
| 44328.977465277785 | 42.285 |
| 44329.01913194445 | 40.933 |
| 44329.06079861111 | 39.775 |
| 44329.102465277785 | 38.79 |
| 44329.14413194445 | 37.98 |
| 44329.18579861111 | 37.362 |
| 44329.227465277785 | 36.841 |
| 44329.26913194445 | 36.435 |
| 44329.31079861111 | 36.088 |
| 44329.352465277785 | 36.358 |
| 44329.39413194445 | 37.516 |
| 44329.43579861111 | 39.756 |
| 44329.477465277785 | 42.632 |
| 44329.51913194445 | 45.316 |
| 44329.56079861111 | 47.053 |
| 44329.602465277785 | 48.848 |
| 44329.64413194445 | 49.736 |
| 44329.68579861111 | 50.818 |
| 44329.727465277785 | 51.3 |
| 44329.76913194445 | 50.721 |
| 44329.81079861111 | 49.485 |
| 44329.852465277785 | 48.211 |
| 44329.89413194445 | 46.648 |
| 44329.93579861111 | 45.007 |
| 44329.977465277785 | 43.462 |
| 44330.01913194445 | 42.246 |
| 44330.06079861111 | 41.204 |
| 44330.102465277785 | 40.219 |
| 44330.14413194445 | 39.408 |
| 44330.18579861111 | 38.752 |
| 44330.227465277785 | 38.153 |
| 44330.26913194445 | 37.671 |
| 44330.31079861111 | 37.4 |
| 44330.352465277785 | 37.902 |
| 44330.39413194445 | 39.273 |
| 44330.43579861111 | 41.435 |
| 44330.477465277785 | 44.041 |
| 44330.51913194445 | 46.339 |
| 44330.56079861111 | 49.292 |
| 44330.602465277785 | 51.319 |
| 44330.64413194445 | 51.416 |
| 44330.68579861111 | 52.169 |
| 44330.727465277785 | 53.289 |
| 44330.76913194445 | 52.96 |
| 44330.81079861111 | 50.991 |
| 44330.852465277785 | 48.868 |
| 44330.89413194445 | 46.918 |
| 44330.93579861111 | 45.296 |
| 44330.977465277785 | 43.848 |
| 44331.01913194445 | 42.478 |
| 44331.06079861111 | 41.319 |
| 44331.102465277785 | 40.431 |
| 44331.14413194445 | 39.621 |
| 44331.18579861111 | 39.003 |
| 44331.227465277785 | 38.501 |
| 44331.26913194445 | 38.057 |
| 44331.31079861111 | 37.787 |
| 44331.352465277785 | 38.134 |
| 44331.39413194445 | 39.563 |
| 44331.43579861111 | 41.879 |
| 44331.477465277785 | 44.621 |
| 44331.51913194445 | 46.86 |
| 44331.56079861111 | 49.022 |
| 44331.602465277785 | 50.779 |
| 44331.64413194445 | 51.957 |
| 44331.68579861111 | 52.478 |
| 44331.727465277785 | 52.304 |
| 44331.76913194445 | 51.339 |
| 44331.81079861111 | 50.161 |
| 44331.852465277785 | 48.887 |
| 44331.89413194445 | 47.401 |
| 44331.93579861111 | 45.972 |
| 44331.977465277785 | 44.64 |
| 44332.01913194445 | 43.289 |
| 44332.06079861111 | 42.227 |
| 44332.102465277785 | 41.223 |
| 44332.14413194445 | 40.373 |
| 44332.18579861111 | 39.891 |
| 44332.227465277785 | 39.408 |
| 44332.26913194445 | 38.868 |
| 44332.31079861111 | 38.675 |
| 44332.352465277785 | 38.945 |
| 44332.39413194445 | 40.354 |
| 44332.43579861111 | 42.516 |
| 44332.477465277785 | 44.447 |
| 44332.51913194445 | 45.818 |
| 44332.56079861111 | 48.057 |
| 44332.602465277785 | 51.377 |
| 44332.64413194445 | 51.609 |
| 44332.68579861111 | 51.011 |
| 44332.727465277785 | 49.794 |
| 44332.76913194445 | 48.868 |
| 44332.81079861111 | 47.922 |
| 44332.852465277785 | 46.879 |
| 44332.89413194445 | 45.412 |
| 44332.93579861111 | 44.061 |
| 44332.977465277785 | 42.941 |
| 44333.01913194445 | 41.956 |
| 44333.06079861111 | 41.204 |
| 44333.102465277785 | 40.451 |
| 44333.14413194445 | 39.949 |
| 44333.18579861111 | 39.485 |
| 44333.227465277785 | 39.061 |
| 44333.26913194445 | 38.733 |
| 44333.31079861111 | 38.79 |
| 44333.352465277785 | 39.389 |
| 44333.39413194445 | 40.393 |
| 44333.43579861111 | 42.285 |
| 44333.477465277785 | 44.254 |
| 44333.51913194445 | 44.833 |
| 44333.56079861111 | 45.567 |
| 44333.602465277785 | 46.725 |
| 44333.64413194445 | 46.358 |
| 44333.68579861111 | 46.397 |
| 44333.727465277785 | 45.895 |
| 44333.76913194445 | 45.045 |
| 44333.81079861111 | 43.984 |
| 44333.852465277785 | 43.173 |
| 44333.89413194445 | 42.343 |
| 44333.93579861111 | 41.744 |
| 44333.977465277785 | 41.204 |
| 44334.01913194445 | 40.682 |
| 44334.06079861111 | 40.393 |
| 44334.102465277785 | 40.122 |
| 44334.14413194445 | 39.872 |
| 44334.18579861111 | 39.659 |
| 44334.227465277785 | 39.447 |
| 44334.26913194445 | 39.331 |
| 44334.31079861111 | 39.389 |
| 44334.352465277785 | 39.949 |
| 44334.39413194445 | 40.856 |
| 44334.43579861111 | 42.787 |
| 44334.477465277785 | 44.968 |
| 44334.51913194445 | 47.207 |
| 44334.56079861111 | 48.559 |
| 44334.602465277785 | 49.621 |
| 44334.64413194445 | 49.331 |
| 44334.68579861111 | 49.756 |
| 44334.727465277785 | 49.543 |
| 44334.76913194445 | 49.119 |
| 44334.81079861111 | 48.057 |
| 44334.852465277785 | 46.763 |
| 44334.89413194445 | 45.702 |
| 44334.93579861111 | 44.582 |
| 44334.977465277785 | 43.269 |
| 44335.01913194445 | 42.092 |
| 44335.06079861111 | 41.068 |
| 44335.102465277785 | 40.238 |
| 44335.14413194445 | 39.563 |
| 44335.18579861111 | 38.848 |
| 44335.227465277785 | 38.443 |
| 44335.26913194445 | 38.095 |
| 44335.31079861111 | 37.825 |
| 44335.352465277785 | 38.115 |
| 44335.39413194445 | 39.582 |
| 44335.43579861111 | 41.821 |
| 44335.477465277785 | 44.794 |
| 44335.51913194445 | 48.096 |
| 44335.56079861111 | 50.509 |
| 44335.602465277785 | 53.289 |
| 44335.64413194445 | 53.81 |
| 44335.68579861111 | 53.926 |
| 44335.727465277785 | 53.115 |
| 44335.76913194445 | 51.03 |
| 44335.81079861111 | 49.235 |
| 44335.852465277785 | 47.497 |
| 44335.89413194445 | 45.76 |
| 44335.93579861111 | 44.292 |
| 44335.977465277785 | 42.96 |
| 44336.01913194445 | 42.053 |
| 44336.06079861111 | 41.358 |
| 44336.102465277785 | 40.837 |
| 44336.14413194445 | 40.258 |
| 44336.18579861111 | 39.794 |
| 44336.227465277785 | 39.428 |
| 44336.26913194445 | 39.138 |
| 44336.31079861111 | 39.196 |
| 44336.352465277785 | 39.949 |
| 44336.39413194445 | 41.223 |
| 44336.43579861111 | 43.076 |
| 44336.477465277785 | 45.335 |
| 44336.51913194445 | 47.922 |
| 44336.56079861111 | 49.524 |
| 44336.602465277785 | 52.208 |
| 44336.64413194445 | 54.061 |
| 44336.68579861111 | 54.891 |
| 44336.727465277785 | 54.756 |
| 44336.76913194445 | 53.791 |
| 44336.81079861111 | 51.802 |
| 44336.852465277785 | 49.91 |
| 44336.89413194445 | 47.729 |
| 44336.93579861111 | 45.702 |
| 44336.977465277785 | 43.926 |
| 44337.01913194445 | 42.555 |
| 44337.06079861111 | 41.474 |
| 44337.102465277785 | 40.567 |
| 44337.14413194445 | 39.872 |
| 44337.18579861111 | 39.37 |
| 44337.227465277785 | 39.061 |
| 44337.26913194445 | 38.733 |
| 44337.31079861111 | 38.964 |
| 44337.352465277785 | 39.659 |
| 44337.39413194445 | 41.261 |
| 44337.43579861111 | 42.729 |
| 44337.477465277785 | 44.814 |
| 44337.51913194445 | 45.238 |
| 44337.56079861111 | 45.142 |
| 44337.602465277785 | 45.74 |
| 44337.64413194445 | 46.3 |
| 44337.68579861111 | 46.513 |
| 44337.727465277785 | 46.802 |
| 44337.76913194445 | 46.841 |
| 44337.81079861111 | 46.339 |
| 44337.852465277785 | 45.586 |
| 44337.89413194445 | 44.756 |
| 44337.93579861111 | 43.887 |
| 44337.977465277785 | 42.883 |
| 44338.01913194445 | 42.014 |
| 44338.06079861111 | 41.204 |
| 44338.102465277785 | 40.431 |
| 44338.14413194445 | 39.833 |
| 44338.18579861111 | 39.292 |
| 44338.227465277785 | 38.848 |
| 44338.26913194445 | 38.52 |
| 44338.31079861111 | 38.346 |
| 44338.352465277785 | 38.829 |
| 44338.39413194445 | 40.238 |
| 44338.43579861111 | 42.4 |
| 44338.477465277785 | 43.366 |
| 44338.51913194445 | 45.779 |
| 44338.56079861111 | 47.767 |
| 44338.602465277785 | 49.91 |
| 44338.64413194445 | 50.991 |
| 44338.68579861111 | 51.397 |
| 44338.727465277785 | 52.092 |
| 44338.76913194445 | 50.914 |
| 44338.81079861111 | 49.331 |
| 44338.852465277785 | 47.594 |
| 44338.89413194445 | 45.933 |
| 44338.93579861111 | 44.736 |
| 44338.977465277785 | 43.81 |
| 44339.01913194445 | 42.98 |
| 44339.06079861111 | 42.304 |
| 44339.102465277785 | 41.628 |
| 44339.14413194445 | 40.914 |
| 44339.18579861111 | 40.296 |
| 44339.227465277785 | 39.814 |
| 44339.26913194445 | 39.447 |
| 44339.31079861111 | 39.196 |
| 44339.352465277785 | 39.312 |
| 44339.39413194445 | 40.219 |
| 44339.43579861111 | 41.416 |
| 44339.477465277785 | 42.729 |
| 44339.51913194445 | 43.713 |
| 44339.56079861111 | 44.524 |
| 44339.602465277785 | 46.725 |
| 44339.64413194445 | 46.493 |
| 44339.68579861111 | 47.787 |
| 44339.727465277785 | 48.192 |
| 44339.76913194445 | 47.458 |
| 44339.81079861111 | 46.146 |
| 44339.852465277785 | 44.833 |
| 44339.89413194445 | 43.404 |
| 44339.93579861111 | 41.976 |
| 44339.977465277785 | 40.74 |
| 44340.01913194445 | 39.678 |
| 44340.06079861111 | 38.733 |
| 44340.102465277785 | 37.941 |
| 44340.14413194445 | 37.304 |
| 44340.18579861111 | 36.725 |
| 44340.227465277785 | 36.319 |
| 44340.26913194445 | 36.01 |
| 44340.31079861111 | 35.682 |
| 44340.352465277785 | 35.875 |
| 44340.39413194445 | 37.265 |
| 44340.43579861111 | 39.563 |
| 44340.477465277785 | 42.323 |
| 44340.51913194445 | 45.509 |
| 44340.56079861111 | 48.675 |
| 44340.602465277785 | 51.319 |
| 44340.64413194445 | 53.366 |
| 44340.68579861111 | 54.37 |
| 44340.727465277785 | 54.466 |
| 44340.76913194445 | 53.462 |
| 44340.81079861111 | 51.532 |
| 44340.852465277785 | 49.37 |
| 44340.89413194445 | 47.227 |
| 44340.93579861111 | 45.18 |
| 44340.977465277785 | 43.443 |
| 44341.01913194445 | 41.976 |
| 44341.06079861111 | 40.817 |
| 44341.102465277785 | 39.852 |
| 44341.14413194445 | 38.983 |
| 44341.18579861111 | 38.269 |
| 44341.227465277785 | 37.613 |
| 44341.26913194445 | 37.111 |
| 44341.31079861111 | 36.783 |
| 44341.352465277785 | 36.899 |
| 44341.39413194445 | 38.192 |
| 44341.43579861111 | 40.335 |
| 44341.477465277785 | 43.269 |
| 44341.51913194445 | 46.377 |
| 44341.56079861111 | 49.563 |
| 44341.602465277785 | 52.246 |
| 44341.64413194445 | 54.138 |
| 44341.68579861111 | 55.045 |
| 44341.727465277785 | 55.161 |
| 44341.76913194445 | 54.099 |
| 44341.81079861111 | 52.208 |
| 44341.852465277785 | 50.219 |
| 44341.89413194445 | 48.018 |
| 44341.93579861111 | 45.972 |
| 44341.977465277785 | 44.35 |
| 44342.01913194445 | 42.999 |
| 44342.06079861111 | 42.072 |
| 44342.102465277785 | 41.204 |
| 44342.14413194445 | 40.451 |
| 44342.18579861111 | 39.756 |
| 44342.227465277785 | 39.177 |
| 44342.26913194445 | 38.636 |
| 44342.31079861111 | 38.559 |
| 44342.352465277785 | 38.752 |
| 44342.39413194445 | 39.968 |
| 44342.43579861111 | 41.57 |
| 44342.477465277785 | 43.54 |
| 44342.51913194445 | 45.818 |
| 44342.56079861111 | 46.513 |
| 44342.602465277785 | 47.709 |
| 44342.64413194445 | 48.771 |
| 44342.68579861111 | 48.868 |
| 44342.727465277785 | 49.505 |
| 44342.76913194445 | 49.428 |
| 44342.81079861111 | 48.54 |
| 44342.852465277785 | 47.613 |
| 44342.89413194445 | 46.377 |
| 44342.93579861111 | 45.065 |
| 44342.977465277785 | 43.829 |
| 44343.01913194445 | 42.69 |
| 44343.06079861111 | 41.667 |
| 44343.102465277785 | 40.895 |
| 44343.14413194445 | 40.219 |
| 44343.18579861111 | 39.64 |
| 44343.227465277785 | 39.099 |
| 44343.26913194445 | 38.675 |
| 44343.31079861111 | 38.327 |
| 44343.352465277785 | 38.462 |
| 44343.39413194445 | 39.814 |
| 44343.43579861111 | 41.995 |
| 44343.477465277785 | 44.756 |
| 44343.51913194445 | 47.729 |
| 44343.56079861111 | 50.663 |
| 44343.602465277785 | 53.211 |
| 44343.64413194445 | 55.161 |
| 44343.68579861111 | 56.416 |
| 44343.727465277785 | 55.895 |
| 44343.76913194445 | 54.235 |
| 44343.81079861111 | 52.285 |
| 44343.852465277785 | 50.412 |
| 44343.89413194445 | 48.327 |
| 44343.93579861111 | 46.126 |
| 44343.977465277785 | 44.312 |
| 44344.01913194445 | 42.922 |
| 44344.06079861111 | 41.821 |
| 44344.102465277785 | 40.76 |
| 44344.14413194445 | 39.891 |
| 44344.18579861111 | 39.196 |
| 44344.227465277785 | 38.617 |
| 44344.26913194445 | 38.076 |
| 44344.31079861111 | 37.787 |
| 44344.352465277785 | 37.902 |
| 44344.39413194445 | 39.234 |
| 44344.43579861111 | 41.57 |
| 44344.477465277785 | 43.346 |
| 44344.51913194445 | 45.451 |
| 44344.56079861111 | 48.443 |
| 44344.602465277785 | 50.663 |
| 44344.64413194445 | 52.092 |
| 44344.68579861111 | 52.188 |
| 44344.727465277785 | 52.053 |
| 44344.76913194445 | 51.609 |
| 44344.81079861111 | 50.316 |
| 44344.852465277785 | 48.829 |
| 44344.89413194445 | 46.995 |
| 44344.93579861111 | 45.277 |
| 44344.977465277785 | 43.945 |
| 44345.01913194445 | 42.748 |
| 44345.06079861111 | 41.744 |
| 44345.102465277785 | 40.933 |
| 44345.14413194445 | 40.007 |
| 44345.18579861111 | 39.428 |
| 44345.227465277785 | 38.926 |
| 44345.26913194445 | 38.462 |
| 44345.31079861111 | 38.173 |
| 44345.352465277785 | 38.385 |
| 44345.39413194445 | 39.601 |
| 44345.43579861111 | 41.821 |
| 44345.477465277785 | 44.196 |
| 44345.51913194445 | 46.59 |
| 44345.56079861111 | 47.15 |
| 44345.602465277785 | 48.076 |
| 44345.64413194445 | 48.81 |
| 44345.68579861111 | 49.196 |
| 44345.727465277785 | 49.08 |
| 44345.76913194445 | 48.617 |
| 44345.81079861111 | 47.767 |
| 44345.852465277785 | 46.976 |
| 44345.89413194445 | 46.184 |
| 44345.93579861111 | 45.277 |
| 44345.977465277785 | 44.331 |
| 44346.01913194445 | 43.52 |
| 44346.06079861111 | 42.69 |
| 44346.102465277785 | 41.918 |
| 44346.14413194445 | 41.339 |
| 44346.18579861111 | 40.76 |
| 44346.227465277785 | 40.335 |
| 44346.26913194445 | 40.084 |
| 44346.31079861111 | 40.026 |
| 44346.352465277785 | 40.431 |
| 44346.39413194445 | 41.242 |
| 44346.43579861111 | 42.594 |
| 44346.477465277785 | 45.509 |
| 44346.51913194445 | 46.899 |
| 44346.56079861111 | 46.416 |
| 44346.602465277785 | 46.435 |
| 44346.64413194445 | 45.837 |
| 44346.68579861111 | 44.987 |
| 44346.727465277785 | 44.794 |
| 44346.76913194445 | 44.35 |
| 44346.81079861111 | 43.81 |
| 44346.852465277785 | 43.269 |
| 44346.89413194445 | 42.729 |
| 44346.93579861111 | 42.304 |
| 44346.977465277785 | 41.879 |
| 44347.01913194445 | 41.551 |
| 44347.06079861111 | 41.146 |
| 44347.102465277785 | 40.644 |
| 44347.14413194445 | 40.335 |
| 44347.18579861111 | 39.968 |
| 44347.227465277785 | 39.428 |
| 44347.26913194445 | 39.08 |
| 44347.31079861111 | 39.003 |
| 44347.352465277785 | 39.447 |
| 44347.39413194445 | 40.586 |
| 44347.43579861111 | 42.574 |
| 44347.477465277785 | 45.393 |
| 44347.51913194445 | 47.941 |
| 44347.56079861111 | 48.366 |
| 44347.602465277785 | 47.304 |
| 44347.64413194445 | 48.501 |
| 44347.68579861111 | 48.848 |
| 44347.727465277785 | 48.327 |
| 44347.76913194445 | 47.902 |
| 44347.81079861111 | 47.053 |
| 44347.852465277785 | 45.875 |
| 44347.89413194445 | 44.794 |
| 44347.93579861111 | 43.848 |
| 44347.977465277785 | 42.864 |
| 44348.01913194445 | 41.86 |
| 44348.06079861111 | 41.088 |
| 44348.102465277785 | 40.238 |
| 44348.14413194445 | 39.524 |
| 44348.18579861111 | 39.003 |
| 44348.227465277785 | 38.443 |
| 44348.26913194445 | 37.98 |
| 44348.31079861111 | 37.941 |
| 44348.352465277785 | 38.211 |
| 44348.39413194445 | 39.292 |
| 44348.43579861111 | 41.435 |
| 44348.477465277785 | 44.389 |
| 44348.51913194445 | 47.207 |
| 44348.56079861111 | 48.964 |
| 44348.602465277785 | 49.292 |
| 44348.64413194445 | 50.142 |
| 44348.68579861111 | 51.319 |
| 44348.727465277785 | 50.837 |
| 44348.76913194445 | 49.872 |
| 44348.81079861111 | 48.771 |
| 44348.852465277785 | 47.613 |
| 44348.89413194445 | 46.262 |
| 44348.93579861111 | 44.91 |
| 44348.977465277785 | 43.713 |
| 44349.01913194445 | 42.729 |
| 44349.06079861111 | 41.918 |
| 44349.102465277785 | 41.3 |
| 44349.14413194445 | 40.76 |
| 44349.18579861111 | 40.161 |
| 44349.227465277785 | 39.794 |
| 44349.26913194445 | 39.563 |
| 44349.31079861111 | 39.505 |
| 44349.352465277785 | 39.794 |
| 44349.39413194445 | 41.126 |
| 44349.43579861111 | 42.787 |
| 44349.477465277785 | 45.412 |
| 44349.51913194445 | 48.443 |
| 44349.56079861111 | 51.262 |
| 44349.602465277785 | 52.767 |
| 44349.64413194445 | 53.636 |
| 44349.68579861111 | 54.254 |
| 44349.727465277785 | 53.501 |
| 44349.76913194445 | 52.42 |
| 44349.81079861111 | 50.914 |
| 44349.852465277785 | 48.964 |
| 44349.89413194445 | 47.381 |
| 44349.93579861111 | 45.933 |
| 44349.977465277785 | 44.64 |
| 44350.01913194445 | 43.54 |
| 44350.06079861111 | 42.594 |
| 44350.102465277785 | 41.706 |
| 44350.14413194445 | 40.933 |
| 44350.18579861111 | 40.316 |
| 44350.227465277785 | 39.717 |
| 44350.26913194445 | 39.37 |
| 44350.31079861111 | 39.099 |
| 44350.352465277785 | 39.37 |
| 44350.39413194445 | 40.644 |
| 44350.43579861111 | 42.902 |
| 44350.477465277785 | 45.818 |
| 44350.51913194445 | 49.061 |
| 44350.56079861111 | 52.246 |
| 44350.602465277785 | 54.891 |
| 44350.64413194445 | 56.184 |
| 44350.68579861111 | 57.729 |
| 44350.727465277785 | 57.941 |
| 44350.76913194445 | 56.976 |
| 44350.81079861111 | 54.93 |
| 44350.852465277785 | 52.439 |
| 44350.89413194445 | 49.891 |
| 44350.93579861111 | 47.825 |
| 44350.977465277785 | 46.281 |
| 44351.01913194445 | 44.968 |
| 44351.06079861111 | 43.79 |
| 44351.102465277785 | 42.787 |
| 44351.14413194445 | 41.976 |
| 44351.18579861111 | 41.3 |
| 44351.227465277785 | 40.76 |
| 44351.26913194445 | 40.277 |
| 44351.31079861111 | 39.968 |
| 44351.352465277785 | 40.065 |
| 44351.39413194445 | 41.204 |
| 44351.43579861111 | 43.385 |
| 44351.477465277785 | 46.339 |
| 44351.51913194445 | 49.312 |
| 44351.56079861111 | 52.285 |
| 44351.602465277785 | 54.852 |
| 44351.64413194445 | 56.706 |
| 44351.68579861111 | 57.652 |
| 44351.727465277785 | 57.632 |
| 44351.76913194445 | 56.339 |
| 44351.81079861111 | 53.926 |
| 44351.852465277785 | 51.435 |
| 44351.89413194445 | 49.37 |
| 44351.93579861111 | 47.574 |
| 44351.977465277785 | 45.953 |
| 44352.01913194445 | 44.582 |
| 44352.06079861111 | 43.404 |
| 44352.102465277785 | 42.536 |
| 44352.14413194445 | 41.783 |
| 44352.18579861111 | 41.261 |
| 44352.227465277785 | 40.837 |
| 44352.26913194445 | 40.47 |
| 44352.31079861111 | 40.296 |
| 44352.352465277785 | 40.509 |
| 44352.39413194445 | 41.763 |
| 44352.43579861111 | 43.906 |
| 44352.477465277785 | 46.783 |
| 44352.51913194445 | 49.679 |
| 44352.56079861111 | 51.146 |
| 44352.602465277785 | 54.447 |
| 44352.64413194445 | 55.412 |
| 44352.68579861111 | 54.543 |
| 44352.727465277785 | 53.134 |
| 44352.76913194445 | 51.223 |
| 44352.81079861111 | 49.37 |
| 44352.852465277785 | 47.613 |
| 44352.89413194445 | 46.223 |
| 44352.93579861111 | 45.238 |
| 44352.977465277785 | 44.485 |
| 44353.01913194445 | 43.636 |
| 44353.06079861111 | 42.883 |
| 44353.102465277785 | 42.323 |
| 44353.14413194445 | 41.841 |
| 44353.18579861111 | 41.377 |
| 44353.227465277785 | 40.933 |
| 44353.26913194445 | 40.605 |
| 44353.31079861111 | 40.354 |
| 44353.352465277785 | 40.547 |
| 44353.39413194445 | 41.686 |
| 44353.43579861111 | 43.694 |
| 44353.477465277785 | 45.76 |
| 44353.51913194445 | 46.551 |
| 44353.56079861111 | 47.787 |
| 44353.602465277785 | 50.065 |
| 44353.64413194445 | 50.354 |
| 44353.68579861111 | 49.891 |
| 44353.727465277785 | 50.374 |
| 44353.76913194445 | 49.292 |
| 44353.81079861111 | 48.269 |
| 44353.852465277785 | 47.207 |
| 44353.89413194445 | 46.281 |
| 44353.93579861111 | 45.277 |
| 44353.977465277785 | 44.292 |
| 44354.01913194445 | 43.424 |
| 44354.06079861111 | 42.69 |
| 44354.102465277785 | 42.034 |
| 44354.14413194445 | 41.532 |
| 44354.18579861111 | 41.068 |
| 44354.227465277785 | 40.644 |
| 44354.26913194445 | 40.316 |
| 44354.31079861111 | 40.103 |
| 44354.352465277785 | 40.238 |
| 44354.39413194445 | 41.339 |
| 44354.43579861111 | 43.482 |
| 44354.477465277785 | 45.818 |
| 44354.51913194445 | 47.69 |
| 44354.56079861111 | 51.281 |
| 44354.602465277785 | 52.227 |
| 44354.64413194445 | 52.092 |
| 44354.68579861111 | 53.675 |
| 44354.727465277785 | 53.713 |
| 44354.76913194445 | 52.845 |
| 44354.81079861111 | 51.513 |
| 44354.852465277785 | 50.18 |
| 44354.89413194445 | 48.559 |
| 44354.93579861111 | 47.092 |
| 44354.977465277785 | 45.798 |
| 44355.01913194445 | 44.659 |
| 44355.06079861111 | 43.694 |
| 44355.102465277785 | 42.96 |
| 44355.14413194445 | 42.188 |
| 44355.18579861111 | 41.628 |
| 44355.227465277785 | 41.126 |
| 44355.26913194445 | 40.663 |
| 44355.31079861111 | 40.412 |
| 44355.352465277785 | 40.567 |
| 44355.39413194445 | 41.706 |
| 44355.43579861111 | 43.752 |
| 44355.477465277785 | 46.435 |
| 44355.51913194445 | 49.157 |
| 44355.56079861111 | 51.918 |
| 44355.602465277785 | 54.428 |
| 44355.64413194445 | 55.895 |
| 44355.68579861111 | 56.957 |
| 44355.727465277785 | 56.821 |
| 44355.76913194445 | 55.663 |
| 44355.81079861111 | 53.385 |
| 44355.852465277785 | 51.049 |
| 44355.89413194445 | 49.08 |
| 44355.93579861111 | 47.362 |
| 44355.977465277785 | 45.875 |
| 44356.01913194445 | 44.485 |
| 44356.06079861111 | 43.25 |
| 44356.102465277785 | 42.42 |
| 44356.14413194445 | 41.686 |
| 44356.18579861111 | 40.933 |
| 44356.227465277785 | 40.393 |
| 44356.26913194445 | 39.91 |
| 44356.31079861111 | 39.408 |
| 44356.352465277785 | 39.524 |
| 44356.39413194445 | 40.605 |
| 44356.43579861111 | 42.787 |
| 44356.477465277785 | 45.412 |
| 44356.51913194445 | 48.424 |
| 44356.56079861111 | 51.493 |
| 44356.602465277785 | 54.061 |
| 44356.64413194445 | 55.856 |
| 44356.68579861111 | 57.092 |
| 44356.727465277785 | 56.686 |
| 44356.76913194445 | 55.547 |
| 44356.81079861111 | 53.675 |
| 44356.852465277785 | 51.783 |
| 44356.89413194445 | 50.007 |
| 44356.93579861111 | 48.462 |
| 44356.977465277785 | 47.092 |
| 44357.01913194445 | 45.933 |
| 44357.06079861111 | 44.929 |
| 44357.102465277785 | 44.041 |
| 44357.14413194445 | 43.289 |
| 44357.18579861111 | 42.651 |
| 44357.227465277785 | 42.072 |
| 44357.26913194445 | 41.59 |
| 44357.31079861111 | 41.088 |
| 44357.352465277785 | 41.184 |
| 44357.39413194445 | 42.227 |
| 44357.43579861111 | 44.215 |
| 44357.477465277785 | 46.744 |
| 44357.51913194445 | 49.138 |
| 44357.56079861111 | 50.605 |
| 44357.602465277785 | 51.879 |
| 44357.64413194445 | 54.292 |
| 44357.68579861111 | 55.316 |
| 44357.727465277785 | 55.451 |
| 44357.76913194445 | 54.891 |
| 44357.81079861111 | 52.999 |
| 44357.852465277785 | 51.069 |
| 44357.89413194445 | 49.37 |
| 44357.93579861111 | 47.729 |
| 44357.977465277785 | 46.281 |
| 44358.01913194445 | 45.065 |
| 44358.06079861111 | 43.964 |
| 44358.102465277785 | 42.96 |
| 44358.14413194445 | 42.323 |
| 44358.18579861111 | 41.667 |
| 44358.227465277785 | 41.088 |
| 44358.26913194445 | 40.547 |
| 44358.31079861111 | 40.296 |
| 44358.352465277785 | 40.296 |
| 44358.39413194445 | 41.184 |
| 44358.43579861111 | 43.057 |
| 44358.477465277785 | 45.528 |
| 44358.51913194445 | 48.443 |
| 44358.56079861111 | 51.358 |
| 44358.602465277785 | 53.926 |
| 44358.64413194445 | 55.856 |
| 44358.68579861111 | 56.841 |
| 44358.727465277785 | 56.821 |
| 44358.76913194445 | 55.76 |
| 44358.81079861111 | 53.81 |
| 44358.852465277785 | 51.841 |
| 44358.89413194445 | 50.065 |
| 44358.93579861111 | 48.385 |
| 44358.977465277785 | 47.034 |
| 44359.01913194445 | 45.74 |
| 44359.06079861111 | 44.64 |
| 44359.102465277785 | 43.733 |
| 44359.14413194445 | 42.96 |
| 44359.18579861111 | 42.227 |
| 44359.227465277785 | 41.609 |
| 44359.26913194445 | 41.068 |
| 44359.31079861111 | 40.682 |
| 44359.352465277785 | 40.702 |
| 44359.39413194445 | 41.899 |
| 44359.43579861111 | 44.022 |
| 44359.477465277785 | 46.686 |
| 44359.51913194445 | 49.582 |
| 44359.56079861111 | 52.458 |
| 44359.602465277785 | 54.968 |
| 44359.64413194445 | 56.918 |
| 44359.68579861111 | 57.903 |
| 44359.727465277785 | 57.787 |
| 44359.76913194445 | 56.764 |
| 44359.81079861111 | 54.775 |
| 44359.852465277785 | 52.69 |
| 44359.89413194445 | 50.779 |
| 44359.93579861111 | 49.157 |
| 44359.977465277785 | 47.748 |
| 44360.01913194445 | 46.474 |
| 44360.06079861111 | 45.431 |
| 44360.102465277785 | 44.543 |
| 44360.14413194445 | 43.694 |
| 44360.18579861111 | 42.999 |
| 44360.227465277785 | 42.42 |
| 44360.26913194445 | 41.86 |
| 44360.31079861111 | 41.57 |
| 44360.352465277785 | 41.686 |
| 44360.39413194445 | 42.729 |
| 44360.43579861111 | 44.91 |
| 44360.477465277785 | 47.787 |
| 44360.51913194445 | 50.837 |
| 44360.56079861111 | 53.578 |
| 44360.602465277785 | 53.984 |
| 44360.64413194445 | 56.011 |
| 44360.68579861111 | 56.435 |
| 44360.727465277785 | 56.416 |
| 44360.76913194445 | 56.011 |
| 44360.81079861111 | 54.756 |
| 44360.852465277785 | 52.96 |
| 44360.89413194445 | 51.319 |
| 44360.93579861111 | 49.775 |
| 44360.977465277785 | 48.617 |
| 44361.01913194445 | 47.574 |
| 44361.06079861111 | 46.648 |
| 44361.102465277785 | 45.914 |
| 44361.14413194445 | 45.258 |
| 44361.18579861111 | 44.543 |
| 44361.227465277785 | 44.099 |
| 44361.26913194445 | 43.54 |
| 44361.31079861111 | 43.134 |
| 44361.352465277785 | 43.192 |
| 44361.39413194445 | 44.273 |
| 44361.43579861111 | 46.165 |
| 44361.477465277785 | 48.81 |
| 44361.51913194445 | 51.667 |
| 44361.56079861111 | 54.35 |
| 44361.602465277785 | 56.686 |
| 44361.64413194445 | 58.231 |
| 44361.68579861111 | 58.733 |
| 44361.727465277785 | 58.269 |
| 44361.76913194445 | 56.725 |
| 44361.81079861111 | 54.35 |
| 44361.852465277785 | 52.014 |
| 44361.89413194445 | 50.065 |
| 44361.93579861111 | 48.52 |
| 44361.977465277785 | 47.304 |
| 44362.01913194445 | 46.358 |
| 44362.06079861111 | 45.528 |
| 44362.102465277785 | 44.872 |
| 44362.14413194445 | 44.273 |
| 44362.18579861111 | 43.655 |
| 44362.227465277785 | 43.231 |
| 44362.26913194445 | 42.845 |
| 44362.31079861111 | 42.497 |
| 44362.352465277785 | 42.651 |
| 44362.39413194445 | 43.752 |
| 44362.43579861111 | 45.721 |
| 44362.477465277785 | 48.385 |
| 44362.51913194445 | 50.991 |
| 44362.56079861111 | 53.559 |
| 44362.602465277785 | 55.644 |
| 44362.64413194445 | 56.899 |
| 44362.68579861111 | 57.169 |
| 44362.727465277785 | 56.648 |
| 44362.76913194445 | 55.258 |
| 44362.81079861111 | 53.597 |
| 44362.852465277785 | 51.783 |
| 44362.89413194445 | 50.123 |
| 44362.93579861111 | 48.733 |
| 44362.977465277785 | 47.632 |
| 44363.01913194445 | 46.783 |
| 44363.06079861111 | 45.953 |
| 44363.102465277785 | 45.161 |
| 44363.14413194445 | 44.679 |
| 44363.18579861111 | 44.119 |
| 44363.227465277785 | 43.578 |
| 44363.26913194445 | 43.25 |
| 44363.31079861111 | 42.999 |
| 44363.352465277785 | 43.057 |
| 44363.39413194445 | 43.926 |
| 44363.43579861111 | 45.74 |
| 44363.477465277785 | 47.922 |
| 44363.51913194445 | 50.605 |
| 44363.56079861111 | 52.613 |
| 44363.602465277785 | 53.906 |
| 44363.64413194445 | 54.524 |
| 44363.68579861111 | 54.428 |
| 44363.727465277785 | 53.868 |
| 44363.76913194445 | 52.748 |
| 44363.81079861111 | 51.262 |
| 44363.852465277785 | 50.045 |
| 44363.89413194445 | 48.964 |
| 44363.93579861111 | 47.941 |
| 44363.977465277785 | 47.15 |
| 44364.01913194445 | 46.532 |
| 44364.06079861111 | 46.011 |
| 44364.102465277785 | 45.451 |
| 44364.14413194445 | 44.949 |
| 44364.18579861111 | 44.408 |
| 44364.227465277785 | 43.906 |
| 44364.26913194445 | 43.52 |
| 44364.31079861111 | 43.269 |
| 44364.352465277785 | 43.366 |
| 44364.39413194445 | 44.37 |
| 44364.43579861111 | 46.068 |
| 44364.477465277785 | 48.578 |
| 44364.51913194445 | 50.605 |
| 44364.56079861111 | 52.458 |
| 44364.602465277785 | 53.617 |
| 44364.64413194445 | 54.968 |
| 44364.68579861111 | 55.721 |
| 44364.727465277785 | 55.296 |
| 44364.76913194445 | 54.08 |
| 44364.81079861111 | 52.729 |
| 44364.852465277785 | 50.856 |
| 44364.89413194445 | 49.292 |
| 44364.93579861111 | 48.269 |
| 44364.977465277785 | 47.613 |
| 44365.01913194445 | 47.034 |
| 44365.06079861111 | 46.474 |
| 44365.102465277785 | 45.895 |
| 44365.14413194445 | 45.451 |
| 44365.18579861111 | 44.852 |
| 44365.227465277785 | 44.312 |
| 44365.26913194445 | 43.848 |
| 44365.31079861111 | 43.559 |
| 44365.352465277785 | 43.713 |
| 44365.39413194445 | 44.466 |
| 44365.43579861111 | 45.624 |
| 44365.477465277785 | 46.899 |
| 44365.51913194445 | 48.771 |
| 44365.56079861111 | 49.601 |
| 44365.602465277785 | 51.377 |
| 44365.64413194445 | 52.13 |
| 44365.68579861111 | 52.787 |
| 44365.727465277785 | 53.134 |
| 44365.76913194445 | 51.706 |
| 44365.81079861111 | 50.007 |
| 44365.852465277785 | 48.791 |
| 44365.89413194445 | 47.864 |
| 44365.93579861111 | 47.13 |
| 44365.977465277785 | 46.532 |
| 44366.01913194445 | 45.875 |
| 44366.06079861111 | 45.335 |
| 44366.102465277785 | 44.891 |
| 44366.14413194445 | 44.524 |
| 44366.18579861111 | 44.215 |
| 44366.227465277785 | 43.984 |
| 44366.26913194445 | 43.675 |
| 44366.31079861111 | 43.655 |
| 44366.352465277785 | 43.733 |
| 44366.39413194445 | 44.35 |
| 44366.43579861111 | 46.107 |
| 44366.477465277785 | 48.192 |
| 44366.51913194445 | 49.235 |
| 44366.56079861111 | 50.818 |
| 44366.602465277785 | 51.802 |
| 44366.64413194445 | 51.609 |
| 44366.68579861111 | 50.644 |
| 44366.727465277785 | 50.721 |
| 44366.76913194445 | 50.567 |
| 44366.81079861111 | 49.736 |
| 44366.852465277785 | 48.578 |
| 44366.89413194445 | 47.362 |
| 44366.93579861111 | 46.3 |
| 44366.977465277785 | 45.605 |
| 44367.01913194445 | 44.987 |
| 44367.06079861111 | 44.331 |
| 44367.102465277785 | 43.906 |
| 44367.14413194445 | 43.54 |
| 44367.18579861111 | 43.134 |
| 44367.227465277785 | 42.806 |
| 44367.26913194445 | 42.555 |
| 44367.31079861111 | 42.555 |
| 44367.352465277785 | 42.922 |
| 44367.39413194445 | 43.848 |
| 44367.43579861111 | 45.721 |
| 44367.477465277785 | 48.076 |
| 44367.51913194445 | 50.065 |
| 44367.56079861111 | 51.879 |
| 44367.602465277785 | 52.555 |
| 44367.64413194445 | 52.536 |
| 44367.68579861111 | 52.555 |
| 44367.727465277785 | 52.014 |
| 44367.76913194445 | 51.242 |
| 44367.81079861111 | 49.987 |
| 44367.852465277785 | 48.926 |
| 44367.89413194445 | 47.96 |
| 44367.93579861111 | 47.092 |
| 44367.977465277785 | 46.281 |
| 44368.01913194445 | 45.644 |
| 44368.06079861111 | 45.026 |
| 44368.102465277785 | 44.466 |
| 44368.14413194445 | 44.003 |
| 44368.18579861111 | 43.501 |
| 44368.227465277785 | 43.115 |
| 44368.26913194445 | 42.671 |
| 44368.31079861111 | 42.362 |
| 44368.352465277785 | 42.42 |
| 44368.39413194445 | 43.501 |
| 44368.43579861111 | 45.451 |
| 44368.477465277785 | 48.057 |
| 44368.51913194445 | 50.895 |
| 44368.56079861111 | 53.482 |
| 44368.602465277785 | 55.663 |
| 44368.64413194445 | 57.053 |
| 44368.68579861111 | 57.362 |
| 44368.727465277785 | 57.072 |
| 44368.76913194445 | 55.528 |
| 44368.81079861111 | 53.443 |
| 44368.852465277785 | 51.339 |
| 44368.89413194445 | 49.563 |
| 44368.93579861111 | 48.076 |
| 44368.977465277785 | 46.86 |
| 44369.01913194445 | 45.779 |
| 44369.06079861111 | 44.91 |
| 44369.102465277785 | 44.215 |
| 44369.14413194445 | 43.617 |
| 44369.18579861111 | 43.115 |
| 44369.227465277785 | 42.632 |
| 44369.26913194445 | 42.362 |
| 44369.31079861111 | 42.188 |
| 44369.352465277785 | 42.381 |
| 44369.39413194445 | 43.095 |
| 44369.43579861111 | 45.412 |
| 44369.477465277785 | 48.076 |
| 44369.51913194445 | 50.296 |
| 44369.56079861111 | 52.69 |
| 44369.602465277785 | 53.115 |
| 44369.64413194445 | 53.984 |
| 44369.68579861111 | 54.37 |
| 44369.727465277785 | 54.466 |
| 44369.76913194445 | 53.675 |
| 44369.81079861111 | 52.632 |
| 44369.852465277785 | 50.953 |
| 44369.89413194445 | 49.505 |
| 44369.93579861111 | 48.173 |
| 44369.977465277785 | 47.014 |
| 44370.01913194445 | 45.972 |
| 44370.06079861111 | 45.161 |
| 44370.102465277785 | 44.524 |
| 44370.14413194445 | 43.926 |
| 44370.18579861111 | 43.52 |
| 44370.227465277785 | 43.057 |
| 44370.26913194445 | 42.671 |
| 44370.31079861111 | 42.516 |
| 44370.352465277785 | 42.806 |
| 44370.39413194445 | 43.694 |
| 44370.43579861111 | 45.354 |
| 44370.477465277785 | 47.652 |
| 44370.51913194445 | 48.713 |
| 44370.56079861111 | 49.447 |
| 44370.602465277785 | 49.64 |
| 44370.64413194445 | 49.64 |
| 44370.68579861111 | 50.142 |
| 44370.727465277785 | 50.509 |
| 44370.76913194445 | 49.524 |
| 44370.81079861111 | 49.022 |
| 44370.852465277785 | 48.366 |
| 44370.89413194445 | 47.536 |
| 44370.93579861111 | 46.725 |
| 44370.977465277785 | 46.03 |
| 44371.01913194445 | 45.586 |
| 44371.06079861111 | 45.2 |
| 44371.102465277785 | 45.026 |
| 44371.14413194445 | 44.775 |
| 44371.18579861111 | 44.621 |
| 44371.227465277785 | 44.485 |
| 44371.26913194445 | 44.292 |
| 44371.31079861111 | 44.157 |
| 44371.352465277785 | 44.273 |
| 44371.39413194445 | 45.045 |
| 44371.43579861111 | 45.567 |
| 44371.477465277785 | 46.783 |
| 44371.51913194445 | 47.941 |
| 44371.56079861111 | 49.93 |
| 44371.602465277785 | 51.59 |
| 44371.64413194445 | 51.049 |
| 44371.68579861111 | 50.026 |
| 44371.727465277785 | 49.891 |
| 44371.76913194445 | 49.64 |
| 44371.81079861111 | 48.636 |
| 44371.852465277785 | 47.613 |
| 44371.89413194445 | 46.841 |
| 44371.93579861111 | 46.049 |
| 44371.977465277785 | 45.451 |
| 44372.01913194445 | 44.833 |
| 44372.06079861111 | 44.215 |
| 44372.102465277785 | 43.694 |
| 44372.14413194445 | 43.366 |
| 44372.18579861111 | 43.095 |
| 44372.227465277785 | 42.787 |
| 44372.26913194445 | 42.69 |
| 44372.31079861111 | 42.69 |
| 44372.352465277785 | 42.902 |
| 44372.39413194445 | 43.771 |
| 44372.43579861111 | 45.123 |
| 44372.477465277785 | 47.439 |
| 44372.51913194445 | 49.949 |
| 44372.56079861111 | 52.053 |
| 44372.602465277785 | 50.721 |
| 44372.64413194445 | 50.528 |
| 44372.68579861111 | 51.339 |
| 44372.727465277785 | 51.841 |
| 44372.76913194445 | 51.339 |
| 44372.81079861111 | 49.949 |
| 44372.852465277785 | 48.848 |
| 44372.89413194445 | 47.825 |
| 44372.93579861111 | 46.957 |
| 44372.977465277785 | 46.281 |
| 44373.01913194445 | 45.74 |
| 44373.06079861111 | 45.277 |
| 44373.102465277785 | 44.929 |
| 44373.14413194445 | 44.717 |
| 44373.18579861111 | 44.679 |
| 44373.227465277785 | 44.485 |
| 44373.26913194445 | 44.292 |
| 44373.31079861111 | 44.215 |
| 44373.352465277785 | 44.35 |
| 44373.39413194445 | 44.679 |
| 44373.43579861111 | 45.702 |
| 44373.477465277785 | 46.667 |
| 44373.51913194445 | 48.173 |
| 44373.56079861111 | 50.219 |
| 44373.602465277785 | 51.049 |
| 44373.64413194445 | 52.748 |
| 44373.68579861111 | 53.096 |
| 44373.727465277785 | 52.709 |
| 44373.76913194445 | 52.014 |
| 44373.81079861111 | 50.953 |
| 44373.852465277785 | 49.408 |
| 44373.89413194445 | 48.076 |
| 44373.93579861111 | 46.995 |
| 44373.977465277785 | 46.107 |
| 44374.01913194445 | 45.316 |
| 44374.06079861111 | 44.929 |
| 44374.102465277785 | 44.659 |
| 44374.14413194445 | 44.331 |
| 44374.18579861111 | 44.138 |
| 44374.227465277785 | 43.964 |
| 44374.26913194445 | 43.771 |
| 44374.31079861111 | 43.81 |
| 44374.352465277785 | 43.906 |
| 44374.39413194445 | 44.852 |
| 44374.43579861111 | 46.011 |
| 44374.477465277785 | 47.362 |
| 44374.51913194445 | 49.041 |
| 44374.56079861111 | 50.412 |
| 44374.602465277785 | 52.69 |
| 44374.64413194445 | 53.482 |
| 44374.68579861111 | 53.211 |
| 44374.727465277785 | 53.057 |
| 44374.76913194445 | 52.574 |
| 44374.81079861111 | 51.146 |
| 44374.852465277785 | 49.543 |
| 44374.89413194445 | 48.115 |
| 44374.93579861111 | 47.111 |
| 44374.977465277785 | 46.223 |
| 44375.01913194445 | 45.393 |
| 44375.06079861111 | 44.621 |
| 44375.102465277785 | 44.003 |
| 44375.14413194445 | 43.501 |
| 44375.18579861111 | 42.922 |
| 44375.227465277785 | 42.478 |
| 44375.26913194445 | 42.111 |
| 44375.31079861111 | 41.918 |
| 44375.352465277785 | 41.956 |
| 44375.39413194445 | 43.057 |
| 44375.43579861111 | 44.891 |
| 44375.477465277785 | 46.937 |
| 44375.51913194445 | 49.022 |
| 44375.56079861111 | 51.86 |
| 44375.602465277785 | 53.906 |
| 44375.64413194445 | 54.852 |
| 44375.68579861111 | 54.698 |
| 44375.727465277785 | 55.316 |
| 44375.76913194445 | 54.949 |
| 44375.81079861111 | 53.153 |
| 44375.852465277785 | 51.088 |
| 44375.89413194445 | 49.254 |
| 44375.93579861111 | 47.632 |
| 44375.977465277785 | 46.57 |
| 44376.01913194445 | 46.011 |
| 44376.06079861111 | 45.509 |
| 44376.102465277785 | 45.142 |
| 44376.14413194445 | 44.872 |
| 44376.18579861111 | 44.505 |
| 44376.227465277785 | 44.234 |
| 44376.26913194445 | 43.984 |
| 44376.31079861111 | 43.964 |
| 44376.352465277785 | 44.254 |
| 44376.39413194445 | 45.18 |
| 44376.43579861111 | 47.034 |
| 44376.477465277785 | 49.717 |
| 44376.51913194445 | 50.798 |
| 44376.56079861111 | 51.783 |
| 44376.602465277785 | 54.91 |
| 44376.64413194445 | 54.717 |
| 44376.68579861111 | 54.486 |
| 44376.727465277785 | 54.35 |
| 44376.76913194445 | 53.424 |
| 44376.81079861111 | 51.802 |
| 44376.852465277785 | 50.084 |
| 44376.89413194445 | 48.887 |
| 44376.93579861111 | 48.404 |
| 44376.977465277785 | 47.96 |
| 44377.01913194445 | 47.478 |
| 44377.06079861111 | 47.207 |
| 44377.102465277785 | 46.899 |
| 44377.14413194445 | 46.493 |
| 44377.18579861111 | 46.3 |
| 44377.227465277785 | 46.011 |
| 44377.26913194445 | 45.837 |
| 44377.31079861111 | 45.76 |
| 44377.352465277785 | 45.895 |
| 44377.39413194445 | 46.899 |
| 44377.43579861111 | 48.791 |
| 44377.477465277785 | 51.474 |
| 44377.51913194445 | 54.08 |
| 44377.56079861111 | 56.339 |
| 44377.602465277785 | 57.15 |
| 44377.64413194445 | 56.783 |
| 44377.68579861111 | 56.107 |
| 44377.727465277785 | 56.358 |
| 44377.76913194445 | 54.273 |
| 44377.81079861111 | 52.98 |
| 44377.852465277785 | 52.169 |
| 44377.89413194445 | 51.319 |
| 44377.93579861111 | 50.586 |
| 44377.977465277785 | 50.123 |
| 44378.01913194445 | 49.814 |
| 44378.06079861111 | 49.698 |
| 44378.102465277785 | 49.582 |
| 44378.14413194445 | 49.524 |
| 44378.18579861111 | 49.37 |
| 44378.227465277785 | 49.254 |
| 44378.26913194445 | 49.041 |
| 44378.31079861111 | 48.964 |
| 44378.352465277785 | 49.273 |
| 44378.39413194445 | 49.64 |
| 44378.43579861111 | 50.663 |
| 44378.477465277785 | 52.285 |
| 44378.51913194445 | 53.945 |
| 44378.56079861111 | 54.563 |
| 44378.602465277785 | 55.837 |
| 44378.64413194445 | 56.667 |
| 44378.68579861111 | 56.069 |
| 44378.727465277785 | 55.219 |
| 44378.76913194445 | 54.698 |
| 44378.81079861111 | 54.003 |
| 44378.852465277785 | 53.366 |
| 44378.89413194445 | 52.439 |
| 44378.93579861111 | 51.802 |
| 44378.977465277785 | 51.339 |
| 44379.01913194445 | 50.991 |
| 44379.06079861111 | 50.644 |
| 44379.102465277785 | 50.277 |
| 44379.14413194445 | 49.987 |
| 44379.18579861111 | 49.794 |
| 44379.227465277785 | 49.582 |
| 44379.26913194445 | 49.408 |
| 44379.31079861111 | 49.254 |
| 44379.352465277785 | 49.35 |
| 44379.39413194445 | 50.238 |
| 44379.43579861111 | 51.879 |
| 44379.477465277785 | 54.061 |
| 44379.51913194445 | 55.798 |
| 44379.56079861111 | 57.497 |
| 44379.602465277785 | 57.941 |
| 44379.64413194445 | 57.323 |
| 44379.68579861111 | 57.072 |
| 44379.727465277785 | 56.165 |
| 44379.76913194445 | 55.026 |
| 44379.81079861111 | 54.235 |
| 44379.852465277785 | 53.211 |
| 44379.89413194445 | 52.497 |
| 44379.93579861111 | 51.628 |
| 44379.977465277785 | 51.011 |
| 44380.01913194445 | 50.605 |
| 44380.06079861111 | 50.277 |
| 44380.102465277785 | 50.045 |
| 44380.14413194445 | 49.852 |
| 44380.18579861111 | 49.679 |
| 44380.227465277785 | 49.485 |
| 44380.26913194445 | 49.312 |
| 44380.31079861111 | 49.138 |
| 44380.352465277785 | 49.273 |
| 44380.39413194445 | 50.2 |
| 44380.43579861111 | 51.918 |
| 44380.477465277785 | 54.177 |
| 44380.51913194445 | 56.088 |
| 44380.56079861111 | 56.686 |
| 44380.602465277785 | 57.71 |
| 44380.64413194445 | 56.493 |
| 44380.68579861111 | 56.764 |
| 44380.727465277785 | 57.13 |
| 44380.76913194445 | 56.764 |
| 44380.81079861111 | 55.991 |
| 44380.852465277785 | 54.698 |
| 44380.89413194445 | 53.482 |
| 44380.93579861111 | 52.458 |
| 44380.977465277785 | 51.706 |
| 44381.01913194445 | 51.204 |
| 44381.06079861111 | 50.895 |
| 44381.102465277785 | 50.682 |
| 44381.14413194445 | 50.528 |
| 44381.18579861111 | 50.374 |
| 44381.227465277785 | 50.219 |
| 44381.26913194445 | 49.968 |
| 44381.31079861111 | 49.659 |
| 44381.352465277785 | 49.833 |
| 44381.39413194445 | 50.663 |
| 44381.43579861111 | 52.381 |
| 44381.477465277785 | 54.64 |
| 44381.51913194445 | 57.034 |
| 44381.56079861111 | 59.215 |
| 44381.602465277785 | 60.123 |
| 44381.64413194445 | 59.543 |
| 44381.68579861111 | 59.293 |
| 44381.727465277785 | 57.053 |
| 44381.76913194445 | 55.953 |
| 44381.81079861111 | 54.872 |
| 44381.852465277785 | 53.926 |
| 44381.89413194445 | 53.076 |
| 44381.93579861111 | 52.458 |
| 44381.977465277785 | 51.86 |
| 44382.01913194445 | 51.397 |
| 44382.06079861111 | 51.03 |
| 44382.102465277785 | 50.914 |
| 44382.14413194445 | 50.779 |
| 44382.18579861111 | 50.625 |
| 44382.227465277785 | 50.431 |
| 44382.26913194445 | 50.219 |
| 44382.31079861111 | 50.103 |
| 44382.352465277785 | 50.142 |
| 44382.39413194445 | 50.972 |
| 44382.43579861111 | 52.613 |
| 44382.477465277785 | 54.891 |
| 44382.51913194445 | 56.146 |
| 44382.56079861111 | 56.706 |
| 44382.602465277785 | 56.59 |
| 44382.64413194445 | 57.227 |
| 44382.68579861111 | 56.628 |
| 44382.727465277785 | 55.856 |
| 44382.76913194445 | 55.663 |
| 44382.81079861111 | 54.35 |
| 44382.852465277785 | 53.52 |
| 44382.89413194445 | 53.327 |
| 44382.93579861111 | 52.903 |
| 44382.977465277785 | 52.343 |
| 44383.01913194445 | 52.053 |
| 44383.06079861111 | 51.899 |
| 44383.102465277785 | 51.802 |
| 44383.14413194445 | 51.628 |
| 44383.18579861111 | 51.493 |
| 44383.227465277785 | 51.262 |
| 44383.26913194445 | 51.011 |
| 44383.31079861111 | 50.895 |
| 44383.352465277785 | 50.972 |
| 44383.39413194445 | 51.725 |
| 44383.43579861111 | 53.289 |
| 44383.477465277785 | 55.335 |
| 44383.51913194445 | 57.536 |
| 44383.56079861111 | 59.428 |
| 44383.602465277785 | 60.972 |
| 44383.64413194445 | 61.783 |
| 44383.68579861111 | 61.86 |
| 44383.727465277785 | 61.223 |
| 44383.76913194445 | 59.814 |
| 44383.81079861111 | 57.845 |
| 44383.852465277785 | 56.126 |
| 44383.89413194445 | 54.756 |
| 44383.93579861111 | 53.559 |
| 44383.977465277785 | 52.864 |
| 44384.01913194445 | 52.42 |
| 44384.06079861111 | 52.208 |
| 44384.102465277785 | 51.976 |
| 44384.14413194445 | 51.783 |
| 44384.18579861111 | 51.59 |
| 44384.227465277785 | 51.242 |
| 44384.26913194445 | 50.991 |
| 44384.31079861111 | 50.798 |
| 44384.352465277785 | 50.837 |
| 44384.39413194445 | 51.628 |
| 44384.43579861111 | 53.134 |
| 44384.477465277785 | 55.238 |
| 44384.51913194445 | 57.42 |
| 44384.56079861111 | 59.428 |
| 44384.602465277785 | 60.991 |
| 44384.64413194445 | 61.937 |
| 44384.68579861111 | 62.111 |
| 44384.727465277785 | 61.416 |
| 44384.76913194445 | 60.103 |
| 44384.81079861111 | 58.192 |
| 44384.852465277785 | 56.493 |
| 44384.89413194445 | 55.026 |
| 44384.93579861111 | 53.848 |
| 44384.977465277785 | 53.115 |
| 44385.01913194445 | 52.748 |
| 44385.06079861111 | 52.381 |
| 44385.102465277785 | 52.13 |
| 44385.14413194445 | 51.841 |
| 44385.18579861111 | 51.57 |
| 44385.227465277785 | 51.358 |
| 44385.26913194445 | 51.223 |
| 44385.31079861111 | 51.088 |
| 44385.352465277785 | 51.358 |
| 44385.39413194445 | 51.976 |
| 44385.43579861111 | 53.385 |
| 44385.477465277785 | 55.296 |
| 44385.51913194445 | 56.783 |
| 44385.56079861111 | 57.594 |
| 44385.602465277785 | 58.578 |
| 44385.64413194445 | 60.181 |
| 44385.68579861111 | 59.447 |
| 44385.727465277785 | 58.81 |
| 44385.76913194445 | 57.787 |
| 44385.81079861111 | 56.686 |
| 44385.852465277785 | 55.181 |
| 44385.89413194445 | 54.138 |
| 44385.93579861111 | 53.115 |
| 44385.977465277785 | 52.381 |
| 44386.01913194445 | 51.783 |
| 44386.06079861111 | 51.339 |
| 44386.102465277785 | 51.146 |
| 44386.14413194445 | 50.933 |
| 44386.18579861111 | 50.644 |
| 44386.227465277785 | 50.451 |
| 44386.26913194445 | 50.2 |
| 44386.31079861111 | 50.065 |
| 44386.352465277785 | 50.277 |
| 44386.39413194445 | 51.107 |
| 44386.43579861111 | 52.748 |
| 44386.477465277785 | 55.045 |
| 44386.51913194445 | 56.957 |
| 44386.56079861111 | 58.791 |
| 44386.602465277785 | 58.829 |
| 44386.64413194445 | 58.096 |
| 44386.68579861111 | 57.111 |
| 44386.727465277785 | 56.686 |
| 44386.76913194445 | 56.069 |
| 44386.81079861111 | 55.528 |
| 44386.852465277785 | 54.756 |
| 44386.89413194445 | 53.81 |
| 44386.93579861111 | 52.96 |
| 44386.977465277785 | 52.304 |
| 44387.01913194445 | 51.551 |
| 44387.06079861111 | 50.953 |
| 44387.102465277785 | 50.431 |
| 44387.14413194445 | 49.93 |
| 44387.18579861111 | 49.524 |
| 44387.227465277785 | 49.119 |
| 44387.26913194445 | 48.752 |
| 44387.31079861111 | 48.52 |
| 44387.352465277785 | 48.559 |
| 44387.39413194445 | 49.447 |
| 44387.43579861111 | 51.165 |
| 44387.477465277785 | 53.482 |
| 44387.51913194445 | 55.721 |
| 44387.56079861111 | 57.883 |
| 44387.602465277785 | 59.524 |
| 44387.64413194445 | 60.489 |
| 44387.68579861111 | 60.625 |
| 44387.727465277785 | 59.968 |
| 44387.76913194445 | 58.636 |
| 44387.81079861111 | 56.86 |
| 44387.852465277785 | 55.161 |
| 44387.89413194445 | 53.52 |
| 44387.93579861111 | 52.188 |
| 44387.977465277785 | 51.069 |
| 44388.01913194445 | 50.238 |
| 44388.06079861111 | 49.659 |
| 44388.102465277785 | 49.254 |
| 44388.14413194445 | 48.868 |
| 44388.18579861111 | 48.578 |
| 44388.227465277785 | 48.308 |
| 44388.26913194445 | 47.98 |
| 44388.31079861111 | 47.902 |
| 44388.352465277785 | 48.076 |
| 44388.39413194445 | 48.771 |
| 44388.43579861111 | 50.393 |
| 44388.477465277785 | 52.478 |
| 44388.51913194445 | 54.833 |
| 44388.56079861111 | 57.15 |
| 44388.602465277785 | 58.964 |
| 44388.64413194445 | 60.065 |
| 44388.68579861111 | 60.412 |
| 44388.727465277785 | 59.756 |
| 44388.76913194445 | 58.52 |
| 44388.81079861111 | 56.686 |
| 44388.852465277785 | 54.794 |
| 44388.89413194445 | 53.173 |
| 44388.93579861111 | 51.764 |
| 44388.977465277785 | 50.644 |
| 44389.01913194445 | 49.872 |
| 44389.06079861111 | 49.312 |
| 44389.102465277785 | 48.81 |
| 44389.14413194445 | 48.52 |
| 44389.18579861111 | 48.231 |
| 44389.227465277785 | 47.825 |
| 44389.26913194445 | 47.632 |
| 44389.31079861111 | 47.536 |
| 44389.352465277785 | 47.767 |
| 44389.39413194445 | 48.559 |
| 44389.43579861111 | 49.987 |
| 44389.477465277785 | 51.937 |
| 44389.51913194445 | 54.273 |
| 44389.56079861111 | 56.532 |
| 44389.602465277785 | 58.655 |
| 44389.64413194445 | 59.737 |
| 44389.68579861111 | 60.586 |
| 44389.727465277785 | 59.949 |
| 44389.76913194445 | 58.598 |
| 44389.81079861111 | 56.667 |
| 44389.852465277785 | 54.428 |
| 44389.89413194445 | 52.536 |
| 44389.93579861111 | 51.146 |
| 44389.977465277785 | 50.277 |
| 44390.01913194445 | 49.698 |
| 44390.06079861111 | 49.235 |
| 44390.102465277785 | 48.791 |
| 44390.14413194445 | 48.443 |
| 44390.18579861111 | 48.173 |
| 44390.227465277785 | 47.864 |
| 44390.26913194445 | 47.613 |
| 44390.31079861111 | 47.304 |
| 44390.352465277785 | 47.401 |
| 44390.39413194445 | 48.096 |
| 44390.43579861111 | 49.64 |
| 44390.477465277785 | 51.377 |
| 44390.51913194445 | 52.709 |
| 44390.56079861111 | 54.042 |
| 44390.602465277785 | 55.142 |
| 44390.64413194445 | 55.393 |
| 44390.68579861111 | 56.049 |
| 44390.727465277785 | 55.644 |
| 44390.76913194445 | 54.621 |
| 44390.81079861111 | 53.308 |
| 44390.852465277785 | 51.995 |
| 44390.89413194445 | 50.625 |
| 44390.93579861111 | 49.582 |
| 44390.977465277785 | 48.868 |
| 44391.01913194445 | 48.327 |
| 44391.06079861111 | 47.787 |
| 44391.102465277785 | 47.323 |
| 44391.14413194445 | 46.957 |
| 44391.18579861111 | 46.686 |
| 44391.227465277785 | 46.416 |
| 44391.26913194445 | 46.165 |
| 44391.31079861111 | 46.126 |
| 44391.352465277785 | 46.358 |
| 44391.39413194445 | 46.841 |
| 44391.43579861111 | 47.13 |
| 44391.477465277785 | 47.787 |
| 44391.51913194445 | 48.791 |
| 44391.56079861111 | 49.872 |
| 44391.602465277785 | 50.875 |
| 44391.64413194445 | 51.011 |
| 44391.68579861111 | 50.335 |
| 44391.727465277785 | 49.717 |
| 44391.76913194445 | 49.273 |
| 44391.81079861111 | 48.791 |
| 44391.852465277785 | 48.096 |
| 44391.89413194445 | 47.362 |
| 44391.93579861111 | 46.995 |
| 44391.977465277785 | 46.59 |
| 44392.01913194445 | 45.895 |
| 44392.06079861111 | 45.47 |
| 44392.102465277785 | 45.103 |
| 44392.14413194445 | 44.679 |
| 44392.18579861111 | 44.35 |
| 44392.227465277785 | 44.022 |
| 44392.26913194445 | 43.713 |
| 44392.31079861111 | 43.617 |
| 44392.352465277785 | 43.771 |
| 44392.39413194445 | 44.717 |
| 44392.43579861111 | 46.609 |
| 44392.477465277785 | 49.215 |
| 44392.51913194445 | 52.053 |
| 44392.56079861111 | 54.814 |
| 44392.602465277785 | 57.15 |
| 44392.64413194445 | 58.791 |
| 44392.68579861111 | 58.636 |
| 44392.727465277785 | 57.903 |
| 44392.76913194445 | 56.706 |
| 44392.81079861111 | 54.717 |
| 44392.852465277785 | 52.613 |
| 44392.89413194445 | 50.798 |
| 44392.93579861111 | 49.312 |
| 44392.977465277785 | 48.269 |
| 44393.01913194445 | 47.362 |
| 44393.06079861111 | 46.628 |
| 44393.102465277785 | 45.895 |
| 44393.14413194445 | 45.277 |
| 44393.18579861111 | 44.794 |
| 44393.227465277785 | 44.389 |
| 44393.26913194445 | 44.003 |
| 44393.31079861111 | 43.848 |
| 44393.352465277785 | 43.945 |
| 44393.39413194445 | 44.949 |
| 44393.43579861111 | 46.821 |
| 44393.477465277785 | 49.254 |
| 44393.51913194445 | 50.316 |
| 44393.56079861111 | 51.57 |
| 44393.602465277785 | 52.285 |
| 44393.64413194445 | 53.462 |
| 44393.68579861111 | 53.868 |
| 44393.727465277785 | 53.752 |
| 44393.76913194445 | 52.883 |
| 44393.81079861111 | 51.937 |
| 44393.852465277785 | 50.605 |
| 44393.89413194445 | 49.601 |
| 44393.93579861111 | 48.54 |
| 44393.977465277785 | 47.42 |
| 44394.01913194445 | 46.628 |
| 44394.06079861111 | 45.991 |
| 44394.102465277785 | 45.47 |
| 44394.14413194445 | 45.258 |
| 44394.18579861111 | 45.065 |
| 44394.227465277785 | 44.891 |
| 44394.26913194445 | 44.756 |
| 44394.31079861111 | 44.736 |
| 44394.352465277785 | 45.238 |
| 44394.39413194445 | 46.262 |
| 44394.43579861111 | 48.076 |
| 44394.477465277785 | 50.875 |
| 44394.51913194445 | 52.072 |
| 44394.56079861111 | 54.891 |
| 44394.602465277785 | 57.96 |
| 44394.64413194445 | 56.609 |
| 44394.68579861111 | 55.142 |
| 44394.727465277785 | 53.984 |
| 44394.76913194445 | 52.98 |
| 44394.81079861111 | 51.725 |
| 44394.852465277785 | 50.354 |
| 44394.89413194445 | 49.505 |
| 44394.93579861111 | 48.713 |
| 44394.977465277785 | 47.864 |
| 44395.01913194445 | 46.937 |
| 44395.06079861111 | 46.204 |
| 44395.102465277785 | 45.624 |
| 44395.14413194445 | 45.142 |
| 44395.18579861111 | 44.756 |
| 44395.227465277785 | 44.428 |
| 44395.26913194445 | 44.196 |
| 44395.31079861111 | 43.906 |
| 44395.352465277785 | 44.08 |
| 44395.39413194445 | 45.103 |
| 44395.43579861111 | 46.899 |
| 44395.477465277785 | 49.717 |
| 44395.51913194445 | 52.748 |
| 44395.56079861111 | 55.489 |
| 44395.602465277785 | 58.018 |
| 44395.64413194445 | 60.103 |
| 44395.68579861111 | 60.258 |
| 44395.727465277785 | 60.644 |
| 44395.76913194445 | 59.505 |
| 44395.81079861111 | 57.574 |
| 44395.852465277785 | 55.316 |
| 44395.89413194445 | 52.999 |
| 44395.93579861111 | 50.818 |
| 44395.977465277785 | 49.177 |
| 44396.01913194445 | 47.96 |
| 44396.06079861111 | 46.86 |
| 44396.102465277785 | 46.068 |
| 44396.14413194445 | 45.373 |
| 44396.18579861111 | 44.756 |
| 44396.227465277785 | 44.312 |
| 44396.26913194445 | 43.906 |
| 44396.31079861111 | 43.636 |
| 44396.352465277785 | 43.733 |
| 44396.39413194445 | 44.601 |
| 44396.43579861111 | 46.358 |
| 44396.477465277785 | 48.848 |
| 44396.51913194445 | 51.628 |
| 44396.56079861111 | 54.505 |
| 44396.602465277785 | 57.362 |
| 44396.64413194445 | 59.543 |
| 44396.68579861111 | 59.08 |
| 44396.727465277785 | 59.215 |
| 44396.76913194445 | 57.652 |
| 44396.81079861111 | 55.412 |
| 44396.852465277785 | 53.289 |
| 44396.89413194445 | 51.262 |
| 44396.93579861111 | 49.466 |
| 44396.977465277785 | 48.018 |
| 44397.01913194445 | 46.899 |
| 44397.06079861111 | 46.126 |
| 44397.102465277785 | 45.547 |
| 44397.14413194445 | 45.045 |
| 44397.18579861111 | 44.736 |
| 44397.227465277785 | 44.35 |
| 44397.26913194445 | 43.984 |
| 44397.31079861111 | 43.829 |
| 44397.352465277785 | 44.061 |
| 44397.39413194445 | 44.891 |
| 44397.43579861111 | 46.783 |
| 44397.477465277785 | 49.563 |
| 44397.51913194445 | 52.536 |
| 44397.56079861111 | 55.528 |
| 44397.602465277785 | 57.439 |
| 44397.64413194445 | 57.96 |
| 44397.68579861111 | 58.52 |
| 44397.727465277785 | 58.713 |
| 44397.76913194445 | 57.285 |
| 44397.81079861111 | 55.605 |
| 44397.852465277785 | 53.733 |
| 44397.89413194445 | 52.208 |
| 44397.93579861111 | 50.798 |
| 44397.977465277785 | 49.254 |
| 44398.01913194445 | 48.076 |
| 44398.06079861111 | 47.323 |
| 44398.102465277785 | 46.648 |
| 44398.14413194445 | 46.011 |
| 44398.18579861111 | 45.489 |
| 44398.227465277785 | 45.084 |
| 44398.26913194445 | 44.91 |
| 44398.31079861111 | 44.756 |
| 44398.352465277785 | 44.794 |
| 44398.39413194445 | 45.567 |
| 44398.43579861111 | 47.092 |
| 44398.477465277785 | 49.814 |
| 44398.51913194445 | 52.497 |
| 44398.56079861111 | 52.787 |
| 44398.602465277785 | 53.211 |
| 44398.64413194445 | 54.582 |
| 44398.68579861111 | 54.582 |
| 44398.727465277785 | 54.601 |
| 44398.76913194445 | 54.292 |
| 44398.81079861111 | 52.458 |
| 44398.852465277785 | 50.644 |
| 44398.89413194445 | 49.698 |
| 44398.93579861111 | 49.215 |
| 44398.977465277785 | 48.752 |
| 44399.01913194445 | 48.192 |
| 44399.06079861111 | 48.192 |
| 44399.102465277785 | 48.269 |
| 44399.14413194445 | 47.806 |
| 44399.18579861111 | 47.034 |
| 44399.227465277785 | 46.223 |
| 44399.26913194445 | 45.895 |
| 44399.31079861111 | 45.682 |
| 44399.352465277785 | 45.74 |
| 44399.39413194445 | 46.648 |
| 44399.43579861111 | 48.192 |
| 44399.477465277785 | 50.74 |
| 44399.51913194445 | 53.675 |
| 44399.56079861111 | 56.57 |
| 44399.602465277785 | 58.926 |
| 44399.64413194445 | 58.578 |
| 44399.68579861111 | 57.459 |
| 44399.727465277785 | 56.011 |
| 44399.76913194445 | 54.138 |
| 44399.81079861111 | 52.362 |
| 44399.852465277785 | 50.567 |
| 44399.89413194445 | 49.35 |
| 44399.93579861111 | 48.346 |
| 44399.977465277785 | 47.787 |
| 44400.01913194445 | 47.362 |
| 44400.06079861111 | 46.763 |
| 44400.102465277785 | 46.435 |
| 44400.14413194445 | 46.107 |
| 44400.18579861111 | 45.779 |
| 44400.227465277785 | 45.47 |
| 44400.26913194445 | 45.103 |
| 44400.31079861111 | 44.852 |
| 44400.352465277785 | 44.968 |
| 44400.39413194445 | 45.953 |
| 44400.43579861111 | 47.729 |
| 44400.477465277785 | 50.509 |
| 44400.51913194445 | 53.443 |
| 44400.56079861111 | 56.416 |
| 44400.602465277785 | 58.713 |
| 44400.64413194445 | 57.71 |
| 44400.68579861111 | 56.493 |
| 44400.727465277785 | 54.794 |
| 44400.76913194445 | 51.764 |
| 44400.81079861111 | 51.532 |
| 44400.852465277785 | 51.744 |
| 44400.89413194445 | 50.586 |
| 44400.93579861111 | 49.524 |
| 44400.977465277785 | 49.312 |
| 44401.01913194445 | 48.829 |
| 44401.06079861111 | 48.289 |
| 44401.102465277785 | 47.902 |
| 44401.14413194445 | 47.478 |
| 44401.18579861111 | 47.111 |
| 44401.227465277785 | 46.686 |
| 44401.26913194445 | 46.184 |
| 44401.31079861111 | 46.049 |
| 44401.352465277785 | 46.262 |
| 44401.39413194445 | 46.609 |
| 44401.43579861111 | 47.555 |
| 44401.477465277785 | 49.389 |
| 44401.51913194445 | 50.914 |
| 44401.56079861111 | 53.578 |
| 44401.602465277785 | 54.235 |
| 44401.64413194445 | 54.64 |
| 44401.68579861111 | 55.007 |
| 44401.727465277785 | 54.582 |
| 44401.76913194445 | 53.211 |
| 44401.81079861111 | 51.821 |
| 44401.852465277785 | 50.528 |
| 44401.89413194445 | 49.312 |
| 44401.93579861111 | 48.385 |
| 44401.977465277785 | 47.478 |
| 44402.01913194445 | 46.802 |
| 44402.06079861111 | 46.204 |
| 44402.102465277785 | 45.567 |
| 44402.14413194445 | 45.142 |
| 44402.18579861111 | 44.949 |
| 44402.227465277785 | 44.659 |
| 44402.26913194445 | 44.408 |
| 44402.31079861111 | 44.466 |
| 44402.352465277785 | 44.872 |
| 44402.39413194445 | 45.624 |
| 44402.43579861111 | 47.304 |
| 44402.477465277785 | 49.582 |
| 44402.51913194445 | 52.401 |
| 44402.56079861111 | 55.123 |
| 44402.602465277785 | 57.555 |
| 44402.64413194445 | 59.524 |
| 44402.68579861111 | 60.547 |
| 44402.727465277785 | 60.181 |
| 44402.76913194445 | 58.462 |
| 44402.81079861111 | 56.339 |
| 44402.852465277785 | 54.215 |
| 44402.89413194445 | 52.401 |
| 44402.93579861111 | 51.011 |
| 44402.977465277785 | 50.045 |
| 44403.01913194445 | 49.119 |
| 44403.06079861111 | 48.153 |
| 44403.102465277785 | 47.323 |
| 44403.14413194445 | 46.821 |
| 44403.18579861111 | 46.397 |
| 44403.227465277785 | 46.088 |
| 44403.26913194445 | 45.779 |
| 44403.31079861111 | 45.624 |
| 44403.352465277785 | 45.779 |
| 44403.39413194445 | 46.744 |
| 44403.43579861111 | 48.443 |
| 44403.477465277785 | 50.933 |
| 44403.51913194445 | 53.752 |
| 44403.56079861111 | 56.628 |
| 44403.602465277785 | 58.25 |
| 44403.64413194445 | 58.327 |
| 44403.68579861111 | 59.177 |
| 44403.727465277785 | 57.594 |
| 44403.76913194445 | 56.532 |
| 44403.81079861111 | 55.026 |
| 44403.852465277785 | 53.636 |
| 44403.89413194445 | 52.227 |
| 44403.93579861111 | 50.953 |
| 44403.977465277785 | 49.852 |
| 44404.01913194445 | 48.945 |
| 44404.06079861111 | 48.346 |
| 44404.102465277785 | 47.767 |
| 44404.14413194445 | 47.42 |
| 44404.18579861111 | 47.072 |
| 44404.227465277785 | 46.686 |
| 44404.26913194445 | 46.416 |
| 44404.31079861111 | 46.262 |
| 44404.352465277785 | 46.3 |
| 44404.39413194445 | 47.227 |
| 44404.43579861111 | 49.022 |
| 44404.477465277785 | 51.59 |
| 44404.51913194445 | 54.408 |
| 44404.56079861111 | 57.169 |
| 44404.602465277785 | 59.775 |
| 44404.64413194445 | 61.628 |
| 44404.68579861111 | 62.072 |
| 44404.727465277785 | 61.358 |
| 44404.76913194445 | 60.625 |
| 44404.81079861111 | 58.713 |
| 44404.852465277785 | 56.184 |
| 44404.89413194445 | 53.964 |
| 44404.93579861111 | 52.343 |
| 44404.977465277785 | 51.184 |
| 44405.01913194445 | 50.509 |
| 44405.06079861111 | 49.968 |
| 44405.102465277785 | 49.563 |
| 44405.14413194445 | 49.138 |
| 44405.18579861111 | 48.81 |
| 44405.227465277785 | 48.482 |
| 44405.26913194445 | 48.096 |
| 44405.31079861111 | 47.96 |
| 44405.352465277785 | 48.018 |
| 44405.39413194445 | 48.713 |
| 44405.43579861111 | 50.451 |
| 44405.477465277785 | 52.96 |
| 44405.51913194445 | 55.605 |
| 44405.56079861111 | 58.385 |
| 44405.602465277785 | 60.74 |
| 44405.64413194445 | 62.304 |
| 44405.68579861111 | 63.038 |
| 44405.727465277785 | 62.652 |
| 44405.76913194445 | 60.238 |
| 44405.81079861111 | 58.598 |
| 44405.852465277785 | 56.3 |
| 44405.89413194445 | 54.292 |
| 44405.93579861111 | 53.057 |
| 44405.977465277785 | 52.13 |
| 44406.01913194445 | 51.126 |
| 44406.06079861111 | 50.547 |
| 44406.102465277785 | 50.103 |
| 44406.14413194445 | 49.601 |
| 44406.18579861111 | 49.273 |
| 44406.227465277785 | 48.926 |
| 44406.26913194445 | 48.559 |
| 44406.31079861111 | 48.54 |
| 44406.352465277785 | 48.81 |
| 44406.39413194445 | 49.428 |
| 44406.43579861111 | 51.146 |
| 44406.477465277785 | 53.636 |
| 44406.51913194445 | 56.107 |
| 44406.56079861111 | 58.675 |
| 44406.602465277785 | 61.107 |
| 44406.64413194445 | 62.555 |
| 44406.68579861111 | 62.999 |
| 44406.727465277785 | 62.574 |
| 44406.76913194445 | 60.876 |
| 44406.81079861111 | 59.003 |
| 44406.852465277785 | 57.246 |
| 44406.89413194445 | 55.528 |
| 44406.93579861111 | 54.215 |
| 44406.977465277785 | 52.806 |
| 44407.01913194445 | 51.802 |
| 44407.06079861111 | 51.242 |
| 44407.102465277785 | 50.547 |
| 44407.14413194445 | 49.872 |
| 44407.18579861111 | 49.331 |
| 44407.227465277785 | 48.81 |
| 44407.26913194445 | 48.385 |
| 44407.31079861111 | 48.25 |
| 44407.352465277785 | 48.346 |
| 44407.39413194445 | 49.08 |
| 44407.43579861111 | 50.567 |
| 44407.477465277785 | 53.153 |
| 44407.51913194445 | 56.049 |
| 44407.56079861111 | 58.771 |
| 44407.602465277785 | 60.644 |
| 44407.64413194445 | 59.698 |
| 44407.68579861111 | 58.849 |
| 44407.727465277785 | 57.96 |
| 44407.76913194445 | 55.837 |
| 44407.81079861111 | 54.003 |
| 44407.852465277785 | 53.366 |
| 44407.89413194445 | 52.864 |
| 44407.93579861111 | 52.014 |
| 44407.977465277785 | 51.397 |
| 44408.01913194445 | 51.319 |
| 44408.06079861111 | 51.377 |
| 44408.102465277785 | 51.416 |
| 44408.14413194445 | 51.339 |
| 44408.18579861111 | 51.049 |
| 44408.227465277785 | 50.76 |
| 44408.26913194445 | 50.702 |
| 44408.31079861111 | 50.721 |
| 44408.352465277785 | 50.972 |
| 44408.39413194445 | 51.764 |
| 44408.43579861111 | 52.999 |
| 44408.477465277785 | 55.219 |
| 44408.51913194445 | 56.667 |
| 44408.56079861111 | 57.13 |
| 44408.602465277785 | 57.072 |
| 44408.64413194445 | 56.841 |
| 44408.68579861111 | 56.069 |
| 44408.727465277785 | 54.852 |
| 44408.76913194445 | 54.563 |
| 44408.81079861111 | 54.312 |
| 44408.852465277785 | 53.848 |
| 44408.89413194445 | 53.482 |
| 44408.93579861111 | 53.269 |
| 44408.977465277785 | 53.115 |
| 44409.01913194445 | 52.903 |
| 44409.06079861111 | 52.806 |
| 44409.102465277785 | 52.864 |
| 44409.14413194445 | 52.787 |
| 44409.18579861111 | 52.69 |
| 44409.227465277785 | 52.671 |
| 44409.26913194445 | 52.709 |
| 44409.31079861111 | 52.845 |
| 44409.352465277785 | 53.018 |
| 44409.39413194445 | 53.443 |
| 44409.43579861111 | 54.08 |
| 44409.477465277785 | 55.045 |
| 44409.51913194445 | 56.3 |
| 44409.56079861111 | 57.285 |
| 44409.602465277785 | 57.903 |
| 44409.64413194445 | 59.293 |
| 44409.68579861111 | 60.47 |
| 44409.727465277785 | 59.968 |
| 44409.76913194445 | 59.08 |
| 44409.81079861111 | 57.883 |
| 44409.852465277785 | 56.802 |
| 44409.89413194445 | 55.895 |
| 44409.93579861111 | 55.451 |
| 44409.977465277785 | 55.026 |
| 44410.01913194445 | 54.64 |
| 44410.06079861111 | 54.312 |
| 44410.102465277785 | 54.138 |
| 44410.14413194445 | 53.906 |
| 44410.18579861111 | 53.791 |
| 44410.227465277785 | 53.694 |
| 44410.26913194445 | 53.597 |
| 44410.31079861111 | 53.675 |
| 44410.352465277785 | 53.964 |
| 44410.39413194445 | 54.814 |
| 44410.43579861111 | 56.204 |
| 44410.477465277785 | 57.729 |
| 44410.51913194445 | 58.327 |
| 44410.56079861111 | 58.385 |
| 44410.602465277785 | 59.235 |
| 44410.64413194445 | 59.64 |
| 44410.68579861111 | 59.698 |
| 44410.727465277785 | 58.578 |
| 44410.76913194445 | 57.555 |
| 44410.81079861111 | 56.821 |
| 44410.852465277785 | 56.435 |
| 44410.89413194445 | 56.262 |
| 44410.93579861111 | 56.455 |
| 44410.977465277785 | 56.223 |
| 44411.01913194445 | 55.933 |
| 44411.06079861111 | 55.663 |
| 44411.102465277785 | 55.489 |
| 44411.14413194445 | 55.277 |
| 44411.18579861111 | 55.354 |
| 44411.227465277785 | 55.47 |
| 44411.26913194445 | 55.47 |
| 44411.31079861111 | 55.605 |
| 44411.352465277785 | 55.837 |
| 44411.39413194445 | 56.049 |
| 44411.43579861111 | 56.435 |
| 44411.477465277785 | 57.169 |
| 44411.51913194445 | 57.825 |
| 44411.56079861111 | 58.598 |
| 44411.602465277785 | 58.501 |
| 44411.64413194445 | 58.771 |
| 44411.68579861111 | 58.655 |
| 44411.727465277785 | 58.269 |
| 44411.76913194445 | 58.057 |
| 44411.81079861111 | 57.594 |
| 44411.852465277785 | 57.15 |
| 44411.89413194445 | 56.976 |
| 44411.93579861111 | 56.609 |
| 44411.977465277785 | 56.281 |
| 44412.01913194445 | 56.088 |
| 44412.06079861111 | 55.779 |
| 44412.102465277785 | 55.547 |
| 44412.14413194445 | 55.354 |
| 44412.18579861111 | 55.123 |
| 44412.227465277785 | 55.026 |
| 44412.26913194445 | 54.987 |
| 44412.31079861111 | 55.026 |
| 44412.352465277785 | 55.161 |
| 44412.39413194445 | 55.528 |
| 44412.43579861111 | 56.32 |
| 44412.477465277785 | 57.613 |
| 44412.51913194445 | 59.254 |
| 44412.56079861111 | 60.895 |
| 44412.602465277785 | 61.86 |
| 44412.64413194445 | 62.208 |
| 44412.68579861111 | 62.015 |
| 44412.727465277785 | 61.3 |
| 44412.76913194445 | 60.316 |
| 44412.81079861111 | 59.196 |
| 44412.852465277785 | 58.269 |
| 44412.89413194445 | 57.478 |
| 44412.93579861111 | 56.879 |
| 44412.977465277785 | 56.32 |
| 44413.01913194445 | 55.895 |
| 44413.06079861111 | 55.721 |
| 44413.102465277785 | 55.489 |
| 44413.14413194445 | 55.181 |
| 44413.18579861111 | 55.026 |
| 44413.227465277785 | 54.852 |
| 44413.26913194445 | 54.698 |
| 44413.31079861111 | 54.601 |
| 44413.352465277785 | 54.659 |
| 44413.39413194445 | 55.238 |
| 44413.43579861111 | 56.397 |
| 44413.477465277785 | 57.903 |
| 44413.51913194445 | 59.582 |
| 44413.56079861111 | 60.991 |
| 44413.602465277785 | 61.879 |
| 44413.64413194445 | 62.401 |
| 44413.68579861111 | 62.285 |
| 44413.727465277785 | 61.532 |
| 44413.76913194445 | 60.702 |
| 44413.81079861111 | 59.717 |
| 44413.852465277785 | 58.791 |
| 44413.89413194445 | 57.98 |
| 44413.93579861111 | 57.15 |
| 44413.977465277785 | 56.609 |
| 44414.01913194445 | 56.204 |
| 44414.06079861111 | 56.03 |
| 44414.102465277785 | 55.837 |
| 44414.14413194445 | 55.644 |
| 44414.18579861111 | 55.489 |
| 44414.227465277785 | 55.335 |
| 44414.26913194445 | 55.142 |
| 44414.31079861111 | 54.987 |
| 44414.352465277785 | 55.123 |
| 44414.39413194445 | 55.567 |
| 44414.43579861111 | 56.725 |
| 44414.477465277785 | 58.675 |
| 44414.51913194445 | 59.543 |
| 44414.56079861111 | 60.644 |
| 44414.602465277785 | 59.099 |
| 44414.64413194445 | 59.408 |
| 44414.68579861111 | 59.119 |
| 44414.727465277785 | 59.254 |
| 44414.76913194445 | 58.868 |
| 44414.81079861111 | 58.192 |
| 44414.852465277785 | 57.497 |
| 44414.89413194445 | 56.802 |
| 44414.93579861111 | 56.377 |
| 44414.977465277785 | 55.972 |
| 44415.01913194445 | 55.702 |
| 44415.06079861111 | 55.528 |
| 44415.102465277785 | 55.393 |
| 44415.14413194445 | 55.123 |
| 44415.18579861111 | 54.698 |
| 44415.227465277785 | 54.486 |
| 44415.26913194445 | 54.254 |
| 44415.31079861111 | 54.08 |
| 44415.352465277785 | 54.138 |
| 44415.39413194445 | 54.408 |
| 44415.43579861111 | 54.891 |
| 44415.477465277785 | 55.702 |
| 44415.51913194445 | 56.764 |
| 44415.56079861111 | 57.825 |
| 44415.602465277785 | 58.443 |
| 44415.64413194445 | 58.366 |
| 44415.68579861111 | 58.018 |
| 44415.727465277785 | 57.459 |
| 44415.76913194445 | 56.899 |
| 44415.81079861111 | 56.358 |
| 44415.852465277785 | 55.586 |
| 44415.89413194445 | 54.949 |
| 44415.93579861111 | 54.35 |
| 44415.977465277785 | 53.791 |
| 44416.01913194445 | 53.501 |
| 44416.06079861111 | 53.211 |
| 44416.102465277785 | 53.018 |
| 44416.14413194445 | 52.845 |
| 44416.18579861111 | 52.574 |
| 44416.227465277785 | 52.343 |
| 44416.26913194445 | 52.111 |
| 44416.31079861111 | 51.918 |
| 44416.352465277785 | 51.995 |
| 44416.39413194445 | 52.555 |
| 44416.43579861111 | 53.829 |
| 44416.477465277785 | 55.567 |
| 44416.51913194445 | 57.42 |
| 44416.56079861111 | 59.177 |
| 44416.602465277785 | 60.451 |
| 44416.64413194445 | 61.165 |
| 44416.68579861111 | 61.223 |
| 44416.727465277785 | 60.528 |
| 44416.76913194445 | 59.582 |
| 44416.81079861111 | 58.038 |
| 44416.852465277785 | 56.493 |
| 44416.89413194445 | 55.161 |
| 44416.93579861111 | 54.215 |
| 44416.977465277785 | 53.462 |
| 44417.01913194445 | 53.018 |
| 44417.06079861111 | 52.671 |
| 44417.102465277785 | 52.304 |
| 44417.14413194445 | 52.034 |
| 44417.18579861111 | 51.706 |
| 44417.227465277785 | 51.493 |
| 44417.26913194445 | 51.262 |
| 44417.31079861111 | 51.049 |
| 44417.352465277785 | 51.069 |
| 44417.39413194445 | 51.551 |
| 44417.43579861111 | 52.941 |
| 44417.477465277785 | 54.737 |
| 44417.51913194445 | 55.74 |
| 44417.56079861111 | 57.516 |
| 44417.602465277785 | 59.872 |
| 44417.64413194445 | 60.547 |
| 44417.68579861111 | 60.702 |
| 44417.727465277785 | 60.084 |
| 44417.76913194445 | 58.694 |
| 44417.81079861111 | 56.783 |
| 44417.852465277785 | 55.181 |
| 44417.89413194445 | 53.848 |
| 44417.93579861111 | 52.864 |
| 44417.977465277785 | 52.034 |
| 44418.01913194445 | 51.493 |
| 44418.06079861111 | 51.011 |
| 44418.102465277785 | 50.605 |
| 44418.14413194445 | 50.277 |
| 44418.18579861111 | 50.026 |
| 44418.227465277785 | 49.717 |
| 44418.26913194445 | 49.447 |
| 44418.31079861111 | 49.312 |
| 44418.352465277785 | 49.389 |
| 44418.39413194445 | 50.007 |
| 44418.43579861111 | 51.358 |
| 44418.477465277785 | 53.289 |
| 44418.51913194445 | 54.601 |
| 44418.56079861111 | 54.621 |
| 44418.602465277785 | 54.852 |
| 44418.64413194445 | 53.964 |
| 44418.68579861111 | 53.096 |
| 44418.727465277785 | 53.289 |
| 44418.76913194445 | 52.787 |
| 44418.81079861111 | 51.281 |
| 44418.852465277785 | 50.026 |
| 44418.89413194445 | 48.81 |
| 44418.93579861111 | 47.806 |
| 44418.977465277785 | 47.053 |
| 44419.01913194445 | 46.551 |
| 44419.06079861111 | 46.184 |
| 44419.102465277785 | 45.837 |
| 44419.14413194445 | 45.47 |
| 44419.18579861111 | 45.18 |
| 44419.227465277785 | 44.794 |
| 44419.26913194445 | 44.505 |
| 44419.31079861111 | 44.312 |
| 44419.352465277785 | 44.312 |
| 44419.39413194445 | 44.91 |
| 44419.43579861111 | 46.146 |
| 44419.477465277785 | 47.902 |
| 44419.51913194445 | 49.563 |
| 44419.56079861111 | 50.74 |
| 44419.602465277785 | 51.474 |
| 44419.64413194445 | 51.474 |
| 44419.68579861111 | 50.933 |
| 44419.727465277785 | 49.814 |
| 44419.76913194445 | 48.25 |
| 44419.81079861111 | 46.57 |
| 44419.852465277785 | 45.142 |
| 44419.89413194445 | 43.964 |
| 44419.93579861111 | 43.231 |
| 44419.977465277785 | 42.922 |
| 44420.01913194445 | 42.574 |
| 44420.06079861111 | 42.42 |
| 44420.102465277785 | 42.227 |
| 44420.14413194445 | 42.014 |
| 44420.18579861111 | 41.821 |
| 44420.227465277785 | 41.628 |
| 44420.26913194445 | 41.512 |
| 44420.31079861111 | 41.493 |
| 44420.352465277785 | 41.57 |
| 44420.39413194445 | 42.13 |
| 44420.43579861111 | 43.346 |
| 44420.477465277785 | 45.393 |
| 44420.51913194445 | 47.729 |
| 44420.56079861111 | 49.717 |
| 44420.602465277785 | 52.169 |
| 44420.64413194445 | 51.3 |
| 44420.68579861111 | 51.532 |
| 44420.727465277785 | 50.991 |
| 44420.76913194445 | 50.721 |
| 44420.81079861111 | 49.814 |
| 44420.852465277785 | 49.003 |
| 44420.89413194445 | 48.346 |
| 44420.93579861111 | 47.69 |
| 44420.977465277785 | 47.053 |
| 44421.01913194445 | 46.377 |
| 44421.06079861111 | 45.818 |
| 44421.102465277785 | 45.624 |
| 44421.14413194445 | 45.277 |
| 44421.18579861111 | 44.949 |
| 44421.227465277785 | 44.717 |
| 44421.26913194445 | 44.37 |
| 44421.31079861111 | 44.08 |
| 44421.352465277785 | 44.177 |
| 44421.39413194445 | 44.736 |
| 44421.43579861111 | 46.3 |
| 44421.477465277785 | 48.597 |
| 44421.51913194445 | 50.277 |
| 44421.56079861111 | 53.115 |
| 44421.602465277785 | 54.794 |
| 44421.64413194445 | 56.648 |
| 44421.68579861111 | 57.072 |
| 44421.727465277785 | 57.343 |
| 44421.76913194445 | 55.837 |
| 44421.81079861111 | 53.926 |
| 44421.852465277785 | 52.227 |
| 44421.89413194445 | 50.625 |
| 44421.93579861111 | 49.601 |
| 44421.977465277785 | 48.25 |
| 44422.01913194445 | 47.111 |
| 44422.06079861111 | 46.204 |
| 44422.102465277785 | 45.509 |
| 44422.14413194445 | 44.987 |
| 44422.18579861111 | 44.447 |
| 44422.227465277785 | 44.099 |
| 44422.26913194445 | 43.81 |
| 44422.31079861111 | 43.482 |
| 44422.352465277785 | 43.54 |
| 44422.39413194445 | 44.177 |
| 44422.43579861111 | 45.798 |
| 44422.477465277785 | 48.385 |
| 44422.51913194445 | 51.242 |
| 44422.56079861111 | 54.119 |
| 44422.602465277785 | 56.165 |
| 44422.64413194445 | 57.767 |
| 44422.68579861111 | 58.713 |
| 44422.727465277785 | 58.617 |
| 44422.76913194445 | 57.343 |
| 44422.81079861111 | 55.2 |
| 44422.852465277785 | 52.806 |
| 44422.89413194445 | 51.011 |
| 44422.93579861111 | 49.215 |
| 44422.977465277785 | 47.787 |
| 44423.01913194445 | 46.802 |
| 44423.06079861111 | 46.339 |
| 44423.102465277785 | 45.818 |
| 44423.14413194445 | 45.316 |
| 44423.18579861111 | 44.891 |
| 44423.227465277785 | 44.447 |
| 44423.26913194445 | 44.292 |
| 44423.31079861111 | 44.061 |
| 44423.352465277785 | 44.234 |
| 44423.39413194445 | 45.238 |
| 44423.43579861111 | 46.628 |
| 44423.477465277785 | 49.041 |
| 44423.51913194445 | 51.57 |
| 44423.56079861111 | 53.404 |
| 44423.602465277785 | 54.061 |
| 44423.64413194445 | 54.215 |
| 44423.68579861111 | 53.597 |
| 44423.727465277785 | 52.497 |
| 44423.76913194445 | 51.339 |
| 44423.81079861111 | 49.968 |
| 44423.852465277785 | 48.81 |
| 44423.89413194445 | 47.864 |
| 44423.93579861111 | 47.092 |
| 44423.977465277785 | 46.377 |
| 44424.01913194445 | 45.76 |
| 44424.06079861111 | 45.277 |
| 44424.102465277785 | 44.833 |
| 44424.14413194445 | 44.466 |
| 44424.18579861111 | 44.177 |
| 44424.227465277785 | 43.733 |
| 44424.26913194445 | 43.501 |
| 44424.31079861111 | 43.25 |
| 44424.352465277785 | 43.346 |
| 44424.39413194445 | 44.022 |
| 44424.43579861111 | 45.431 |
| 44424.477465277785 | 47.806 |
| 44424.51913194445 | 50.644 |
| 44424.56079861111 | 53.424 |
| 44424.602465277785 | 56.223 |
| 44424.64413194445 | 57.304 |
| 44424.68579861111 | 57.323 |
| 44424.727465277785 | 56.339 |
| 44424.76913194445 | 54.814 |
| 44424.81079861111 | 53.018 |
| 44424.852465277785 | 51.126 |
| 44424.89413194445 | 49.35 |
| 44424.93579861111 | 47.709 |
| 44424.977465277785 | 46.493 |
| 44425.01913194445 | 45.605 |
| 44425.06079861111 | 44.929 |
| 44425.102465277785 | 44.485 |
| 44425.14413194445 | 44.041 |
| 44425.18579861111 | 43.713 |
| 44425.227465277785 | 43.385 |
| 44425.26913194445 | 43.076 |
| 44425.31079861111 | 42.922 |
| 44425.352465277785 | 43.018 |
| 44425.39413194445 | 43.733 |
| 44425.43579861111 | 45.258 |
| 44425.477465277785 | 47.632 |
| 44425.51913194445 | 50.509 |
| 44425.56079861111 | 52.787 |
| 44425.602465277785 | 54.35 |
| 44425.64413194445 | 56.764 |
| 44425.68579861111 | 57.169 |
| 44425.727465277785 | 55.856 |
| 44425.76913194445 | 54.099 |
| 44425.81079861111 | 52.767 |
| 44425.852465277785 | 51.397 |
| 44425.89413194445 | 49.949 |
| 44425.93579861111 | 48.578 |
| 44425.977465277785 | 47.767 |
| 44426.01913194445 | 46.937 |
| 44426.06079861111 | 46.377 |
| 44426.102465277785 | 45.914 |
| 44426.14413194445 | 45.258 |
| 44426.18579861111 | 44.833 |
| 44426.227465277785 | 44.524 |
| 44426.26913194445 | 44.157 |
| 44426.31079861111 | 44.003 |
| 44426.352465277785 | 44.022 |
| 44426.39413194445 | 44.601 |
| 44426.43579861111 | 45.972 |
| 44426.477465277785 | 48.057 |
| 44426.51913194445 | 49.485 |
| 44426.56079861111 | 52.362 |
| 44426.602465277785 | 52.903 |
| 44426.64413194445 | 53.153 |
| 44426.68579861111 | 55.026 |
| 44426.727465277785 | 54.312 |
| 44426.76913194445 | 52.787 |
| 44426.81079861111 | 51.146 |
| 44426.852465277785 | 49.717 |
| 44426.89413194445 | 48.713 |
| 44426.93579861111 | 47.652 |
| 44426.977465277785 | 46.918 |
| 44427.01913194445 | 46.262 |
| 44427.06079861111 | 45.798 |
| 44427.102465277785 | 45.354 |
| 44427.14413194445 | 44.949 |
| 44427.18579861111 | 44.794 |
| 44427.227465277785 | 44.698 |
| 44427.26913194445 | 44.524 |
| 44427.31079861111 | 44.543 |
| 44427.352465277785 | 44.794 |
| 44427.39413194445 | 45.258 |
| 44427.43579861111 | 46.146 |
| 44427.477465277785 | 47.323 |
| 44427.51913194445 | 48.81 |
| 44427.56079861111 | 50.2 |
| 44427.602465277785 | 50.258 |
| 44427.64413194445 | 51.416 |
| 44427.68579861111 | 51.59 |
| 44427.727465277785 | 51.474 |
| 44427.76913194445 | 51.435 |
| 44427.81079861111 | 50.451 |
| 44427.852465277785 | 49.37 |
| 44427.89413194445 | 48.346 |
| 44427.93579861111 | 47.246 |
| 44427.977465277785 | 46.397 |
| 44428.01913194445 | 45.702 |
| 44428.06079861111 | 45.065 |
| 44428.102465277785 | 44.814 |
| 44428.14413194445 | 44.389 |
| 44428.18579861111 | 43.81 |
| 44428.227465277785 | 43.404 |
| 44428.26913194445 | 42.864 |
| 44428.31079861111 | 42.381 |
| 44428.352465277785 | 42.188 |
| 44428.39413194445 | 42.613 |
| 44428.43579861111 | 43.597 |
| 44428.477465277785 | 45.451 |
| 44428.51913194445 | 48.115 |
| 44428.56079861111 | 49.872 |
| 44428.602465277785 | 52.13 |
| 44428.64413194445 | 54.292 |
| 44428.68579861111 | 55.625 |
| 44428.727465277785 | 55.798 |
| 44428.76913194445 | 55.238 |
| 44428.81079861111 | 52.999 |
| 44428.852465277785 | 50.547 |
| 44428.89413194445 | 48.443 |
| 44428.93579861111 | 46.744 |
| 44428.977465277785 | 45.354 |
| 44429.01913194445 | 44.389 |
| 44429.06079861111 | 43.54 |
| 44429.102465277785 | 43.038 |
| 44429.14413194445 | 42.748 |
| 44429.18579861111 | 42.42 |
| 44429.227465277785 | 42.265 |
| 44429.26913194445 | 42.227 |
| 44429.31079861111 | 42.092 |
| 44429.352465277785 | 42.265 |
| 44429.39413194445 | 43.038 |
| 44429.43579861111 | 44.524 |
| 44429.477465277785 | 46.841 |
| 44429.51913194445 | 49.138 |
| 44429.56079861111 | 49.872 |
| 44429.602465277785 | 50.798 |
| 44429.64413194445 | 53.482 |
| 44429.68579861111 | 53.308 |
| 44429.727465277785 | 53.308 |
| 44429.76913194445 | 52.536 |
| 44429.81079861111 | 51.069 |
| 44429.852465277785 | 49.621 |
| 44429.89413194445 | 48.115 |
| 44429.93579861111 | 46.976 |
| 44429.977465277785 | 45.953 |
| 44430.01913194445 | 45.065 |
| 44430.06079861111 | 44.621 |
| 44430.102465277785 | 44.215 |
| 44430.14413194445 | 43.848 |
| 44430.18579861111 | 43.636 |
| 44430.227465277785 | 43.443 |
| 44430.26913194445 | 43.327 |
| 44430.31079861111 | 43.231 |
| 44430.352465277785 | 43.578 |
| 44430.39413194445 | 44.157 |
| 44430.43579861111 | 45.2 |
| 44430.477465277785 | 46.879 |
| 44430.51913194445 | 48.327 |
| 44430.56079861111 | 50.798 |
| 44430.602465277785 | 52.401 |
| 44430.64413194445 | 54.042 |
| 44430.68579861111 | 54.968 |
| 44430.727465277785 | 54.698 |
| 44430.76913194445 | 54.312 |
| 44430.81079861111 | 53.231 |
| 44430.852465277785 | 51.455 |
| 44430.89413194445 | 49.485 |
| 44430.93579861111 | 47.729 |
| 44430.977465277785 | 46.165 |
| 44431.01913194445 | 44.91 |
| 44431.06079861111 | 44.022 |
| 44431.102465277785 | 43.346 |
| 44431.14413194445 | 42.922 |
| 44431.18579861111 | 42.555 |
| 44431.227465277785 | 42.227 |
| 44431.26913194445 | 42.014 |
| 44431.31079861111 | 41.879 |
| 44431.352465277785 | 41.976 |
| 44431.39413194445 | 42.69 |
| 44431.43579861111 | 43.752 |
| 44431.477465277785 | 45.895 |
| 44431.51913194445 | 47.304 |
| 44431.56079861111 | 48.945 |
| 44431.602465277785 | 51.609 |
| 44431.64413194445 | 53.964 |
| 44431.68579861111 | 55.084 |
| 44431.727465277785 | 55.007 |
| 44431.76913194445 | 54.486 |
| 44431.81079861111 | 53.018 |
| 44431.852465277785 | 51.069 |
| 44431.89413194445 | 49.235 |
| 44431.93579861111 | 47.458 |
| 44431.977465277785 | 45.972 |
| 44432.01913194445 | 44.833 |
| 44432.06079861111 | 44.061 |
| 44432.102465277785 | 43.404 |
| 44432.14413194445 | 42.941 |
| 44432.18579861111 | 42.651 |
| 44432.227465277785 | 42.362 |
| 44432.26913194445 | 42.15 |
| 44432.31079861111 | 42.072 |
| 44432.352465277785 | 42.092 |
| 44432.39413194445 | 42.594 |
| 44432.43579861111 | 43.81 |
| 44432.477465277785 | 46.59 |
| 44432.51913194445 | 49.138 |
| 44432.56079861111 | 51.821 |
| 44432.602465277785 | 54.292 |
| 44432.64413194445 | 56.088 |
| 44432.68579861111 | 57.111 |
| 44432.727465277785 | 57.13 |
| 44432.76913194445 | 55.933 |
| 44432.81079861111 | 53.694 |
| 44432.852465277785 | 51.532 |
| 44432.89413194445 | 49.389 |
| 44432.93579861111 | 47.497 |
| 44432.977465277785 | 45.837 |
| 44433.01913194445 | 44.659 |
| 44433.06079861111 | 43.81 |
| 44433.102465277785 | 43.057 |
| 44433.14413194445 | 42.671 |
| 44433.18579861111 | 42.246 |
| 44433.227465277785 | 41.841 |
| 44433.26913194445 | 41.609 |
| 44433.31079861111 | 41.358 |
| 44433.352465277785 | 41.242 |
| 44433.39413194445 | 41.879 |
| 44433.43579861111 | 43.617 |
| 44433.477465277785 | 46.165 |
| 44433.51913194445 | 49.215 |
| 44433.56079861111 | 52.111 |
| 44433.602465277785 | 54.64 |
| 44433.64413194445 | 56.57 |
| 44433.68579861111 | 57.555 |
| 44433.727465277785 | 57.323 |
| 44433.76913194445 | 56.011 |
| 44433.81079861111 | 53.791 |
| 44433.852465277785 | 51.783 |
| 44433.89413194445 | 49.679 |
| 44433.93579861111 | 47.748 |
| 44433.977465277785 | 46.281 |
| 44434.01913194445 | 45.258 |
| 44434.06079861111 | 44.37 |
| 44434.102465277785 | 43.829 |
| 44434.14413194445 | 43.462 |
| 44434.18579861111 | 43.095 |
| 44434.227465277785 | 42.922 |
| 44434.26913194445 | 42.709 |
| 44434.31079861111 | 42.497 |
| 44434.352465277785 | 42.69 |
| 44434.39413194445 | 43.327 |
| 44434.43579861111 | 44.698 |
| 44434.477465277785 | 46.435 |
| 44434.51913194445 | 48.964 |
| 44434.56079861111 | 51.59 |
| 44434.602465277785 | 52.343 |
| 44434.64413194445 | 52.845 |
| 44434.68579861111 | 53.501 |
| 44434.727465277785 | 53.752 |
| 44434.76913194445 | 52.767 |
| 44434.81079861111 | 51.126 |
| 44434.852465277785 | 49.852 |
| 44434.89413194445 | 48.482 |
| 44434.93579861111 | 47.227 |
| 44434.977465277785 | 46.126 |
| 44435.01913194445 | 45.065 |
| 44435.06079861111 | 44.254 |
| 44435.102465277785 | 43.829 |
| 44435.14413194445 | 43.424 |
| 44435.18579861111 | 42.98 |
| 44435.227465277785 | 42.748 |
| 44435.26913194445 | 42.42 |
| 44435.31079861111 | 42.169 |
| 44435.352465277785 | 42.265 |
| 44435.39413194445 | 42.787 |
| 44435.43579861111 | 44.254 |
| 44435.477465277785 | 46.995 |
| 44435.51913194445 | 50.123 |
| 44435.56079861111 | 53.153 |
| 44435.602465277785 | 54.042 |
| 44435.64413194445 | 54.93 |
| 44435.68579861111 | 56.628 |
| 44435.727465277785 | 57.072 |
| 44435.76913194445 | 55.818 |
| 44435.81079861111 | 53.752 |
| 44435.852465277785 | 51.744 |
| 44435.89413194445 | 49.717 |
| 44435.93579861111 | 47.98 |
| 44435.977465277785 | 46.339 |
| 44436.01913194445 | 45.238 |
| 44436.06079861111 | 44.37 |
| 44436.102465277785 | 43.694 |
| 44436.14413194445 | 43.269 |
| 44436.18579861111 | 42.941 |
| 44436.227465277785 | 42.536 |
| 44436.26913194445 | 42.227 |
| 44436.31079861111 | 42.053 |
| 44436.352465277785 | 42.014 |
| 44436.39413194445 | 42.671 |
| 44436.43579861111 | 44.254 |
| 44436.477465277785 | 46.802 |
| 44436.51913194445 | 49.698 |
| 44436.56079861111 | 52.574 |
| 44436.602465277785 | 55.026 |
| 44436.64413194445 | 56.957 |
| 44436.68579861111 | 57.767 |
| 44436.727465277785 | 57.188 |
| 44436.76913194445 | 55.702 |
| 44436.81079861111 | 53.578 |
| 44436.852465277785 | 51.513 |
| 44436.89413194445 | 49.389 |
| 44436.93579861111 | 47.555 |
| 44436.977465277785 | 46.049 |
| 44437.01913194445 | 44.929 |
| 44437.06079861111 | 44.08 |
| 44437.102465277785 | 43.636 |
| 44437.14413194445 | 43.424 |
| 44437.18579861111 | 43.153 |
| 44437.227465277785 | 42.999 |
| 44437.26913194445 | 42.883 |
| 44437.31079861111 | 42.709 |
| 44437.352465277785 | 42.845 |
| 44437.39413194445 | 43.501 |
| 44437.43579861111 | 44.929 |
| 44437.477465277785 | 47.362 |
| 44437.51913194445 | 50.026 |
| 44437.56079861111 | 52.536 |
| 44437.602465277785 | 54.582 |
| 44437.64413194445 | 56.551 |
| 44437.68579861111 | 57.15 |
| 44437.727465277785 | 56.59 |
| 44437.76913194445 | 55.161 |
| 44437.81079861111 | 53.385 |
| 44437.852465277785 | 51.551 |
| 44437.89413194445 | 49.601 |
| 44437.93579861111 | 47.806 |
| 44437.977465277785 | 46.493 |
| 44438.01913194445 | 45.393 |
| 44438.06079861111 | 44.543 |
| 44438.102465277785 | 43.945 |
| 44438.14413194445 | 43.52 |
| 44438.18579861111 | 43.211 |
| 44438.227465277785 | 42.98 |
| 44438.26913194445 | 42.748 |
| 44438.31079861111 | 42.458 |
| 44438.352465277785 | 42.536 |
| 44438.39413194445 | 42.98 |
| 44438.43579861111 | 44.292 |
| 44438.477465277785 | 46.628 |
| 44438.51913194445 | 49.196 |
| 44438.56079861111 | 51.493 |
| 44438.602465277785 | 52.922 |
| 44438.64413194445 | 54.756 |
| 44438.68579861111 | 56.223 |
| 44438.727465277785 | 55.779 |
| 44438.76913194445 | 54.061 |
| 44438.81079861111 | 52.227 |
| 44438.852465277785 | 50.335 |
| 44438.89413194445 | 48.52 |
| 44438.93579861111 | 46.976 |
| 44438.977465277785 | 45.567 |
| 44439.01913194445 | 44.543 |
| 44439.06079861111 | 43.887 |
| 44439.102465277785 | 43.269 |
| 44439.14413194445 | 42.825 |
| 44439.18579861111 | 42.536 |
| 44439.227465277785 | 42.13 |
| 44439.26913194445 | 41.976 |
| 44439.31079861111 | 41.763 |
| 44439.352465277785 | 41.744 |
| 44439.39413194445 | 42.362 |
| 44439.43579861111 | 43.733 |
| 44439.477465277785 | 45.702 |
| 44439.51913194445 | 48.308 |
| 44439.56079861111 | 51.011 |
| 44439.602465277785 | 53.385 |
| 44439.64413194445 | 54.099 |
| 44439.68579861111 | 54.486 |
| 44439.727465277785 | 54.08 |
| 44439.76913194445 | 53.404 |
| 44439.81079861111 | 52.323 |
| 44439.852465277785 | 50.489 |
| 44439.89413194445 | 48.848 |
| 44439.93579861111 | 47.516 |
| 44439.977465277785 | 46.377 |
| 44440.01913194445 | 45.663 |
| 44440.06079861111 | 44.949 |
| 44440.102465277785 | 44.408 |
| 44440.14413194445 | 44.177 |
| 44440.18579861111 | 43.868 |
| 44440.227465277785 | 43.675 |
| 44440.26913194445 | 43.617 |
| 44440.31079861111 | 43.597 |
| 44440.352465277785 | 43.81 |
| 44440.39413194445 | 44.37 |
| 44440.43579861111 | 45.007 |
| 44440.477465277785 | 46.339 |
| 44440.51913194445 | 46.918 |
| 44440.56079861111 | 47.845 |
| 44440.602465277785 | 48.559 |
| 44440.64413194445 | 48.848 |
| 44440.68579861111 | 48.694 |
| 44440.727465277785 | 48.366 |
| 44440.76913194445 | 47.902 |
| 44440.81079861111 | 47.169 |
| 44440.852465277785 | 46.493 |
| 44440.89413194445 | 45.914 |
| 44440.93579861111 | 45.412 |
| 44440.977465277785 | 45.026 |
| 44441.01913194445 | 44.814 |
| 44441.06079861111 | 44.582 |
| 44441.102465277785 | 44.447 |
| 44441.14413194445 | 44.35 |
| 44441.18579861111 | 44.157 |
| 44441.227465277785 | 44.138 |
| 44441.26913194445 | 44.177 |
| 44441.31079861111 | 44.061 |
| 44441.352465277785 | 44.215 |
| 44441.39413194445 | 44.582 |
| 44441.43579861111 | 45.644 |
| 44441.477465277785 | 47.15 |
| 44441.51913194445 | 47.594 |
| 44441.56079861111 | 48.926 |
| 44441.602465277785 | 49.621 |
| 44441.64413194445 | 51.204 |
| 44441.68579861111 | 53.038 |
| 44441.727465277785 | 53.211 |
| 44441.76913194445 | 51.879 |
| 44441.81079861111 | 50.779 |
| 44441.852465277785 | 49.428 |
| 44441.89413194445 | 47.806 |
| 44441.93579861111 | 46.744 |
| 44441.977465277785 | 45.875 |
| 44442.01913194445 | 45.161 |
| 44442.06079861111 | 44.891 |
| 44442.102465277785 | 44.717 |
| 44442.14413194445 | 44.505 |
| 44442.18579861111 | 44.466 |
| 44442.227465277785 | 44.389 |
| 44442.26913194445 | 44.119 |
| 44442.31079861111 | 43.945 |
| 44442.352465277785 | 43.964 |
| 44442.39413194445 | 44.234 |
| 44442.43579861111 | 45.567 |
| 44442.477465277785 | 47.227 |
| 44442.51913194445 | 47.458 |
| 44442.56079861111 | 49.235 |
| 44442.602465277785 | 50.2 |
| 44442.64413194445 | 50.953 |
| 44442.68579861111 | 52.169 |
| 44442.727465277785 | 52.536 |
| 44442.76913194445 | 51.397 |
| 44442.81079861111 | 50.258 |
| 44442.852465277785 | 48.733 |
| 44442.89413194445 | 47.458 |
| 44442.93579861111 | 46.339 |
| 44442.977465277785 | 45.296 |
| 44443.01913194445 | 44.485 |
| 44443.06079861111 | 43.906 |
| 44443.102465277785 | 43.366 |
| 44443.14413194445 | 42.941 |
| 44443.18579861111 | 42.632 |
| 44443.227465277785 | 42.304 |
| 44443.26913194445 | 42.111 |
| 44443.31079861111 | 42.111 |
| 44443.352465277785 | 42.15 |
| 44443.39413194445 | 42.806 |
| 44443.43579861111 | 44.35 |
| 44443.477465277785 | 45.721 |
| 44443.51913194445 | 47.613 |
| 44443.56079861111 | 50.219 |
| 44443.602465277785 | 52.072 |
| 44443.64413194445 | 54.157 |
| 44443.68579861111 | 55.296 |
| 44443.727465277785 | 53.404 |
| 44443.76913194445 | 52.748 |
| 44443.81079861111 | 51.879 |
| 44443.852465277785 | 50.412 |
| 44443.89413194445 | 48.694 |
| 44443.93579861111 | 46.918 |
| 44443.977465277785 | 45.412 |
| 44444.01913194445 | 44.312 |
| 44444.06079861111 | 43.501 |
| 44444.102465277785 | 42.748 |
| 44444.14413194445 | 42.343 |
| 44444.18579861111 | 41.899 |
| 44444.227465277785 | 41.416 |
| 44444.26913194445 | 41.146 |
| 44444.31079861111 | 40.856 |
| 44444.352465277785 | 40.74 |
| 44444.39413194445 | 41.319 |
| 44444.43579861111 | 42.902 |
| 44444.477465277785 | 45.258 |
| 44444.51913194445 | 48.076 |
| 44444.56079861111 | 50.837 |
| 44444.602465277785 | 53.115 |
| 44444.64413194445 | 54.852 |
| 44444.68579861111 | 55.528 |
| 44444.727465277785 | 55.065 |
| 44444.76913194445 | 53.424 |
| 44444.81079861111 | 51.686 |
| 44444.852465277785 | 49.794 |
| 44444.89413194445 | 47.98 |
| 44444.93579861111 | 46.223 |
| 44444.977465277785 | 44.987 |
| 44445.01913194445 | 43.945 |
| 44445.06079861111 | 43.115 |
| 44445.102465277785 | 42.497 |
| 44445.14413194445 | 42.053 |
| 44445.18579861111 | 41.667 |
| 44445.227465277785 | 41.339 |
| 44445.26913194445 | 41.068 |
| 44445.31079861111 | 40.779 |
| 44445.352465277785 | 40.817 |
| 44445.39413194445 | 41.377 |
| 44445.43579861111 | 42.845 |
| 44445.477465277785 | 45.258 |
| 44445.51913194445 | 48.096 |
| 44445.56079861111 | 50.76 |
| 44445.602465277785 | 53.134 |
| 44445.64413194445 | 54.852 |
| 44445.68579861111 | 55.431 |
| 44445.727465277785 | 54.949 |
| 44445.76913194445 | 53.424 |
| 44445.81079861111 | 51.532 |
| 44445.852465277785 | 49.852 |
| 44445.89413194445 | 48.038 |
| 44445.93579861111 | 46.319 |
| 44445.977465277785 | 44.949 |
| 44446.01913194445 | 43.945 |
| 44446.06079861111 | 43.095 |
| 44446.102465277785 | 42.516 |
| 44446.14413194445 | 42.053 |
| 44446.18579861111 | 41.609 |
| 44446.227465277785 | 41.281 |
| 44446.26913194445 | 41.03 |
| 44446.31079861111 | 40.779 |
| 44446.352465277785 | 40.798 |
| 44446.39413194445 | 41.319 |
| 44446.43579861111 | 42.748 |
| 44446.477465277785 | 45.219 |
| 44446.51913194445 | 48.076 |
| 44446.56079861111 | 50.895 |
| 44446.602465277785 | 53.308 |
| 44446.64413194445 | 54.949 |
| 44446.68579861111 | 55.702 |
| 44446.727465277785 | 55.219 |
| 44446.76913194445 | 53.694 |
| 44446.81079861111 | 52.034 |
| 44446.852465277785 | 50.219 |
| 44446.89413194445 | 48.153 |
| 44446.93579861111 | 46.474 |
| 44446.977465277785 | 45.084 |
| 44447.01913194445 | 44.003 |
| 44447.06079861111 | 43.231 |
| 44447.102465277785 | 42.632 |
| 44447.14413194445 | 42.15 |
| 44447.18579861111 | 41.841 |
| 44447.227465277785 | 41.609 |
| 44447.26913194445 | 41.261 |
| 44447.31079861111 | 41.088 |
| 44447.352465277785 | 41.146 |
| 44447.39413194445 | 41.686 |
| 44447.43579861111 | 43.269 |
| 44447.477465277785 | 45.605 |
| 44447.51913194445 | 48.462 |
| 44447.56079861111 | 51.281 |
| 44447.602465277785 | 53.636 |
| 44447.64413194445 | 55.335 |
| 44447.68579861111 | 55.972 |
| 44447.727465277785 | 55.586 |
| 44447.76913194445 | 53.945 |
| 44447.81079861111 | 52.208 |
| 44447.852465277785 | 50.277 |
| 44447.89413194445 | 48.289 |
| 44447.93579861111 | 46.57 |
| 44447.977465277785 | 45.18 |
| 44448.01913194445 | 44.061 |
| 44448.06079861111 | 43.289 |
| 44448.102465277785 | 42.594 |
| 44448.14413194445 | 42.092 |
| 44448.18579861111 | 41.706 |
| 44448.227465277785 | 41.339 |
| 44448.26913194445 | 41.068 |
| 44448.31079861111 | 40.856 |
| 44448.352465277785 | 40.779 |
| 44448.39413194445 | 41.416 |
| 44448.43579861111 | 43.018 |
| 44448.477465277785 | 45.431 |
| 44448.51913194445 | 48.366 |
| 44448.56079861111 | 51.146 |
| 44448.602465277785 | 53.424 |
| 44448.64413194445 | 55.258 |
| 44448.68579861111 | 55.991 |
| 44448.727465277785 | 55.451 |
| 44448.76913194445 | 53.964 |
| 44448.81079861111 | 52.227 |
| 44448.852465277785 | 50.277 |
| 44448.89413194445 | 48.308 |
| 44448.93579861111 | 46.551 |
| 44448.977465277785 | 45.296 |
| 44449.01913194445 | 44.292 |
| 44449.06079861111 | 43.578 |
| 44449.102465277785 | 43.076 |
| 44449.14413194445 | 42.536 |
| 44449.18579861111 | 42.227 |
| 44449.227465277785 | 41.995 |
| 44449.26913194445 | 41.686 |
| 44449.31079861111 | 41.512 |
| 44449.352465277785 | 41.397 |
| 44449.39413194445 | 41.821 |
| 44449.43579861111 | 43.057 |
| 44449.477465277785 | 45.47 |
| 44449.51913194445 | 48.308 |
| 44449.56079861111 | 51.126 |
| 44449.602465277785 | 53.636 |
| 44449.64413194445 | 55.296 |
| 44449.68579861111 | 56.126 |
| 44449.727465277785 | 55.682 |
| 44449.76913194445 | 54.08 |
| 44449.81079861111 | 52.323 |
| 44449.852465277785 | 50.412 |
| 44449.89413194445 | 48.404 |
| 44449.93579861111 | 46.783 |
| 44449.977465277785 | 45.451 |
| 44450.01913194445 | 44.428 |
| 44450.06079861111 | 43.79 |
| 44450.102465277785 | 43.289 |
| 44450.14413194445 | 42.864 |
| 44450.18579861111 | 42.594 |
| 44450.227465277785 | 42.323 |
| 44450.26913194445 | 41.976 |
| 44450.31079861111 | 41.686 |
| 44450.352465277785 | 41.57 |
| 44450.39413194445 | 42.169 |
| 44450.43579861111 | 43.655 |
| 44450.477465277785 | 45.605 |
| 44450.51913194445 | 47.69 |
| 44450.56079861111 | 50.238 |
| 44450.602465277785 | 52.478 |
| 44450.64413194445 | 54.235 |
| 44450.68579861111 | 55.161 |
| 44450.727465277785 | 54.775 |
| 44450.76913194445 | 53.115 |
| 44450.81079861111 | 51.474 |
| 44450.852465277785 | 50.026 |
| 44450.89413194445 | 48.617 |
| 44450.93579861111 | 47.285 |
| 44450.977465277785 | 46.088 |
| 44451.01913194445 | 45.103 |
| 44451.06079861111 | 44.312 |
| 44451.102465277785 | 43.829 |
| 44451.14413194445 | 43.385 |
| 44451.18579861111 | 43.115 |
| 44451.227465277785 | 43.018 |
| 44451.26913194445 | 42.902 |
| 44451.31079861111 | 42.671 |
| 44451.352465277785 | 42.555 |
| 44451.39413194445 | 42.922 |
| 44451.43579861111 | 43.964 |
| 44451.477465277785 | 46.107 |
| 44451.51913194445 | 48.868 |
| 44451.56079861111 | 52.265 |
| 44451.602465277785 | 54.698 |
| 44451.64413194445 | 54.698 |
| 44451.68579861111 | 54.428 |
| 44451.727465277785 | 54.621 |
| 44451.76913194445 | 53.424 |
| 44451.81079861111 | 51.802 |
| 44451.852465277785 | 50.316 |
| 44451.89413194445 | 48.636 |
| 44451.93579861111 | 47.072 |
| 44451.977465277785 | 45.76 |
| 44452.01913194445 | 44.756 |
| 44452.06079861111 | 44.003 |
| 44452.102465277785 | 43.54 |
| 44452.14413194445 | 43.153 |
| 44452.18579861111 | 42.729 |
| 44452.227465277785 | 42.536 |
| 44452.26913194445 | 42.4 |
| 44452.31079861111 | 42.458 |
| 44452.352465277785 | 42.787 |
| 44452.39413194445 | 43.192 |
| 44452.43579861111 | 44.621 |
| 44452.477465277785 | 46.995 |
| 44452.51913194445 | 49.215 |
| 44452.56079861111 | 50.837 |
| 44452.602465277785 | 53.153 |
| 44452.64413194445 | 55.47 |
| 44452.68579861111 | 55.489 |
| 44452.727465277785 | 55.277 |
| 44452.76913194445 | 54.061 |
| 44452.81079861111 | 52.227 |
| 44452.852465277785 | 50.258 |
| 44452.89413194445 | 48.404 |
| 44452.93579861111 | 47.034 |
| 44452.977465277785 | 45.895 |
| 44453.01913194445 | 44.91 |
| 44453.06079861111 | 44.215 |
| 44453.102465277785 | 43.559 |
| 44453.14413194445 | 42.922 |
| 44453.18579861111 | 42.497 |
| 44453.227465277785 | 42.227 |
| 44453.26913194445 | 41.995 |
| 44453.31079861111 | 41.937 |
| 44453.352465277785 | 42.072 |
| 44453.39413194445 | 42.594 |
| 44453.43579861111 | 44.215 |
| 44453.477465277785 | 46.319 |
| 44453.51913194445 | 48.25 |
| 44453.56079861111 | 49.254 |
| 44453.602465277785 | 50.277 |
| 44453.64413194445 | 51.783 |
| 44453.68579861111 | 50.914 |
| 44453.727465277785 | 50.335 |
| 44453.76913194445 | 49.736 |
| 44453.81079861111 | 48.868 |
| 44453.852465277785 | 47.652 |
| 44453.89413194445 | 46.474 |
| 44453.93579861111 | 45.335 |
| 44453.977465277785 | 44.138 |
| 44454.01913194445 | 43.231 |
| 44454.06079861111 | 42.574 |
| 44454.102465277785 | 41.956 |
| 44454.14413194445 | 41.686 |
| 44454.18579861111 | 41.358 |
| 44454.227465277785 | 40.991 |
| 44454.26913194445 | 40.76 |
| 44454.31079861111 | 40.567 |
| 44454.352465277785 | 40.431 |
| 44454.39413194445 | 40.895 |
| 44454.43579861111 | 42.497 |
| 44454.477465277785 | 45.026 |
| 44454.51913194445 | 48.057 |
| 44454.56079861111 | 50.837 |
| 44454.602465277785 | 53.115 |
| 44454.64413194445 | 54.852 |
| 44454.68579861111 | 55.431 |
| 44454.727465277785 | 54.698 |
| 44454.76913194445 | 52.922 |
| 44454.81079861111 | 51.049 |
| 44454.852465277785 | 49.215 |
| 44454.89413194445 | 47.458 |
| 44454.93579861111 | 45.818 |
| 44454.977465277785 | 44.408 |
| 44455.01913194445 | 43.404 |
| 44455.06079861111 | 42.516 |
| 44455.102465277785 | 41.976 |
| 44455.14413194445 | 41.609 |
| 44455.18579861111 | 41.223 |
| 44455.227465277785 | 40.991 |
| 44455.26913194445 | 40.74 |
| 44455.31079861111 | 40.335 |
| 44455.352465277785 | 40.393 |
| 44455.39413194445 | 40.856 |
| 44455.43579861111 | 42.323 |
| 44455.477465277785 | 44.929 |
| 44455.51913194445 | 47.574 |
| 44455.56079861111 | 49.466 |
| 44455.602465277785 | 52.458 |
| 44455.64413194445 | 54.505 |
| 44455.68579861111 | 55.296 |
| 44455.727465277785 | 54.428 |
| 44455.76913194445 | 52.574 |
| 44455.81079861111 | 50.644 |
| 44455.852465277785 | 48.713 |
| 44455.89413194445 | 46.937 |
| 44455.93579861111 | 45.567 |
| 44455.977465277785 | 44.312 |
| 44456.01913194445 | 43.366 |
| 44456.06079861111 | 42.806 |
| 44456.102465277785 | 42.323 |
| 44456.14413194445 | 41.841 |
| 44456.18579861111 | 41.532 |
| 44456.227465277785 | 41.223 |
| 44456.26913194445 | 40.933 |
| 44456.31079861111 | 40.817 |
| 44456.352465277785 | 40.74 |
| 44456.39413194445 | 41.165 |
| 44456.43579861111 | 42.651 |
| 44456.477465277785 | 45.065 |
| 44456.51913194445 | 48.134 |
| 44456.56079861111 | 49.428 |
| 44456.602465277785 | 51.783 |
| 44456.64413194445 | 53.482 |
| 44456.68579861111 | 54.428 |
| 44456.727465277785 | 54.215 |
| 44456.76913194445 | 52.709 |
| 44456.81079861111 | 50.798 |
| 44456.852465277785 | 48.81 |
| 44456.89413194445 | 47.034 |
| 44456.93579861111 | 45.528 |
| 44456.977465277785 | 44.215 |
| 44457.01913194445 | 43.346 |
| 44457.06079861111 | 42.555 |
| 44457.102465277785 | 41.937 |
| 44457.14413194445 | 41.628 |
| 44457.18579861111 | 41.261 |
| 44457.227465277785 | 40.837 |
| 44457.26913194445 | 40.586 |
| 44457.31079861111 | 40.316 |
| 44457.352465277785 | 40.2 |
| 44457.39413194445 | 40.76 |
| 44457.43579861111 | 42.246 |
| 44457.477465277785 | 44.736 |
| 44457.51913194445 | 47.709 |
| 44457.56079861111 | 50.586 |
| 44457.602465277785 | 51.725 |
| 44457.64413194445 | 52.478 |
| 44457.68579861111 | 52.787 |
| 44457.727465277785 | 51.976 |
| 44457.76913194445 | 51.088 |
| 44457.81079861111 | 49.64 |
| 44457.852465277785 | 48.404 |
| 44457.89413194445 | 47.188 |
| 44457.93579861111 | 46.068 |
| 44457.977465277785 | 45.316 |
| 44458.01913194445 | 44.852 |
| 44458.06079861111 | 44.408 |
| 44458.102465277785 | 44.061 |
| 44458.14413194445 | 44.041 |
| 44458.18579861111 | 43.829 |
| 44458.227465277785 | 43.52 |
| 44458.26913194445 | 43.095 |
| 44458.31079861111 | 42.651 |
| 44458.352465277785 | 42.439 |
| 44458.39413194445 | 42.748 |
| 44458.43579861111 | 43.636 |
| 44458.477465277785 | 45.161 |
| 44458.51913194445 | 46.435 |
| 44458.56079861111 | 48.192 |
| 44458.602465277785 | 50.084 |
| 44458.64413194445 | 50.084 |
| 44458.68579861111 | 50.856 |
| 44458.727465277785 | 52.285 |
| 44458.76913194445 | 51.628 |
| 44458.81079861111 | 50.277 |
| 44458.852465277785 | 48.81 |
| 44458.89413194445 | 47.15 |
| 44458.93579861111 | 45.663 |
| 44458.977465277785 | 44.64 |
| 44459.01913194445 | 43.868 |
| 44459.06079861111 | 43.404 |
| 44459.102465277785 | 42.864 |
| 44459.14413194445 | 42.343 |
| 44459.18579861111 | 41.879 |
| 44459.227465277785 | 41.667 |
| 44459.26913194445 | 41.397 |
| 44459.31079861111 | 41.107 |
| 44459.352465277785 | 41.107 |
| 44459.39413194445 | 41.339 |
| 44459.43579861111 | 42.574 |
| 44459.477465277785 | 44.215 |
| 44459.51913194445 | 46.474 |
| 44459.56079861111 | 48.887 |
| 44459.602465277785 | 50.567 |
| 44459.64413194445 | 51.204 |
| 44459.68579861111 | 49.949 |
| 44459.727465277785 | 48.887 |
| 44459.76913194445 | 48.018 |
| 44459.81079861111 | 47.053 |
| 44459.852465277785 | 45.933 |
| 44459.89413194445 | 44.717 |
| 44459.93579861111 | 43.462 |
| 44459.977465277785 | 42.574 |
| 44460.01913194445 | 41.995 |
| 44460.06079861111 | 41.551 |
| 44460.102465277785 | 41.261 |
| 44460.14413194445 | 41.03 |
| 44460.18579861111 | 40.817 |
| 44460.227465277785 | 40.702 |
| 44460.26913194445 | 40.393 |
| 44460.31079861111 | 39.929 |
| 44460.352465277785 | 39.717 |
| 44460.39413194445 | 39.852 |
| 44460.43579861111 | 41.107 |
| 44460.477465277785 | 43.308 |
| 44460.51913194445 | 45.972 |
| 44460.56079861111 | 48.327 |
| 44460.602465277785 | 50.393 |
| 44460.64413194445 | 51.744 |
| 44460.68579861111 | 52.13 |
| 44460.727465277785 | 51.416 |
| 44460.76913194445 | 49.717 |
| 44460.81079861111 | 48.173 |
| 44460.852465277785 | 46.493 |
| 44460.89413194445 | 44.756 |
| 44460.93579861111 | 43.346 |
| 44460.977465277785 | 42.227 |
| 44461.01913194445 | 41.339 |
| 44461.06079861111 | 40.702 |
| 44461.102465277785 | 40.219 |
| 44461.14413194445 | 39.736 |
| 44461.18579861111 | 39.505 |
| 44461.227465277785 | 39.234 |
| 44461.26913194445 | 38.906 |
| 44461.31079861111 | 38.713 |
| 44461.352465277785 | 38.655 |
| 44461.39413194445 | 39.099 |
| 44461.43579861111 | 40.74 |
| 44461.477465277785 | 43.211 |
| 44461.51913194445 | 46.011 |
| 44461.56079861111 | 48.713 |
| 44461.602465277785 | 51.011 |
| 44461.64413194445 | 52.536 |
| 44461.68579861111 | 53.134 |
| 44461.727465277785 | 52.516 |
| 44461.76913194445 | 50.914 |
| 44461.81079861111 | 49.215 |
| 44461.852465277785 | 47.401 |
| 44461.89413194445 | 45.547 |
| 44461.93579861111 | 44.08 |
| 44461.977465277785 | 42.845 |
| 44462.01913194445 | 41.841 |
| 44462.06079861111 | 41.204 |
| 44462.102465277785 | 40.682 |
| 44462.14413194445 | 40.258 |
| 44462.18579861111 | 40.026 |
| 44462.227465277785 | 39.659 |
| 44462.26913194445 | 39.408 |
| 44462.31079861111 | 39.254 |
| 44462.352465277785 | 39.157 |
| 44462.39413194445 | 39.543 |
| 44462.43579861111 | 40.837 |
| 44462.477465277785 | 42.96 |
| 44462.51913194445 | 45.74 |
| 44462.56079861111 | 48.385 |
| 44462.602465277785 | 50.663 |
| 44462.64413194445 | 51.262 |
| 44462.68579861111 | 50.76 |
| 44462.727465277785 | 50.451 |
| 44462.76913194445 | 49.833 |
| 44462.81079861111 | 48.366 |
| 44462.852465277785 | 46.783 |
| 44462.89413194445 | 45.47 |
| 44462.93579861111 | 44.601 |
| 44462.977465277785 | 43.906 |
| 44463.01913194445 | 43.289 |
| 44463.06079861111 | 42.748 |
| 44463.102465277785 | 42.323 |
| 44463.14413194445 | 41.86 |
| 44463.18579861111 | 41.435 |
| 44463.227465277785 | 41.049 |
| 44463.26913194445 | 40.721 |
| 44463.31079861111 | 40.431 |
| 44463.352465277785 | 40.296 |
| 44463.39413194445 | 40.605 |
| 44463.43579861111 | 41.937 |
| 44463.477465277785 | 44.157 |
| 44463.51913194445 | 46.937 |
| 44463.56079861111 | 49.505 |
| 44463.602465277785 | 51.532 |
| 44463.64413194445 | 52.903 |
| 44463.68579861111 | 53.192 |
| 44463.727465277785 | 52.401 |
| 44463.76913194445 | 50.74 |
| 44463.81079861111 | 49.273 |
| 44463.852465277785 | 47.594 |
| 44463.89413194445 | 45.972 |
| 44463.93579861111 | 44.582 |
| 44463.977465277785 | 43.424 |
| 44464.01913194445 | 42.613 |
| 44464.06079861111 | 41.956 |
| 44464.102465277785 | 41.397 |
| 44464.14413194445 | 41.049 |
| 44464.18579861111 | 40.682 |
| 44464.227465277785 | 40.373 |
| 44464.26913194445 | 40.18 |
| 44464.31079861111 | 39.91 |
| 44464.352465277785 | 39.756 |
| 44464.39413194445 | 40.2 |
| 44464.43579861111 | 41.667 |
| 44464.477465277785 | 43.945 |
| 44464.51913194445 | 46.706 |
| 44464.56079861111 | 49.389 |
| 44464.602465277785 | 51.628 |
| 44464.64413194445 | 53.057 |
| 44464.68579861111 | 53.443 |
| 44464.727465277785 | 52.748 |
| 44464.76913194445 | 51.069 |
| 44464.81079861111 | 49.505 |
| 44464.852465277785 | 47.902 |
| 44464.89413194445 | 46.223 |
| 44464.93579861111 | 44.736 |
| 44464.977465277785 | 43.597 |
| 44465.01913194445 | 42.651 |
| 44465.06079861111 | 42.072 |
| 44465.102465277785 | 41.667 |
| 44465.14413194445 | 41.242 |
| 44465.18579861111 | 40.972 |
| 44465.227465277785 | 40.76 |
| 44465.26913194445 | 40.451 |
| 44465.31079861111 | 40.296 |
| 44465.352465277785 | 40.142 |
| 44465.39413194445 | 40.509 |
| 44465.43579861111 | 42.034 |
| 44465.477465277785 | 44.254 |
| 44465.51913194445 | 46.474 |
| 44465.56079861111 | 48.964 |
| 44465.602465277785 | 51.262 |
| 44465.64413194445 | 52.69 |
| 44465.68579861111 | 53.231 |
| 44465.727465277785 | 52.555 |
| 44465.76913194445 | 51.069 |
| 44465.81079861111 | 49.794 |
| 44465.852465277785 | 48.346 |
| 44465.89413194445 | 46.725 |
| 44465.93579861111 | 45.412 |
| 44465.977465277785 | 44.292 |
| 44466.01913194445 | 43.404 |
| 44466.06079861111 | 42.729 |
| 44466.102465277785 | 42.169 |
| 44466.14413194445 | 41.706 |
| 44466.18579861111 | 41.3 |
| 44466.227465277785 | 40.914 |
| 44466.26913194445 | 40.624 |
| 44466.31079861111 | 40.354 |
| 44466.352465277785 | 40.219 |
| 44466.39413194445 | 40.702 |
| 44466.43579861111 | 42.188 |
| 44466.477465277785 | 44.292 |
| 44466.51913194445 | 46.609 |
| 44466.56079861111 | 47.458 |
| 44466.602465277785 | 48.443 |
| 44466.64413194445 | 49.872 |
| 44466.68579861111 | 50.644 |
| 44466.727465277785 | 51.088 |
| 44466.76913194445 | 49.717 |
| 44466.81079861111 | 48.327 |
| 44466.852465277785 | 46.841 |
| 44466.89413194445 | 45.721 |
| 44466.93579861111 | 44.775 |
| 44466.977465277785 | 43.79 |
| 44467.01913194445 | 43.192 |
| 44467.06079861111 | 42.845 |
| 44467.102465277785 | 42.478 |
| 44467.14413194445 | 42.246 |
| 44467.18579861111 | 42.169 |
| 44467.227465277785 | 41.995 |
| 44467.26913194445 | 41.841 |
| 44467.31079861111 | 41.667 |
| 44467.352465277785 | 41.532 |
| 44467.39413194445 | 41.995 |
| 44467.43579861111 | 43.018 |
| 44467.477465277785 | 45.2 |
| 44467.51913194445 | 47.381 |
| 44467.56079861111 | 47.825 |
| 44467.602465277785 | 47.729 |
| 44467.64413194445 | 47.574 |
| 44467.68579861111 | 47.709 |
| 44467.727465277785 | 47.343 |
| 44467.76913194445 | 46.416 |
| 44467.81079861111 | 45.47 |
| 44467.852465277785 | 44.852 |
| 44467.89413194445 | 44.524 |
| 44467.93579861111 | 44.177 |
| 44467.977465277785 | 43.964 |
| 44468.01913194445 | 43.655 |
| 44468.06079861111 | 43.404 |
| 44468.102465277785 | 43.346 |
| 44468.14413194445 | 43.269 |
| 44468.18579861111 | 43.115 |
| 44468.227465277785 | 43.095 |
| 44468.26913194445 | 43.057 |
| 44468.31079861111 | 42.902 |
| 44468.352465277785 | 42.941 |
| 44468.39413194445 | 43.443 |
| 44468.43579861111 | 44.234 |
| 44468.477465277785 | 44.64 |
| 44468.51913194445 | 44.833 |
| 44468.56079861111 | 45.316 |
| 44468.602465277785 | 47.207 |
| 44468.64413194445 | 48.385 |
| 44468.68579861111 | 48.482 |
| 44468.727465277785 | 48.269 |
| 44468.76913194445 | 47.709 |
| 44468.81079861111 | 46.957 |
| 44468.852465277785 | 46.068 |
| 44468.89413194445 | 45.335 |
| 44468.93579861111 | 44.698 |
| 44468.977465277785 | 44.003 |
| 44469.01913194445 | 43.54 |
| 44469.06079861111 | 43.308 |
| 44469.102465277785 | 43.095 |
| 44469.14413194445 | 43.018 |
| 44469.18579861111 | 42.941 |
| 44469.227465277785 | 42.671 |
| 44469.26913194445 | 42.651 |
| 44469.31079861111 | 42.613 |
| 44469.352465277785 | 42.613 |
| 44469.39413194445 | 42.999 |
| 44469.43579861111 | 43.829 |
| 44469.477465277785 | 45.277 |
| 44469.51913194445 | 47.323 |
| 44469.56079861111 | 48.945 |
| 44469.602465277785 | 50.605 |
| 44469.64413194445 | 51.416 |
| 44469.68579861111 | 51.957 |
| 44469.727465277785 | 51.377 |
| 44469.76913194445 | 50.142 |
| 44469.81079861111 | 49.157 |
| 44469.852465277785 | 47.98 |
| 44469.89413194445 | 46.609 |
| 44469.93579861111 | 45.296 |
| 44469.977465277785 | 44.447 |
| 44470.01913194445 | 43.81 |
| 44470.06079861111 | 43.25 |
| 44470.102465277785 | 42.825 |
| 44470.14413194445 | 42.555 |
| 44470.18579861111 | 42.265 |
| 44470.227465277785 | 41.995 |
| 44470.26913194445 | 41.879 |
| 44470.31079861111 | 41.879 |
| 44470.352465277785 | 41.879 |
| 44470.39413194445 | 42.188 |
| 44470.43579861111 | 42.96 |
| 44470.477465277785 | 44.273 |
| 44470.51913194445 | 45.123 |
| 44470.56079861111 | 45.682 |
| 44470.602465277785 | 46.59 |
| 44470.64413194445 | 46.609 |
| 44470.68579861111 | 47.13 |
| 44470.727465277785 | 47.536 |
| 44470.76913194445 | 47.246 |
| 44470.81079861111 | 46.416 |
| 44470.852465277785 | 45.682 |
| 44470.89413194445 | 44.872 |
| 44470.93579861111 | 44.215 |
| 44470.977465277785 | 43.733 |
| 44471.01913194445 | 43.327 |
| 44471.06079861111 | 42.748 |
| 44471.102465277785 | 42.323 |
| 44471.14413194445 | 41.937 |
| 44471.18579861111 | 41.609 |
| 44471.227465277785 | 41.397 |
| 44471.26913194445 | 41.261 |
| 44471.31079861111 | 40.972 |
| 44471.352465277785 | 40.914 |
| 44471.39413194445 | 41.339 |
| 44471.43579861111 | 42.188 |
| 44471.477465277785 | 44.524 |
| 44471.51913194445 | 47.014 |
| 44471.56079861111 | 49.485 |
| 44471.602465277785 | 51.416 |
| 44471.64413194445 | 51.513 |
| 44471.68579861111 | 51.995 |
| 44471.727465277785 | 50.972 |
| 44471.76913194445 | 49.389 |
| 44471.81079861111 | 47.825 |
| 44471.852465277785 | 46.435 |
| 44471.89413194445 | 44.949 |
| 44471.93579861111 | 43.79 |
| 44471.977465277785 | 42.806 |
| 44472.01913194445 | 41.995 |
| 44472.06079861111 | 41.474 |
| 44472.102465277785 | 41.049 |
| 44472.14413194445 | 40.663 |
| 44472.18579861111 | 40.431 |
| 44472.227465277785 | 40.142 |
| 44472.26913194445 | 39.872 |
| 44472.31079861111 | 39.678 |
| 44472.352465277785 | 39.466 |
| 44472.39413194445 | 39.833 |
| 44472.43579861111 | 41.242 |
| 44472.477465277785 | 43.269 |
| 44472.51913194445 | 45.76 |
| 44472.56079861111 | 48.211 |
| 44472.602465277785 | 50.258 |
| 44472.64413194445 | 51.59 |
| 44472.68579861111 | 51.957 |
| 44472.727465277785 | 51.262 |
| 44472.76913194445 | 49.736 |
| 44472.81079861111 | 48.404 |
| 44472.852465277785 | 46.899 |
| 44472.89413194445 | 45.47 |
| 44472.93579861111 | 44.041 |
| 44472.977465277785 | 42.96 |
| 44473.01913194445 | 42.072 |
| 44473.06079861111 | 41.377 |
| 44473.102465277785 | 40.914 |
| 44473.14413194445 | 40.547 |
| 44473.18579861111 | 40.161 |
| 44473.227465277785 | 39.929 |
| 44473.26913194445 | 39.717 |
| 44473.31079861111 | 39.37 |
| 44473.352465277785 | 39.292 |
| 44473.39413194445 | 39.659 |
| 44473.43579861111 | 40.914 |
| 44473.477465277785 | 43.153 |
| 44473.51913194445 | 45.798 |
| 44473.56079861111 | 48.385 |
| 44473.602465277785 | 50.412 |
| 44473.64413194445 | 51.706 |
| 44473.68579861111 | 52.13 |
| 44473.727465277785 | 51.3 |
| 44473.76913194445 | 49.833 |
| 44473.81079861111 | 48.52 |
| 44473.852465277785 | 46.995 |
| 44473.89413194445 | 45.412 |
| 44473.93579861111 | 44.099 |
| 44473.977465277785 | 43.057 |
| 44474.01913194445 | 42.265 |
| 44474.06079861111 | 41.802 |
| 44474.102465277785 | 41.358 |
| 44474.14413194445 | 40.953 |
| 44474.18579861111 | 40.721 |
| 44474.227465277785 | 40.547 |
| 44474.26913194445 | 40.258 |
| 44474.31079861111 | 40.103 |
| 44474.352465277785 | 39.968 |
| 44474.39413194445 | 40.335 |
| 44474.43579861111 | 41.648 |
| 44474.477465277785 | 43.771 |
| 44474.51913194445 | 46.416 |
| 44474.56079861111 | 48.926 |
| 44474.602465277785 | 50.837 |
| 44474.64413194445 | 52.208 |
| 44474.68579861111 | 52.439 |
| 44474.727465277785 | 51.165 |
| 44474.76913194445 | 49.93 |
| 44474.81079861111 | 48.636 |
| 44474.852465277785 | 47.13 |
| 44474.89413194445 | 45.605 |
| 44474.93579861111 | 44.389 |
| 44474.977465277785 | 43.443 |
| 44475.01913194445 | 42.787 |
| 44475.06079861111 | 42.323 |
| 44475.102465277785 | 41.976 |
| 44475.14413194445 | 41.744 |
| 44475.18579861111 | 41.512 |
| 44475.227465277785 | 41.242 |
| 44475.26913194445 | 41.03 |
| 44475.31079861111 | 40.74 |
| 44475.352465277785 | 40.875 |
| 44475.39413194445 | 41.416 |
| 44475.43579861111 | 42.014 |
| 44475.477465277785 | 43.54 |
| 44475.51913194445 | 45.238 |
| 44475.56079861111 | 46.165 |
| 44475.602465277785 | 46.879 |
| 44475.64413194445 | 47.787 |
| 44475.68579861111 | 48.443 |
| 44475.727465277785 | 48.115 |
| 44475.76913194445 | 47.285 |
| 44475.81079861111 | 46.397 |
| 44475.852465277785 | 45.393 |
| 44475.89413194445 | 44.292 |
| 44475.93579861111 | 43.289 |
| 44475.977465277785 | 42.362 |
| 44476.01913194445 | 41.628 |
| 44476.06079861111 | 41.068 |
| 44476.102465277785 | 40.605 |
| 44476.14413194445 | 40.2 |
| 44476.18579861111 | 39.968 |
| 44476.227465277785 | 39.659 |
| 44476.26913194445 | 39.466 |
| 44476.31079861111 | 39.234 |
| 44476.352465277785 | 39.099 |
| 44476.39413194445 | 39.389 |
| 44476.43579861111 | 40.624 |
| 44476.477465277785 | 42.806 |
| 44476.51913194445 | 45.431 |
| 44476.56079861111 | 47.845 |
| 44476.602465277785 | 49.872 |
| 44476.64413194445 | 50.972 |
| 44476.68579861111 | 51.204 |
| 44476.727465277785 | 50.528 |
| 44476.76913194445 | 49.64 |
| 44476.81079861111 | 48.153 |
| 44476.852465277785 | 46.609 |
| 44476.89413194445 | 45.431 |
| 44476.93579861111 | 44.505 |
| 44476.977465277785 | 43.655 |
| 44477.01913194445 | 42.96 |
| 44477.06079861111 | 42.323 |
| 44477.102465277785 | 41.686 |
| 44477.14413194445 | 41.261 |
| 44477.18579861111 | 40.933 |
| 44477.227465277785 | 40.528 |
| 44477.26913194445 | 40.258 |
| 44477.31079861111 | 40.007 |
| 44477.352465277785 | 39.852 |
| 44477.39413194445 | 40.316 |
| 44477.43579861111 | 41.512 |
| 44477.477465277785 | 43.095 |
| 44477.51913194445 | 44.929 |
| 44477.56079861111 | 45.76 |
| 44477.602465277785 | 46.609 |
| 44477.64413194445 | 47.13 |
| 44477.68579861111 | 47.053 |
| 44477.727465277785 | 46.455 |
| 44477.76913194445 | 45.76 |
| 44477.81079861111 | 44.987 |
| 44477.852465277785 | 44.273 |
| 44477.89413194445 | 43.79 |
| 44477.93579861111 | 43.385 |
| 44477.977465277785 | 43.134 |
| 44478.01913194445 | 42.922 |
| 44478.06079861111 | 42.748 |
| 44478.102465277785 | 42.69 |
| 44478.14413194445 | 42.574 |
| 44478.18579861111 | 42.458 |
| 44478.227465277785 | 42.439 |
| 44478.26913194445 | 42.4 |
| 44478.31079861111 | 42.265 |
| 44478.352465277785 | 42.207 |
| 44478.39413194445 | 42.536 |
| 44478.43579861111 | 43.269 |
| 44478.477465277785 | 43.559 |
| 44478.51913194445 | 43.829 |
| 44478.56079861111 | 44.215 |
| 44478.602465277785 | 46.319 |
| 44478.64413194445 | 47.15 |
| 44478.68579861111 | 46.995 |
| 44478.727465277785 | 46.146 |
| 44478.76913194445 | 45.47 |
| 44478.81079861111 | 44.505 |
| 44478.852465277785 | 43.636 |
| 44478.89413194445 | 42.902 |
| 44478.93579861111 | 42.111 |
| 44478.977465277785 | 41.512 |
| 44479.01913194445 | 41.146 |
| 44479.06079861111 | 40.721 |
| 44479.102465277785 | 40.431 |
| 44479.14413194445 | 40.354 |
| 44479.18579861111 | 40.258 |
| 44479.227465277785 | 40.084 |
| 44479.26913194445 | 40.103 |
| 44479.31079861111 | 40.142 |
| 44479.352465277785 | 40.316 |
| 44479.39413194445 | 40.605 |
| 44479.43579861111 | 41.223 |
| 44479.477465277785 | 42.227 |
| 44479.51913194445 | 43.675 |
| 44479.56079861111 | 44.389 |
| 44479.602465277785 | 44.968 |
| 44479.64413194445 | 45.296 |
| 44479.68579861111 | 45.412 |
| 44479.727465277785 | 45.2 |
| 44479.76913194445 | 44.582 |
| 44479.81079861111 | 43.848 |
| 44479.852465277785 | 43.192 |
| 44479.89413194445 | 42.613 |
| 44479.93579861111 | 41.899 |
| 44479.977465277785 | 41.3 |
| 44480.01913194445 | 40.624 |
| 44480.06079861111 | 40.142 |
| 44480.102465277785 | 39.698 |
| 44480.14413194445 | 39.389 |
| 44480.18579861111 | 39.041 |
| 44480.227465277785 | 38.81 |
| 44480.26913194445 | 38.482 |
| 44480.31079861111 | 38.269 |
| 44480.352465277785 | 38.095 |
| 44480.39413194445 | 38.269 |
| 44480.43579861111 | 39.485 |
| 44480.477465277785 | 41.59 |
| 44480.51913194445 | 44.041 |
| 44480.56079861111 | 46.3 |
| 44480.602465277785 | 48.057 |
| 44480.64413194445 | 48.578 |
| 44480.68579861111 | 48.501 |
| 44480.727465277785 | 47.652 |
| 44480.76913194445 | 46.957 |
| 44480.81079861111 | 45.895 |
| 44480.852465277785 | 44.601 |
| 44480.89413194445 | 43.173 |
| 44480.93579861111 | 42.111 |
| 44480.977465277785 | 41.319 |
| 44481.01913194445 | 40.76 |
| 44481.06079861111 | 40.238 |
| 44481.102465277785 | 39.929 |
| 44481.14413194445 | 39.736 |
| 44481.18579861111 | 39.775 |
| 44481.227465277785 | 39.64 |
| 44481.26913194445 | 39.582 |
| 44481.31079861111 | 39.543 |
| 44481.352465277785 | 39.543 |
| 44481.39413194445 | 39.814 |
| 44481.43579861111 | 40.682 |
| 44481.477465277785 | 41.03 |
| 44481.51913194445 | 41.281 |
| 44481.56079861111 | 42.574 |
| 44481.602465277785 | 42.651 |
| 44481.64413194445 | 42.458 |
| 44481.68579861111 | 42.439 |
| 44481.727465277785 | 42.69 |
| 44481.76913194445 | 42.111 |
| 44481.81079861111 | 41.319 |
| 44481.852465277785 | 40.779 |
| 44481.89413194445 | 39.794 |
| 44481.93579861111 | 39.35 |
| 44481.977465277785 | 39.35 |
| 44482.01913194445 | 39.254 |
| 44482.06079861111 | 39.119 |
| 44482.102465277785 | 38.945 |
| 44482.14413194445 | 38.675 |
| 44482.18579861111 | 38.559 |
| 44482.227465277785 | 38.288 |
| 44482.26913194445 | 37.98 |
| 44482.31079861111 | 37.806 |
| 44482.352465277785 | 37.844 |
| 44482.39413194445 | 38.211 |
| 44482.43579861111 | 38.926 |
| 44482.477465277785 | 39.794 |
| 44482.51913194445 | 40.972 |
| 44482.56079861111 | 42.13 |
| 44482.602465277785 | 43.617 |
| 44482.64413194445 | 43.559 |
| 44482.68579861111 | 43.173 |
| 44482.727465277785 | 43.308 |
| 44482.76913194445 | 43.018 |
| 44482.81079861111 | 41.918 |
| 44482.852465277785 | 41.204 |
| 44482.89413194445 | 40.605 |
| 44482.93579861111 | 39.91 |
| 44482.977465277785 | 39.408 |
| 44483.01913194445 | 38.926 |
| 44483.06079861111 | 38.501 |
| 44483.102465277785 | 38.192 |
| 44483.14413194445 | 38.173 |
| 44483.18579861111 | 38.038 |
| 44483.227465277785 | 37.96 |
| 44483.26913194445 | 37.999 |
| 44483.31079861111 | 37.999 |
| 44483.352465277785 | 38.057 |
| 44483.39413194445 | 38.346 |
| 44483.43579861111 | 39.234 |
| 44483.477465277785 | 39.968 |
| 44483.51913194445 | 40.296 |
| 44483.56079861111 | 40.007 |
| 44483.602465277785 | 40.74 |
| 44483.64413194445 | 41.397 |
| 44483.68579861111 | 40.76 |
| 44483.727465277785 | 40.258 |
| 44483.76913194445 | 39.891 |
| 44483.81079861111 | 39.64 |
| 44483.852465277785 | 39.254 |
| 44483.89413194445 | 38.926 |
| 44483.93579861111 | 38.095 |
| 44483.977465277785 | 37.806 |
| 44484.01913194445 | 37.555 |
| 44484.06079861111 | 37.4 |
| 44484.102465277785 | 37.149 |
| 44484.14413194445 | 36.995 |
| 44484.18579861111 | 36.956 |
| 44484.227465277785 | 36.841 |
| 44484.26913194445 | 36.744 |
| 44484.31079861111 | 36.744 |
| 44484.352465277785 | 36.416 |
| 44484.39413194445 | 36.455 |
| 44484.43579861111 | 37.4 |
| 44484.477465277785 | 38.926 |
| 44484.51913194445 | 40.779 |
| 44484.56079861111 | 42.69 |
| 44484.602465277785 | 44.041 |
| 44484.64413194445 | 44.794 |
| 44484.68579861111 | 44.852 |
| 44484.727465277785 | 43.52 |
| 44484.76913194445 | 42.227 |
| 44484.81079861111 | 41.319 |
| 44484.852465277785 | 40.219 |
| 44484.89413194445 | 39.234 |
| 44484.93579861111 | 38.462 |
| 44484.977465277785 | 37.883 |
| 44485.01913194445 | 37.478 |
| 44485.06079861111 | 37.169 |
| 44485.102465277785 | 36.86 |
| 44485.14413194445 | 36.725 |
| 44485.18579861111 | 36.609 |
| 44485.227465277785 | 36.493 |
| 44485.26913194445 | 36.493 |
| 44485.31079861111 | 36.435 |
| 44485.352465277785 | 36.435 |
| 44485.39413194445 | 36.802 |
| 44485.43579861111 | 37.96 |
| 44485.477465277785 | 40.007 |
| 44485.51913194445 | 42.42 |
| 44485.56079861111 | 44.601 |
| 44485.602465277785 | 46.377 |
| 44485.64413194445 | 47.458 |
| 44485.68579861111 | 47.439 |
| 44485.727465277785 | 46.339 |
| 44485.76913194445 | 45.007 |
| 44485.81079861111 | 43.636 |
| 44485.852465277785 | 42.227 |
| 44485.89413194445 | 41.03 |
| 44485.93579861111 | 40.084 |
| 44485.977465277785 | 39.485 |
| 44486.01913194445 | 39.041 |
| 44486.06079861111 | 38.733 |
| 44486.102465277785 | 38.501 |
| 44486.14413194445 | 38.327 |
| 44486.18579861111 | 38.173 |
| 44486.227465277785 | 38.018 |
| 44486.26913194445 | 37.902 |
| 44486.31079861111 | 37.787 |
| 44486.352465277785 | 37.671 |
| 44486.39413194445 | 37.98 |
| 44486.43579861111 | 39.099 |
| 44486.477465277785 | 41.03 |
| 44486.51913194445 | 43.289 |
| 44486.56079861111 | 45.373 |
| 44486.602465277785 | 47.072 |
| 44486.64413194445 | 48.038 |
| 44486.68579861111 | 48.134 |
| 44486.727465277785 | 47.15 |
| 44486.76913194445 | 45.895 |
| 44486.81079861111 | 44.505 |
| 44486.852465277785 | 43.134 |
| 44486.89413194445 | 41.879 |
| 44486.93579861111 | 40.856 |
| 44486.977465277785 | 40.277 |
| 44487.01913194445 | 39.814 |
| 44487.06079861111 | 39.485 |
| 44487.102465277785 | 39.35 |
| 44487.14413194445 | 39.099 |
| 44487.18579861111 | 38.926 |
| 44487.227465277785 | 38.887 |
| 44487.26913194445 | 38.79 |
| 44487.31079861111 | 38.694 |
| 44487.352465277785 | 38.636 |
| 44487.39413194445 | 38.887 |
| 44487.43579861111 | 40.007 |
| 44487.477465277785 | 41.783 |
| 44487.51913194445 | 44.215 |
| 44487.56079861111 | 46.223 |
| 44487.602465277785 | 47.845 |
| 44487.64413194445 | 48.655 |
| 44487.68579861111 | 48.366 |
| 44487.727465277785 | 47.188 |
| 44487.76913194445 | 46.088 |
| 44487.81079861111 | 44.794 |
| 44487.852465277785 | 43.578 |
| 44487.89413194445 | 42.4 |
| 44487.93579861111 | 41.512 |
| 44487.977465277785 | 40.875 |
| 44488.01913194445 | 40.373 |
| 44488.06079861111 | 40.007 |
| 44488.102465277785 | 39.756 |
| 44488.14413194445 | 39.428 |
| 44488.18579861111 | 39.196 |
| 44488.227465277785 | 39.177 |
| 44488.26913194445 | 39.157 |
| 44488.31079861111 | 38.926 |
| 44488.352465277785 | 39.312 |
| 44488.39413194445 | 39.466 |
| 44488.43579861111 | 40.451 |
| 44488.477465277785 | 41.667 |
| 44488.51913194445 | 43.578 |
| 44488.56079861111 | 44.37 |
| 44488.602465277785 | 44.447 |
| 44488.64413194445 | 45.412 |
| 44488.68579861111 | 45.431 |
| 44488.727465277785 | 44.872 |
| 44488.76913194445 | 44.234 |
| 44488.81079861111 | 42.999 |
| 44488.852465277785 | 41.821 |
| 44488.89413194445 | 40.914 |
| 44488.93579861111 | 40.277 |
| 44488.977465277785 | 39.756 |
| 44489.01913194445 | 39.389 |
| 44489.06079861111 | 39.061 |
| 44489.102465277785 | 38.887 |
| 44489.14413194445 | 38.559 |
| 44489.18579861111 | 38.269 |
| 44489.227465277785 | 38.018 |
| 44489.26913194445 | 37.709 |
| 44489.31079861111 | 37.381 |
| 44489.352465277785 | 37.246 |
| 44489.39413194445 | 37.458 |
| 44489.43579861111 | 38.424 |
| 44489.477465277785 | 40.258 |
| 44489.51913194445 | 42.42 |
| 44489.56079861111 | 44.447 |
| 44489.602465277785 | 46.126 |
| 44489.64413194445 | 47.053 |
| 44489.68579861111 | 47.188 |
| 44489.727465277785 | 46.126 |
| 44489.76913194445 | 44.717 |
| 44489.81079861111 | 43.153 |
| 44489.852465277785 | 41.821 |
| 44489.89413194445 | 40.528 |
| 44489.93579861111 | 39.717 |
| 44489.977465277785 | 39.119 |
| 44490.01913194445 | 38.636 |
| 44490.06079861111 | 38.366 |
| 44490.102465277785 | 38.211 |
| 44490.14413194445 | 37.96 |
| 44490.18579861111 | 37.864 |
| 44490.227465277785 | 37.709 |
| 44490.26913194445 | 37.516 |
| 44490.31079861111 | 37.439 |
| 44490.352465277785 | 37.478 |
| 44490.39413194445 | 37.825 |
| 44490.43579861111 | 38.81 |
| 44490.477465277785 | 40.644 |
| 44490.51913194445 | 42.381 |
| 44490.56079861111 | 44.408 |
| 44490.602465277785 | 45.972 |
| 44490.64413194445 | 46.957 |
| 44490.68579861111 | 46.725 |
| 44490.727465277785 | 45.509 |
| 44490.76913194445 | 44.563 |
| 44490.81079861111 | 43.424 |
| 44490.852465277785 | 42.188 |
| 44490.89413194445 | 41.088 |
| 44490.93579861111 | 40.238 |
| 44490.977465277785 | 39.659 |
| 44491.01913194445 | 39.234 |
| 44491.06079861111 | 38.926 |
| 44491.102465277785 | 38.694 |
| 44491.14413194445 | 38.578 |
| 44491.18579861111 | 38.346 |
| 44491.227465277785 | 38.134 |
| 44491.26913194445 | 38.057 |
| 44491.31079861111 | 37.922 |
| 44491.352465277785 | 37.825 |
| 44491.39413194445 | 38.095 |
| 44491.43579861111 | 39.119 |
| 44491.477465277785 | 40.914 |
| 44491.51913194445 | 43.095 |
| 44491.56079861111 | 45.219 |
| 44491.602465277785 | 46.242 |
| 44491.64413194445 | 47.381 |
| 44491.68579861111 | 47.323 |
| 44491.727465277785 | 46.455 |
| 44491.76913194445 | 45.586 |
| 44491.81079861111 | 44.563 |
| 44491.852465277785 | 43.462 |
| 44491.89413194445 | 42.42 |
| 44491.93579861111 | 41.455 |
| 44491.977465277785 | 40.721 |
| 44492.01913194445 | 40.065 |
| 44492.06079861111 | 39.485 |
| 44492.102465277785 | 39.138 |
| 44492.14413194445 | 38.829 |
| 44492.18579861111 | 38.482 |
| 44492.227465277785 | 38.366 |
| 44492.26913194445 | 38.25 |
| 44492.31079861111 | 38.076 |
| 44492.352465277785 | 38.057 |
| 44492.39413194445 | 38.404 |
| 44492.43579861111 | 39.331 |
| 44492.477465277785 | 40.373 |
| 44492.51913194445 | 41.706 |
| 44492.56079861111 | 42.941 |
| 44492.602465277785 | 44.292 |
| 44492.64413194445 | 45.509 |
| 44492.68579861111 | 45.18 |
| 44492.727465277785 | 44.814 |
| 44492.76913194445 | 44.37 |
| 44492.81079861111 | 43.501 |
| 44492.852465277785 | 42.516 |
| 44492.89413194445 | 41.667 |
| 44492.93579861111 | 41.088 |
| 44492.977465277785 | 40.875 |
| 44493.01913194445 | 40.682 |
| 44493.06079861111 | 40.586 |
| 44493.102465277785 | 40.509 |
| 44493.14413194445 | 40.431 |
| 44493.18579861111 | 40.47 |
| 44493.227465277785 | 40.354 |
| 44493.26913194445 | 39.698 |
| 44493.31079861111 | 39.428 |
| 44493.352465277785 | 39.273 |
| 44493.39413194445 | 39.447 |
| 44493.43579861111 | 40.296 |
| 44493.477465277785 | 41.59 |
| 44493.51913194445 | 43.54 |
| 44493.56079861111 | 45.161 |
| 44493.602465277785 | 46.204 |
| 44493.64413194445 | 46.667 |
| 44493.68579861111 | 46.513 |
| 44493.727465277785 | 45.837 |
| 44493.76913194445 | 45.065 |
| 44493.81079861111 | 44.099 |
| 44493.852465277785 | 42.922 |
| 44493.89413194445 | 41.937 |
| 44493.93579861111 | 41.126 |
| 44493.977465277785 | 40.567 |
| 44494.01913194445 | 40.161 |
| 44494.06079861111 | 39.852 |
| 44494.102465277785 | 39.678 |
| 44494.14413194445 | 39.621 |
| 44494.18579861111 | 39.485 |
| 44494.227465277785 | 39.35 |
| 44494.26913194445 | 39.37 |
| 44494.31079861111 | 39.389 |
| 44494.352465277785 | 39.408 |
| 44494.39413194445 | 39.794 |
| 44494.43579861111 | 40.721 |
| 44494.477465277785 | 42.458 |
| 44494.51913194445 | 44.485 |
| 44494.56079861111 | 46.474 |
| 44494.602465277785 | 48.134 |
| 44494.64413194445 | 49.099 |
| 44494.68579861111 | 49.003 |
| 44494.727465277785 | 47.941 |
| 44494.76913194445 | 46.725 |
| 44494.81079861111 | 45.393 |
| 44494.852465277785 | 44.061 |
| 44494.89413194445 | 42.941 |
| 44494.93579861111 | 42.111 |
| 44494.977465277785 | 41.474 |
| 44495.01913194445 | 41.03 |
| 44495.06079861111 | 40.682 |
| 44495.102465277785 | 40.354 |
| 44495.14413194445 | 40.045 |
| 44495.18579861111 | 39.678 |
| 44495.227465277785 | 39.524 |
| 44495.26913194445 | 39.678 |
| 44495.31079861111 | 39.872 |
| 44495.352465277785 | 39.949 |
| 44495.39413194445 | 40.142 |
| 44495.43579861111 | 40.914 |
| 44495.477465277785 | 41.03 |
| 44495.51913194445 | 41.088 |
| 44495.56079861111 | 41.281 |
| 44495.602465277785 | 42.15 |
| 44495.64413194445 | 42.304 |
| 44495.68579861111 | 42.034 |
| 44495.727465277785 | 41.59 |
| 44495.76913194445 | 40.972 |
| 44495.81079861111 | 40.451 |
| 44495.852465277785 | 39.736 |
| 44495.89413194445 | 38.906 |
| 44495.93579861111 | 38.424 |
| 44495.977465277785 | 38.173 |
| 44496.01913194445 | 38.038 |
| 44496.06079861111 | 37.902 |
| 44496.102465277785 | 37.748 |
| 44496.14413194445 | 37.555 |
| 44496.18579861111 | 37.439 |
| 44496.227465277785 | 37.362 |
| 44496.26913194445 | 37.207 |
| 44496.31079861111 | 37.111 |
| 44496.352465277785 | 37.092 |
| 44496.39413194445 | 37.304 |
| 44496.43579861111 | 37.806 |